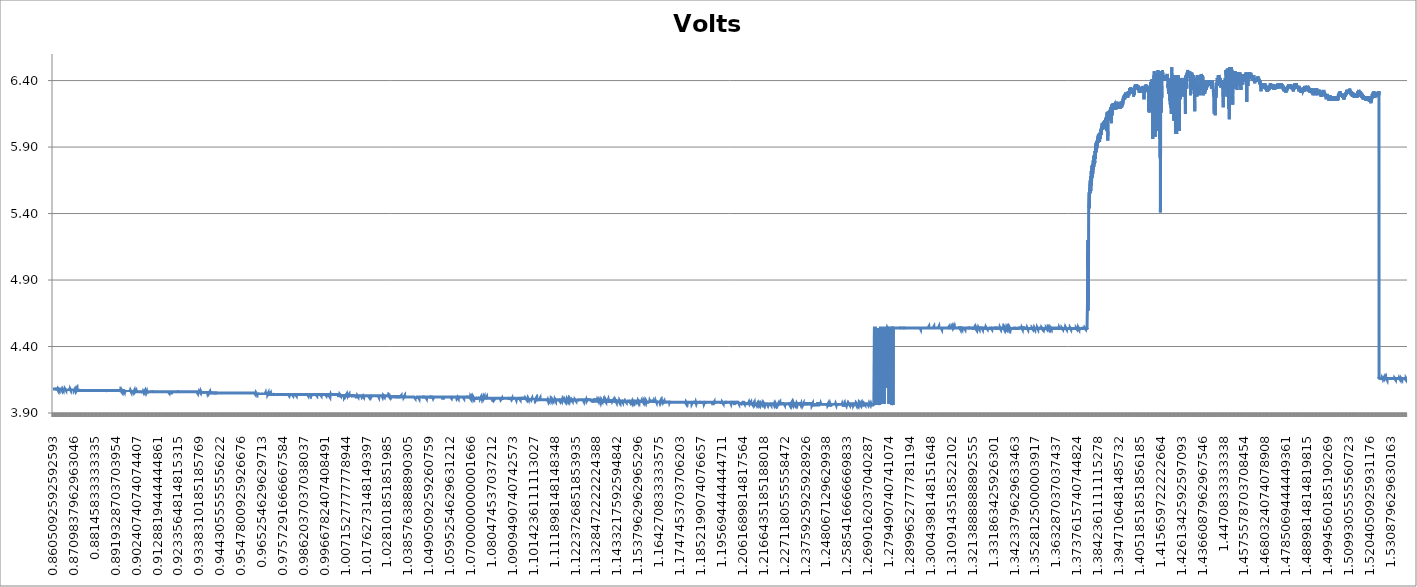
| Category | Volts |
|---|---|
| 0.8605092592592593 | 4.08 |
| 0.8605671296296297 | 4.08 |
| 0.8606250000000001 | 4.08 |
| 0.8606828703703705 | 4.08 |
| 0.8607407407407409 | 4.08 |
| 0.8607986111111113 | 4.08 |
| 0.8608564814814818 | 4.08 |
| 0.8609143518518522 | 4.08 |
| 0.8609722222222226 | 4.08 |
| 0.861030092592593 | 4.08 |
| 0.8610879629629634 | 4.08 |
| 0.8611458333333338 | 4.08 |
| 0.8612037037037042 | 4.08 |
| 0.8612615740740747 | 4.08 |
| 0.8613194444444451 | 4.08 |
| 0.8613773148148155 | 4.08 |
| 0.8614351851851859 | 4.08 |
| 0.8614930555555563 | 4.08 |
| 0.8615509259259267 | 4.08 |
| 0.8616087962962972 | 4.08 |
| 0.8616666666666676 | 4.08 |
| 0.861724537037038 | 4.08 |
| 0.8617824074074084 | 4.08 |
| 0.8618402777777788 | 4.08 |
| 0.8618981481481492 | 4.08 |
| 0.8619560185185197 | 4.08 |
| 0.8620138888888901 | 4.08 |
| 0.8620717592592605 | 4.08 |
| 0.8621296296296309 | 4.08 |
| 0.8621875000000013 | 4.07 |
| 0.8622453703703717 | 4.08 |
| 0.8623032407407422 | 4.08 |
| 0.8623611111111126 | 4.08 |
| 0.862418981481483 | 4.08 |
| 0.8624768518518534 | 4.08 |
| 0.8625347222222238 | 4.08 |
| 0.8625925925925942 | 4.08 |
| 0.8626504629629647 | 4.08 |
| 0.8627083333333351 | 4.08 |
| 0.8627662037037055 | 4.08 |
| 0.8628240740740759 | 4.08 |
| 0.8628819444444463 | 4.08 |
| 0.8629398148148167 | 4.08 |
| 0.8629976851851872 | 4.08 |
| 0.8630555555555576 | 4.08 |
| 0.863113425925928 | 4.07 |
| 0.8631712962962984 | 4.08 |
| 0.8632291666666688 | 4.08 |
| 0.8632870370370392 | 4.08 |
| 0.8633449074074097 | 4.08 |
| 0.8634027777777801 | 4.08 |
| 0.8634606481481505 | 4.08 |
| 0.8635185185185209 | 4.08 |
| 0.8635763888888913 | 4.08 |
| 0.8636342592592617 | 4.08 |
| 0.8636921296296322 | 4.07 |
| 0.8637500000000026 | 4.08 |
| 0.863807870370373 | 4.08 |
| 0.8638657407407434 | 4.08 |
| 0.8639236111111138 | 4.08 |
| 0.8639814814814842 | 4.08 |
| 0.8640393518518547 | 4.08 |
| 0.8640972222222251 | 4.08 |
| 0.8641550925925955 | 4.08 |
| 0.8642129629629659 | 4.08 |
| 0.8642708333333363 | 4.08 |
| 0.8643287037037067 | 4.08 |
| 0.8643865740740772 | 4.08 |
| 0.8644444444444476 | 4.08 |
| 0.864502314814818 | 4.08 |
| 0.8645601851851884 | 4.08 |
| 0.8646180555555588 | 4.08 |
| 0.8646759259259292 | 4.08 |
| 0.8647337962962997 | 4.08 |
| 0.8647916666666701 | 4.08 |
| 0.8648495370370405 | 4.08 |
| 0.8649074074074109 | 4.08 |
| 0.8649652777777813 | 4.08 |
| 0.8650231481481517 | 4.08 |
| 0.8650810185185221 | 4.07 |
| 0.8651388888888926 | 4.07 |
| 0.865196759259263 | 4.07 |
| 0.8652546296296334 | 4.08 |
| 0.8653125000000038 | 4.08 |
| 0.8653703703703742 | 4.08 |
| 0.8654282407407446 | 4.08 |
| 0.8654861111111151 | 4.08 |
| 0.8655439814814855 | 4.08 |
| 0.8656018518518559 | 4.08 |
| 0.8656597222222263 | 4.07 |
| 0.8657175925925967 | 4.08 |
| 0.8657754629629671 | 4.07 |
| 0.8658333333333376 | 4.08 |
| 0.865891203703708 | 4.07 |
| 0.8659490740740784 | 4.08 |
| 0.8660069444444488 | 4.08 |
| 0.8660648148148192 | 4.07 |
| 0.8661226851851896 | 4.08 |
| 0.8661805555555601 | 4.07 |
| 0.8662384259259305 | 4.08 |
| 0.8662962962963009 | 4.08 |
| 0.8663541666666713 | 4.08 |
| 0.8664120370370417 | 4.08 |
| 0.8664699074074121 | 4.07 |
| 0.8665277777777826 | 4.08 |
| 0.866585648148153 | 4.08 |
| 0.8666435185185234 | 4.08 |
| 0.8667013888888938 | 4.08 |
| 0.8667592592592642 | 4.08 |
| 0.8668171296296346 | 4.08 |
| 0.8668750000000051 | 4.08 |
| 0.8669328703703755 | 4.08 |
| 0.8669907407407459 | 4.07 |
| 0.8670486111111163 | 4.08 |
| 0.8671064814814867 | 4.08 |
| 0.8671643518518571 | 4.07 |
| 0.8672222222222276 | 4.07 |
| 0.867280092592598 | 4.08 |
| 0.8673379629629684 | 4.07 |
| 0.8673958333333388 | 4.08 |
| 0.8674537037037092 | 4.07 |
| 0.8675115740740796 | 4.08 |
| 0.86756944444445 | 4.08 |
| 0.8676273148148205 | 4.08 |
| 0.8676851851851909 | 4.08 |
| 0.8677430555555613 | 4.07 |
| 0.8678009259259317 | 4.07 |
| 0.8678587962963021 | 4.08 |
| 0.8679166666666726 | 4.08 |
| 0.867974537037043 | 4.08 |
| 0.8680324074074134 | 4.07 |
| 0.8680902777777838 | 4.08 |
| 0.8681481481481542 | 4.07 |
| 0.8682060185185246 | 4.08 |
| 0.868263888888895 | 4.07 |
| 0.8683217592592655 | 4.08 |
| 0.8683796296296359 | 4.08 |
| 0.8684375000000063 | 4.08 |
| 0.8684953703703767 | 4.07 |
| 0.8685532407407471 | 4.08 |
| 0.8686111111111176 | 4.07 |
| 0.868668981481488 | 4.07 |
| 0.8687268518518584 | 4.07 |
| 0.8687847222222288 | 4.07 |
| 0.8688425925925992 | 4.07 |
| 0.8689004629629696 | 4.08 |
| 0.86895833333334 | 4.07 |
| 0.8690162037037105 | 4.07 |
| 0.8690740740740809 | 4.08 |
| 0.8691319444444513 | 4.08 |
| 0.8691898148148217 | 4.08 |
| 0.8692476851851921 | 4.08 |
| 0.8693055555555625 | 4.08 |
| 0.869363425925933 | 4.08 |
| 0.8694212962963034 | 4.07 |
| 0.8694791666666738 | 4.07 |
| 0.8695370370370442 | 4.08 |
| 0.8695949074074146 | 4.07 |
| 0.869652777777785 | 4.08 |
| 0.8697106481481555 | 4.07 |
| 0.8697685185185259 | 4.08 |
| 0.8698263888888963 | 4.08 |
| 0.8698842592592667 | 4.07 |
| 0.8699421296296371 | 4.08 |
| 0.8700000000000075 | 4.07 |
| 0.870057870370378 | 4.07 |
| 0.8701157407407484 | 4.07 |
| 0.8701736111111188 | 4.08 |
| 0.8702314814814892 | 4.08 |
| 0.8702893518518596 | 4.07 |
| 0.87034722222223 | 4.08 |
| 0.8704050925926005 | 4.07 |
| 0.8704629629629709 | 4.08 |
| 0.8705208333333413 | 4.07 |
| 0.8705787037037117 | 4.07 |
| 0.8706365740740821 | 4.08 |
| 0.8706944444444525 | 4.07 |
| 0.870752314814823 | 4.07 |
| 0.8708101851851934 | 4.07 |
| 0.8708680555555638 | 4.08 |
| 0.8709259259259342 | 4.07 |
| 0.8709837962963046 | 4.08 |
| 0.871041666666675 | 4.07 |
| 0.8710995370370455 | 4.07 |
| 0.8711574074074159 | 4.07 |
| 0.8712152777777863 | 4.07 |
| 0.8712731481481567 | 4.07 |
| 0.8713310185185271 | 4.07 |
| 0.8713888888888975 | 4.07 |
| 0.871446759259268 | 4.08 |
| 0.8715046296296384 | 4.08 |
| 0.8715625000000088 | 4.08 |
| 0.8716203703703792 | 4.07 |
| 0.8716782407407496 | 4.08 |
| 0.87173611111112 | 4.08 |
| 0.8717939814814905 | 4.08 |
| 0.8718518518518609 | 4.07 |
| 0.8719097222222313 | 4.07 |
| 0.8719675925926017 | 4.07 |
| 0.8720254629629721 | 4.07 |
| 0.8720833333333425 | 4.07 |
| 0.872141203703713 | 4.07 |
| 0.8721990740740834 | 4.08 |
| 0.8722569444444538 | 4.07 |
| 0.8723148148148242 | 4.07 |
| 0.8723726851851946 | 4.07 |
| 0.872430555555565 | 4.07 |
| 0.8724884259259355 | 4.07 |
| 0.8725462962963059 | 4.07 |
| 0.8726041666666763 | 4.08 |
| 0.8726620370370467 | 4.07 |
| 0.8727199074074171 | 4.07 |
| 0.8727777777777875 | 4.08 |
| 0.872835648148158 | 4.07 |
| 0.8728935185185284 | 4.07 |
| 0.8729513888888988 | 4.07 |
| 0.8730092592592692 | 4.07 |
| 0.8730671296296396 | 4.07 |
| 0.87312500000001 | 4.07 |
| 0.8731828703703804 | 4.07 |
| 0.8732407407407509 | 4.07 |
| 0.8732986111111213 | 4.07 |
| 0.8733564814814917 | 4.07 |
| 0.8734143518518621 | 4.07 |
| 0.8734722222222325 | 4.07 |
| 0.873530092592603 | 4.07 |
| 0.8735879629629734 | 4.07 |
| 0.8736458333333438 | 4.07 |
| 0.8737037037037142 | 4.07 |
| 0.8737615740740846 | 4.07 |
| 0.873819444444455 | 4.07 |
| 0.8738773148148254 | 4.07 |
| 0.8739351851851959 | 4.07 |
| 0.8739930555555663 | 4.07 |
| 0.8740509259259367 | 4.07 |
| 0.8741087962963071 | 4.07 |
| 0.8741666666666775 | 4.08 |
| 0.8742245370370479 | 4.07 |
| 0.8742824074074184 | 4.08 |
| 0.8743402777777888 | 4.08 |
| 0.8743981481481592 | 4.07 |
| 0.8744560185185296 | 4.07 |
| 0.8745138888889 | 4.07 |
| 0.8745717592592704 | 4.07 |
| 0.8746296296296409 | 4.07 |
| 0.8746875000000113 | 4.07 |
| 0.8747453703703817 | 4.07 |
| 0.8748032407407521 | 4.07 |
| 0.8748611111111225 | 4.07 |
| 0.8749189814814929 | 4.07 |
| 0.8749768518518634 | 4.07 |
| 0.8750347222222338 | 4.07 |
| 0.8750925925926042 | 4.07 |
| 0.8751504629629746 | 4.07 |
| 0.875208333333345 | 4.07 |
| 0.8752662037037154 | 4.07 |
| 0.8753240740740859 | 4.07 |
| 0.8753819444444563 | 4.07 |
| 0.8754398148148267 | 4.07 |
| 0.8754976851851971 | 4.07 |
| 0.8755555555555675 | 4.07 |
| 0.8756134259259379 | 4.07 |
| 0.8756712962963084 | 4.07 |
| 0.8757291666666788 | 4.07 |
| 0.8757870370370492 | 4.07 |
| 0.8758449074074196 | 4.07 |
| 0.87590277777779 | 4.07 |
| 0.8759606481481604 | 4.07 |
| 0.8760185185185309 | 4.07 |
| 0.8760763888889013 | 4.07 |
| 0.8761342592592717 | 4.06 |
| 0.8761921296296421 | 4.07 |
| 0.8762500000000125 | 4.07 |
| 0.8763078703703829 | 4.07 |
| 0.8763657407407534 | 4.07 |
| 0.8764236111111238 | 4.07 |
| 0.8764814814814942 | 4.07 |
| 0.8765393518518646 | 4.07 |
| 0.876597222222235 | 4.07 |
| 0.8766550925926054 | 4.07 |
| 0.8767129629629759 | 4.07 |
| 0.8767708333333463 | 4.07 |
| 0.8768287037037167 | 4.07 |
| 0.8768865740740871 | 4.07 |
| 0.8769444444444575 | 4.07 |
| 0.8770023148148279 | 4.07 |
| 0.8770601851851983 | 4.07 |
| 0.8771180555555688 | 4.07 |
| 0.8771759259259392 | 4.07 |
| 0.8772337962963096 | 4.07 |
| 0.87729166666668 | 4.07 |
| 0.8773495370370504 | 4.07 |
| 0.8774074074074208 | 4.07 |
| 0.8774652777777913 | 4.07 |
| 0.8775231481481617 | 4.07 |
| 0.8775810185185321 | 4.07 |
| 0.8776388888889025 | 4.07 |
| 0.8776967592592729 | 4.07 |
| 0.8777546296296433 | 4.07 |
| 0.8778125000000138 | 4.07 |
| 0.8778703703703842 | 4.07 |
| 0.8779282407407546 | 4.07 |
| 0.877986111111125 | 4.07 |
| 0.8780439814814954 | 4.07 |
| 0.8781018518518658 | 4.07 |
| 0.8781597222222363 | 4.07 |
| 0.8782175925926067 | 4.07 |
| 0.8782754629629771 | 4.07 |
| 0.8783333333333475 | 4.07 |
| 0.8783912037037179 | 4.07 |
| 0.8784490740740883 | 4.07 |
| 0.8785069444444588 | 4.07 |
| 0.8785648148148292 | 4.07 |
| 0.8786226851851996 | 4.07 |
| 0.87868055555557 | 4.07 |
| 0.8787384259259404 | 4.07 |
| 0.8787962962963108 | 4.07 |
| 0.8788541666666813 | 4.07 |
| 0.8789120370370517 | 4.07 |
| 0.8789699074074221 | 4.07 |
| 0.8790277777777925 | 4.07 |
| 0.8790856481481629 | 4.07 |
| 0.8791435185185333 | 4.07 |
| 0.8792013888889038 | 4.07 |
| 0.8792592592592742 | 4.07 |
| 0.8793171296296446 | 4.07 |
| 0.879375000000015 | 4.07 |
| 0.8794328703703854 | 4.07 |
| 0.8794907407407558 | 4.07 |
| 0.8795486111111263 | 4.07 |
| 0.8796064814814967 | 4.07 |
| 0.8796643518518671 | 4.07 |
| 0.8797222222222375 | 4.07 |
| 0.8797800925926079 | 4.07 |
| 0.8798379629629783 | 4.07 |
| 0.8798958333333488 | 4.07 |
| 0.8799537037037192 | 4.07 |
| 0.8800115740740896 | 4.07 |
| 0.88006944444446 | 4.07 |
| 0.8801273148148304 | 4.07 |
| 0.8801851851852008 | 4.07 |
| 0.8802430555555713 | 4.07 |
| 0.8803009259259417 | 4.07 |
| 0.8803587962963121 | 4.07 |
| 0.8804166666666825 | 4.06 |
| 0.8804745370370529 | 4.06 |
| 0.8805324074074233 | 4.06 |
| 0.8805902777777938 | 4.07 |
| 0.8806481481481642 | 4.07 |
| 0.8807060185185346 | 4.07 |
| 0.880763888888905 | 4.07 |
| 0.8808217592592754 | 4.07 |
| 0.8808796296296458 | 4.07 |
| 0.8809375000000162 | 4.07 |
| 0.8809953703703867 | 4.07 |
| 0.8810532407407571 | 4.07 |
| 0.8811111111111275 | 4.07 |
| 0.8811689814814979 | 4.07 |
| 0.8812268518518683 | 4.07 |
| 0.8812847222222387 | 4.07 |
| 0.8813425925926092 | 4.07 |
| 0.8814004629629796 | 4.07 |
| 0.88145833333335 | 4.07 |
| 0.8815162037037204 | 4.07 |
| 0.8815740740740908 | 4.07 |
| 0.8816319444444612 | 4.07 |
| 0.8816898148148317 | 4.07 |
| 0.8817476851852021 | 4.07 |
| 0.8818055555555725 | 4.07 |
| 0.8818634259259429 | 4.07 |
| 0.8819212962963133 | 4.07 |
| 0.8819791666666837 | 4.07 |
| 0.8820370370370542 | 4.07 |
| 0.8820949074074246 | 4.07 |
| 0.882152777777795 | 4.07 |
| 0.8822106481481654 | 4.07 |
| 0.8822685185185358 | 4.07 |
| 0.8823263888889062 | 4.07 |
| 0.8823842592592767 | 4.07 |
| 0.8824421296296471 | 4.07 |
| 0.8825000000000175 | 4.07 |
| 0.8825578703703879 | 4.07 |
| 0.8826157407407583 | 4.07 |
| 0.8826736111111287 | 4.07 |
| 0.8827314814814992 | 4.07 |
| 0.8827893518518696 | 4.07 |
| 0.88284722222224 | 4.07 |
| 0.8829050925926104 | 4.07 |
| 0.8829629629629808 | 4.07 |
| 0.8830208333333512 | 4.07 |
| 0.8830787037037217 | 4.07 |
| 0.8831365740740921 | 4.07 |
| 0.8831944444444625 | 4.07 |
| 0.8832523148148329 | 4.07 |
| 0.8833101851852033 | 4.07 |
| 0.8833680555555737 | 4.07 |
| 0.8834259259259442 | 4.07 |
| 0.8834837962963146 | 4.07 |
| 0.883541666666685 | 4.07 |
| 0.8835995370370554 | 4.07 |
| 0.8836574074074258 | 4.07 |
| 0.8837152777777962 | 4.07 |
| 0.8837731481481667 | 4.07 |
| 0.8838310185185371 | 4.07 |
| 0.8838888888889075 | 4.07 |
| 0.8839467592592779 | 4.07 |
| 0.8840046296296483 | 4.07 |
| 0.8840625000000187 | 4.07 |
| 0.8841203703703892 | 4.07 |
| 0.8841782407407596 | 4.07 |
| 0.88423611111113 | 4.07 |
| 0.8842939814815004 | 4.07 |
| 0.8843518518518708 | 4.07 |
| 0.8844097222222412 | 4.07 |
| 0.8844675925926117 | 4.07 |
| 0.8845254629629821 | 4.07 |
| 0.8845833333333525 | 4.07 |
| 0.8846412037037229 | 4.07 |
| 0.8846990740740933 | 4.07 |
| 0.8847569444444637 | 4.07 |
| 0.8848148148148341 | 4.07 |
| 0.8848726851852046 | 4.07 |
| 0.884930555555575 | 4.07 |
| 0.8849884259259454 | 4.07 |
| 0.8850462962963158 | 4.07 |
| 0.8851041666666862 | 4.07 |
| 0.8851620370370566 | 4.07 |
| 0.8852199074074271 | 4.07 |
| 0.8852777777777975 | 4.07 |
| 0.8853356481481679 | 4.07 |
| 0.8853935185185383 | 4.07 |
| 0.8854513888889087 | 4.07 |
| 0.8855092592592791 | 4.07 |
| 0.8855671296296496 | 4.07 |
| 0.88562500000002 | 4.07 |
| 0.8856828703703904 | 4.07 |
| 0.8857407407407608 | 4.07 |
| 0.8857986111111312 | 4.07 |
| 0.8858564814815016 | 4.07 |
| 0.8859143518518721 | 4.07 |
| 0.8859722222222425 | 4.07 |
| 0.8860300925926129 | 4.07 |
| 0.8860879629629833 | 4.07 |
| 0.8861458333333537 | 4.07 |
| 0.8862037037037241 | 4.07 |
| 0.8862615740740946 | 4.07 |
| 0.886319444444465 | 4.07 |
| 0.8863773148148354 | 4.07 |
| 0.8864351851852058 | 4.07 |
| 0.8864930555555762 | 4.06 |
| 0.8865509259259466 | 4.07 |
| 0.8866087962963171 | 4.06 |
| 0.8866666666666875 | 4.06 |
| 0.8867245370370579 | 4.06 |
| 0.8867824074074283 | 4.06 |
| 0.8868402777777987 | 4.06 |
| 0.8868981481481691 | 4.07 |
| 0.8869560185185396 | 4.06 |
| 0.88701388888891 | 4.07 |
| 0.8870717592592804 | 4.06 |
| 0.8871296296296508 | 4.06 |
| 0.8871875000000212 | 4.07 |
| 0.8872453703703916 | 4.07 |
| 0.8873032407407621 | 4.07 |
| 0.8873611111111325 | 4.07 |
| 0.8874189814815029 | 4.07 |
| 0.8874768518518733 | 4.07 |
| 0.8875347222222437 | 4.07 |
| 0.8875925925926141 | 4.07 |
| 0.8876504629629846 | 4.07 |
| 0.887708333333355 | 4.07 |
| 0.8877662037037254 | 4.07 |
| 0.8878240740740958 | 4.07 |
| 0.8878819444444662 | 4.07 |
| 0.8879398148148366 | 4.07 |
| 0.887997685185207 | 4.07 |
| 0.8880555555555775 | 4.07 |
| 0.8881134259259479 | 4.07 |
| 0.8881712962963183 | 4.07 |
| 0.8882291666666887 | 4.07 |
| 0.8882870370370591 | 4.07 |
| 0.8883449074074296 | 4.07 |
| 0.8884027777778 | 4.07 |
| 0.8884606481481704 | 4.07 |
| 0.8885185185185408 | 4.07 |
| 0.8885763888889112 | 4.07 |
| 0.8886342592592816 | 4.07 |
| 0.888692129629652 | 4.07 |
| 0.8887500000000225 | 4.07 |
| 0.8888078703703929 | 4.07 |
| 0.8888657407407633 | 4.07 |
| 0.8889236111111337 | 4.07 |
| 0.8889814814815041 | 4.07 |
| 0.8890393518518745 | 4.07 |
| 0.889097222222245 | 4.07 |
| 0.8891550925926154 | 4.07 |
| 0.8892129629629858 | 4.07 |
| 0.8892708333333562 | 4.07 |
| 0.8893287037037266 | 4.07 |
| 0.889386574074097 | 4.07 |
| 0.8894444444444675 | 4.07 |
| 0.8895023148148379 | 4.07 |
| 0.8895601851852083 | 4.07 |
| 0.8896180555555787 | 4.07 |
| 0.8896759259259491 | 4.07 |
| 0.8897337962963195 | 4.07 |
| 0.88979166666669 | 4.07 |
| 0.8898495370370604 | 4.07 |
| 0.8899074074074308 | 4.07 |
| 0.8899652777778012 | 4.07 |
| 0.8900231481481716 | 4.07 |
| 0.890081018518542 | 4.07 |
| 0.8901388888889125 | 4.07 |
| 0.8901967592592829 | 4.07 |
| 0.8902546296296533 | 4.07 |
| 0.8903125000000237 | 4.07 |
| 0.8903703703703941 | 4.07 |
| 0.8904282407407645 | 4.07 |
| 0.890486111111135 | 4.07 |
| 0.8905439814815054 | 4.07 |
| 0.8906018518518758 | 4.07 |
| 0.8906597222222462 | 4.07 |
| 0.8907175925926166 | 4.07 |
| 0.890775462962987 | 4.07 |
| 0.8908333333333575 | 4.07 |
| 0.8908912037037279 | 4.07 |
| 0.8909490740740983 | 4.07 |
| 0.8910069444444687 | 4.07 |
| 0.8910648148148391 | 4.07 |
| 0.8911226851852095 | 4.07 |
| 0.89118055555558 | 4.07 |
| 0.8912384259259504 | 4.07 |
| 0.8912962962963208 | 4.07 |
| 0.8913541666666912 | 4.07 |
| 0.8914120370370616 | 4.06 |
| 0.891469907407432 | 4.07 |
| 0.8915277777778025 | 4.07 |
| 0.8915856481481729 | 4.07 |
| 0.8916435185185433 | 4.07 |
| 0.8917013888889137 | 4.07 |
| 0.8917592592592841 | 4.07 |
| 0.8918171296296545 | 4.07 |
| 0.891875000000025 | 4.07 |
| 0.8919328703703954 | 4.07 |
| 0.8919907407407658 | 4.07 |
| 0.8920486111111362 | 4.07 |
| 0.8921064814815066 | 4.07 |
| 0.892164351851877 | 4.07 |
| 0.8922222222222475 | 4.07 |
| 0.8922800925926179 | 4.07 |
| 0.8923379629629883 | 4.07 |
| 0.8923958333333587 | 4.07 |
| 0.8924537037037291 | 4.07 |
| 0.8925115740740995 | 4.07 |
| 0.89256944444447 | 4.07 |
| 0.8926273148148404 | 4.07 |
| 0.8926851851852108 | 4.07 |
| 0.8927430555555812 | 4.07 |
| 0.8928009259259516 | 4.07 |
| 0.892858796296322 | 4.07 |
| 0.8929166666666924 | 4.07 |
| 0.8929745370370629 | 4.07 |
| 0.8930324074074333 | 4.07 |
| 0.8930902777778037 | 4.07 |
| 0.8931481481481741 | 4.07 |
| 0.8932060185185445 | 4.07 |
| 0.893263888888915 | 4.07 |
| 0.8933217592592854 | 4.07 |
| 0.8933796296296558 | 4.07 |
| 0.8934375000000262 | 4.07 |
| 0.8934953703703966 | 4.07 |
| 0.893553240740767 | 4.07 |
| 0.8936111111111374 | 4.07 |
| 0.8936689814815079 | 4.07 |
| 0.8937268518518783 | 4.07 |
| 0.8937847222222487 | 4.07 |
| 0.8938425925926191 | 4.07 |
| 0.8939004629629895 | 4.07 |
| 0.89395833333336 | 4.07 |
| 0.8940162037037304 | 4.07 |
| 0.8940740740741008 | 4.07 |
| 0.8941319444444712 | 4.07 |
| 0.8941898148148416 | 4.07 |
| 0.894247685185212 | 4.07 |
| 0.8943055555555824 | 4.07 |
| 0.8943634259259529 | 4.06 |
| 0.8944212962963233 | 4.07 |
| 0.8944791666666937 | 4.07 |
| 0.8945370370370641 | 4.07 |
| 0.8945949074074345 | 4.07 |
| 0.8946527777778049 | 4.07 |
| 0.8947106481481754 | 4.07 |
| 0.8947685185185458 | 4.07 |
| 0.8948263888889162 | 4.07 |
| 0.8948842592592866 | 4.06 |
| 0.894942129629657 | 4.07 |
| 0.8950000000000274 | 4.07 |
| 0.8950578703703979 | 4.07 |
| 0.8951157407407683 | 4.07 |
| 0.8951736111111387 | 4.07 |
| 0.8952314814815091 | 4.07 |
| 0.8952893518518795 | 4.07 |
| 0.8953472222222499 | 4.06 |
| 0.8954050925926204 | 4.07 |
| 0.8954629629629908 | 4.06 |
| 0.8955208333333612 | 4.06 |
| 0.8955787037037316 | 4.07 |
| 0.895636574074102 | 4.07 |
| 0.8956944444444724 | 4.07 |
| 0.8957523148148429 | 4.07 |
| 0.8958101851852133 | 4.07 |
| 0.8958680555555837 | 4.07 |
| 0.8959259259259541 | 4.07 |
| 0.8959837962963245 | 4.07 |
| 0.8960416666666949 | 4.07 |
| 0.8960995370370654 | 4.07 |
| 0.8961574074074358 | 4.07 |
| 0.8962152777778062 | 4.07 |
| 0.8962731481481766 | 4.07 |
| 0.896331018518547 | 4.07 |
| 0.8963888888889174 | 4.06 |
| 0.8964467592592879 | 4.06 |
| 0.8965046296296583 | 4.07 |
| 0.8965625000000287 | 4.06 |
| 0.8966203703703991 | 4.07 |
| 0.8966782407407695 | 4.07 |
| 0.8967361111111399 | 4.07 |
| 0.8967939814815103 | 4.07 |
| 0.8968518518518808 | 4.06 |
| 0.8969097222222512 | 4.07 |
| 0.8969675925926216 | 4.07 |
| 0.897025462962992 | 4.06 |
| 0.8970833333333624 | 4.06 |
| 0.8971412037037328 | 4.07 |
| 0.8971990740741033 | 4.07 |
| 0.8972569444444737 | 4.07 |
| 0.8973148148148441 | 4.07 |
| 0.8973726851852145 | 4.06 |
| 0.8974305555555849 | 4.07 |
| 0.8974884259259553 | 4.07 |
| 0.8975462962963258 | 4.07 |
| 0.8976041666666962 | 4.07 |
| 0.8976620370370666 | 4.07 |
| 0.897719907407437 | 4.06 |
| 0.8977777777778074 | 4.07 |
| 0.8978356481481778 | 4.07 |
| 0.8978935185185483 | 4.07 |
| 0.8979513888889187 | 4.06 |
| 0.8980092592592891 | 4.07 |
| 0.8980671296296595 | 4.06 |
| 0.8981250000000299 | 4.07 |
| 0.8981828703704003 | 4.06 |
| 0.8982407407407708 | 4.06 |
| 0.8982986111111412 | 4.07 |
| 0.8983564814815116 | 4.06 |
| 0.898414351851882 | 4.06 |
| 0.8984722222222524 | 4.07 |
| 0.8985300925926228 | 4.06 |
| 0.8985879629629933 | 4.06 |
| 0.8986458333333637 | 4.06 |
| 0.8987037037037341 | 4.07 |
| 0.8987615740741045 | 4.07 |
| 0.8988194444444749 | 4.07 |
| 0.8988773148148453 | 4.06 |
| 0.8989351851852158 | 4.06 |
| 0.8989930555555862 | 4.06 |
| 0.8990509259259566 | 4.07 |
| 0.899108796296327 | 4.06 |
| 0.8991666666666974 | 4.06 |
| 0.8992245370370678 | 4.06 |
| 0.8992824074074383 | 4.07 |
| 0.8993402777778087 | 4.07 |
| 0.8993981481481791 | 4.07 |
| 0.8994560185185495 | 4.07 |
| 0.8995138888889199 | 4.07 |
| 0.8995717592592903 | 4.07 |
| 0.8996296296296608 | 4.06 |
| 0.8996875000000312 | 4.07 |
| 0.8997453703704016 | 4.06 |
| 0.899803240740772 | 4.06 |
| 0.8998611111111424 | 4.07 |
| 0.8999189814815128 | 4.06 |
| 0.8999768518518833 | 4.06 |
| 0.9000347222222537 | 4.06 |
| 0.9000925925926241 | 4.06 |
| 0.9001504629629945 | 4.06 |
| 0.9002083333333649 | 4.06 |
| 0.9002662037037353 | 4.06 |
| 0.9003240740741058 | 4.06 |
| 0.9003819444444762 | 4.06 |
| 0.9004398148148466 | 4.06 |
| 0.900497685185217 | 4.06 |
| 0.9005555555555874 | 4.07 |
| 0.9006134259259578 | 4.07 |
| 0.9006712962963282 | 4.06 |
| 0.9007291666666987 | 4.07 |
| 0.9007870370370691 | 4.06 |
| 0.9008449074074395 | 4.07 |
| 0.9009027777778099 | 4.07 |
| 0.9009606481481803 | 4.06 |
| 0.9010185185185507 | 4.06 |
| 0.9010763888889212 | 4.06 |
| 0.9011342592592916 | 4.06 |
| 0.901192129629662 | 4.06 |
| 0.9012500000000324 | 4.06 |
| 0.9013078703704028 | 4.07 |
| 0.9013657407407732 | 4.07 |
| 0.9014236111111437 | 4.06 |
| 0.9014814814815141 | 4.06 |
| 0.9015393518518845 | 4.07 |
| 0.9015972222222549 | 4.06 |
| 0.9016550925926253 | 4.06 |
| 0.9017129629629957 | 4.06 |
| 0.9017708333333662 | 4.06 |
| 0.9018287037037366 | 4.06 |
| 0.901886574074107 | 4.06 |
| 0.9019444444444774 | 4.06 |
| 0.9020023148148478 | 4.06 |
| 0.9020601851852182 | 4.06 |
| 0.9021180555555887 | 4.07 |
| 0.9021759259259591 | 4.07 |
| 0.9022337962963295 | 4.06 |
| 0.9022916666666999 | 4.07 |
| 0.9023495370370703 | 4.06 |
| 0.9024074074074407 | 4.07 |
| 0.9024652777778112 | 4.06 |
| 0.9025231481481816 | 4.06 |
| 0.902581018518552 | 4.06 |
| 0.9026388888889224 | 4.06 |
| 0.9026967592592928 | 4.06 |
| 0.9027546296296632 | 4.06 |
| 0.9028125000000337 | 4.06 |
| 0.9028703703704041 | 4.06 |
| 0.9029282407407745 | 4.06 |
| 0.9029861111111449 | 4.06 |
| 0.9030439814815153 | 4.06 |
| 0.9031018518518857 | 4.06 |
| 0.9031597222222562 | 4.06 |
| 0.9032175925926266 | 4.06 |
| 0.903275462962997 | 4.06 |
| 0.9033333333333674 | 4.06 |
| 0.9033912037037378 | 4.06 |
| 0.9034490740741082 | 4.06 |
| 0.9035069444444787 | 4.06 |
| 0.9035648148148491 | 4.06 |
| 0.9036226851852195 | 4.06 |
| 0.9036805555555899 | 4.06 |
| 0.9037384259259603 | 4.06 |
| 0.9037962962963307 | 4.06 |
| 0.9038541666667012 | 4.06 |
| 0.9039120370370716 | 4.06 |
| 0.903969907407442 | 4.06 |
| 0.9040277777778124 | 4.06 |
| 0.9040856481481828 | 4.06 |
| 0.9041435185185532 | 4.06 |
| 0.9042013888889237 | 4.06 |
| 0.9042592592592941 | 4.06 |
| 0.9043171296296645 | 4.06 |
| 0.9043750000000349 | 4.06 |
| 0.9044328703704053 | 4.06 |
| 0.9044907407407757 | 4.06 |
| 0.9045486111111462 | 4.06 |
| 0.9046064814815166 | 4.06 |
| 0.904664351851887 | 4.06 |
| 0.9047222222222574 | 4.06 |
| 0.9047800925926278 | 4.06 |
| 0.9048379629629982 | 4.06 |
| 0.9048958333333686 | 4.06 |
| 0.9049537037037391 | 4.06 |
| 0.9050115740741095 | 4.06 |
| 0.9050694444444799 | 4.06 |
| 0.9051273148148503 | 4.06 |
| 0.9051851851852207 | 4.06 |
| 0.9052430555555911 | 4.06 |
| 0.9053009259259616 | 4.05 |
| 0.905358796296332 | 4.06 |
| 0.9054166666667024 | 4.05 |
| 0.9054745370370728 | 4.06 |
| 0.9055324074074432 | 4.05 |
| 0.9055902777778136 | 4.05 |
| 0.9056481481481841 | 4.05 |
| 0.9057060185185545 | 4.06 |
| 0.9057638888889249 | 4.06 |
| 0.9058217592592953 | 4.06 |
| 0.9058796296296657 | 4.06 |
| 0.9059375000000361 | 4.06 |
| 0.9059953703704066 | 4.06 |
| 0.906053240740777 | 4.05 |
| 0.9061111111111474 | 4.05 |
| 0.9061689814815178 | 4.05 |
| 0.9062268518518882 | 4.05 |
| 0.9062847222222586 | 4.05 |
| 0.9063425925926291 | 4.05 |
| 0.9064004629629995 | 4.06 |
| 0.9064583333333699 | 4.05 |
| 0.9065162037037403 | 4.05 |
| 0.9065740740741107 | 4.06 |
| 0.9066319444444811 | 4.05 |
| 0.9066898148148516 | 4.06 |
| 0.906747685185222 | 4.05 |
| 0.9068055555555924 | 4.05 |
| 0.9068634259259628 | 4.05 |
| 0.9069212962963332 | 4.06 |
| 0.9069791666667036 | 4.06 |
| 0.9070370370370741 | 4.06 |
| 0.9070949074074445 | 4.06 |
| 0.9071527777778149 | 4.05 |
| 0.9072106481481853 | 4.05 |
| 0.9072685185185557 | 4.05 |
| 0.9073263888889261 | 4.05 |
| 0.9073842592592966 | 4.05 |
| 0.907442129629667 | 4.06 |
| 0.9075000000000374 | 4.06 |
| 0.9075578703704078 | 4.05 |
| 0.9076157407407782 | 4.05 |
| 0.9076736111111486 | 4.05 |
| 0.907731481481519 | 4.06 |
| 0.9077893518518895 | 4.05 |
| 0.9078472222222599 | 4.05 |
| 0.9079050925926303 | 4.05 |
| 0.9079629629630007 | 4.05 |
| 0.9080208333333711 | 4.05 |
| 0.9080787037037416 | 4.06 |
| 0.908136574074112 | 4.06 |
| 0.9081944444444824 | 4.06 |
| 0.9082523148148528 | 4.06 |
| 0.9083101851852232 | 4.06 |
| 0.9083680555555936 | 4.06 |
| 0.908425925925964 | 4.06 |
| 0.9084837962963345 | 4.06 |
| 0.9085416666667049 | 4.06 |
| 0.9085995370370753 | 4.06 |
| 0.9086574074074457 | 4.06 |
| 0.9087152777778161 | 4.06 |
| 0.9087731481481865 | 4.06 |
| 0.908831018518557 | 4.06 |
| 0.9088888888889274 | 4.06 |
| 0.9089467592592978 | 4.06 |
| 0.9090046296296682 | 4.06 |
| 0.9090625000000386 | 4.06 |
| 0.909120370370409 | 4.06 |
| 0.9091782407407795 | 4.06 |
| 0.9092361111111499 | 4.06 |
| 0.9092939814815203 | 4.06 |
| 0.9093518518518907 | 4.06 |
| 0.9094097222222611 | 4.06 |
| 0.9094675925926315 | 4.06 |
| 0.909525462963002 | 4.06 |
| 0.9095833333333724 | 4.06 |
| 0.9096412037037428 | 4.06 |
| 0.9096990740741132 | 4.06 |
| 0.9097569444444836 | 4.06 |
| 0.909814814814854 | 4.06 |
| 0.9098726851852245 | 4.06 |
| 0.9099305555555949 | 4.06 |
| 0.9099884259259653 | 4.06 |
| 0.9100462962963357 | 4.06 |
| 0.9101041666667061 | 4.06 |
| 0.9101620370370765 | 4.06 |
| 0.910219907407447 | 4.06 |
| 0.9102777777778174 | 4.05 |
| 0.9103356481481878 | 4.05 |
| 0.9103935185185582 | 4.06 |
| 0.9104513888889286 | 4.06 |
| 0.910509259259299 | 4.06 |
| 0.9105671296296695 | 4.06 |
| 0.9106250000000399 | 4.06 |
| 0.9106828703704103 | 4.06 |
| 0.9107407407407807 | 4.06 |
| 0.9107986111111511 | 4.06 |
| 0.9108564814815215 | 4.06 |
| 0.910914351851892 | 4.06 |
| 0.9109722222222624 | 4.06 |
| 0.9110300925926328 | 4.06 |
| 0.9110879629630032 | 4.06 |
| 0.9111458333333736 | 4.06 |
| 0.911203703703744 | 4.06 |
| 0.9112615740741145 | 4.06 |
| 0.9113194444444849 | 4.06 |
| 0.9113773148148553 | 4.06 |
| 0.9114351851852257 | 4.06 |
| 0.9114930555555961 | 4.06 |
| 0.9115509259259665 | 4.06 |
| 0.911608796296337 | 4.06 |
| 0.9116666666667074 | 4.06 |
| 0.9117245370370778 | 4.06 |
| 0.9117824074074482 | 4.06 |
| 0.9118402777778186 | 4.06 |
| 0.911898148148189 | 4.06 |
| 0.9119560185185595 | 4.06 |
| 0.9120138888889299 | 4.06 |
| 0.9120717592593003 | 4.06 |
| 0.9121296296296707 | 4.06 |
| 0.9121875000000411 | 4.06 |
| 0.9122453703704115 | 4.06 |
| 0.912303240740782 | 4.06 |
| 0.9123611111111524 | 4.06 |
| 0.9124189814815228 | 4.06 |
| 0.9124768518518932 | 4.06 |
| 0.9125347222222636 | 4.06 |
| 0.912592592592634 | 4.06 |
| 0.9126504629630044 | 4.06 |
| 0.9127083333333749 | 4.06 |
| 0.9127662037037453 | 4.06 |
| 0.9128240740741157 | 4.06 |
| 0.9128819444444861 | 4.06 |
| 0.9129398148148565 | 4.06 |
| 0.912997685185227 | 4.06 |
| 0.9130555555555974 | 4.06 |
| 0.9131134259259678 | 4.06 |
| 0.9131712962963382 | 4.06 |
| 0.9132291666667086 | 4.06 |
| 0.913287037037079 | 4.06 |
| 0.9133449074074494 | 4.06 |
| 0.9134027777778199 | 4.06 |
| 0.9134606481481903 | 4.06 |
| 0.9135185185185607 | 4.06 |
| 0.9135763888889311 | 4.06 |
| 0.9136342592593015 | 4.06 |
| 0.913692129629672 | 4.06 |
| 0.9137500000000424 | 4.06 |
| 0.9138078703704128 | 4.06 |
| 0.9138657407407832 | 4.06 |
| 0.9139236111111536 | 4.06 |
| 0.913981481481524 | 4.06 |
| 0.9140393518518944 | 4.06 |
| 0.9140972222222649 | 4.06 |
| 0.9141550925926353 | 4.06 |
| 0.9142129629630057 | 4.06 |
| 0.9142708333333761 | 4.06 |
| 0.9143287037037465 | 4.06 |
| 0.9143865740741169 | 4.06 |
| 0.9144444444444874 | 4.06 |
| 0.9145023148148578 | 4.06 |
| 0.9145601851852282 | 4.06 |
| 0.9146180555555986 | 4.06 |
| 0.914675925925969 | 4.06 |
| 0.9147337962963394 | 4.06 |
| 0.9147916666667099 | 4.06 |
| 0.9148495370370803 | 4.06 |
| 0.9149074074074507 | 4.06 |
| 0.9149652777778211 | 4.06 |
| 0.9150231481481915 | 4.06 |
| 0.9150810185185619 | 4.06 |
| 0.9151388888889324 | 4.06 |
| 0.9151967592593028 | 4.06 |
| 0.9152546296296732 | 4.06 |
| 0.9153125000000436 | 4.06 |
| 0.915370370370414 | 4.06 |
| 0.9154282407407844 | 4.06 |
| 0.9154861111111549 | 4.06 |
| 0.9155439814815253 | 4.06 |
| 0.9156018518518957 | 4.06 |
| 0.9156597222222661 | 4.06 |
| 0.9157175925926365 | 4.06 |
| 0.9157754629630069 | 4.06 |
| 0.9158333333333774 | 4.06 |
| 0.9158912037037478 | 4.06 |
| 0.9159490740741182 | 4.06 |
| 0.9160069444444886 | 4.06 |
| 0.916064814814859 | 4.06 |
| 0.9161226851852294 | 4.06 |
| 0.9161805555555999 | 4.06 |
| 0.9162384259259703 | 4.06 |
| 0.9162962962963407 | 4.06 |
| 0.9163541666667111 | 4.06 |
| 0.9164120370370815 | 4.06 |
| 0.9164699074074519 | 4.06 |
| 0.9165277777778224 | 4.06 |
| 0.9165856481481928 | 4.06 |
| 0.9166435185185632 | 4.06 |
| 0.9167013888889336 | 4.06 |
| 0.916759259259304 | 4.06 |
| 0.9168171296296744 | 4.06 |
| 0.9168750000000448 | 4.06 |
| 0.9169328703704153 | 4.06 |
| 0.9169907407407857 | 4.06 |
| 0.9170486111111561 | 4.06 |
| 0.9171064814815265 | 4.06 |
| 0.9171643518518969 | 4.06 |
| 0.9172222222222673 | 4.06 |
| 0.9172800925926378 | 4.06 |
| 0.9173379629630082 | 4.06 |
| 0.9173958333333786 | 4.06 |
| 0.917453703703749 | 4.06 |
| 0.9175115740741194 | 4.06 |
| 0.9175694444444898 | 4.06 |
| 0.9176273148148603 | 4.06 |
| 0.9176851851852307 | 4.06 |
| 0.9177430555556011 | 4.06 |
| 0.9178009259259715 | 4.06 |
| 0.9178587962963419 | 4.06 |
| 0.9179166666667123 | 4.06 |
| 0.9179745370370828 | 4.06 |
| 0.9180324074074532 | 4.06 |
| 0.9180902777778236 | 4.06 |
| 0.918148148148194 | 4.06 |
| 0.9182060185185644 | 4.06 |
| 0.9182638888889348 | 4.06 |
| 0.9183217592593053 | 4.06 |
| 0.9183796296296757 | 4.06 |
| 0.9184375000000461 | 4.06 |
| 0.9184953703704165 | 4.06 |
| 0.9185532407407869 | 4.06 |
| 0.9186111111111573 | 4.06 |
| 0.9186689814815278 | 4.06 |
| 0.9187268518518982 | 4.05 |
| 0.9187847222222686 | 4.05 |
| 0.918842592592639 | 4.06 |
| 0.9189004629630094 | 4.06 |
| 0.9189583333333798 | 4.06 |
| 0.9190162037037503 | 4.06 |
| 0.9190740740741207 | 4.06 |
| 0.9191319444444911 | 4.06 |
| 0.9191898148148615 | 4.06 |
| 0.9192476851852319 | 4.06 |
| 0.9193055555556023 | 4.06 |
| 0.9193634259259728 | 4.06 |
| 0.9194212962963432 | 4.06 |
| 0.9194791666667136 | 4.05 |
| 0.919537037037084 | 4.05 |
| 0.9195949074074544 | 4.05 |
| 0.9196527777778248 | 4.05 |
| 0.9197106481481953 | 4.05 |
| 0.9197685185185657 | 4.05 |
| 0.9198263888889361 | 4.05 |
| 0.9198842592593065 | 4.05 |
| 0.9199421296296769 | 4.05 |
| 0.9200000000000473 | 4.05 |
| 0.9200578703704178 | 4.05 |
| 0.9201157407407882 | 4.05 |
| 0.9201736111111586 | 4.05 |
| 0.920231481481529 | 4.05 |
| 0.9202893518518994 | 4.06 |
| 0.9203472222222698 | 4.06 |
| 0.9204050925926403 | 4.06 |
| 0.9204629629630107 | 4.06 |
| 0.9205208333333811 | 4.06 |
| 0.9205787037037515 | 4.06 |
| 0.9206365740741219 | 4.06 |
| 0.9206944444444923 | 4.06 |
| 0.9207523148148627 | 4.06 |
| 0.9208101851852332 | 4.06 |
| 0.9208680555556036 | 4.06 |
| 0.920925925925974 | 4.06 |
| 0.9209837962963444 | 4.06 |
| 0.9210416666667148 | 4.06 |
| 0.9210995370370852 | 4.06 |
| 0.9211574074074557 | 4.06 |
| 0.9212152777778261 | 4.06 |
| 0.9212731481481965 | 4.06 |
| 0.9213310185185669 | 4.06 |
| 0.9213888888889373 | 4.06 |
| 0.9214467592593077 | 4.06 |
| 0.9215046296296782 | 4.06 |
| 0.9215625000000486 | 4.06 |
| 0.921620370370419 | 4.06 |
| 0.9216782407407894 | 4.06 |
| 0.9217361111111598 | 4.06 |
| 0.9217939814815302 | 4.06 |
| 0.9218518518519007 | 4.06 |
| 0.9219097222222711 | 4.06 |
| 0.9219675925926415 | 4.06 |
| 0.9220254629630119 | 4.06 |
| 0.9220833333333823 | 4.06 |
| 0.9221412037037527 | 4.06 |
| 0.9221990740741232 | 4.06 |
| 0.9222569444444936 | 4.06 |
| 0.922314814814864 | 4.06 |
| 0.9223726851852344 | 4.06 |
| 0.9224305555556048 | 4.06 |
| 0.9224884259259752 | 4.06 |
| 0.9225462962963457 | 4.06 |
| 0.9226041666667161 | 4.06 |
| 0.9226620370370865 | 4.06 |
| 0.9227199074074569 | 4.06 |
| 0.9227777777778273 | 4.06 |
| 0.9228356481481977 | 4.06 |
| 0.9228935185185682 | 4.06 |
| 0.9229513888889386 | 4.06 |
| 0.923009259259309 | 4.06 |
| 0.9230671296296794 | 4.06 |
| 0.9231250000000498 | 4.05 |
| 0.9231828703704202 | 4.06 |
| 0.9232407407407907 | 4.06 |
| 0.9232986111111611 | 4.06 |
| 0.9233564814815315 | 4.06 |
| 0.9234143518519019 | 4.06 |
| 0.9234722222222723 | 4.06 |
| 0.9235300925926427 | 4.06 |
| 0.9235879629630132 | 4.06 |
| 0.9236458333333836 | 4.06 |
| 0.923703703703754 | 4.06 |
| 0.9237615740741244 | 4.06 |
| 0.9238194444444948 | 4.06 |
| 0.9238773148148652 | 4.06 |
| 0.9239351851852357 | 4.06 |
| 0.9239930555556061 | 4.06 |
| 0.9240509259259765 | 4.06 |
| 0.9241087962963469 | 4.06 |
| 0.9241666666667173 | 4.06 |
| 0.9242245370370877 | 4.06 |
| 0.9242824074074582 | 4.06 |
| 0.9243402777778286 | 4.06 |
| 0.924398148148199 | 4.06 |
| 0.9244560185185694 | 4.06 |
| 0.9245138888889398 | 4.06 |
| 0.9245717592593102 | 4.06 |
| 0.9246296296296806 | 4.06 |
| 0.9246875000000511 | 4.06 |
| 0.9247453703704215 | 4.06 |
| 0.9248032407407919 | 4.06 |
| 0.9248611111111623 | 4.06 |
| 0.9249189814815327 | 4.06 |
| 0.9249768518519031 | 4.06 |
| 0.9250347222222736 | 4.06 |
| 0.925092592592644 | 4.06 |
| 0.9251504629630144 | 4.06 |
| 0.9252083333333848 | 4.06 |
| 0.9252662037037552 | 4.06 |
| 0.9253240740741256 | 4.06 |
| 0.9253819444444961 | 4.06 |
| 0.9254398148148665 | 4.06 |
| 0.9254976851852369 | 4.06 |
| 0.9255555555556073 | 4.06 |
| 0.9256134259259777 | 4.06 |
| 0.9256712962963481 | 4.06 |
| 0.9257291666667186 | 4.06 |
| 0.925787037037089 | 4.06 |
| 0.9258449074074594 | 4.06 |
| 0.9259027777778298 | 4.06 |
| 0.9259606481482002 | 4.06 |
| 0.9260185185185706 | 4.06 |
| 0.9260763888889411 | 4.06 |
| 0.9261342592593115 | 4.06 |
| 0.9261921296296819 | 4.06 |
| 0.9262500000000523 | 4.06 |
| 0.9263078703704227 | 4.06 |
| 0.9263657407407931 | 4.06 |
| 0.9264236111111636 | 4.06 |
| 0.926481481481534 | 4.06 |
| 0.9265393518519044 | 4.06 |
| 0.9265972222222748 | 4.06 |
| 0.9266550925926452 | 4.06 |
| 0.9267129629630156 | 4.06 |
| 0.9267708333333861 | 4.06 |
| 0.9268287037037565 | 4.06 |
| 0.9268865740741269 | 4.06 |
| 0.9269444444444973 | 4.06 |
| 0.9270023148148677 | 4.06 |
| 0.9270601851852381 | 4.06 |
| 0.9271180555556086 | 4.06 |
| 0.927175925925979 | 4.06 |
| 0.9272337962963494 | 4.06 |
| 0.9272916666667198 | 4.06 |
| 0.9273495370370902 | 4.06 |
| 0.9274074074074606 | 4.06 |
| 0.927465277777831 | 4.06 |
| 0.9275231481482015 | 4.06 |
| 0.9275810185185719 | 4.06 |
| 0.9276388888889423 | 4.06 |
| 0.9276967592593127 | 4.06 |
| 0.9277546296296831 | 4.06 |
| 0.9278125000000536 | 4.06 |
| 0.927870370370424 | 4.06 |
| 0.9279282407407944 | 4.06 |
| 0.9279861111111648 | 4.06 |
| 0.9280439814815352 | 4.06 |
| 0.9281018518519056 | 4.06 |
| 0.928159722222276 | 4.06 |
| 0.9282175925926465 | 4.06 |
| 0.9282754629630169 | 4.06 |
| 0.9283333333333873 | 4.06 |
| 0.9283912037037577 | 4.06 |
| 0.9284490740741281 | 4.06 |
| 0.9285069444444985 | 4.06 |
| 0.928564814814869 | 4.06 |
| 0.9286226851852394 | 4.06 |
| 0.9286805555556098 | 4.06 |
| 0.9287384259259802 | 4.06 |
| 0.9287962962963506 | 4.06 |
| 0.928854166666721 | 4.06 |
| 0.9289120370370915 | 4.06 |
| 0.9289699074074619 | 4.06 |
| 0.9290277777778323 | 4.06 |
| 0.9290856481482027 | 4.06 |
| 0.9291435185185731 | 4.06 |
| 0.9292013888889435 | 4.06 |
| 0.929259259259314 | 4.06 |
| 0.9293171296296844 | 4.06 |
| 0.9293750000000548 | 4.06 |
| 0.9294328703704252 | 4.06 |
| 0.9294907407407956 | 4.06 |
| 0.929548611111166 | 4.06 |
| 0.9296064814815365 | 4.06 |
| 0.9296643518519069 | 4.06 |
| 0.9297222222222773 | 4.06 |
| 0.9297800925926477 | 4.06 |
| 0.9298379629630181 | 4.06 |
| 0.9298958333333885 | 4.06 |
| 0.929953703703759 | 4.06 |
| 0.9300115740741294 | 4.06 |
| 0.9300694444444998 | 4.06 |
| 0.9301273148148702 | 4.06 |
| 0.9301851851852406 | 4.06 |
| 0.930243055555611 | 4.06 |
| 0.9303009259259815 | 4.06 |
| 0.9303587962963519 | 4.06 |
| 0.9304166666667223 | 4.06 |
| 0.9304745370370927 | 4.06 |
| 0.9305324074074631 | 4.06 |
| 0.9305902777778335 | 4.06 |
| 0.930648148148204 | 4.06 |
| 0.9307060185185744 | 4.06 |
| 0.9307638888889448 | 4.06 |
| 0.9308217592593152 | 4.06 |
| 0.9308796296296856 | 4.06 |
| 0.930937500000056 | 4.06 |
| 0.9309953703704265 | 4.06 |
| 0.9310532407407969 | 4.06 |
| 0.9311111111111673 | 4.06 |
| 0.9311689814815377 | 4.06 |
| 0.9312268518519081 | 4.06 |
| 0.9312847222222785 | 4.06 |
| 0.931342592592649 | 4.06 |
| 0.9314004629630194 | 4.06 |
| 0.9314583333333898 | 4.06 |
| 0.9315162037037602 | 4.06 |
| 0.9315740740741306 | 4.06 |
| 0.931631944444501 | 4.06 |
| 0.9316898148148715 | 4.06 |
| 0.9317476851852419 | 4.06 |
| 0.9318055555556123 | 4.06 |
| 0.9318634259259827 | 4.06 |
| 0.9319212962963531 | 4.06 |
| 0.9319791666667235 | 4.06 |
| 0.932037037037094 | 4.06 |
| 0.9320949074074644 | 4.06 |
| 0.9321527777778348 | 4.06 |
| 0.9322106481482052 | 4.06 |
| 0.9322685185185756 | 4.06 |
| 0.932326388888946 | 4.06 |
| 0.9323842592593165 | 4.06 |
| 0.9324421296296869 | 4.06 |
| 0.9325000000000573 | 4.06 |
| 0.9325578703704277 | 4.06 |
| 0.9326157407407981 | 4.06 |
| 0.9326736111111685 | 4.06 |
| 0.932731481481539 | 4.06 |
| 0.9327893518519094 | 4.06 |
| 0.9328472222222798 | 4.06 |
| 0.9329050925926502 | 4.06 |
| 0.9329629629630206 | 4.05 |
| 0.933020833333391 | 4.06 |
| 0.9330787037037614 | 4.06 |
| 0.9331365740741319 | 4.06 |
| 0.9331944444445023 | 4.06 |
| 0.9332523148148727 | 4.06 |
| 0.9333101851852431 | 4.06 |
| 0.9333680555556135 | 4.06 |
| 0.933425925925984 | 4.06 |
| 0.9334837962963544 | 4.06 |
| 0.9335416666667248 | 4.06 |
| 0.9335995370370952 | 4.06 |
| 0.9336574074074656 | 4.05 |
| 0.933715277777836 | 4.06 |
| 0.9337731481482064 | 4.06 |
| 0.9338310185185769 | 4.06 |
| 0.9338888888889473 | 4.05 |
| 0.9339467592593177 | 4.06 |
| 0.9340046296296881 | 4.06 |
| 0.9340625000000585 | 4.06 |
| 0.9341203703704289 | 4.06 |
| 0.9341782407407994 | 4.06 |
| 0.9342361111111698 | 4.06 |
| 0.9342939814815402 | 4.06 |
| 0.9343518518519106 | 4.06 |
| 0.934409722222281 | 4.06 |
| 0.9344675925926514 | 4.05 |
| 0.9345254629630219 | 4.05 |
| 0.9345833333333923 | 4.06 |
| 0.9346412037037627 | 4.06 |
| 0.9346990740741331 | 4.06 |
| 0.9347569444445035 | 4.06 |
| 0.9348148148148739 | 4.06 |
| 0.9348726851852444 | 4.05 |
| 0.9349305555556148 | 4.06 |
| 0.9349884259259852 | 4.05 |
| 0.9350462962963556 | 4.05 |
| 0.935104166666726 | 4.06 |
| 0.9351620370370964 | 4.06 |
| 0.9352199074074669 | 4.06 |
| 0.9352777777778373 | 4.05 |
| 0.9353356481482077 | 4.06 |
| 0.9353935185185781 | 4.06 |
| 0.9354513888889485 | 4.06 |
| 0.9355092592593189 | 4.05 |
| 0.9355671296296894 | 4.06 |
| 0.9356250000000598 | 4.06 |
| 0.9356828703704302 | 4.06 |
| 0.9357407407408006 | 4.05 |
| 0.935798611111171 | 4.05 |
| 0.9358564814815414 | 4.06 |
| 0.9359143518519119 | 4.05 |
| 0.9359722222222823 | 4.05 |
| 0.9360300925926527 | 4.06 |
| 0.9360879629630231 | 4.06 |
| 0.9361458333333935 | 4.06 |
| 0.9362037037037639 | 4.05 |
| 0.9362615740741344 | 4.06 |
| 0.9363194444445048 | 4.06 |
| 0.9363773148148752 | 4.06 |
| 0.9364351851852456 | 4.06 |
| 0.936493055555616 | 4.05 |
| 0.9365509259259864 | 4.06 |
| 0.9366087962963568 | 4.06 |
| 0.9366666666667273 | 4.06 |
| 0.9367245370370977 | 4.06 |
| 0.9367824074074681 | 4.05 |
| 0.9368402777778385 | 4.06 |
| 0.9368981481482089 | 4.05 |
| 0.9369560185185793 | 4.06 |
| 0.9370138888889498 | 4.06 |
| 0.9370717592593202 | 4.06 |
| 0.9371296296296906 | 4.05 |
| 0.937187500000061 | 4.06 |
| 0.9372453703704314 | 4.05 |
| 0.9373032407408018 | 4.06 |
| 0.9373611111111723 | 4.05 |
| 0.9374189814815427 | 4.06 |
| 0.9374768518519131 | 4.06 |
| 0.9375347222222835 | 4.05 |
| 0.9375925925926539 | 4.05 |
| 0.9376504629630243 | 4.05 |
| 0.9377083333333948 | 4.06 |
| 0.9377662037037652 | 4.05 |
| 0.9378240740741356 | 4.05 |
| 0.937881944444506 | 4.06 |
| 0.9379398148148764 | 4.06 |
| 0.9379976851852468 | 4.05 |
| 0.9380555555556173 | 4.05 |
| 0.9381134259259877 | 4.05 |
| 0.9381712962963581 | 4.05 |
| 0.9382291666667285 | 4.05 |
| 0.9382870370370989 | 4.06 |
| 0.9383449074074693 | 4.05 |
| 0.9384027777778398 | 4.06 |
| 0.9384606481482102 | 4.05 |
| 0.9385185185185806 | 4.05 |
| 0.938576388888951 | 4.06 |
| 0.9386342592593214 | 4.06 |
| 0.9386921296296918 | 4.05 |
| 0.9387500000000623 | 4.05 |
| 0.9388078703704327 | 4.05 |
| 0.9388657407408031 | 4.05 |
| 0.9389236111111735 | 4.05 |
| 0.9389814814815439 | 4.05 |
| 0.9390393518519143 | 4.05 |
| 0.9390972222222848 | 4.06 |
| 0.9391550925926552 | 4.06 |
| 0.9392129629630256 | 4.05 |
| 0.939270833333396 | 4.05 |
| 0.9393287037037664 | 4.05 |
| 0.9393865740741368 | 4.05 |
| 0.9394444444445073 | 4.05 |
| 0.9395023148148777 | 4.05 |
| 0.9395601851852481 | 4.05 |
| 0.9396180555556185 | 4.05 |
| 0.9396759259259889 | 4.05 |
| 0.9397337962963593 | 4.05 |
| 0.9397916666667298 | 4.05 |
| 0.9398495370371002 | 4.05 |
| 0.9399074074074706 | 4.05 |
| 0.939965277777841 | 4.06 |
| 0.9400231481482114 | 4.05 |
| 0.9400810185185818 | 4.05 |
| 0.9401388888889523 | 4.05 |
| 0.9401967592593227 | 4.06 |
| 0.9402546296296931 | 4.05 |
| 0.9403125000000635 | 4.05 |
| 0.9403703703704339 | 4.05 |
| 0.9404282407408043 | 4.05 |
| 0.9404861111111747 | 4.05 |
| 0.9405439814815452 | 4.05 |
| 0.9406018518519156 | 4.05 |
| 0.940659722222286 | 4.05 |
| 0.9407175925926564 | 4.05 |
| 0.9407754629630268 | 4.05 |
| 0.9408333333333972 | 4.05 |
| 0.9408912037037677 | 4.05 |
| 0.9409490740741381 | 4.05 |
| 0.9410069444445085 | 4.05 |
| 0.9410648148148789 | 4.05 |
| 0.9411226851852493 | 4.05 |
| 0.9411805555556197 | 4.05 |
| 0.9412384259259902 | 4.05 |
| 0.9412962962963606 | 4.05 |
| 0.941354166666731 | 4.05 |
| 0.9414120370371014 | 4.05 |
| 0.9414699074074718 | 4.05 |
| 0.9415277777778422 | 4.06 |
| 0.9415856481482127 | 4.05 |
| 0.9416435185185831 | 4.05 |
| 0.9417013888889535 | 4.05 |
| 0.9417592592593239 | 4.05 |
| 0.9418171296296943 | 4.05 |
| 0.9418750000000647 | 4.05 |
| 0.9419328703704352 | 4.05 |
| 0.9419907407408056 | 4.05 |
| 0.942048611111176 | 4.05 |
| 0.9421064814815464 | 4.05 |
| 0.9421643518519168 | 4.06 |
| 0.9422222222222872 | 4.05 |
| 0.9422800925926577 | 4.05 |
| 0.9423379629630281 | 4.05 |
| 0.9423958333333985 | 4.05 |
| 0.9424537037037689 | 4.05 |
| 0.9425115740741393 | 4.05 |
| 0.9425694444445097 | 4.05 |
| 0.9426273148148802 | 4.05 |
| 0.9426851851852506 | 4.05 |
| 0.942743055555621 | 4.05 |
| 0.9428009259259914 | 4.05 |
| 0.9428587962963618 | 4.05 |
| 0.9429166666667322 | 4.05 |
| 0.9429745370371027 | 4.05 |
| 0.9430324074074731 | 4.05 |
| 0.9430902777778435 | 4.05 |
| 0.9431481481482139 | 4.05 |
| 0.9432060185185843 | 4.05 |
| 0.9432638888889547 | 4.05 |
| 0.9433217592593252 | 4.05 |
| 0.9433796296296956 | 4.05 |
| 0.943437500000066 | 4.05 |
| 0.9434953703704364 | 4.05 |
| 0.9435532407408068 | 4.05 |
| 0.9436111111111772 | 4.05 |
| 0.9436689814815477 | 4.05 |
| 0.9437268518519181 | 4.05 |
| 0.9437847222222885 | 4.05 |
| 0.9438425925926589 | 4.05 |
| 0.9439004629630293 | 4.05 |
| 0.9439583333333997 | 4.05 |
| 0.9440162037037702 | 4.05 |
| 0.9440740740741406 | 4.05 |
| 0.944131944444511 | 4.05 |
| 0.9441898148148814 | 4.05 |
| 0.9442476851852518 | 4.05 |
| 0.9443055555556222 | 4.05 |
| 0.9443634259259927 | 4.05 |
| 0.9444212962963631 | 4.05 |
| 0.9444791666667335 | 4.05 |
| 0.9445370370371039 | 4.05 |
| 0.9445949074074743 | 4.05 |
| 0.9446527777778447 | 4.05 |
| 0.9447106481482151 | 4.05 |
| 0.9447685185185856 | 4.05 |
| 0.944826388888956 | 4.05 |
| 0.9448842592593264 | 4.05 |
| 0.9449421296296968 | 4.05 |
| 0.9450000000000672 | 4.05 |
| 0.9450578703704376 | 4.05 |
| 0.9451157407408081 | 4.05 |
| 0.9451736111111785 | 4.05 |
| 0.9452314814815489 | 4.05 |
| 0.9452893518519193 | 4.05 |
| 0.9453472222222897 | 4.05 |
| 0.9454050925926601 | 4.05 |
| 0.9454629629630306 | 4.05 |
| 0.945520833333401 | 4.05 |
| 0.9455787037037714 | 4.05 |
| 0.9456365740741418 | 4.05 |
| 0.9456944444445122 | 4.05 |
| 0.9457523148148826 | 4.05 |
| 0.9458101851852531 | 4.05 |
| 0.9458680555556235 | 4.05 |
| 0.9459259259259939 | 4.05 |
| 0.9459837962963643 | 4.05 |
| 0.9460416666667347 | 4.05 |
| 0.9460995370371051 | 4.05 |
| 0.9461574074074756 | 4.05 |
| 0.946215277777846 | 4.05 |
| 0.9462731481482164 | 4.05 |
| 0.9463310185185868 | 4.05 |
| 0.9463888888889572 | 4.05 |
| 0.9464467592593276 | 4.05 |
| 0.9465046296296981 | 4.05 |
| 0.9465625000000685 | 4.05 |
| 0.9466203703704389 | 4.05 |
| 0.9466782407408093 | 4.05 |
| 0.9467361111111797 | 4.05 |
| 0.9467939814815501 | 4.05 |
| 0.9468518518519206 | 4.05 |
| 0.946909722222291 | 4.05 |
| 0.9469675925926614 | 4.05 |
| 0.9470254629630318 | 4.05 |
| 0.9470833333334022 | 4.05 |
| 0.9471412037037726 | 4.05 |
| 0.947199074074143 | 4.05 |
| 0.9472569444445135 | 4.05 |
| 0.9473148148148839 | 4.05 |
| 0.9473726851852543 | 4.05 |
| 0.9474305555556247 | 4.05 |
| 0.9474884259259951 | 4.05 |
| 0.9475462962963656 | 4.05 |
| 0.947604166666736 | 4.05 |
| 0.9476620370371064 | 4.05 |
| 0.9477199074074768 | 4.05 |
| 0.9477777777778472 | 4.05 |
| 0.9478356481482176 | 4.05 |
| 0.947893518518588 | 4.05 |
| 0.9479513888889585 | 4.05 |
| 0.9480092592593289 | 4.05 |
| 0.9480671296296993 | 4.05 |
| 0.9481250000000697 | 4.05 |
| 0.9481828703704401 | 4.05 |
| 0.9482407407408106 | 4.05 |
| 0.948298611111181 | 4.05 |
| 0.9483564814815514 | 4.05 |
| 0.9484143518519218 | 4.05 |
| 0.9484722222222922 | 4.05 |
| 0.9485300925926626 | 4.05 |
| 0.948587962963033 | 4.05 |
| 0.9486458333334035 | 4.05 |
| 0.9487037037037739 | 4.05 |
| 0.9487615740741443 | 4.05 |
| 0.9488194444445147 | 4.05 |
| 0.9488773148148851 | 4.05 |
| 0.9489351851852555 | 4.05 |
| 0.948993055555626 | 4.05 |
| 0.9490509259259964 | 4.05 |
| 0.9491087962963668 | 4.05 |
| 0.9491666666667372 | 4.05 |
| 0.9492245370371076 | 4.05 |
| 0.949282407407478 | 4.05 |
| 0.9493402777778485 | 4.05 |
| 0.9493981481482189 | 4.05 |
| 0.9494560185185893 | 4.05 |
| 0.9495138888889597 | 4.05 |
| 0.9495717592593301 | 4.05 |
| 0.9496296296297005 | 4.05 |
| 0.949687500000071 | 4.05 |
| 0.9497453703704414 | 4.05 |
| 0.9498032407408118 | 4.05 |
| 0.9498611111111822 | 4.05 |
| 0.9499189814815526 | 4.05 |
| 0.949976851851923 | 4.05 |
| 0.9500347222222935 | 4.05 |
| 0.9500925925926639 | 4.05 |
| 0.9501504629630343 | 4.05 |
| 0.9502083333334047 | 4.05 |
| 0.9502662037037751 | 4.05 |
| 0.9503240740741455 | 4.05 |
| 0.950381944444516 | 4.05 |
| 0.9504398148148864 | 4.05 |
| 0.9504976851852568 | 4.05 |
| 0.9505555555556272 | 4.05 |
| 0.9506134259259976 | 4.05 |
| 0.950671296296368 | 4.05 |
| 0.9507291666667385 | 4.05 |
| 0.9507870370371089 | 4.05 |
| 0.9508449074074793 | 4.05 |
| 0.9509027777778497 | 4.05 |
| 0.9509606481482201 | 4.05 |
| 0.9510185185185905 | 4.05 |
| 0.951076388888961 | 4.05 |
| 0.9511342592593314 | 4.05 |
| 0.9511921296297018 | 4.05 |
| 0.9512500000000722 | 4.05 |
| 0.9513078703704426 | 4.05 |
| 0.951365740740813 | 4.05 |
| 0.9514236111111835 | 4.05 |
| 0.9514814814815539 | 4.05 |
| 0.9515393518519243 | 4.05 |
| 0.9515972222222947 | 4.05 |
| 0.9516550925926651 | 4.05 |
| 0.9517129629630355 | 4.05 |
| 0.951770833333406 | 4.05 |
| 0.9518287037037764 | 4.05 |
| 0.9518865740741468 | 4.05 |
| 0.9519444444445172 | 4.05 |
| 0.9520023148148876 | 4.05 |
| 0.952060185185258 | 4.05 |
| 0.9521180555556285 | 4.05 |
| 0.9521759259259989 | 4.05 |
| 0.9522337962963693 | 4.05 |
| 0.9522916666667397 | 4.05 |
| 0.9523495370371101 | 4.05 |
| 0.9524074074074805 | 4.05 |
| 0.952465277777851 | 4.05 |
| 0.9525231481482214 | 4.05 |
| 0.9525810185185918 | 4.05 |
| 0.9526388888889622 | 4.05 |
| 0.9526967592593326 | 4.05 |
| 0.952754629629703 | 4.05 |
| 0.9528125000000734 | 4.05 |
| 0.9528703703704439 | 4.05 |
| 0.9529282407408143 | 4.05 |
| 0.9529861111111847 | 4.05 |
| 0.9530439814815551 | 4.05 |
| 0.9531018518519255 | 4.05 |
| 0.953159722222296 | 4.05 |
| 0.9532175925926664 | 4.05 |
| 0.9532754629630368 | 4.05 |
| 0.9533333333334072 | 4.05 |
| 0.9533912037037776 | 4.05 |
| 0.953449074074148 | 4.05 |
| 0.9535069444445184 | 4.05 |
| 0.9535648148148889 | 4.05 |
| 0.9536226851852593 | 4.05 |
| 0.9536805555556297 | 4.05 |
| 0.9537384259260001 | 4.05 |
| 0.9537962962963705 | 4.05 |
| 0.9538541666667409 | 4.05 |
| 0.9539120370371114 | 4.05 |
| 0.9539699074074818 | 4.05 |
| 0.9540277777778522 | 4.05 |
| 0.9540856481482226 | 4.05 |
| 0.954143518518593 | 4.05 |
| 0.9542013888889634 | 4.05 |
| 0.9542592592593339 | 4.05 |
| 0.9543171296297043 | 4.05 |
| 0.9543750000000747 | 4.05 |
| 0.9544328703704451 | 4.05 |
| 0.9544907407408155 | 4.05 |
| 0.9545486111111859 | 4.05 |
| 0.9546064814815564 | 4.05 |
| 0.9546643518519268 | 4.05 |
| 0.9547222222222972 | 4.05 |
| 0.9547800925926676 | 4.05 |
| 0.954837962963038 | 4.05 |
| 0.9548958333334084 | 4.05 |
| 0.9549537037037789 | 4.05 |
| 0.9550115740741493 | 4.05 |
| 0.9550694444445197 | 4.05 |
| 0.9551273148148901 | 4.05 |
| 0.9551851851852605 | 4.05 |
| 0.9552430555556309 | 4.05 |
| 0.9553009259260014 | 4.05 |
| 0.9553587962963718 | 4.05 |
| 0.9554166666667422 | 4.05 |
| 0.9554745370371126 | 4.05 |
| 0.955532407407483 | 4.05 |
| 0.9555902777778534 | 4.05 |
| 0.9556481481482239 | 4.05 |
| 0.9557060185185943 | 4.05 |
| 0.9557638888889647 | 4.05 |
| 0.9558217592593351 | 4.05 |
| 0.9558796296297055 | 4.05 |
| 0.9559375000000759 | 4.05 |
| 0.9559953703704464 | 4.05 |
| 0.9560532407408168 | 4.05 |
| 0.9561111111111872 | 4.05 |
| 0.9561689814815576 | 4.05 |
| 0.956226851851928 | 4.05 |
| 0.9562847222222984 | 4.05 |
| 0.9563425925926688 | 4.05 |
| 0.9564004629630393 | 4.05 |
| 0.9564583333334097 | 4.05 |
| 0.9565162037037801 | 4.05 |
| 0.9565740740741505 | 4.05 |
| 0.9566319444445209 | 4.05 |
| 0.9566898148148913 | 4.05 |
| 0.9567476851852618 | 4.05 |
| 0.9568055555556322 | 4.05 |
| 0.9568634259260026 | 4.05 |
| 0.956921296296373 | 4.05 |
| 0.9569791666667434 | 4.05 |
| 0.9570370370371138 | 4.05 |
| 0.9570949074074843 | 4.05 |
| 0.9571527777778547 | 4.05 |
| 0.9572106481482251 | 4.05 |
| 0.9572685185185955 | 4.05 |
| 0.9573263888889659 | 4.05 |
| 0.9573842592593363 | 4.05 |
| 0.9574421296297068 | 4.05 |
| 0.9575000000000772 | 4.05 |
| 0.9575578703704476 | 4.05 |
| 0.957615740740818 | 4.05 |
| 0.9576736111111884 | 4.05 |
| 0.9577314814815588 | 4.05 |
| 0.9577893518519293 | 4.05 |
| 0.9578472222222997 | 4.05 |
| 0.9579050925926701 | 4.05 |
| 0.9579629629630405 | 4.05 |
| 0.9580208333334109 | 4.05 |
| 0.9580787037037813 | 4.05 |
| 0.9581365740741518 | 4.05 |
| 0.9581944444445222 | 4.05 |
| 0.9582523148148926 | 4.05 |
| 0.958310185185263 | 4.05 |
| 0.9583680555556334 | 4.05 |
| 0.9584259259260038 | 4.05 |
| 0.9584837962963743 | 4.05 |
| 0.9585416666667447 | 4.05 |
| 0.9585995370371151 | 4.05 |
| 0.9586574074074855 | 4.05 |
| 0.9587152777778559 | 4.05 |
| 0.9587731481482263 | 4.05 |
| 0.9588310185185968 | 4.05 |
| 0.9588888888889672 | 4.05 |
| 0.9589467592593376 | 4.05 |
| 0.959004629629708 | 4.05 |
| 0.9590625000000784 | 4.05 |
| 0.9591203703704488 | 4.05 |
| 0.9591782407408193 | 4.05 |
| 0.9592361111111897 | 4.05 |
| 0.9592939814815601 | 4.05 |
| 0.9593518518519305 | 4.05 |
| 0.9594097222223009 | 4.05 |
| 0.9594675925926713 | 4.05 |
| 0.9595254629630418 | 4.05 |
| 0.9595833333334122 | 4.05 |
| 0.9596412037037826 | 4.05 |
| 0.959699074074153 | 4.05 |
| 0.9597569444445234 | 4.05 |
| 0.9598148148148938 | 4.05 |
| 0.9598726851852643 | 4.05 |
| 0.9599305555556347 | 4.05 |
| 0.9599884259260051 | 4.05 |
| 0.9600462962963755 | 4.05 |
| 0.9601041666667459 | 4.05 |
| 0.9601620370371163 | 4.05 |
| 0.9602199074074868 | 4.05 |
| 0.9602777777778572 | 4.05 |
| 0.9603356481482276 | 4.05 |
| 0.960393518518598 | 4.05 |
| 0.9604513888889684 | 4.05 |
| 0.9605092592593388 | 4.05 |
| 0.9605671296297092 | 4.05 |
| 0.9606250000000797 | 4.05 |
| 0.9606828703704501 | 4.05 |
| 0.9607407407408205 | 4.05 |
| 0.9607986111111909 | 4.05 |
| 0.9608564814815613 | 4.05 |
| 0.9609143518519317 | 4.05 |
| 0.9609722222223022 | 4.05 |
| 0.9610300925926726 | 4.05 |
| 0.961087962963043 | 4.05 |
| 0.9611458333334134 | 4.05 |
| 0.9612037037037838 | 4.05 |
| 0.9612615740741542 | 4.05 |
| 0.9613194444445247 | 4.05 |
| 0.9613773148148951 | 4.05 |
| 0.9614351851852655 | 4.05 |
| 0.9614930555556359 | 4.05 |
| 0.9615509259260063 | 4.05 |
| 0.9616087962963767 | 4.05 |
| 0.9616666666667472 | 4.05 |
| 0.9617245370371176 | 4.05 |
| 0.961782407407488 | 4.05 |
| 0.9618402777778584 | 4.05 |
| 0.9618981481482288 | 4.05 |
| 0.9619560185185992 | 4.04 |
| 0.9620138888889697 | 4.04 |
| 0.9620717592593401 | 4.05 |
| 0.9621296296297105 | 4.05 |
| 0.9621875000000809 | 4.05 |
| 0.9622453703704513 | 4.04 |
| 0.9623032407408217 | 4.05 |
| 0.9623611111111922 | 4.05 |
| 0.9624189814815626 | 4.05 |
| 0.962476851851933 | 4.05 |
| 0.9625347222223034 | 4.05 |
| 0.9625925925926738 | 4.05 |
| 0.9626504629630442 | 4.05 |
| 0.9627083333334147 | 4.05 |
| 0.9627662037037851 | 4.04 |
| 0.9628240740741555 | 4.05 |
| 0.9628819444445259 | 4.05 |
| 0.9629398148148963 | 4.05 |
| 0.9629976851852667 | 4.05 |
| 0.9630555555556372 | 4.04 |
| 0.9631134259260076 | 4.05 |
| 0.963171296296378 | 4.05 |
| 0.9632291666667484 | 4.05 |
| 0.9632870370371188 | 4.04 |
| 0.9633449074074892 | 4.05 |
| 0.9634027777778597 | 4.05 |
| 0.9634606481482301 | 4.05 |
| 0.9635185185186005 | 4.05 |
| 0.9635763888889709 | 4.04 |
| 0.9636342592593413 | 4.05 |
| 0.9636921296297117 | 4.04 |
| 0.9637500000000822 | 4.05 |
| 0.9638078703704526 | 4.05 |
| 0.963865740740823 | 4.04 |
| 0.9639236111111934 | 4.05 |
| 0.9639814814815638 | 4.04 |
| 0.9640393518519342 | 4.05 |
| 0.9640972222223047 | 4.05 |
| 0.9641550925926751 | 4.04 |
| 0.9642129629630455 | 4.04 |
| 0.9642708333334159 | 4.04 |
| 0.9643287037037863 | 4.05 |
| 0.9643865740741567 | 4.05 |
| 0.9644444444445271 | 4.04 |
| 0.9645023148148976 | 4.05 |
| 0.964560185185268 | 4.04 |
| 0.9646180555556384 | 4.05 |
| 0.9646759259260088 | 4.04 |
| 0.9647337962963792 | 4.05 |
| 0.9647916666667496 | 4.04 |
| 0.9648495370371201 | 4.05 |
| 0.9649074074074905 | 4.04 |
| 0.9649652777778609 | 4.05 |
| 0.9650231481482313 | 4.04 |
| 0.9650810185186017 | 4.05 |
| 0.9651388888889721 | 4.05 |
| 0.9651967592593426 | 4.04 |
| 0.965254629629713 | 4.05 |
| 0.9653125000000834 | 4.04 |
| 0.9653703703704538 | 4.05 |
| 0.9654282407408242 | 4.04 |
| 0.9654861111111946 | 4.04 |
| 0.9655439814815651 | 4.05 |
| 0.9656018518519355 | 4.04 |
| 0.9656597222223059 | 4.04 |
| 0.9657175925926763 | 4.05 |
| 0.9657754629630467 | 4.05 |
| 0.9658333333334171 | 4.04 |
| 0.9658912037037876 | 4.04 |
| 0.965949074074158 | 4.04 |
| 0.9660069444445284 | 4.04 |
| 0.9660648148148988 | 4.05 |
| 0.9661226851852692 | 4.04 |
| 0.9661805555556396 | 4.04 |
| 0.9662384259260101 | 4.05 |
| 0.9662962962963805 | 4.05 |
| 0.9663541666667509 | 4.05 |
| 0.9664120370371213 | 4.04 |
| 0.9664699074074917 | 4.05 |
| 0.9665277777778621 | 4.04 |
| 0.9665856481482326 | 4.04 |
| 0.966643518518603 | 4.05 |
| 0.9667013888889734 | 4.04 |
| 0.9667592592593438 | 4.04 |
| 0.9668171296297142 | 4.04 |
| 0.9668750000000846 | 4.04 |
| 0.966932870370455 | 4.04 |
| 0.9669907407408255 | 4.05 |
| 0.9670486111111959 | 4.05 |
| 0.9671064814815663 | 4.04 |
| 0.9671643518519367 | 4.04 |
| 0.9672222222223071 | 4.04 |
| 0.9672800925926776 | 4.05 |
| 0.967337962963048 | 4.04 |
| 0.9673958333334184 | 4.04 |
| 0.9674537037037888 | 4.04 |
| 0.9675115740741592 | 4.04 |
| 0.9675694444445296 | 4.04 |
| 0.9676273148149 | 4.05 |
| 0.9676851851852705 | 4.04 |
| 0.9677430555556409 | 4.04 |
| 0.9678009259260113 | 4.04 |
| 0.9678587962963817 | 4.04 |
| 0.9679166666667521 | 4.04 |
| 0.9679745370371226 | 4.05 |
| 0.968032407407493 | 4.04 |
| 0.9680902777778634 | 4.04 |
| 0.9681481481482338 | 4.04 |
| 0.9682060185186042 | 4.04 |
| 0.9682638888889746 | 4.04 |
| 0.968321759259345 | 4.04 |
| 0.9683796296297155 | 4.05 |
| 0.9684375000000859 | 4.04 |
| 0.9684953703704563 | 4.04 |
| 0.9685532407408267 | 4.04 |
| 0.9686111111111971 | 4.04 |
| 0.9686689814815675 | 4.04 |
| 0.968726851851938 | 4.04 |
| 0.9687847222223084 | 4.04 |
| 0.9688425925926788 | 4.04 |
| 0.9689004629630492 | 4.04 |
| 0.9689583333334196 | 4.04 |
| 0.96901620370379 | 4.04 |
| 0.9690740740741605 | 4.04 |
| 0.9691319444445309 | 4.04 |
| 0.9691898148149013 | 4.04 |
| 0.9692476851852717 | 4.04 |
| 0.9693055555556421 | 4.04 |
| 0.9693634259260125 | 4.04 |
| 0.969421296296383 | 4.04 |
| 0.9694791666667534 | 4.05 |
| 0.9695370370371238 | 4.04 |
| 0.9695949074074942 | 4.04 |
| 0.9696527777778646 | 4.05 |
| 0.969710648148235 | 4.04 |
| 0.9697685185186055 | 4.04 |
| 0.9698263888889759 | 4.04 |
| 0.9698842592593463 | 4.04 |
| 0.9699421296297167 | 4.04 |
| 0.9700000000000871 | 4.04 |
| 0.9700578703704575 | 4.04 |
| 0.970115740740828 | 4.04 |
| 0.9701736111111984 | 4.04 |
| 0.9702314814815688 | 4.04 |
| 0.9702893518519392 | 4.04 |
| 0.9703472222223096 | 4.04 |
| 0.97040509259268 | 4.04 |
| 0.9704629629630505 | 4.04 |
| 0.9705208333334209 | 4.04 |
| 0.9705787037037913 | 4.04 |
| 0.9706365740741617 | 4.04 |
| 0.9706944444445321 | 4.04 |
| 0.9707523148149025 | 4.04 |
| 0.970810185185273 | 4.04 |
| 0.9708680555556434 | 4.04 |
| 0.9709259259260138 | 4.04 |
| 0.9709837962963842 | 4.04 |
| 0.9710416666667546 | 4.04 |
| 0.971099537037125 | 4.04 |
| 0.9711574074074955 | 4.04 |
| 0.9712152777778659 | 4.04 |
| 0.9712731481482363 | 4.04 |
| 0.9713310185186067 | 4.04 |
| 0.9713888888889771 | 4.04 |
| 0.9714467592593475 | 4.04 |
| 0.971504629629718 | 4.05 |
| 0.9715625000000884 | 4.04 |
| 0.9716203703704588 | 4.04 |
| 0.9716782407408292 | 4.04 |
| 0.9717361111111996 | 4.04 |
| 0.97179398148157 | 4.04 |
| 0.9718518518519405 | 4.04 |
| 0.9719097222223109 | 4.04 |
| 0.9719675925926813 | 4.04 |
| 0.9720254629630517 | 4.04 |
| 0.9720833333334221 | 4.04 |
| 0.9721412037037925 | 4.04 |
| 0.972199074074163 | 4.04 |
| 0.9722569444445334 | 4.04 |
| 0.9723148148149038 | 4.04 |
| 0.9723726851852742 | 4.04 |
| 0.9724305555556446 | 4.04 |
| 0.972488425926015 | 4.04 |
| 0.9725462962963854 | 4.04 |
| 0.9726041666667559 | 4.04 |
| 0.9726620370371263 | 4.04 |
| 0.9727199074074967 | 4.04 |
| 0.9727777777778671 | 4.04 |
| 0.9728356481482375 | 4.04 |
| 0.972893518518608 | 4.04 |
| 0.9729513888889784 | 4.04 |
| 0.9730092592593488 | 4.04 |
| 0.9730671296297192 | 4.04 |
| 0.9731250000000896 | 4.04 |
| 0.97318287037046 | 4.04 |
| 0.9732407407408304 | 4.04 |
| 0.9732986111112009 | 4.04 |
| 0.9733564814815713 | 4.04 |
| 0.9734143518519417 | 4.04 |
| 0.9734722222223121 | 4.04 |
| 0.9735300925926825 | 4.04 |
| 0.9735879629630529 | 4.04 |
| 0.9736458333334234 | 4.04 |
| 0.9737037037037938 | 4.04 |
| 0.9737615740741642 | 4.04 |
| 0.9738194444445346 | 4.04 |
| 0.973877314814905 | 4.04 |
| 0.9739351851852754 | 4.04 |
| 0.9739930555556459 | 4.04 |
| 0.9740509259260163 | 4.04 |
| 0.9741087962963867 | 4.04 |
| 0.9741666666667571 | 4.04 |
| 0.9742245370371275 | 4.04 |
| 0.9742824074074979 | 4.04 |
| 0.9743402777778684 | 4.04 |
| 0.9743981481482388 | 4.04 |
| 0.9744560185186092 | 4.04 |
| 0.9745138888889796 | 4.04 |
| 0.97457175925935 | 4.04 |
| 0.9746296296297204 | 4.04 |
| 0.9746875000000909 | 4.04 |
| 0.9747453703704613 | 4.04 |
| 0.9748032407408317 | 4.04 |
| 0.9748611111112021 | 4.04 |
| 0.9749189814815725 | 4.04 |
| 0.9749768518519429 | 4.04 |
| 0.9750347222223134 | 4.04 |
| 0.9750925925926838 | 4.04 |
| 0.9751504629630542 | 4.04 |
| 0.9752083333334246 | 4.04 |
| 0.975266203703795 | 4.04 |
| 0.9753240740741654 | 4.04 |
| 0.9753819444445359 | 4.04 |
| 0.9754398148149063 | 4.04 |
| 0.9754976851852767 | 4.04 |
| 0.9755555555556471 | 4.04 |
| 0.9756134259260175 | 4.04 |
| 0.9756712962963879 | 4.04 |
| 0.9757291666667584 | 4.04 |
| 0.9757870370371288 | 4.04 |
| 0.9758449074074992 | 4.04 |
| 0.9759027777778696 | 4.04 |
| 0.97596064814824 | 4.04 |
| 0.9760185185186104 | 4.04 |
| 0.9760763888889809 | 4.04 |
| 0.9761342592593513 | 4.04 |
| 0.9761921296297217 | 4.04 |
| 0.9762500000000921 | 4.04 |
| 0.9763078703704625 | 4.04 |
| 0.9763657407408329 | 4.04 |
| 0.9764236111112033 | 4.04 |
| 0.9764814814815738 | 4.04 |
| 0.9765393518519442 | 4.04 |
| 0.9765972222223146 | 4.04 |
| 0.976655092592685 | 4.04 |
| 0.9767129629630554 | 4.04 |
| 0.9767708333334258 | 4.04 |
| 0.9768287037037963 | 4.04 |
| 0.9768865740741667 | 4.04 |
| 0.9769444444445371 | 4.04 |
| 0.9770023148149075 | 4.04 |
| 0.9770601851852779 | 4.04 |
| 0.9771180555556483 | 4.04 |
| 0.9771759259260188 | 4.04 |
| 0.9772337962963892 | 4.04 |
| 0.9772916666667596 | 4.04 |
| 0.97734953703713 | 4.04 |
| 0.9774074074075004 | 4.04 |
| 0.9774652777778708 | 4.04 |
| 0.9775231481482413 | 4.04 |
| 0.9775810185186117 | 4.03 |
| 0.9776388888889821 | 4.04 |
| 0.9776967592593525 | 4.04 |
| 0.9777546296297229 | 4.04 |
| 0.9778125000000933 | 4.03 |
| 0.9778703703704638 | 4.04 |
| 0.9779282407408342 | 4.04 |
| 0.9779861111112046 | 4.04 |
| 0.978043981481575 | 4.04 |
| 0.9781018518519454 | 4.04 |
| 0.9781597222223158 | 4.04 |
| 0.9782175925926863 | 4.04 |
| 0.9782754629630567 | 4.04 |
| 0.9783333333334271 | 4.04 |
| 0.9783912037037975 | 4.04 |
| 0.9784490740741679 | 4.04 |
| 0.9785069444445383 | 4.04 |
| 0.9785648148149088 | 4.04 |
| 0.9786226851852792 | 4.04 |
| 0.9786805555556496 | 4.04 |
| 0.97873842592602 | 4.04 |
| 0.9787962962963904 | 4.04 |
| 0.9788541666667608 | 4.03 |
| 0.9789120370371313 | 4.03 |
| 0.9789699074075017 | 4.03 |
| 0.9790277777778721 | 4.04 |
| 0.9790856481482425 | 4.04 |
| 0.9791435185186129 | 4.03 |
| 0.9792013888889833 | 4.04 |
| 0.9792592592593538 | 4.04 |
| 0.9793171296297242 | 4.04 |
| 0.9793750000000946 | 4.04 |
| 0.979432870370465 | 4.04 |
| 0.9794907407408354 | 4.04 |
| 0.9795486111112058 | 4.04 |
| 0.9796064814815763 | 4.04 |
| 0.9796643518519467 | 4.04 |
| 0.9797222222223171 | 4.04 |
| 0.9797800925926875 | 4.04 |
| 0.9798379629630579 | 4.04 |
| 0.9798958333334283 | 4.04 |
| 0.9799537037037988 | 4.04 |
| 0.9800115740741692 | 4.04 |
| 0.9800694444445396 | 4.04 |
| 0.98012731481491 | 4.04 |
| 0.9801851851852804 | 4.04 |
| 0.9802430555556508 | 4.04 |
| 0.9803009259260212 | 4.04 |
| 0.9803587962963917 | 4.04 |
| 0.9804166666667621 | 4.04 |
| 0.9804745370371325 | 4.04 |
| 0.9805324074075029 | 4.04 |
| 0.9805902777778733 | 4.04 |
| 0.9806481481482437 | 4.04 |
| 0.9807060185186142 | 4.04 |
| 0.9807638888889846 | 4.03 |
| 0.980821759259355 | 4.03 |
| 0.9808796296297254 | 4.04 |
| 0.9809375000000958 | 4.04 |
| 0.9809953703704662 | 4.04 |
| 0.9810532407408367 | 4.03 |
| 0.9811111111112071 | 4.04 |
| 0.9811689814815775 | 4.03 |
| 0.9812268518519479 | 4.03 |
| 0.9812847222223183 | 4.04 |
| 0.9813425925926887 | 4.03 |
| 0.9814004629630592 | 4.04 |
| 0.9814583333334296 | 4.04 |
| 0.9815162037038 | 4.04 |
| 0.9815740740741704 | 4.04 |
| 0.9816319444445408 | 4.04 |
| 0.9816898148149112 | 4.04 |
| 0.9817476851852817 | 4.04 |
| 0.9818055555556521 | 4.04 |
| 0.9818634259260225 | 4.04 |
| 0.9819212962963929 | 4.04 |
| 0.9819791666667633 | 4.04 |
| 0.9820370370371337 | 4.04 |
| 0.9820949074075042 | 4.04 |
| 0.9821527777778746 | 4.04 |
| 0.982210648148245 | 4.04 |
| 0.9822685185186154 | 4.04 |
| 0.9823263888889858 | 4.04 |
| 0.9823842592593562 | 4.04 |
| 0.9824421296297267 | 4.03 |
| 0.9825000000000971 | 4.04 |
| 0.9825578703704675 | 4.04 |
| 0.9826157407408379 | 4.04 |
| 0.9826736111112083 | 4.04 |
| 0.9827314814815787 | 4.04 |
| 0.9827893518519492 | 4.04 |
| 0.9828472222223196 | 4.04 |
| 0.98290509259269 | 4.04 |
| 0.9829629629630604 | 4.04 |
| 0.9830208333334308 | 4.04 |
| 0.9830787037038012 | 4.04 |
| 0.9831365740741717 | 4.04 |
| 0.9831944444445421 | 4.04 |
| 0.9832523148149125 | 4.04 |
| 0.9833101851852829 | 4.04 |
| 0.9833680555556533 | 4.04 |
| 0.9834259259260237 | 4.04 |
| 0.9834837962963942 | 4.04 |
| 0.9835416666667646 | 4.04 |
| 0.983599537037135 | 4.04 |
| 0.9836574074075054 | 4.04 |
| 0.9837152777778758 | 4.04 |
| 0.9837731481482462 | 4.04 |
| 0.9838310185186167 | 4.04 |
| 0.9838888888889871 | 4.04 |
| 0.9839467592593575 | 4.04 |
| 0.9840046296297279 | 4.04 |
| 0.9840625000000983 | 4.04 |
| 0.9841203703704687 | 4.04 |
| 0.9841782407408391 | 4.04 |
| 0.9842361111112096 | 4.04 |
| 0.98429398148158 | 4.04 |
| 0.9843518518519504 | 4.04 |
| 0.9844097222223208 | 4.04 |
| 0.9844675925926912 | 4.04 |
| 0.9845254629630616 | 4.04 |
| 0.9845833333334321 | 4.04 |
| 0.9846412037038025 | 4.04 |
| 0.9846990740741729 | 4.04 |
| 0.9847569444445433 | 4.04 |
| 0.9848148148149137 | 4.04 |
| 0.9848726851852841 | 4.04 |
| 0.9849305555556546 | 4.04 |
| 0.984988425926025 | 4.04 |
| 0.9850462962963954 | 4.04 |
| 0.9851041666667658 | 4.04 |
| 0.9851620370371362 | 4.04 |
| 0.9852199074075066 | 4.04 |
| 0.9852777777778771 | 4.04 |
| 0.9853356481482475 | 4.04 |
| 0.9853935185186179 | 4.04 |
| 0.9854513888889883 | 4.04 |
| 0.9855092592593587 | 4.04 |
| 0.9855671296297291 | 4.04 |
| 0.9856250000000996 | 4.04 |
| 0.98568287037047 | 4.04 |
| 0.9857407407408404 | 4.04 |
| 0.9857986111112108 | 4.04 |
| 0.9858564814815812 | 4.04 |
| 0.9859143518519516 | 4.04 |
| 0.9859722222223221 | 4.04 |
| 0.9860300925926925 | 4.04 |
| 0.9860879629630629 | 4.04 |
| 0.9861458333334333 | 4.04 |
| 0.9862037037038037 | 4.04 |
| 0.9862615740741741 | 4.04 |
| 0.9863194444445446 | 4.04 |
| 0.986377314814915 | 4.03 |
| 0.9864351851852854 | 4.04 |
| 0.9864930555556558 | 4.04 |
| 0.9865509259260262 | 4.04 |
| 0.9866087962963966 | 4.04 |
| 0.9866666666667671 | 4.04 |
| 0.9867245370371375 | 4.04 |
| 0.9867824074075079 | 4.04 |
| 0.9868402777778783 | 4.04 |
| 0.9868981481482487 | 4.04 |
| 0.9869560185186191 | 4.04 |
| 0.9870138888889896 | 4.04 |
| 0.98707175925936 | 4.04 |
| 0.9871296296297304 | 4.04 |
| 0.9871875000001008 | 4.04 |
| 0.9872453703704712 | 4.04 |
| 0.9873032407408416 | 4.04 |
| 0.987361111111212 | 4.04 |
| 0.9874189814815825 | 4.04 |
| 0.9874768518519529 | 4.04 |
| 0.9875347222223233 | 4.04 |
| 0.9875925925926937 | 4.04 |
| 0.9876504629630641 | 4.04 |
| 0.9877083333334346 | 4.04 |
| 0.987766203703805 | 4.04 |
| 0.9878240740741754 | 4.04 |
| 0.9878819444445458 | 4.04 |
| 0.9879398148149162 | 4.04 |
| 0.9879976851852866 | 4.04 |
| 0.988055555555657 | 4.04 |
| 0.9881134259260275 | 4.04 |
| 0.9881712962963979 | 4.04 |
| 0.9882291666667683 | 4.04 |
| 0.9882870370371387 | 4.04 |
| 0.9883449074075091 | 4.04 |
| 0.9884027777778795 | 4.03 |
| 0.98846064814825 | 4.03 |
| 0.9885185185186204 | 4.04 |
| 0.9885763888889908 | 4.03 |
| 0.9886342592593612 | 4.04 |
| 0.9886921296297316 | 4.04 |
| 0.988750000000102 | 4.04 |
| 0.9888078703704725 | 4.04 |
| 0.9888657407408429 | 4.04 |
| 0.9889236111112133 | 4.04 |
| 0.9889814814815837 | 4.04 |
| 0.9890393518519541 | 4.04 |
| 0.9890972222223245 | 4.04 |
| 0.989155092592695 | 4.04 |
| 0.9892129629630654 | 4.04 |
| 0.9892708333334358 | 4.04 |
| 0.9893287037038062 | 4.04 |
| 0.9893865740741766 | 4.04 |
| 0.989444444444547 | 4.04 |
| 0.9895023148149175 | 4.04 |
| 0.9895601851852879 | 4.04 |
| 0.9896180555556583 | 4.03 |
| 0.9896759259260287 | 4.03 |
| 0.9897337962963991 | 4.04 |
| 0.9897916666667695 | 4.04 |
| 0.98984953703714 | 4.03 |
| 0.9899074074075104 | 4.03 |
| 0.9899652777778808 | 4.03 |
| 0.9900231481482512 | 4.03 |
| 0.9900810185186216 | 4.03 |
| 0.990138888888992 | 4.03 |
| 0.9901967592593625 | 4.03 |
| 0.9902546296297329 | 4.03 |
| 0.9903125000001033 | 4.04 |
| 0.9903703703704737 | 4.04 |
| 0.9904282407408441 | 4.04 |
| 0.9904861111112145 | 4.04 |
| 0.990543981481585 | 4.04 |
| 0.9906018518519554 | 4.04 |
| 0.9906597222223258 | 4.04 |
| 0.9907175925926962 | 4.04 |
| 0.9907754629630666 | 4.04 |
| 0.990833333333437 | 4.04 |
| 0.9908912037038075 | 4.04 |
| 0.9909490740741779 | 4.04 |
| 0.9910069444445483 | 4.04 |
| 0.9910648148149187 | 4.04 |
| 0.9911226851852891 | 4.04 |
| 0.9911805555556595 | 4.04 |
| 0.99123842592603 | 4.04 |
| 0.9912962962964004 | 4.04 |
| 0.9913541666667708 | 4.04 |
| 0.9914120370371412 | 4.04 |
| 0.9914699074075116 | 4.04 |
| 0.991527777777882 | 4.04 |
| 0.9915856481482525 | 4.04 |
| 0.9916435185186229 | 4.03 |
| 0.9917013888889933 | 4.04 |
| 0.9917592592593637 | 4.04 |
| 0.9918171296297341 | 4.04 |
| 0.9918750000001045 | 4.04 |
| 0.991932870370475 | 4.04 |
| 0.9919907407408454 | 4.04 |
| 0.9920486111112158 | 4.04 |
| 0.9921064814815862 | 4.04 |
| 0.9921643518519566 | 4.04 |
| 0.992222222222327 | 4.04 |
| 0.9922800925926974 | 4.04 |
| 0.9923379629630679 | 4.04 |
| 0.9923958333334383 | 4.04 |
| 0.9924537037038087 | 4.04 |
| 0.9925115740741791 | 4.04 |
| 0.9925694444445495 | 4.04 |
| 0.99262731481492 | 4.04 |
| 0.9926851851852904 | 4.04 |
| 0.9927430555556608 | 4.03 |
| 0.9928009259260312 | 4.04 |
| 0.9928587962964016 | 4.04 |
| 0.992916666666772 | 4.04 |
| 0.9929745370371424 | 4.04 |
| 0.9930324074075129 | 4.04 |
| 0.9930902777778833 | 4.04 |
| 0.9931481481482537 | 4.04 |
| 0.9932060185186241 | 4.04 |
| 0.9932638888889945 | 4.04 |
| 0.993321759259365 | 4.04 |
| 0.9933796296297354 | 4.04 |
| 0.9934375000001058 | 4.04 |
| 0.9934953703704762 | 4.04 |
| 0.9935532407408466 | 4.04 |
| 0.993611111111217 | 4.04 |
| 0.9936689814815874 | 4.04 |
| 0.9937268518519579 | 4.04 |
| 0.9937847222223283 | 4.04 |
| 0.9938425925926987 | 4.04 |
| 0.9939004629630691 | 4.04 |
| 0.9939583333334395 | 4.04 |
| 0.9940162037038099 | 4.04 |
| 0.9940740740741804 | 4.04 |
| 0.9941319444445508 | 4.04 |
| 0.9941898148149212 | 4.04 |
| 0.9942476851852916 | 4.04 |
| 0.994305555555662 | 4.04 |
| 0.9943634259260324 | 4.04 |
| 0.9944212962964029 | 4.04 |
| 0.9944791666667733 | 4.04 |
| 0.9945370370371437 | 4.04 |
| 0.9945949074075141 | 4.04 |
| 0.9946527777778845 | 4.04 |
| 0.9947106481482549 | 4.04 |
| 0.9947685185186254 | 4.04 |
| 0.9948263888889958 | 4.04 |
| 0.9948842592593662 | 4.03 |
| 0.9949421296297366 | 4.04 |
| 0.995000000000107 | 4.04 |
| 0.9950578703704774 | 4.04 |
| 0.9951157407408479 | 4.04 |
| 0.9951736111112183 | 4.04 |
| 0.9952314814815887 | 4.04 |
| 0.9952893518519591 | 4.04 |
| 0.9953472222223295 | 4.04 |
| 0.9954050925926999 | 4.04 |
| 0.9954629629630704 | 4.04 |
| 0.9955208333334408 | 4.04 |
| 0.9955787037038112 | 4.04 |
| 0.9956365740741816 | 4.04 |
| 0.995694444444552 | 4.04 |
| 0.9957523148149224 | 4.04 |
| 0.9958101851852929 | 4.04 |
| 0.9958680555556633 | 4.04 |
| 0.9959259259260337 | 4.04 |
| 0.9959837962964041 | 4.04 |
| 0.9960416666667745 | 4.04 |
| 0.9960995370371449 | 4.04 |
| 0.9961574074075153 | 4.04 |
| 0.9962152777778858 | 4.04 |
| 0.9962731481482562 | 4.04 |
| 0.9963310185186266 | 4.04 |
| 0.996388888888997 | 4.04 |
| 0.9964467592593674 | 4.04 |
| 0.9965046296297378 | 4.04 |
| 0.9965625000001083 | 4.04 |
| 0.9966203703704787 | 4.04 |
| 0.9966782407408491 | 4.04 |
| 0.9967361111112195 | 4.04 |
| 0.9967939814815899 | 4.04 |
| 0.9968518518519603 | 4.04 |
| 0.9969097222223308 | 4.04 |
| 0.9969675925927012 | 4.04 |
| 0.9970254629630716 | 4.04 |
| 0.997083333333442 | 4.04 |
| 0.9971412037038124 | 4.04 |
| 0.9971990740741828 | 4.04 |
| 0.9972569444445533 | 4.04 |
| 0.9973148148149237 | 4.04 |
| 0.9973726851852941 | 4.04 |
| 0.9974305555556645 | 4.04 |
| 0.9974884259260349 | 4.03 |
| 0.9975462962964053 | 4.03 |
| 0.9976041666667758 | 4.03 |
| 0.9976620370371462 | 4.04 |
| 0.9977199074075166 | 4.04 |
| 0.997777777777887 | 4.04 |
| 0.9978356481482574 | 4.04 |
| 0.9978935185186278 | 4.04 |
| 0.9979513888889983 | 4.04 |
| 0.9980092592593687 | 4.04 |
| 0.9980671296297391 | 4.04 |
| 0.9981250000001095 | 4.04 |
| 0.9981828703704799 | 4.04 |
| 0.9982407407408503 | 4.04 |
| 0.9982986111112208 | 4.04 |
| 0.9983564814815912 | 4.04 |
| 0.9984143518519616 | 4.04 |
| 0.998472222222332 | 4.04 |
| 0.9985300925927024 | 4.04 |
| 0.9985879629630728 | 4.04 |
| 0.9986458333334433 | 4.04 |
| 0.9987037037038137 | 4.04 |
| 0.9987615740741841 | 4.04 |
| 0.9988194444445545 | 4.04 |
| 0.9988773148149249 | 4.03 |
| 0.9989351851852953 | 4.03 |
| 0.9989930555556658 | 4.03 |
| 0.9990509259260362 | 4.03 |
| 0.9991087962964066 | 4.03 |
| 0.999166666666777 | 4.03 |
| 0.9992245370371474 | 4.03 |
| 0.9992824074075178 | 4.02 |
| 0.9993402777778883 | 4.03 |
| 0.9993981481482587 | 4.03 |
| 0.9994560185186291 | 4.03 |
| 0.9995138888889995 | 4.03 |
| 0.9995717592593699 | 4.04 |
| 0.9996296296297403 | 4.04 |
| 0.9996875000001108 | 4.04 |
| 0.9997453703704812 | 4.04 |
| 0.9998032407408516 | 4.03 |
| 0.999861111111222 | 4.04 |
| 0.9999189814815924 | 4.04 |
| 0.9999768518519628 | 4.04 |
| 1900-01-01 00:00:03 | 4.04 |
| 1900-01-01 00:00:08 | 4.04 |
| 1900-01-01 00:00:13 | 4.04 |
| 1900-01-01 00:00:18 | 4.04 |
| 1900-01-01 00:00:23 | 4.04 |
| 1900-01-01 00:00:28 | 4.04 |
| 1900-01-01 00:00:33 | 4.04 |
| 1900-01-01 00:00:38 | 4.04 |
| 1900-01-01 00:00:43 | 4.04 |
| 1900-01-01 00:00:48 | 4.04 |
| 1900-01-01 00:00:53 | 4.04 |
| 1900-01-01 00:00:58 | 4.04 |
| 1900-01-01 00:01:03 | 4.04 |
| 1900-01-01 00:01:08 | 4.04 |
| 1900-01-01 00:01:13 | 4.04 |
| 1900-01-01 00:01:18 | 4.04 |
| 1900-01-01 00:01:23 | 4.04 |
| 1900-01-01 00:01:28 | 4.04 |
| 1900-01-01 00:01:33 | 4.04 |
| 1900-01-01 00:01:38 | 4.04 |
| 1900-01-01 00:01:43 | 4.04 |
| 1900-01-01 00:01:48 | 4.04 |
| 1900-01-01 00:01:53 | 4.04 |
| 1900-01-01 00:01:58 | 4.04 |
| 1900-01-01 00:02:03 | 4.04 |
| 1900-01-01 00:02:08 | 4.04 |
| 1900-01-01 00:02:13 | 4.04 |
| 1900-01-01 00:02:18 | 4.04 |
| 1900-01-01 00:02:23 | 4.04 |
| 1900-01-01 00:02:28 | 4.04 |
| 1900-01-01 00:02:33 | 4.04 |
| 1900-01-01 00:02:38 | 4.04 |
| 1900-01-01 00:02:43 | 4.04 |
| 1900-01-01 00:02:48 | 4.04 |
| 1900-01-01 00:02:53 | 4.04 |
| 1900-01-01 00:02:58 | 4.04 |
| 1900-01-01 00:03:03 | 4.04 |
| 1900-01-01 00:03:08 | 4.04 |
| 1900-01-01 00:03:13 | 4.04 |
| 1900-01-01 00:03:18 | 4.04 |
| 1900-01-01 00:03:23 | 4.04 |
| 1900-01-01 00:03:28 | 4.04 |
| 1900-01-01 00:03:33 | 4.04 |
| 1900-01-01 00:03:38 | 4.04 |
| 1900-01-01 00:03:43 | 4.04 |
| 1900-01-01 00:03:48 | 4.04 |
| 1900-01-01 00:03:53 | 4.04 |
| 1900-01-01 00:03:58 | 4.04 |
| 1900-01-01 00:04:03 | 4.04 |
| 1900-01-01 00:04:08 | 4.04 |
| 1900-01-01 00:04:13 | 4.04 |
| 1900-01-01 00:04:18 | 4.04 |
| 1900-01-01 00:04:23 | 4.04 |
| 1900-01-01 00:04:28 | 4.04 |
| 1900-01-01 00:04:33 | 4.04 |
| 1900-01-01 00:04:38 | 4.04 |
| 1900-01-01 00:04:43 | 4.04 |
| 1900-01-01 00:04:48 | 4.04 |
| 1900-01-01 00:04:53 | 4.04 |
| 1900-01-01 00:04:58 | 4.04 |
| 1900-01-01 00:05:03 | 4.04 |
| 1900-01-01 00:05:08 | 4.04 |
| 1900-01-01 00:05:13 | 4.04 |
| 1900-01-01 00:05:18 | 4.02 |
| 1900-01-01 00:05:23 | 4.02 |
| 1900-01-01 00:05:28 | 4.02 |
| 1900-01-01 00:05:33 | 4.03 |
| 1900-01-01 00:05:38 | 4.02 |
| 1900-01-01 00:05:43 | 4.04 |
| 1900-01-01 00:05:48 | 4.03 |
| 1900-01-01 00:05:53 | 4.03 |
| 1900-01-01 00:05:58 | 4.04 |
| 1900-01-01 00:06:03 | 4.04 |
| 1900-01-01 00:06:08 | 4.04 |
| 1900-01-01 00:06:13 | 4.04 |
| 1900-01-01 00:06:18 | 4.04 |
| 1900-01-01 00:06:23 | 4.04 |
| 1900-01-01 00:06:28 | 4.04 |
| 1900-01-01 00:06:33 | 4.04 |
| 1900-01-01 00:06:38 | 4.04 |
| 1900-01-01 00:06:43 | 4.03 |
| 1900-01-01 00:06:48 | 4.04 |
| 1900-01-01 00:06:53 | 4.04 |
| 1900-01-01 00:06:58 | 4.03 |
| 1900-01-01 00:07:03 | 4.04 |
| 1900-01-01 00:07:08 | 4.04 |
| 1900-01-01 00:07:13 | 4.04 |
| 1900-01-01 00:07:18 | 4.04 |
| 1900-01-01 00:07:23 | 4.02 |
| 1900-01-01 00:07:28 | 4.03 |
| 1900-01-01 00:07:33 | 4.04 |
| 1900-01-01 00:07:38 | 4.04 |
| 1900-01-01 00:07:43 | 4.03 |
| 1900-01-01 00:07:48 | 4.04 |
| 1900-01-01 00:07:53 | 4.04 |
| 1900-01-01 00:07:58 | 4.02 |
| 1900-01-01 00:08:03 | 4.02 |
| 1900-01-01 00:08:08 | 4.04 |
| 1900-01-01 00:08:13 | 4.03 |
| 1900-01-01 00:08:18 | 4.03 |
| 1900-01-01 00:08:23 | 4.04 |
| 1900-01-01 00:08:28 | 4.04 |
| 1900-01-01 00:08:33 | 4.04 |
| 1900-01-01 00:08:38 | 4.03 |
| 1900-01-01 00:08:43 | 4.04 |
| 1900-01-01 00:08:48 | 4.02 |
| 1900-01-01 00:08:53 | 4.02 |
| 1900-01-01 00:08:58 | 4.02 |
| 1900-01-01 00:09:03 | 4.02 |
| 1900-01-01 00:09:08 | 4.02 |
| 1900-01-01 00:09:13 | 4.03 |
| 1900-01-01 00:09:18 | 4.02 |
| 1900-01-01 00:09:23 | 4.02 |
| 1900-01-01 00:09:28 | 4.02 |
| 1900-01-01 00:09:33 | 4.02 |
| 1900-01-01 00:09:38 | 4.02 |
| 1900-01-01 00:09:43 | 4.02 |
| 1900-01-01 00:09:48 | 4.03 |
| 1900-01-01 00:09:53 | 4.04 |
| 1900-01-01 00:09:58 | 4.04 |
| 1900-01-01 00:10:03 | 4.03 |
| 1900-01-01 00:10:08 | 4.03 |
| 1900-01-01 00:10:13 | 4.03 |
| 1900-01-01 00:10:18 | 4.04 |
| 1900-01-01 00:10:23 | 4.03 |
| 1900-01-01 00:10:28 | 4.03 |
| 1900-01-01 00:10:33 | 4.03 |
| 1900-01-01 00:10:38 | 4.03 |
| 1900-01-01 00:10:43 | 4.03 |
| 1900-01-01 00:10:48 | 4.03 |
| 1900-01-01 00:10:53 | 4.03 |
| 1900-01-01 00:10:58 | 4.04 |
| 1900-01-01 00:11:03 | 4.03 |
| 1900-01-01 00:11:08 | 4.03 |
| 1900-01-01 00:11:13 | 4.03 |
| 1900-01-01 00:11:18 | 4.03 |
| 1900-01-01 00:11:23 | 4.03 |
| 1900-01-01 00:11:28 | 4.03 |
| 1900-01-01 00:11:33 | 4.03 |
| 1900-01-01 00:11:38 | 4.03 |
| 1900-01-01 00:11:43 | 4.03 |
| 1900-01-01 00:11:48 | 4.03 |
| 1900-01-01 00:11:53 | 4.03 |
| 1900-01-01 00:11:58 | 4.03 |
| 1900-01-01 00:12:03 | 4.04 |
| 1900-01-01 00:12:08 | 4.03 |
| 1900-01-01 00:12:13 | 4.03 |
| 1900-01-01 00:12:18 | 4.03 |
| 1900-01-01 00:12:23 | 4.03 |
| 1900-01-01 00:12:28 | 4.03 |
| 1900-01-01 00:12:33 | 4.03 |
| 1900-01-01 00:12:38 | 4.03 |
| 1900-01-01 00:12:43 | 4.03 |
| 1900-01-01 00:12:48 | 4.04 |
| 1900-01-01 00:12:53 | 4.03 |
| 1900-01-01 00:12:58 | 4.03 |
| 1900-01-01 00:13:03 | 4.03 |
| 1900-01-01 00:13:08 | 4.03 |
| 1900-01-01 00:13:13 | 4.03 |
| 1900-01-01 00:13:18 | 4.03 |
| 1900-01-01 00:13:23 | 4.03 |
| 1900-01-01 00:13:28 | 4.03 |
| 1900-01-01 00:13:33 | 4.03 |
| 1900-01-01 00:13:38 | 4.03 |
| 1900-01-01 00:13:43 | 4.03 |
| 1900-01-01 00:13:48 | 4.02 |
| 1900-01-01 00:13:53 | 4.02 |
| 1900-01-01 00:13:58 | 4.03 |
| 1900-01-01 00:14:03 | 4.02 |
| 1900-01-01 00:14:08 | 4.03 |
| 1900-01-01 00:14:13 | 4.03 |
| 1900-01-01 00:14:18 | 4.03 |
| 1900-01-01 00:14:23 | 4.03 |
| 1900-01-01 00:14:28 | 4.03 |
| 1900-01-01 00:14:33 | 4.03 |
| 1900-01-01 00:14:38 | 4.03 |
| 1900-01-01 00:14:43 | 4.03 |
| 1900-01-01 00:14:48 | 4.03 |
| 1900-01-01 00:14:53 | 4.03 |
| 1900-01-01 00:14:58 | 4.03 |
| 1900-01-01 00:15:03 | 4.03 |
| 1900-01-01 00:15:08 | 4.04 |
| 1900-01-01 00:15:13 | 4.03 |
| 1900-01-01 00:15:18 | 4.03 |
| 1900-01-01 00:15:23 | 4.02 |
| 1900-01-01 00:15:28 | 4.02 |
| 1900-01-01 00:15:33 | 4.03 |
| 1900-01-01 00:15:38 | 4.03 |
| 1900-01-01 00:15:43 | 4.03 |
| 1900-01-01 00:15:48 | 4.03 |
| 1900-01-01 00:15:53 | 4.03 |
| 1900-01-01 00:15:58 | 4.04 |
| 1900-01-01 00:16:03 | 4.03 |
| 1900-01-01 00:16:08 | 4.03 |
| 1900-01-01 00:16:13 | 4.03 |
| 1900-01-01 00:16:18 | 4.03 |
| 1900-01-01 00:16:23 | 4.03 |
| 1900-01-01 00:16:28 | 4.03 |
| 1900-01-01 00:16:33 | 4.03 |
| 1900-01-01 00:16:38 | 4.03 |
| 1900-01-01 00:16:43 | 4.03 |
| 1900-01-01 00:16:48 | 4.03 |
| 1900-01-01 00:16:53 | 4.03 |
| 1900-01-01 00:16:58 | 4.03 |
| 1900-01-01 00:17:03 | 4.03 |
| 1900-01-01 00:17:08 | 4.03 |
| 1900-01-01 00:17:13 | 4.03 |
| 1900-01-01 00:17:18 | 4.03 |
| 1900-01-01 00:17:23 | 4.03 |
| 1900-01-01 00:17:28 | 4.03 |
| 1900-01-01 00:17:33 | 4.03 |
| 1900-01-01 00:17:38 | 4.03 |
| 1900-01-01 00:17:43 | 4.03 |
| 1900-01-01 00:17:48 | 4.02 |
| 1900-01-01 00:17:53 | 4.02 |
| 1900-01-01 00:17:58 | 4.02 |
| 1900-01-01 00:18:03 | 4.02 |
| 1900-01-01 00:18:08 | 4.02 |
| 1900-01-01 00:18:13 | 4.02 |
| 1900-01-01 00:18:18 | 4.02 |
| 1900-01-01 00:18:23 | 4.02 |
| 1900-01-01 00:18:28 | 4.02 |
| 1900-01-01 00:18:33 | 4.02 |
| 1900-01-01 00:18:38 | 4.02 |
| 1900-01-01 00:18:43 | 4.03 |
| 1900-01-01 00:18:48 | 4.03 |
| 1900-01-01 00:18:53 | 4.03 |
| 1900-01-01 00:18:58 | 4.03 |
| 1900-01-01 00:19:03 | 4.03 |
| 1900-01-01 00:19:08 | 4.03 |
| 1900-01-01 00:19:13 | 4.03 |
| 1900-01-01 00:19:18 | 4.03 |
| 1900-01-01 00:19:23 | 4.02 |
| 1900-01-01 00:19:28 | 4.02 |
| 1900-01-01 00:19:33 | 4.03 |
| 1900-01-01 00:19:38 | 4.03 |
| 1900-01-01 00:19:43 | 4.03 |
| 1900-01-01 00:19:48 | 4.03 |
| 1900-01-01 00:19:53 | 4.03 |
| 1900-01-01 00:19:58 | 4.03 |
| 1900-01-01 00:20:03 | 4.03 |
| 1900-01-01 00:20:08 | 4.03 |
| 1900-01-01 00:20:13 | 4.03 |
| 1900-01-01 00:20:18 | 4.03 |
| 1900-01-01 00:20:23 | 4.03 |
| 1900-01-01 00:20:28 | 4.03 |
| 1900-01-01 00:20:33 | 4.03 |
| 1900-01-01 00:20:38 | 4.03 |
| 1900-01-01 00:20:43 | 4.03 |
| 1900-01-01 00:20:48 | 4.03 |
| 1900-01-01 00:20:53 | 4.03 |
| 1900-01-01 00:20:58 | 4.03 |
| 1900-01-01 00:21:03 | 4.03 |
| 1900-01-01 00:21:08 | 4.03 |
| 1900-01-01 00:21:13 | 4.03 |
| 1900-01-01 00:21:18 | 4.03 |
| 1900-01-01 00:21:23 | 4.03 |
| 1900-01-01 00:21:28 | 4.03 |
| 1900-01-01 00:21:33 | 4.03 |
| 1900-01-01 00:21:38 | 4.03 |
| 1900-01-01 00:21:43 | 4.03 |
| 1900-01-01 00:21:48 | 4.03 |
| 1900-01-01 00:21:53 | 4.03 |
| 1900-01-01 00:21:58 | 4.03 |
| 1900-01-01 00:22:03 | 4.02 |
| 1900-01-01 00:22:08 | 4.02 |
| 1900-01-01 00:22:13 | 4.02 |
| 1900-01-01 00:22:18 | 4.02 |
| 1900-01-01 00:22:23 | 4.02 |
| 1900-01-01 00:22:28 | 4.02 |
| 1900-01-01 00:22:33 | 4.02 |
| 1900-01-01 00:22:38 | 4.02 |
| 1900-01-01 00:22:43 | 4.02 |
| 1900-01-01 00:22:48 | 4.03 |
| 1900-01-01 00:22:53 | 4.03 |
| 1900-01-01 00:22:58 | 4.03 |
| 1900-01-01 00:23:03 | 4.03 |
| 1900-01-01 00:23:08 | 4.03 |
| 1900-01-01 00:23:13 | 4.03 |
| 1900-01-01 00:23:18 | 4.03 |
| 1900-01-01 00:23:23 | 4.02 |
| 1900-01-01 00:23:28 | 4.02 |
| 1900-01-01 00:23:33 | 4.03 |
| 1900-01-01 00:23:38 | 4.03 |
| 1900-01-01 00:23:43 | 4.03 |
| 1900-01-01 00:23:48 | 4.03 |
| 1900-01-01 00:23:53 | 4.03 |
| 1900-01-01 00:23:58 | 4.03 |
| 1900-01-01 00:24:03 | 4.03 |
| 1900-01-01 00:24:08 | 4.03 |
| 1900-01-01 00:24:13 | 4.03 |
| 1900-01-01 00:24:18 | 4.03 |
| 1900-01-01 00:24:23 | 4.03 |
| 1900-01-01 00:24:28 | 4.03 |
| 1900-01-01 00:24:33 | 4.03 |
| 1900-01-01 00:24:38 | 4.03 |
| 1900-01-01 00:24:43 | 4.03 |
| 1900-01-01 00:24:48 | 4.03 |
| 1900-01-01 00:24:53 | 4.03 |
| 1900-01-01 00:24:58 | 4.03 |
| 1900-01-01 00:25:03 | 4.03 |
| 1900-01-01 00:25:08 | 4.03 |
| 1900-01-01 00:25:13 | 4.03 |
| 1900-01-01 00:25:18 | 4.03 |
| 1900-01-01 00:25:23 | 4.03 |
| 1900-01-01 00:25:28 | 4.03 |
| 1900-01-01 00:25:33 | 4.03 |
| 1900-01-01 00:25:38 | 4.03 |
| 1900-01-01 00:25:43 | 4.03 |
| 1900-01-01 00:25:48 | 4.03 |
| 1900-01-01 00:25:53 | 4.03 |
| 1900-01-01 00:25:58 | 4.03 |
| 1900-01-01 00:26:03 | 4.03 |
| 1900-01-01 00:26:08 | 4.03 |
| 1900-01-01 00:26:13 | 4.03 |
| 1900-01-01 00:26:18 | 4.03 |
| 1900-01-01 00:26:23 | 4.03 |
| 1900-01-01 00:26:28 | 4.03 |
| 1900-01-01 00:26:33 | 4.03 |
| 1900-01-01 00:26:38 | 4.03 |
| 1900-01-01 00:26:43 | 4.03 |
| 1900-01-01 00:26:48 | 4.03 |
| 1900-01-01 00:26:53 | 4.03 |
| 1900-01-01 00:26:58 | 4.03 |
| 1900-01-01 00:27:03 | 4.03 |
| 1900-01-01 00:27:08 | 4.03 |
| 1900-01-01 00:27:13 | 4.02 |
| 1900-01-01 00:27:18 | 4.03 |
| 1900-01-01 00:27:23 | 4.03 |
| 1900-01-01 00:27:28 | 4.03 |
| 1900-01-01 00:27:33 | 4.03 |
| 1900-01-01 00:27:38 | 4.03 |
| 1900-01-01 00:27:43 | 4.03 |
| 1900-01-01 00:27:48 | 4.03 |
| 1900-01-01 00:27:53 | 4.03 |
| 1900-01-01 00:27:58 | 4.03 |
| 1900-01-01 00:28:03 | 4.03 |
| 1900-01-01 00:28:08 | 4.03 |
| 1900-01-01 00:28:13 | 4.03 |
| 1900-01-01 00:28:18 | 4.03 |
| 1900-01-01 00:28:23 | 4.03 |
| 1900-01-01 00:28:28 | 4.02 |
| 1900-01-01 00:28:33 | 4.02 |
| 1900-01-01 00:28:38 | 4.02 |
| 1900-01-01 00:28:43 | 4.02 |
| 1900-01-01 00:28:48 | 4.02 |
| 1900-01-01 00:28:53 | 4.03 |
| 1900-01-01 00:28:58 | 4.02 |
| 1900-01-01 00:29:03 | 4.02 |
| 1900-01-01 00:29:08 | 4.02 |
| 1900-01-01 00:29:13 | 4.03 |
| 1900-01-01 00:29:18 | 4.03 |
| 1900-01-01 00:29:23 | 4.03 |
| 1900-01-01 00:29:28 | 4.03 |
| 1900-01-01 00:29:33 | 4.03 |
| 1900-01-01 00:29:38 | 4.03 |
| 1900-01-01 00:29:43 | 4.03 |
| 1900-01-01 00:29:48 | 4.03 |
| 1900-01-01 00:29:53 | 4.03 |
| 1900-01-01 00:29:58 | 4.03 |
| 1900-01-01 00:30:03 | 4.03 |
| 1900-01-01 00:30:08 | 4.03 |
| 1900-01-01 00:30:13 | 4.03 |
| 1900-01-01 00:30:18 | 4.03 |
| 1900-01-01 00:30:23 | 4.03 |
| 1900-01-01 00:30:28 | 4.03 |
| 1900-01-01 00:30:33 | 4.03 |
| 1900-01-01 00:30:38 | 4.03 |
| 1900-01-01 00:30:43 | 4.03 |
| 1900-01-01 00:30:48 | 4.03 |
| 1900-01-01 00:30:53 | 4.03 |
| 1900-01-01 00:30:58 | 4.03 |
| 1900-01-01 00:31:03 | 4.03 |
| 1900-01-01 00:31:08 | 4.03 |
| 1900-01-01 00:31:13 | 4.03 |
| 1900-01-01 00:31:18 | 4.03 |
| 1900-01-01 00:31:23 | 4.03 |
| 1900-01-01 00:31:28 | 4.03 |
| 1900-01-01 00:31:33 | 4.03 |
| 1900-01-01 00:31:38 | 4.03 |
| 1900-01-01 00:31:43 | 4.03 |
| 1900-01-01 00:31:48 | 4.03 |
| 1900-01-01 00:31:53 | 4.03 |
| 1900-01-01 00:31:58 | 4.03 |
| 1900-01-01 00:32:03 | 4.03 |
| 1900-01-01 00:32:08 | 4.03 |
| 1900-01-01 00:32:13 | 4.03 |
| 1900-01-01 00:32:18 | 4.03 |
| 1900-01-01 00:32:23 | 4.03 |
| 1900-01-01 00:32:28 | 4.03 |
| 1900-01-01 00:32:33 | 4.03 |
| 1900-01-01 00:32:38 | 4.03 |
| 1900-01-01 00:32:43 | 4.03 |
| 1900-01-01 00:32:48 | 4.03 |
| 1900-01-01 00:32:53 | 4.03 |
| 1900-01-01 00:32:58 | 4.03 |
| 1900-01-01 00:33:03 | 4.03 |
| 1900-01-01 00:33:08 | 4.03 |
| 1900-01-01 00:33:13 | 4.03 |
| 1900-01-01 00:33:18 | 4.03 |
| 1900-01-01 00:33:23 | 4.03 |
| 1900-01-01 00:33:28 | 4.03 |
| 1900-01-01 00:33:33 | 4.03 |
| 1900-01-01 00:33:38 | 4.03 |
| 1900-01-01 00:33:43 | 4.03 |
| 1900-01-01 00:33:48 | 4.03 |
| 1900-01-01 00:33:53 | 4.03 |
| 1900-01-01 00:33:58 | 4.03 |
| 1900-01-01 00:34:03 | 4.03 |
| 1900-01-01 00:34:08 | 4.03 |
| 1900-01-01 00:34:13 | 4.02 |
| 1900-01-01 00:34:18 | 4.03 |
| 1900-01-01 00:34:23 | 4.03 |
| 1900-01-01 00:34:28 | 4.03 |
| 1900-01-01 00:34:33 | 4.03 |
| 1900-01-01 00:34:38 | 4.03 |
| 1900-01-01 00:34:43 | 4.03 |
| 1900-01-01 00:34:48 | 4.03 |
| 1900-01-01 00:34:53 | 4.03 |
| 1900-01-01 00:34:58 | 4.03 |
| 1900-01-01 00:35:03 | 4.03 |
| 1900-01-01 00:35:08 | 4.03 |
| 1900-01-01 00:35:13 | 4.03 |
| 1900-01-01 00:35:18 | 4.03 |
| 1900-01-01 00:35:23 | 4.03 |
| 1900-01-01 00:35:28 | 4.03 |
| 1900-01-01 00:35:33 | 4.03 |
| 1900-01-01 00:35:38 | 4.03 |
| 1900-01-01 00:35:43 | 4.03 |
| 1900-01-01 00:35:48 | 4.03 |
| 1900-01-01 00:35:53 | 4.03 |
| 1900-01-01 00:35:58 | 4.03 |
| 1900-01-01 00:36:03 | 4.03 |
| 1900-01-01 00:36:08 | 4.03 |
| 1900-01-01 00:36:13 | 4.03 |
| 1900-01-01 00:36:18 | 4.03 |
| 1900-01-01 00:36:23 | 4.03 |
| 1900-01-01 00:36:28 | 4.03 |
| 1900-01-01 00:36:33 | 4.03 |
| 1900-01-01 00:36:38 | 4.03 |
| 1900-01-01 00:36:43 | 4.03 |
| 1900-01-01 00:36:48 | 4.03 |
| 1900-01-01 00:36:53 | 4.03 |
| 1900-01-01 00:36:58 | 4.02 |
| 1900-01-01 00:37:03 | 4.02 |
| 1900-01-01 00:37:08 | 4.02 |
| 1900-01-01 00:37:13 | 4.03 |
| 1900-01-01 00:37:18 | 4.03 |
| 1900-01-01 00:37:23 | 4.03 |
| 1900-01-01 00:37:28 | 4.02 |
| 1900-01-01 00:37:33 | 4.03 |
| 1900-01-01 00:37:38 | 4.03 |
| 1900-01-01 00:37:43 | 4.03 |
| 1900-01-01 00:37:48 | 4.03 |
| 1900-01-01 00:37:53 | 4.03 |
| 1900-01-01 00:37:58 | 4.03 |
| 1900-01-01 00:38:03 | 4.03 |
| 1900-01-01 00:38:08 | 4.03 |
| 1900-01-01 00:38:13 | 4.03 |
| 1900-01-01 00:38:18 | 4.02 |
| 1900-01-01 00:38:23 | 4.02 |
| 1900-01-01 00:38:28 | 4.03 |
| 1900-01-01 00:38:33 | 4.03 |
| 1900-01-01 00:38:38 | 4.02 |
| 1900-01-01 00:38:43 | 4.03 |
| 1900-01-01 00:38:48 | 4.03 |
| 1900-01-01 00:38:53 | 4.03 |
| 1900-01-01 00:38:58 | 4.03 |
| 1900-01-01 00:39:03 | 4.03 |
| 1900-01-01 00:39:08 | 4.03 |
| 1900-01-01 00:39:13 | 4.03 |
| 1900-01-01 00:39:18 | 4.03 |
| 1900-01-01 00:39:23 | 4.03 |
| 1900-01-01 00:39:28 | 4.03 |
| 1900-01-01 00:39:33 | 4.03 |
| 1900-01-01 00:39:38 | 4.03 |
| 1900-01-01 00:39:43 | 4.03 |
| 1900-01-01 00:39:48 | 4.03 |
| 1900-01-01 00:39:53 | 4.03 |
| 1900-01-01 00:39:58 | 4.03 |
| 1900-01-01 00:40:03 | 4.03 |
| 1900-01-01 00:40:08 | 4.03 |
| 1900-01-01 00:40:13 | 4.03 |
| 1900-01-01 00:40:18 | 4.03 |
| 1900-01-01 00:40:23 | 4.03 |
| 1900-01-01 00:40:28 | 4.03 |
| 1900-01-01 00:40:33 | 4.03 |
| 1900-01-01 00:40:38 | 4.03 |
| 1900-01-01 00:40:43 | 4.03 |
| 1900-01-01 00:40:48 | 4.03 |
| 1900-01-01 00:40:53 | 4.03 |
| 1900-01-01 00:40:58 | 4.03 |
| 1900-01-01 00:41:03 | 4.02 |
| 1900-01-01 00:41:08 | 4.03 |
| 1900-01-01 00:41:13 | 4.02 |
| 1900-01-01 00:41:18 | 4.03 |
| 1900-01-01 00:41:23 | 4.03 |
| 1900-01-01 00:41:28 | 4.03 |
| 1900-01-01 00:41:33 | 4.03 |
| 1900-01-01 00:41:38 | 4.03 |
| 1900-01-01 00:41:43 | 4.03 |
| 1900-01-01 00:41:48 | 4.03 |
| 1900-01-01 00:41:53 | 4.03 |
| 1900-01-01 00:41:58 | 4.02 |
| 1900-01-01 00:42:03 | 4.03 |
| 1900-01-01 00:42:08 | 4.03 |
| 1900-01-01 00:42:13 | 4.03 |
| 1900-01-01 00:42:18 | 4.03 |
| 1900-01-01 00:42:23 | 4.03 |
| 1900-01-01 00:42:28 | 4.03 |
| 1900-01-01 00:42:33 | 4.03 |
| 1900-01-01 00:42:38 | 4.03 |
| 1900-01-01 00:42:43 | 4.03 |
| 1900-01-01 00:42:48 | 4.02 |
| 1900-01-01 00:42:53 | 4.02 |
| 1900-01-01 00:42:58 | 4.02 |
| 1900-01-01 00:43:03 | 4.03 |
| 1900-01-01 00:43:08 | 4.02 |
| 1900-01-01 00:43:13 | 4.02 |
| 1900-01-01 00:43:18 | 4.02 |
| 1900-01-01 00:43:23 | 4.02 |
| 1900-01-01 00:43:28 | 4.02 |
| 1900-01-01 00:43:33 | 4.02 |
| 1900-01-01 00:43:38 | 4.02 |
| 1900-01-01 00:43:43 | 4.02 |
| 1900-01-01 00:43:48 | 4.02 |
| 1900-01-01 00:43:53 | 4.02 |
| 1900-01-01 00:43:58 | 4.02 |
| 1900-01-01 00:44:03 | 4.03 |
| 1900-01-01 00:44:08 | 4.03 |
| 1900-01-01 00:44:13 | 4.02 |
| 1900-01-01 00:44:18 | 4.03 |
| 1900-01-01 00:44:23 | 4.03 |
| 1900-01-01 00:44:28 | 4.03 |
| 1900-01-01 00:44:33 | 4.03 |
| 1900-01-01 00:44:38 | 4.02 |
| 1900-01-01 00:44:43 | 4.03 |
| 1900-01-01 00:44:48 | 4.03 |
| 1900-01-01 00:44:53 | 4.02 |
| 1900-01-01 00:44:58 | 4.03 |
| 1900-01-01 00:45:03 | 4.02 |
| 1900-01-01 00:45:08 | 4.03 |
| 1900-01-01 00:45:13 | 4.03 |
| 1900-01-01 00:45:18 | 4.03 |
| 1900-01-01 00:45:23 | 4.02 |
| 1900-01-01 00:45:28 | 4.02 |
| 1900-01-01 00:45:33 | 4.03 |
| 1900-01-01 00:45:38 | 4.03 |
| 1900-01-01 00:45:43 | 4.03 |
| 1900-01-01 00:45:48 | 4.02 |
| 1900-01-01 00:45:53 | 4.02 |
| 1900-01-01 00:45:58 | 4.02 |
| 1900-01-01 00:46:03 | 4.02 |
| 1900-01-01 00:46:08 | 4.02 |
| 1900-01-01 00:46:13 | 4.02 |
| 1900-01-01 00:46:18 | 4.02 |
| 1900-01-01 00:46:23 | 4.02 |
| 1900-01-01 00:46:28 | 4.02 |
| 1900-01-01 00:46:33 | 4.02 |
| 1900-01-01 00:46:38 | 4.02 |
| 1900-01-01 00:46:43 | 4.02 |
| 1900-01-01 00:46:48 | 4.02 |
| 1900-01-01 00:46:53 | 4.02 |
| 1900-01-01 00:46:58 | 4.03 |
| 1900-01-01 00:47:03 | 4.02 |
| 1900-01-01 00:47:08 | 4.02 |
| 1900-01-01 00:47:13 | 4.02 |
| 1900-01-01 00:47:18 | 4.03 |
| 1900-01-01 00:47:23 | 4.02 |
| 1900-01-01 00:47:28 | 4.02 |
| 1900-01-01 00:47:33 | 4.02 |
| 1900-01-01 00:47:38 | 4.02 |
| 1900-01-01 00:47:43 | 4.02 |
| 1900-01-01 00:47:48 | 4.02 |
| 1900-01-01 00:47:53 | 4.02 |
| 1900-01-01 00:47:58 | 4.02 |
| 1900-01-01 00:48:03 | 4.02 |
| 1900-01-01 00:48:08 | 4.02 |
| 1900-01-01 00:48:13 | 4.03 |
| 1900-01-01 00:48:18 | 4.02 |
| 1900-01-01 00:48:23 | 4.02 |
| 1900-01-01 00:48:28 | 4.02 |
| 1900-01-01 00:48:33 | 4.02 |
| 1900-01-01 00:48:38 | 4.03 |
| 1900-01-01 00:48:43 | 4.02 |
| 1900-01-01 00:48:48 | 4.03 |
| 1900-01-01 00:48:53 | 4.02 |
| 1900-01-01 00:48:58 | 4.02 |
| 1900-01-01 00:49:03 | 4.02 |
| 1900-01-01 00:49:08 | 4.02 |
| 1900-01-01 00:49:13 | 4.02 |
| 1900-01-01 00:49:18 | 4.02 |
| 1900-01-01 00:49:23 | 4.02 |
| 1900-01-01 00:49:28 | 4.02 |
| 1900-01-01 00:49:33 | 4.02 |
| 1900-01-01 00:49:38 | 4.02 |
| 1900-01-01 00:49:43 | 4.02 |
| 1900-01-01 00:49:48 | 4.02 |
| 1900-01-01 00:49:53 | 4.02 |
| 1900-01-01 00:49:58 | 4.02 |
| 1900-01-01 00:50:03 | 4.02 |
| 1900-01-01 00:50:08 | 4.02 |
| 1900-01-01 00:50:13 | 4.02 |
| 1900-01-01 00:50:18 | 4.02 |
| 1900-01-01 00:50:23 | 4.03 |
| 1900-01-01 00:50:28 | 4.02 |
| 1900-01-01 00:50:33 | 4.02 |
| 1900-01-01 00:50:38 | 4.02 |
| 1900-01-01 00:50:43 | 4.02 |
| 1900-01-01 00:50:48 | 4.02 |
| 1900-01-01 00:50:53 | 4.02 |
| 1900-01-01 00:50:58 | 4.02 |
| 1900-01-01 00:51:03 | 4.02 |
| 1900-01-01 00:51:08 | 4.02 |
| 1900-01-01 00:51:13 | 4.02 |
| 1900-01-01 00:51:18 | 4.02 |
| 1900-01-01 00:51:23 | 4.02 |
| 1900-01-01 00:51:28 | 4.02 |
| 1900-01-01 00:51:33 | 4.02 |
| 1900-01-01 00:51:38 | 4.02 |
| 1900-01-01 00:51:43 | 4.02 |
| 1900-01-01 00:51:48 | 4.02 |
| 1900-01-01 00:51:53 | 4.02 |
| 1900-01-01 00:51:58 | 4.02 |
| 1900-01-01 00:52:03 | 4.02 |
| 1900-01-01 00:52:08 | 4.02 |
| 1900-01-01 00:52:13 | 4.03 |
| 1900-01-01 00:52:18 | 4.02 |
| 1900-01-01 00:52:23 | 4.02 |
| 1900-01-01 00:52:28 | 4.02 |
| 1900-01-01 00:52:33 | 4.02 |
| 1900-01-01 00:52:38 | 4.02 |
| 1900-01-01 00:52:43 | 4.02 |
| 1900-01-01 00:52:48 | 4.02 |
| 1900-01-01 00:52:53 | 4.03 |
| 1900-01-01 00:52:58 | 4.02 |
| 1900-01-01 00:53:03 | 4.02 |
| 1900-01-01 00:53:08 | 4.02 |
| 1900-01-01 00:53:13 | 4.02 |
| 1900-01-01 00:53:18 | 4.02 |
| 1900-01-01 00:53:23 | 4.02 |
| 1900-01-01 00:53:28 | 4.02 |
| 1900-01-01 00:53:33 | 4.02 |
| 1900-01-01 00:53:38 | 4.02 |
| 1900-01-01 00:53:43 | 4.02 |
| 1900-01-01 00:53:48 | 4.02 |
| 1900-01-01 00:53:53 | 4.02 |
| 1900-01-01 00:53:58 | 4.02 |
| 1900-01-01 00:54:03 | 4.02 |
| 1900-01-01 00:54:08 | 4.02 |
| 1900-01-01 00:54:13 | 4.02 |
| 1900-01-01 00:54:18 | 4.02 |
| 1900-01-01 00:54:23 | 4.02 |
| 1900-01-01 00:54:28 | 4.02 |
| 1900-01-01 00:54:33 | 4.02 |
| 1900-01-01 00:54:38 | 4.02 |
| 1900-01-01 00:54:43 | 4.02 |
| 1900-01-01 00:54:48 | 4.02 |
| 1900-01-01 00:54:53 | 4.02 |
| 1900-01-01 00:54:58 | 4.02 |
| 1900-01-01 00:55:03 | 4.02 |
| 1900-01-01 00:55:08 | 4.02 |
| 1900-01-01 00:55:13 | 4.02 |
| 1900-01-01 00:55:18 | 4.02 |
| 1900-01-01 00:55:23 | 4.02 |
| 1900-01-01 00:55:28 | 4.02 |
| 1900-01-01 00:55:33 | 4.02 |
| 1900-01-01 00:55:38 | 4.02 |
| 1900-01-01 00:55:43 | 4.02 |
| 1900-01-01 00:55:48 | 4.02 |
| 1900-01-01 00:55:53 | 4.02 |
| 1900-01-01 00:55:58 | 4.02 |
| 1900-01-01 00:56:03 | 4.02 |
| 1900-01-01 00:56:08 | 4.02 |
| 1900-01-01 00:56:13 | 4.02 |
| 1900-01-01 00:56:18 | 4.02 |
| 1900-01-01 00:56:23 | 4.02 |
| 1900-01-01 00:56:28 | 4.02 |
| 1900-01-01 00:56:33 | 4.02 |
| 1900-01-01 00:56:38 | 4.02 |
| 1900-01-01 00:56:43 | 4.02 |
| 1900-01-01 00:56:48 | 4.02 |
| 1900-01-01 00:56:53 | 4.02 |
| 1900-01-01 00:56:58 | 4.02 |
| 1900-01-01 00:57:03 | 4.02 |
| 1900-01-01 00:57:08 | 4.02 |
| 1900-01-01 00:57:13 | 4.02 |
| 1900-01-01 00:57:18 | 4.02 |
| 1900-01-01 00:57:23 | 4.02 |
| 1900-01-01 00:57:28 | 4.02 |
| 1900-01-01 00:57:33 | 4.02 |
| 1900-01-01 00:57:38 | 4.02 |
| 1900-01-01 00:57:43 | 4.02 |
| 1900-01-01 00:57:48 | 4.02 |
| 1900-01-01 00:57:53 | 4.02 |
| 1900-01-01 00:57:58 | 4.02 |
| 1900-01-01 00:58:03 | 4.02 |
| 1900-01-01 00:58:08 | 4.02 |
| 1900-01-01 00:58:13 | 4.02 |
| 1900-01-01 00:58:18 | 4.02 |
| 1900-01-01 00:58:23 | 4.02 |
| 1900-01-01 00:58:28 | 4.02 |
| 1900-01-01 00:58:33 | 4.02 |
| 1900-01-01 00:58:38 | 4.02 |
| 1900-01-01 00:58:43 | 4.02 |
| 1900-01-01 00:58:48 | 4.02 |
| 1900-01-01 00:58:53 | 4.02 |
| 1900-01-01 00:58:58 | 4.02 |
| 1900-01-01 00:59:03 | 4.02 |
| 1900-01-01 00:59:08 | 4.02 |
| 1900-01-01 00:59:13 | 4.02 |
| 1900-01-01 00:59:18 | 4.02 |
| 1900-01-01 00:59:23 | 4.02 |
| 1900-01-01 00:59:28 | 4.02 |
| 1900-01-01 00:59:33 | 4.02 |
| 1900-01-01 00:59:38 | 4.02 |
| 1900-01-01 00:59:43 | 4.02 |
| 1900-01-01 00:59:48 | 4.02 |
| 1900-01-01 00:59:53 | 4.02 |
| 1900-01-01 00:59:58 | 4.02 |
| 1900-01-01 01:00:03 | 4.02 |
| 1900-01-01 01:00:08 | 4.02 |
| 1900-01-01 01:00:13 | 4.02 |
| 1900-01-01 01:00:18 | 4.02 |
| 1900-01-01 01:00:23 | 4.02 |
| 1900-01-01 01:00:28 | 4.01 |
| 1900-01-01 01:00:33 | 4.02 |
| 1900-01-01 01:00:38 | 4.02 |
| 1900-01-01 01:00:43 | 4.02 |
| 1900-01-01 01:00:48 | 4.02 |
| 1900-01-01 01:00:53 | 4.01 |
| 1900-01-01 01:00:58 | 4.02 |
| 1900-01-01 01:01:03 | 4.01 |
| 1900-01-01 01:01:08 | 4.01 |
| 1900-01-01 01:01:13 | 4.01 |
| 1900-01-01 01:01:18 | 4.02 |
| 1900-01-01 01:01:23 | 4.02 |
| 1900-01-01 01:01:28 | 4.01 |
| 1900-01-01 01:01:33 | 4.01 |
| 1900-01-01 01:01:38 | 4.02 |
| 1900-01-01 01:01:43 | 4.01 |
| 1900-01-01 01:01:48 | 4.02 |
| 1900-01-01 01:01:53 | 4.02 |
| 1900-01-01 01:01:58 | 4.01 |
| 1900-01-01 01:02:03 | 4.02 |
| 1900-01-01 01:02:08 | 4.02 |
| 1900-01-01 01:02:13 | 4.02 |
| 1900-01-01 01:02:18 | 4.02 |
| 1900-01-01 01:02:23 | 4.02 |
| 1900-01-01 01:02:28 | 4.02 |
| 1900-01-01 01:02:33 | 4.02 |
| 1900-01-01 01:02:38 | 4.02 |
| 1900-01-01 01:02:43 | 4.02 |
| 1900-01-01 01:02:48 | 4.02 |
| 1900-01-01 01:02:53 | 4.02 |
| 1900-01-01 01:02:58 | 4.02 |
| 1900-01-01 01:03:03 | 4.02 |
| 1900-01-01 01:03:08 | 4.02 |
| 1900-01-01 01:03:13 | 4.02 |
| 1900-01-01 01:03:18 | 4.01 |
| 1900-01-01 01:03:23 | 4.02 |
| 1900-01-01 01:03:28 | 4.02 |
| 1900-01-01 01:03:33 | 4.02 |
| 1900-01-01 01:03:38 | 4.02 |
| 1900-01-01 01:03:43 | 4.02 |
| 1900-01-01 01:03:48 | 4.02 |
| 1900-01-01 01:03:53 | 4.02 |
| 1900-01-01 01:03:58 | 4.02 |
| 1900-01-01 01:04:03 | 4.02 |
| 1900-01-01 01:04:08 | 4.02 |
| 1900-01-01 01:04:13 | 4.02 |
| 1900-01-01 01:04:18 | 4.02 |
| 1900-01-01 01:04:23 | 4.02 |
| 1900-01-01 01:04:28 | 4.02 |
| 1900-01-01 01:04:33 | 4.02 |
| 1900-01-01 01:04:38 | 4.02 |
| 1900-01-01 01:04:43 | 4.02 |
| 1900-01-01 01:04:48 | 4.02 |
| 1900-01-01 01:04:53 | 4.02 |
| 1900-01-01 01:04:58 | 4.02 |
| 1900-01-01 01:05:03 | 4.02 |
| 1900-01-01 01:05:08 | 4.02 |
| 1900-01-01 01:05:13 | 4.02 |
| 1900-01-01 01:05:18 | 4.02 |
| 1900-01-01 01:05:23 | 4.02 |
| 1900-01-01 01:05:28 | 4.02 |
| 1900-01-01 01:05:33 | 4.02 |
| 1900-01-01 01:05:38 | 4.02 |
| 1900-01-01 01:05:43 | 4.02 |
| 1900-01-01 01:05:48 | 4.02 |
| 1900-01-01 01:05:53 | 4.02 |
| 1900-01-01 01:05:58 | 4.02 |
| 1900-01-01 01:06:03 | 4.02 |
| 1900-01-01 01:06:08 | 4.02 |
| 1900-01-01 01:06:13 | 4.02 |
| 1900-01-01 01:06:18 | 4.02 |
| 1900-01-01 01:06:23 | 4.02 |
| 1900-01-01 01:06:28 | 4.01 |
| 1900-01-01 01:06:33 | 4.02 |
| 1900-01-01 01:06:38 | 4.02 |
| 1900-01-01 01:06:43 | 4.02 |
| 1900-01-01 01:06:48 | 4.02 |
| 1900-01-01 01:06:53 | 4.02 |
| 1900-01-01 01:06:58 | 4.02 |
| 1900-01-01 01:07:03 | 4.02 |
| 1900-01-01 01:07:08 | 4.02 |
| 1900-01-01 01:07:13 | 4.02 |
| 1900-01-01 01:07:18 | 4.02 |
| 1900-01-01 01:07:23 | 4.02 |
| 1900-01-01 01:07:28 | 4.02 |
| 1900-01-01 01:07:33 | 4.02 |
| 1900-01-01 01:07:38 | 4.02 |
| 1900-01-01 01:07:43 | 4.02 |
| 1900-01-01 01:07:48 | 4.02 |
| 1900-01-01 01:07:53 | 4.02 |
| 1900-01-01 01:07:58 | 4.02 |
| 1900-01-01 01:08:03 | 4.02 |
| 1900-01-01 01:08:08 | 4.02 |
| 1900-01-01 01:08:13 | 4.02 |
| 1900-01-01 01:08:18 | 4.02 |
| 1900-01-01 01:08:23 | 4.02 |
| 1900-01-01 01:08:28 | 4.02 |
| 1900-01-01 01:08:33 | 4.02 |
| 1900-01-01 01:08:38 | 4.01 |
| 1900-01-01 01:08:43 | 4.02 |
| 1900-01-01 01:08:48 | 4.02 |
| 1900-01-01 01:08:53 | 4.02 |
| 1900-01-01 01:08:58 | 4.02 |
| 1900-01-01 01:09:03 | 4.02 |
| 1900-01-01 01:09:08 | 4.02 |
| 1900-01-01 01:09:13 | 4.02 |
| 1900-01-01 01:09:18 | 4.02 |
| 1900-01-01 01:09:23 | 4.02 |
| 1900-01-01 01:09:28 | 4.02 |
| 1900-01-01 01:09:33 | 4.02 |
| 1900-01-01 01:09:38 | 4.02 |
| 1900-01-01 01:09:43 | 4.02 |
| 1900-01-01 01:09:48 | 4.02 |
| 1900-01-01 01:09:53 | 4.02 |
| 1900-01-01 01:09:58 | 4.02 |
| 1900-01-01 01:10:03 | 4.02 |
| 1900-01-01 01:10:08 | 4.02 |
| 1900-01-01 01:10:13 | 4.02 |
| 1900-01-01 01:10:18 | 4.02 |
| 1900-01-01 01:10:23 | 4.02 |
| 1900-01-01 01:10:28 | 4.02 |
| 1900-01-01 01:10:33 | 4.02 |
| 1900-01-01 01:10:38 | 4.02 |
| 1900-01-01 01:10:43 | 4.02 |
| 1900-01-01 01:10:48 | 4.02 |
| 1900-01-01 01:10:53 | 4.02 |
| 1900-01-01 01:10:58 | 4.02 |
| 1900-01-01 01:11:03 | 4.02 |
| 1900-01-01 01:11:08 | 4.02 |
| 1900-01-01 01:11:13 | 4.01 |
| 1900-01-01 01:11:18 | 4.01 |
| 1900-01-01 01:11:23 | 4.01 |
| 1900-01-01 01:11:28 | 4.02 |
| 1900-01-01 01:11:33 | 4.02 |
| 1900-01-01 01:11:38 | 4.02 |
| 1900-01-01 01:11:43 | 4.02 |
| 1900-01-01 01:11:48 | 4.02 |
| 1900-01-01 01:11:53 | 4.02 |
| 1900-01-01 01:11:58 | 4.02 |
| 1900-01-01 01:12:03 | 4.02 |
| 1900-01-01 01:12:08 | 4.02 |
| 1900-01-01 01:12:13 | 4.02 |
| 1900-01-01 01:12:18 | 4.01 |
| 1900-01-01 01:12:23 | 4.02 |
| 1900-01-01 01:12:28 | 4.02 |
| 1900-01-01 01:12:33 | 4.02 |
| 1900-01-01 01:12:38 | 4.02 |
| 1900-01-01 01:12:43 | 4.02 |
| 1900-01-01 01:12:48 | 4.02 |
| 1900-01-01 01:12:53 | 4.02 |
| 1900-01-01 01:12:58 | 4.02 |
| 1900-01-01 01:13:03 | 4.02 |
| 1900-01-01 01:13:08 | 4.02 |
| 1900-01-01 01:13:13 | 4.02 |
| 1900-01-01 01:13:18 | 4.02 |
| 1900-01-01 01:13:23 | 4.02 |
| 1900-01-01 01:13:28 | 4.01 |
| 1900-01-01 01:13:33 | 4.01 |
| 1900-01-01 01:13:38 | 4.01 |
| 1900-01-01 01:13:43 | 4.01 |
| 1900-01-01 01:13:48 | 4.01 |
| 1900-01-01 01:13:53 | 4.01 |
| 1900-01-01 01:13:58 | 4.02 |
| 1900-01-01 01:14:03 | 4.02 |
| 1900-01-01 01:14:08 | 4.02 |
| 1900-01-01 01:14:13 | 4.02 |
| 1900-01-01 01:14:18 | 4.02 |
| 1900-01-01 01:14:23 | 4.02 |
| 1900-01-01 01:14:28 | 4.02 |
| 1900-01-01 01:14:33 | 4.02 |
| 1900-01-01 01:14:38 | 4.02 |
| 1900-01-01 01:14:43 | 4.02 |
| 1900-01-01 01:14:48 | 4.02 |
| 1900-01-01 01:14:53 | 4.02 |
| 1900-01-01 01:14:58 | 4.02 |
| 1900-01-01 01:15:03 | 4.02 |
| 1900-01-01 01:15:08 | 4.02 |
| 1900-01-01 01:15:13 | 4.02 |
| 1900-01-01 01:15:18 | 4.02 |
| 1900-01-01 01:15:23 | 4.02 |
| 1900-01-01 01:15:28 | 4.02 |
| 1900-01-01 01:15:33 | 4.02 |
| 1900-01-01 01:15:38 | 4.02 |
| 1900-01-01 01:15:43 | 4.02 |
| 1900-01-01 01:15:48 | 4.02 |
| 1900-01-01 01:15:53 | 4.02 |
| 1900-01-01 01:15:58 | 4.02 |
| 1900-01-01 01:16:03 | 4.02 |
| 1900-01-01 01:16:08 | 4.02 |
| 1900-01-01 01:16:13 | 4.02 |
| 1900-01-01 01:16:18 | 4.02 |
| 1900-01-01 01:16:23 | 4.02 |
| 1900-01-01 01:16:28 | 4.02 |
| 1900-01-01 01:16:33 | 4.02 |
| 1900-01-01 01:16:38 | 4.02 |
| 1900-01-01 01:16:43 | 4.02 |
| 1900-01-01 01:16:48 | 4.02 |
| 1900-01-01 01:16:53 | 4.02 |
| 1900-01-01 01:16:58 | 4.02 |
| 1900-01-01 01:17:03 | 4.02 |
| 1900-01-01 01:17:08 | 4.02 |
| 1900-01-01 01:17:13 | 4.02 |
| 1900-01-01 01:17:18 | 4.02 |
| 1900-01-01 01:17:23 | 4.02 |
| 1900-01-01 01:17:28 | 4.02 |
| 1900-01-01 01:17:33 | 4.02 |
| 1900-01-01 01:17:38 | 4.02 |
| 1900-01-01 01:17:43 | 4.02 |
| 1900-01-01 01:17:48 | 4.02 |
| 1900-01-01 01:17:53 | 4.02 |
| 1900-01-01 01:17:58 | 4.02 |
| 1900-01-01 01:18:03 | 4.02 |
| 1900-01-01 01:18:08 | 4.02 |
| 1900-01-01 01:18:13 | 4.02 |
| 1900-01-01 01:18:18 | 4.02 |
| 1900-01-01 01:18:23 | 4.02 |
| 1900-01-01 01:18:28 | 4.02 |
| 1900-01-01 01:18:33 | 4.02 |
| 1900-01-01 01:18:38 | 4.02 |
| 1900-01-01 01:18:43 | 4.02 |
| 1900-01-01 01:18:48 | 4.02 |
| 1900-01-01 01:18:53 | 4.02 |
| 1900-01-01 01:18:58 | 4.02 |
| 1900-01-01 01:19:03 | 4.02 |
| 1900-01-01 01:19:08 | 4.02 |
| 1900-01-01 01:19:13 | 4.02 |
| 1900-01-01 01:19:18 | 4.02 |
| 1900-01-01 01:19:23 | 4.02 |
| 1900-01-01 01:19:28 | 4.02 |
| 1900-01-01 01:19:33 | 4.02 |
| 1900-01-01 01:19:38 | 4.02 |
| 1900-01-01 01:19:43 | 4.02 |
| 1900-01-01 01:19:48 | 4.02 |
| 1900-01-01 01:19:53 | 4.02 |
| 1900-01-01 01:19:58 | 4.02 |
| 1900-01-01 01:20:03 | 4.02 |
| 1900-01-01 01:20:08 | 4.02 |
| 1900-01-01 01:20:13 | 4.01 |
| 1900-01-01 01:20:18 | 4.01 |
| 1900-01-01 01:20:23 | 4.01 |
| 1900-01-01 01:20:28 | 4.01 |
| 1900-01-01 01:20:33 | 4.01 |
| 1900-01-01 01:20:38 | 4.01 |
| 1900-01-01 01:20:43 | 4.01 |
| 1900-01-01 01:20:48 | 4.01 |
| 1900-01-01 01:20:53 | 4.01 |
| 1900-01-01 01:20:58 | 4.01 |
| 1900-01-01 01:21:03 | 4.01 |
| 1900-01-01 01:21:08 | 4.01 |
| 1900-01-01 01:21:13 | 4.01 |
| 1900-01-01 01:21:18 | 4.01 |
| 1900-01-01 01:21:23 | 4.01 |
| 1900-01-01 01:21:28 | 4.02 |
| 1900-01-01 01:21:33 | 4.02 |
| 1900-01-01 01:21:38 | 4.02 |
| 1900-01-01 01:21:43 | 4.02 |
| 1900-01-01 01:21:48 | 4.02 |
| 1900-01-01 01:21:53 | 4.02 |
| 1900-01-01 01:21:58 | 4.02 |
| 1900-01-01 01:22:03 | 4.02 |
| 1900-01-01 01:22:08 | 4.02 |
| 1900-01-01 01:22:13 | 4.02 |
| 1900-01-01 01:22:18 | 4.02 |
| 1900-01-01 01:22:23 | 4.02 |
| 1900-01-01 01:22:28 | 4.02 |
| 1900-01-01 01:22:33 | 4.02 |
| 1900-01-01 01:22:38 | 4.02 |
| 1900-01-01 01:22:43 | 4.02 |
| 1900-01-01 01:22:48 | 4.02 |
| 1900-01-01 01:22:53 | 4.02 |
| 1900-01-01 01:22:58 | 4.02 |
| 1900-01-01 01:23:03 | 4.02 |
| 1900-01-01 01:23:08 | 4.02 |
| 1900-01-01 01:23:13 | 4.02 |
| 1900-01-01 01:23:18 | 4.02 |
| 1900-01-01 01:23:23 | 4.02 |
| 1900-01-01 01:23:28 | 4.02 |
| 1900-01-01 01:23:33 | 4.02 |
| 1900-01-01 01:23:38 | 4.02 |
| 1900-01-01 01:23:43 | 4.02 |
| 1900-01-01 01:23:48 | 4.02 |
| 1900-01-01 01:23:53 | 4.02 |
| 1900-01-01 01:23:58 | 4.02 |
| 1900-01-01 01:24:03 | 4.02 |
| 1900-01-01 01:24:08 | 4.02 |
| 1900-01-01 01:24:13 | 4.02 |
| 1900-01-01 01:24:18 | 4.02 |
| 1900-01-01 01:24:23 | 4.02 |
| 1900-01-01 01:24:28 | 4.02 |
| 1900-01-01 01:24:33 | 4.02 |
| 1900-01-01 01:24:38 | 4.02 |
| 1900-01-01 01:24:43 | 4.02 |
| 1900-01-01 01:24:48 | 4.02 |
| 1900-01-01 01:24:53 | 4.02 |
| 1900-01-01 01:24:58 | 4.02 |
| 1900-01-01 01:25:03 | 4.02 |
| 1900-01-01 01:25:08 | 4.02 |
| 1900-01-01 01:25:13 | 4.02 |
| 1900-01-01 01:25:18 | 4.02 |
| 1900-01-01 01:25:23 | 4.02 |
| 1900-01-01 01:25:28 | 4.02 |
| 1900-01-01 01:25:33 | 4.02 |
| 1900-01-01 01:25:38 | 4.02 |
| 1900-01-01 01:25:43 | 4.02 |
| 1900-01-01 01:25:48 | 4.02 |
| 1900-01-01 01:25:53 | 4.02 |
| 1900-01-01 01:25:58 | 4.02 |
| 1900-01-01 01:26:03 | 4.02 |
| 1900-01-01 01:26:08 | 4.02 |
| 1900-01-01 01:26:13 | 4.02 |
| 1900-01-01 01:26:18 | 4.02 |
| 1900-01-01 01:26:23 | 4.02 |
| 1900-01-01 01:26:28 | 4.02 |
| 1900-01-01 01:26:33 | 4.02 |
| 1900-01-01 01:26:38 | 4.02 |
| 1900-01-01 01:26:43 | 4.01 |
| 1900-01-01 01:26:48 | 4.01 |
| 1900-01-01 01:26:53 | 4.01 |
| 1900-01-01 01:26:58 | 4.02 |
| 1900-01-01 01:27:03 | 4.02 |
| 1900-01-01 01:27:08 | 4.01 |
| 1900-01-01 01:27:13 | 4.02 |
| 1900-01-01 01:27:18 | 4.02 |
| 1900-01-01 01:27:23 | 4.02 |
| 1900-01-01 01:27:28 | 4.02 |
| 1900-01-01 01:27:33 | 4.02 |
| 1900-01-01 01:27:38 | 4.02 |
| 1900-01-01 01:27:43 | 4.02 |
| 1900-01-01 01:27:48 | 4.02 |
| 1900-01-01 01:27:53 | 4.02 |
| 1900-01-01 01:27:58 | 4.02 |
| 1900-01-01 01:28:03 | 4.02 |
| 1900-01-01 01:28:08 | 4.02 |
| 1900-01-01 01:28:13 | 4.02 |
| 1900-01-01 01:28:18 | 4.02 |
| 1900-01-01 01:28:23 | 4.02 |
| 1900-01-01 01:28:28 | 4.02 |
| 1900-01-01 01:28:33 | 4.02 |
| 1900-01-01 01:28:38 | 4.02 |
| 1900-01-01 01:28:43 | 4.02 |
| 1900-01-01 01:28:48 | 4.02 |
| 1900-01-01 01:28:53 | 4.02 |
| 1900-01-01 01:28:58 | 4.02 |
| 1900-01-01 01:29:03 | 4.02 |
| 1900-01-01 01:29:08 | 4.02 |
| 1900-01-01 01:29:13 | 4.02 |
| 1900-01-01 01:29:18 | 4.02 |
| 1900-01-01 01:29:23 | 4.02 |
| 1900-01-01 01:29:28 | 4.02 |
| 1900-01-01 01:29:33 | 4.02 |
| 1900-01-01 01:29:38 | 4.02 |
| 1900-01-01 01:29:43 | 4.02 |
| 1900-01-01 01:29:48 | 4.02 |
| 1900-01-01 01:29:53 | 4.02 |
| 1900-01-01 01:29:58 | 4.02 |
| 1900-01-01 01:30:03 | 4.02 |
| 1900-01-01 01:30:08 | 4.02 |
| 1900-01-01 01:30:13 | 4.02 |
| 1900-01-01 01:30:18 | 4.02 |
| 1900-01-01 01:30:23 | 4.02 |
| 1900-01-01 01:30:28 | 4.01 |
| 1900-01-01 01:30:33 | 4.01 |
| 1900-01-01 01:30:38 | 4.01 |
| 1900-01-01 01:30:43 | 4.01 |
| 1900-01-01 01:30:48 | 4.01 |
| 1900-01-01 01:30:53 | 4.01 |
| 1900-01-01 01:30:58 | 4.01 |
| 1900-01-01 01:31:03 | 4.02 |
| 1900-01-01 01:31:08 | 4.02 |
| 1900-01-01 01:31:13 | 4.02 |
| 1900-01-01 01:31:18 | 4.02 |
| 1900-01-01 01:31:23 | 4.02 |
| 1900-01-01 01:31:28 | 4.02 |
| 1900-01-01 01:31:33 | 4.02 |
| 1900-01-01 01:31:38 | 4.01 |
| 1900-01-01 01:31:43 | 4.02 |
| 1900-01-01 01:31:48 | 4.02 |
| 1900-01-01 01:31:53 | 4.01 |
| 1900-01-01 01:31:58 | 4.02 |
| 1900-01-01 01:32:03 | 4.02 |
| 1900-01-01 01:32:08 | 4.02 |
| 1900-01-01 01:32:13 | 4.02 |
| 1900-01-01 01:32:18 | 4.02 |
| 1900-01-01 01:32:23 | 4.02 |
| 1900-01-01 01:32:28 | 4.02 |
| 1900-01-01 01:32:33 | 4.02 |
| 1900-01-01 01:32:38 | 4.02 |
| 1900-01-01 01:32:43 | 4.02 |
| 1900-01-01 01:32:48 | 4.02 |
| 1900-01-01 01:32:53 | 4.02 |
| 1900-01-01 01:32:58 | 4.02 |
| 1900-01-01 01:33:03 | 4.02 |
| 1900-01-01 01:33:08 | 4.02 |
| 1900-01-01 01:33:13 | 4.02 |
| 1900-01-01 01:33:18 | 4.02 |
| 1900-01-01 01:33:23 | 4.02 |
| 1900-01-01 01:33:28 | 4.02 |
| 1900-01-01 01:33:33 | 4.02 |
| 1900-01-01 01:33:38 | 4.02 |
| 1900-01-01 01:33:43 | 4.02 |
| 1900-01-01 01:33:48 | 4.02 |
| 1900-01-01 01:33:53 | 4.02 |
| 1900-01-01 01:33:58 | 4.02 |
| 1900-01-01 01:34:03 | 4.02 |
| 1900-01-01 01:34:08 | 4.02 |
| 1900-01-01 01:34:13 | 4.02 |
| 1900-01-01 01:34:18 | 4.02 |
| 1900-01-01 01:34:23 | 4.02 |
| 1900-01-01 01:34:28 | 4.02 |
| 1900-01-01 01:34:33 | 4.02 |
| 1900-01-01 01:34:38 | 4.02 |
| 1900-01-01 01:34:43 | 4.02 |
| 1900-01-01 01:34:48 | 4.02 |
| 1900-01-01 01:34:53 | 4.02 |
| 1900-01-01 01:34:58 | 4.02 |
| 1900-01-01 01:35:03 | 4.02 |
| 1900-01-01 01:35:08 | 4.02 |
| 1900-01-01 01:35:13 | 4.02 |
| 1900-01-01 01:35:18 | 4.02 |
| 1900-01-01 01:35:23 | 4.02 |
| 1900-01-01 01:35:28 | 4.02 |
| 1900-01-01 01:35:33 | 4.02 |
| 1900-01-01 01:35:38 | 4.01 |
| 1900-01-01 01:35:43 | 4.02 |
| 1900-01-01 01:35:48 | 4.02 |
| 1900-01-01 01:35:53 | 4.02 |
| 1900-01-01 01:35:58 | 4.02 |
| 1900-01-01 01:36:03 | 4.02 |
| 1900-01-01 01:36:08 | 4.02 |
| 1900-01-01 01:36:13 | 4.02 |
| 1900-01-01 01:36:18 | 4.02 |
| 1900-01-01 01:36:23 | 4.02 |
| 1900-01-01 01:36:28 | 4.02 |
| 1900-01-01 01:36:33 | 4.02 |
| 1900-01-01 01:36:38 | 4.02 |
| 1900-01-01 01:36:43 | 4.02 |
| 1900-01-01 01:36:48 | 4.02 |
| 1900-01-01 01:36:53 | 4.02 |
| 1900-01-01 01:36:58 | 4.02 |
| 1900-01-01 01:37:03 | 4.02 |
| 1900-01-01 01:37:08 | 4.02 |
| 1900-01-01 01:37:13 | 4.02 |
| 1900-01-01 01:37:18 | 4.02 |
| 1900-01-01 01:37:23 | 4.02 |
| 1900-01-01 01:37:28 | 4.02 |
| 1900-01-01 01:37:33 | 4.02 |
| 1900-01-01 01:37:38 | 4.02 |
| 1900-01-01 01:37:43 | 4.02 |
| 1900-01-01 01:37:48 | 4.02 |
| 1900-01-01 01:37:53 | 4.02 |
| 1900-01-01 01:37:58 | 4.02 |
| 1900-01-01 01:38:03 | 4.02 |
| 1900-01-01 01:38:08 | 4.01 |
| 1900-01-01 01:38:13 | 4.02 |
| 1900-01-01 01:38:18 | 4.02 |
| 1900-01-01 01:38:23 | 4.02 |
| 1900-01-01 01:38:28 | 4.02 |
| 1900-01-01 01:38:33 | 4.02 |
| 1900-01-01 01:38:38 | 4.02 |
| 1900-01-01 01:38:43 | 4.02 |
| 1900-01-01 01:38:48 | 4.02 |
| 1900-01-01 01:38:53 | 4.02 |
| 1900-01-01 01:38:58 | 4.02 |
| 1900-01-01 01:39:03 | 4.02 |
| 1900-01-01 01:39:08 | 4.02 |
| 1900-01-01 01:39:13 | 4.02 |
| 1900-01-01 01:39:18 | 4.02 |
| 1900-01-01 01:39:23 | 4.02 |
| 1900-01-01 01:39:28 | 4.02 |
| 1900-01-01 01:39:33 | 4.02 |
| 1900-01-01 01:39:38 | 4.02 |
| 1900-01-01 01:39:43 | 4.02 |
| 1900-01-01 01:39:48 | 4.02 |
| 1900-01-01 01:39:53 | 4.02 |
| 1900-01-01 01:39:58 | 4.02 |
| 1900-01-01 01:40:03 | 4.02 |
| 1900-01-01 01:40:08 | 4.02 |
| 1900-01-01 01:40:13 | 4.02 |
| 1900-01-01 01:40:18 | 4.02 |
| 1900-01-01 01:40:23 | 4.01 |
| 1900-01-01 01:40:28 | 4.02 |
| 1900-01-01 01:40:33 | 4.02 |
| 1900-01-01 01:40:38 | 4.02 |
| 1900-01-01 01:40:43 | 4.02 |
| 1900-01-01 01:40:48 | 4.02 |
| 1900-01-01 01:40:53 | 4.02 |
| 1900-01-01 01:40:58 | 4.01 |
| 1900-01-01 01:41:03 | 4.02 |
| 1900-01-01 01:41:08 | 4.02 |
| 1900-01-01 01:41:13 | 4.02 |
| 1900-01-01 01:41:18 | 4.01 |
| 1900-01-01 01:41:23 | 4.01 |
| 1900-01-01 01:41:28 | 4.02 |
| 1900-01-01 01:41:33 | 4.02 |
| 1900-01-01 01:41:38 | 4.02 |
| 1900-01-01 01:41:43 | 4.02 |
| 1900-01-01 01:41:48 | 4.02 |
| 1900-01-01 01:41:53 | 4.02 |
| 1900-01-01 01:41:58 | 4.02 |
| 1900-01-01 01:42:03 | 4.01 |
| 1900-01-01 01:42:08 | 4.02 |
| 1900-01-01 01:42:13 | 4.01 |
| 1900-01-01 01:42:18 | 4.02 |
| 1900-01-01 01:42:23 | 4.02 |
| 1900-01-01 01:42:28 | 4.02 |
| 1900-01-01 01:42:33 | 4.02 |
| 1900-01-01 01:42:38 | 4.02 |
| 1900-01-01 01:42:43 | 4.02 |
| 1900-01-01 01:42:48 | 4.02 |
| 1900-01-01 01:42:53 | 4.01 |
| 1900-01-01 01:42:58 | 4.02 |
| 1900-01-01 01:43:03 | 4.01 |
| 1900-01-01 01:43:08 | 4.02 |
| 1900-01-01 01:43:13 | 4.02 |
| 1900-01-01 01:43:18 | 4.01 |
| 1900-01-01 01:43:23 | 4.02 |
| 1900-01-01 01:43:28 | 4.01 |
| 1900-01-01 01:43:33 | 4.02 |
| 1900-01-01 01:43:38 | 4.01 |
| 1900-01-01 01:43:43 | 4.02 |
| 1900-01-01 01:43:48 | 4.02 |
| 1900-01-01 01:43:53 | 4.01 |
| 1900-01-01 01:43:58 | 4 |
| 1900-01-01 01:44:03 | 4.02 |
| 1900-01-01 01:44:08 | 4.02 |
| 1900-01-01 01:44:13 | 4 |
| 1900-01-01 01:44:18 | 4 |
| 1900-01-01 01:44:23 | 4.01 |
| 1900-01-01 01:44:28 | 4 |
| 1900-01-01 01:44:33 | 4 |
| 1900-01-01 01:44:38 | 4 |
| 1900-01-01 01:44:43 | 4 |
| 1900-01-01 01:44:48 | 4.02 |
| 1900-01-01 01:44:53 | 4.01 |
| 1900-01-01 01:44:58 | 4.02 |
| 1900-01-01 01:45:03 | 4.02 |
| 1900-01-01 01:45:08 | 4.02 |
| 1900-01-01 01:45:13 | 4.01 |
| 1900-01-01 01:45:18 | 4.01 |
| 1900-01-01 01:45:23 | 4.01 |
| 1900-01-01 01:45:28 | 4.02 |
| 1900-01-01 01:45:33 | 4.01 |
| 1900-01-01 01:45:38 | 4.01 |
| 1900-01-01 01:45:43 | 4.01 |
| 1900-01-01 01:45:48 | 4.01 |
| 1900-01-01 01:45:53 | 4.01 |
| 1900-01-01 01:45:58 | 4.01 |
| 1900-01-01 01:46:03 | 4.01 |
| 1900-01-01 01:46:08 | 4.01 |
| 1900-01-01 01:46:13 | 4.01 |
| 1900-01-01 01:46:18 | 4.01 |
| 1900-01-01 01:46:23 | 4.01 |
| 1900-01-01 01:46:28 | 4.02 |
| 1900-01-01 01:46:33 | 4.01 |
| 1900-01-01 01:46:38 | 4.01 |
| 1900-01-01 01:46:43 | 4.01 |
| 1900-01-01 01:46:48 | 4.01 |
| 1900-01-01 01:46:53 | 4.02 |
| 1900-01-01 01:46:58 | 4.01 |
| 1900-01-01 01:47:03 | 4.02 |
| 1900-01-01 01:47:08 | 4.01 |
| 1900-01-01 01:47:13 | 4.01 |
| 1900-01-01 01:47:18 | 4.02 |
| 1900-01-01 01:47:23 | 4.01 |
| 1900-01-01 01:47:28 | 4.01 |
| 1900-01-01 01:47:33 | 4.01 |
| 1900-01-01 01:47:38 | 4.01 |
| 1900-01-01 01:47:43 | 4.01 |
| 1900-01-01 01:47:48 | 4.01 |
| 1900-01-01 01:47:53 | 4.01 |
| 1900-01-01 01:47:58 | 4.02 |
| 1900-01-01 01:48:03 | 4.01 |
| 1900-01-01 01:48:08 | 4.02 |
| 1900-01-01 01:48:13 | 4.02 |
| 1900-01-01 01:48:18 | 4.01 |
| 1900-01-01 01:48:23 | 4.01 |
| 1900-01-01 01:48:28 | 4.02 |
| 1900-01-01 01:48:33 | 4.01 |
| 1900-01-01 01:48:38 | 4.02 |
| 1900-01-01 01:48:43 | 4.01 |
| 1900-01-01 01:48:48 | 4.01 |
| 1900-01-01 01:48:53 | 4.02 |
| 1900-01-01 01:48:58 | 4.01 |
| 1900-01-01 01:49:03 | 4.01 |
| 1900-01-01 01:49:08 | 4.01 |
| 1900-01-01 01:49:13 | 4.01 |
| 1900-01-01 01:49:18 | 4.01 |
| 1900-01-01 01:49:23 | 4.01 |
| 1900-01-01 01:49:28 | 4.02 |
| 1900-01-01 01:49:33 | 4.02 |
| 1900-01-01 01:49:38 | 4.01 |
| 1900-01-01 01:49:43 | 4.01 |
| 1900-01-01 01:49:48 | 4.02 |
| 1900-01-01 01:49:53 | 4.01 |
| 1900-01-01 01:49:58 | 4.01 |
| 1900-01-01 01:50:03 | 4.01 |
| 1900-01-01 01:50:08 | 4.01 |
| 1900-01-01 01:50:13 | 4.01 |
| 1900-01-01 01:50:18 | 4.01 |
| 1900-01-01 01:50:23 | 4.02 |
| 1900-01-01 01:50:28 | 4.01 |
| 1900-01-01 01:50:33 | 4.01 |
| 1900-01-01 01:50:38 | 4.02 |
| 1900-01-01 01:50:43 | 4.01 |
| 1900-01-01 01:50:48 | 4.01 |
| 1900-01-01 01:50:53 | 4.01 |
| 1900-01-01 01:50:58 | 4.01 |
| 1900-01-01 01:51:03 | 4.01 |
| 1900-01-01 01:51:08 | 4.01 |
| 1900-01-01 01:51:13 | 4.01 |
| 1900-01-01 01:51:18 | 4.01 |
| 1900-01-01 01:51:23 | 4.01 |
| 1900-01-01 01:51:28 | 4.01 |
| 1900-01-01 01:51:33 | 4.01 |
| 1900-01-01 01:51:38 | 4.01 |
| 1900-01-01 01:51:43 | 4.01 |
| 1900-01-01 01:51:48 | 4.01 |
| 1900-01-01 01:51:53 | 4.01 |
| 1900-01-01 01:51:58 | 4.01 |
| 1900-01-01 01:52:03 | 4.02 |
| 1900-01-01 01:52:08 | 4.01 |
| 1900-01-01 01:52:13 | 4.01 |
| 1900-01-01 01:52:18 | 4.01 |
| 1900-01-01 01:52:23 | 4.02 |
| 1900-01-01 01:52:28 | 4.01 |
| 1900-01-01 01:52:33 | 4.01 |
| 1900-01-01 01:52:38 | 4.01 |
| 1900-01-01 01:52:43 | 4.01 |
| 1900-01-01 01:52:48 | 4.01 |
| 1900-01-01 01:52:53 | 4.01 |
| 1900-01-01 01:52:58 | 4.01 |
| 1900-01-01 01:53:03 | 4.01 |
| 1900-01-01 01:53:08 | 4.01 |
| 1900-01-01 01:53:13 | 4.01 |
| 1900-01-01 01:53:18 | 4.01 |
| 1900-01-01 01:53:23 | 4.01 |
| 1900-01-01 01:53:28 | 4.01 |
| 1900-01-01 01:53:33 | 4.01 |
| 1900-01-01 01:53:38 | 4.01 |
| 1900-01-01 01:53:43 | 4.01 |
| 1900-01-01 01:53:48 | 4.01 |
| 1900-01-01 01:53:53 | 4.01 |
| 1900-01-01 01:53:58 | 4.01 |
| 1900-01-01 01:54:03 | 4.01 |
| 1900-01-01 01:54:08 | 4.01 |
| 1900-01-01 01:54:13 | 4.01 |
| 1900-01-01 01:54:18 | 4.01 |
| 1900-01-01 01:54:23 | 4.01 |
| 1900-01-01 01:54:28 | 4.01 |
| 1900-01-01 01:54:33 | 4.01 |
| 1900-01-01 01:54:38 | 4.01 |
| 1900-01-01 01:54:43 | 4.01 |
| 1900-01-01 01:54:48 | 4.01 |
| 1900-01-01 01:54:53 | 4.01 |
| 1900-01-01 01:54:58 | 4.01 |
| 1900-01-01 01:55:03 | 4.01 |
| 1900-01-01 01:55:08 | 4.01 |
| 1900-01-01 01:55:13 | 4.01 |
| 1900-01-01 01:55:18 | 4.01 |
| 1900-01-01 01:55:23 | 4.01 |
| 1900-01-01 01:55:28 | 4.01 |
| 1900-01-01 01:55:33 | 4.01 |
| 1900-01-01 01:55:38 | 4.01 |
| 1900-01-01 01:55:43 | 4.01 |
| 1900-01-01 01:55:48 | 4.01 |
| 1900-01-01 01:55:53 | 4.01 |
| 1900-01-01 01:55:58 | 4.01 |
| 1900-01-01 01:56:03 | 4 |
| 1900-01-01 01:56:08 | 4 |
| 1900-01-01 01:56:13 | 4 |
| 1900-01-01 01:56:18 | 4 |
| 1900-01-01 01:56:23 | 4 |
| 1900-01-01 01:56:28 | 4 |
| 1900-01-01 01:56:33 | 4 |
| 1900-01-01 01:56:38 | 4.01 |
| 1900-01-01 01:56:43 | 4.01 |
| 1900-01-01 01:56:48 | 4.01 |
| 1900-01-01 01:56:53 | 4.01 |
| 1900-01-01 01:56:58 | 4.01 |
| 1900-01-01 01:57:03 | 4.01 |
| 1900-01-01 01:57:08 | 4.01 |
| 1900-01-01 01:57:13 | 4.01 |
| 1900-01-01 01:57:18 | 4.01 |
| 1900-01-01 01:57:23 | 4.01 |
| 1900-01-01 01:57:28 | 4 |
| 1900-01-01 01:57:33 | 4 |
| 1900-01-01 01:57:38 | 4 |
| 1900-01-01 01:57:43 | 4 |
| 1900-01-01 01:57:48 | 4 |
| 1900-01-01 01:57:53 | 4 |
| 1900-01-01 01:57:58 | 4 |
| 1900-01-01 01:58:03 | 4 |
| 1900-01-01 01:58:08 | 4 |
| 1900-01-01 01:58:13 | 4.01 |
| 1900-01-01 01:58:18 | 4.01 |
| 1900-01-01 01:58:23 | 4.01 |
| 1900-01-01 01:58:28 | 4.01 |
| 1900-01-01 01:58:33 | 4.01 |
| 1900-01-01 01:58:38 | 4.01 |
| 1900-01-01 01:58:43 | 4.01 |
| 1900-01-01 01:58:48 | 4.01 |
| 1900-01-01 01:58:53 | 4.01 |
| 1900-01-01 01:58:58 | 4.01 |
| 1900-01-01 01:59:03 | 4.01 |
| 1900-01-01 01:59:08 | 4.01 |
| 1900-01-01 01:59:13 | 4.01 |
| 1900-01-01 01:59:18 | 4.01 |
| 1900-01-01 01:59:23 | 4.01 |
| 1900-01-01 01:59:28 | 4.01 |
| 1900-01-01 01:59:33 | 4.01 |
| 1900-01-01 01:59:38 | 4.01 |
| 1900-01-01 01:59:43 | 4.01 |
| 1900-01-01 01:59:48 | 4.01 |
| 1900-01-01 01:59:53 | 4.01 |
| 1900-01-01 01:59:58 | 4.01 |
| 1900-01-01 02:00:03 | 4.01 |
| 1900-01-01 02:00:08 | 4.01 |
| 1900-01-01 02:00:13 | 4.01 |
| 1900-01-01 02:00:18 | 4.01 |
| 1900-01-01 02:00:23 | 4.01 |
| 1900-01-01 02:00:28 | 4.01 |
| 1900-01-01 02:00:33 | 4.01 |
| 1900-01-01 02:00:38 | 4.01 |
| 1900-01-01 02:00:43 | 4.01 |
| 1900-01-01 02:00:48 | 4.01 |
| 1900-01-01 02:00:53 | 4.01 |
| 1900-01-01 02:00:58 | 4.01 |
| 1900-01-01 02:01:03 | 4.01 |
| 1900-01-01 02:01:08 | 4.01 |
| 1900-01-01 02:01:13 | 4.01 |
| 1900-01-01 02:01:18 | 4.01 |
| 1900-01-01 02:01:23 | 4.01 |
| 1900-01-01 02:01:28 | 4.01 |
| 1900-01-01 02:01:33 | 4.01 |
| 1900-01-01 02:01:38 | 4.01 |
| 1900-01-01 02:01:43 | 4.01 |
| 1900-01-01 02:01:48 | 4.01 |
| 1900-01-01 02:01:53 | 4.01 |
| 1900-01-01 02:01:58 | 4.01 |
| 1900-01-01 02:02:03 | 4.01 |
| 1900-01-01 02:02:08 | 4.01 |
| 1900-01-01 02:02:13 | 4 |
| 1900-01-01 02:02:18 | 4 |
| 1900-01-01 02:02:23 | 4 |
| 1900-01-01 02:02:28 | 4 |
| 1900-01-01 02:02:33 | 4 |
| 1900-01-01 02:02:38 | 4 |
| 1900-01-01 02:02:43 | 4 |
| 1900-01-01 02:02:48 | 4 |
| 1900-01-01 02:02:53 | 4 |
| 1900-01-01 02:02:58 | 4.01 |
| 1900-01-01 02:03:03 | 4 |
| 1900-01-01 02:03:08 | 4.01 |
| 1900-01-01 02:03:13 | 4.01 |
| 1900-01-01 02:03:18 | 4 |
| 1900-01-01 02:03:23 | 4.01 |
| 1900-01-01 02:03:28 | 4.01 |
| 1900-01-01 02:03:33 | 4.01 |
| 1900-01-01 02:03:38 | 4.01 |
| 1900-01-01 02:03:43 | 4.01 |
| 1900-01-01 02:03:48 | 4.01 |
| 1900-01-01 02:03:53 | 4.01 |
| 1900-01-01 02:03:58 | 4.01 |
| 1900-01-01 02:04:03 | 4.01 |
| 1900-01-01 02:04:08 | 4.01 |
| 1900-01-01 02:04:13 | 4.01 |
| 1900-01-01 02:04:18 | 4.01 |
| 1900-01-01 02:04:23 | 4.01 |
| 1900-01-01 02:04:28 | 4.01 |
| 1900-01-01 02:04:33 | 4.01 |
| 1900-01-01 02:04:38 | 4.01 |
| 1900-01-01 02:04:43 | 4.01 |
| 1900-01-01 02:04:48 | 4.01 |
| 1900-01-01 02:04:53 | 4.01 |
| 1900-01-01 02:04:58 | 4.01 |
| 1900-01-01 02:05:03 | 4.01 |
| 1900-01-01 02:05:08 | 4.01 |
| 1900-01-01 02:05:13 | 4.01 |
| 1900-01-01 02:05:18 | 4.01 |
| 1900-01-01 02:05:23 | 4.01 |
| 1900-01-01 02:05:28 | 4.01 |
| 1900-01-01 02:05:33 | 4.01 |
| 1900-01-01 02:05:38 | 4.01 |
| 1900-01-01 02:05:43 | 4.01 |
| 1900-01-01 02:05:48 | 4.01 |
| 1900-01-01 02:05:53 | 4.01 |
| 1900-01-01 02:05:58 | 4.01 |
| 1900-01-01 02:06:03 | 4.01 |
| 1900-01-01 02:06:08 | 4.01 |
| 1900-01-01 02:06:13 | 4.01 |
| 1900-01-01 02:06:18 | 4.01 |
| 1900-01-01 02:06:23 | 4.01 |
| 1900-01-01 02:06:28 | 4.01 |
| 1900-01-01 02:06:33 | 4.01 |
| 1900-01-01 02:06:38 | 4.01 |
| 1900-01-01 02:06:43 | 4.01 |
| 1900-01-01 02:06:48 | 4.01 |
| 1900-01-01 02:06:53 | 4.01 |
| 1900-01-01 02:06:58 | 4.01 |
| 1900-01-01 02:07:03 | 4.01 |
| 1900-01-01 02:07:08 | 4.01 |
| 1900-01-01 02:07:13 | 4.01 |
| 1900-01-01 02:07:18 | 4.01 |
| 1900-01-01 02:07:23 | 4.01 |
| 1900-01-01 02:07:28 | 4.01 |
| 1900-01-01 02:07:33 | 4.01 |
| 1900-01-01 02:07:38 | 4.01 |
| 1900-01-01 02:07:43 | 4.01 |
| 1900-01-01 02:07:48 | 4.01 |
| 1900-01-01 02:07:53 | 4.01 |
| 1900-01-01 02:07:58 | 4.01 |
| 1900-01-01 02:08:03 | 4.01 |
| 1900-01-01 02:08:08 | 4.01 |
| 1900-01-01 02:08:13 | 4.01 |
| 1900-01-01 02:08:18 | 4 |
| 1900-01-01 02:08:23 | 4.01 |
| 1900-01-01 02:08:28 | 4 |
| 1900-01-01 02:08:33 | 4 |
| 1900-01-01 02:08:38 | 4.01 |
| 1900-01-01 02:08:43 | 4.01 |
| 1900-01-01 02:08:48 | 4.01 |
| 1900-01-01 02:08:53 | 4.01 |
| 1900-01-01 02:08:58 | 4.01 |
| 1900-01-01 02:09:03 | 4.01 |
| 1900-01-01 02:09:08 | 4.01 |
| 1900-01-01 02:09:13 | 4.01 |
| 1900-01-01 02:09:18 | 4.01 |
| 1900-01-01 02:09:23 | 4.01 |
| 1900-01-01 02:09:28 | 4.01 |
| 1900-01-01 02:09:33 | 4.01 |
| 1900-01-01 02:09:38 | 4.01 |
| 1900-01-01 02:09:43 | 4.01 |
| 1900-01-01 02:09:48 | 4.01 |
| 1900-01-01 02:09:53 | 4.01 |
| 1900-01-01 02:09:58 | 4 |
| 1900-01-01 02:10:03 | 4 |
| 1900-01-01 02:10:08 | 4 |
| 1900-01-01 02:10:13 | 4 |
| 1900-01-01 02:10:18 | 4 |
| 1900-01-01 02:10:23 | 4 |
| 1900-01-01 02:10:28 | 4.01 |
| 1900-01-01 02:10:33 | 4.01 |
| 1900-01-01 02:10:38 | 4 |
| 1900-01-01 02:10:43 | 4.01 |
| 1900-01-01 02:10:48 | 4.01 |
| 1900-01-01 02:10:53 | 4.01 |
| 1900-01-01 02:10:58 | 4.01 |
| 1900-01-01 02:11:03 | 4.01 |
| 1900-01-01 02:11:08 | 4.01 |
| 1900-01-01 02:11:13 | 4.01 |
| 1900-01-01 02:11:18 | 4.01 |
| 1900-01-01 02:11:23 | 4.01 |
| 1900-01-01 02:11:28 | 4.01 |
| 1900-01-01 02:11:33 | 4.01 |
| 1900-01-01 02:11:38 | 4.01 |
| 1900-01-01 02:11:43 | 4.01 |
| 1900-01-01 02:11:48 | 4.01 |
| 1900-01-01 02:11:53 | 4.01 |
| 1900-01-01 02:11:58 | 4.01 |
| 1900-01-01 02:12:03 | 4.01 |
| 1900-01-01 02:12:08 | 4.01 |
| 1900-01-01 02:12:13 | 4.01 |
| 1900-01-01 02:12:18 | 4.01 |
| 1900-01-01 02:12:23 | 4.01 |
| 1900-01-01 02:12:28 | 4.01 |
| 1900-01-01 02:12:33 | 4.01 |
| 1900-01-01 02:12:38 | 4.01 |
| 1900-01-01 02:12:43 | 4.01 |
| 1900-01-01 02:12:48 | 4.01 |
| 1900-01-01 02:12:53 | 4.01 |
| 1900-01-01 02:12:58 | 4.01 |
| 1900-01-01 02:13:03 | 4.01 |
| 1900-01-01 02:13:08 | 4.01 |
| 1900-01-01 02:13:13 | 4.01 |
| 1900-01-01 02:13:18 | 4.01 |
| 1900-01-01 02:13:23 | 4 |
| 1900-01-01 02:13:28 | 4 |
| 1900-01-01 02:13:33 | 4.01 |
| 1900-01-01 02:13:38 | 4.01 |
| 1900-01-01 02:13:43 | 4 |
| 1900-01-01 02:13:48 | 4 |
| 1900-01-01 02:13:53 | 4.01 |
| 1900-01-01 02:13:58 | 4.01 |
| 1900-01-01 02:14:03 | 4.01 |
| 1900-01-01 02:14:08 | 4.01 |
| 1900-01-01 02:14:13 | 4 |
| 1900-01-01 02:14:18 | 4.01 |
| 1900-01-01 02:14:23 | 4.01 |
| 1900-01-01 02:14:28 | 4 |
| 1900-01-01 02:14:33 | 4.01 |
| 1900-01-01 02:14:38 | 4.01 |
| 1900-01-01 02:14:43 | 4 |
| 1900-01-01 02:14:48 | 4 |
| 1900-01-01 02:14:53 | 4.01 |
| 1900-01-01 02:14:58 | 4.01 |
| 1900-01-01 02:15:03 | 4.01 |
| 1900-01-01 02:15:08 | 4.01 |
| 1900-01-01 02:15:13 | 4.01 |
| 1900-01-01 02:15:18 | 4.01 |
| 1900-01-01 02:15:23 | 4.01 |
| 1900-01-01 02:15:28 | 4.01 |
| 1900-01-01 02:15:33 | 4.01 |
| 1900-01-01 02:15:38 | 4.01 |
| 1900-01-01 02:15:43 | 4.01 |
| 1900-01-01 02:15:48 | 4.01 |
| 1900-01-01 02:15:53 | 4.01 |
| 1900-01-01 02:15:58 | 4.01 |
| 1900-01-01 02:16:03 | 4.01 |
| 1900-01-01 02:16:08 | 4.01 |
| 1900-01-01 02:16:13 | 4.01 |
| 1900-01-01 02:16:18 | 4 |
| 1900-01-01 02:16:23 | 4.01 |
| 1900-01-01 02:16:28 | 4.01 |
| 1900-01-01 02:16:33 | 4.01 |
| 1900-01-01 02:16:38 | 4.01 |
| 1900-01-01 02:16:43 | 4.01 |
| 1900-01-01 02:16:48 | 4.01 |
| 1900-01-01 02:16:53 | 4.01 |
| 1900-01-01 02:16:58 | 4.01 |
| 1900-01-01 02:17:03 | 4.01 |
| 1900-01-01 02:17:08 | 4.01 |
| 1900-01-01 02:17:13 | 4.01 |
| 1900-01-01 02:17:18 | 4 |
| 1900-01-01 02:17:23 | 4.01 |
| 1900-01-01 02:17:28 | 4.01 |
| 1900-01-01 02:17:33 | 4.01 |
| 1900-01-01 02:17:38 | 4.01 |
| 1900-01-01 02:17:43 | 4.01 |
| 1900-01-01 02:17:48 | 4.01 |
| 1900-01-01 02:17:53 | 4.01 |
| 1900-01-01 02:17:58 | 4.01 |
| 1900-01-01 02:18:03 | 4.01 |
| 1900-01-01 02:18:08 | 4.01 |
| 1900-01-01 02:18:13 | 4.01 |
| 1900-01-01 02:18:18 | 4 |
| 1900-01-01 02:18:23 | 4.01 |
| 1900-01-01 02:18:28 | 4.01 |
| 1900-01-01 02:18:33 | 4 |
| 1900-01-01 02:18:38 | 4.01 |
| 1900-01-01 02:18:43 | 4.01 |
| 1900-01-01 02:18:48 | 4.01 |
| 1900-01-01 02:18:53 | 4.01 |
| 1900-01-01 02:18:58 | 4.01 |
| 1900-01-01 02:19:03 | 4.01 |
| 1900-01-01 02:19:08 | 4.01 |
| 1900-01-01 02:19:13 | 4.01 |
| 1900-01-01 02:19:18 | 4.01 |
| 1900-01-01 02:19:23 | 4.01 |
| 1900-01-01 02:19:28 | 4.01 |
| 1900-01-01 02:19:33 | 4.01 |
| 1900-01-01 02:19:38 | 4.01 |
| 1900-01-01 02:19:43 | 4 |
| 1900-01-01 02:19:48 | 4.01 |
| 1900-01-01 02:19:53 | 4 |
| 1900-01-01 02:19:58 | 4.01 |
| 1900-01-01 02:20:03 | 4 |
| 1900-01-01 02:20:08 | 4.01 |
| 1900-01-01 02:20:13 | 4.01 |
| 1900-01-01 02:20:18 | 4.01 |
| 1900-01-01 02:20:23 | 4.01 |
| 1900-01-01 02:20:28 | 4.01 |
| 1900-01-01 02:20:33 | 4.01 |
| 1900-01-01 02:20:38 | 4.01 |
| 1900-01-01 02:20:43 | 4.01 |
| 1900-01-01 02:20:48 | 4.01 |
| 1900-01-01 02:20:53 | 4 |
| 1900-01-01 02:20:58 | 4.01 |
| 1900-01-01 02:21:03 | 4.01 |
| 1900-01-01 02:21:08 | 4 |
| 1900-01-01 02:21:13 | 4.01 |
| 1900-01-01 02:21:18 | 4.01 |
| 1900-01-01 02:21:23 | 4 |
| 1900-01-01 02:21:28 | 4.01 |
| 1900-01-01 02:21:33 | 4.01 |
| 1900-01-01 02:21:38 | 4.01 |
| 1900-01-01 02:21:43 | 4 |
| 1900-01-01 02:21:48 | 4 |
| 1900-01-01 02:21:53 | 4.01 |
| 1900-01-01 02:21:58 | 4.01 |
| 1900-01-01 02:22:03 | 4.01 |
| 1900-01-01 02:22:08 | 4.01 |
| 1900-01-01 02:22:13 | 4.01 |
| 1900-01-01 02:22:18 | 4.01 |
| 1900-01-01 02:22:23 | 4 |
| 1900-01-01 02:22:28 | 4 |
| 1900-01-01 02:22:33 | 4.01 |
| 1900-01-01 02:22:38 | 4 |
| 1900-01-01 02:22:43 | 4 |
| 1900-01-01 02:22:48 | 4.01 |
| 1900-01-01 02:22:53 | 4 |
| 1900-01-01 02:22:58 | 4.01 |
| 1900-01-01 02:23:03 | 4.01 |
| 1900-01-01 02:23:08 | 4 |
| 1900-01-01 02:23:13 | 4 |
| 1900-01-01 02:23:18 | 4.01 |
| 1900-01-01 02:23:23 | 4.01 |
| 1900-01-01 02:23:28 | 4 |
| 1900-01-01 02:23:33 | 4.01 |
| 1900-01-01 02:23:38 | 4.01 |
| 1900-01-01 02:23:43 | 4.01 |
| 1900-01-01 02:23:48 | 4 |
| 1900-01-01 02:23:53 | 4.01 |
| 1900-01-01 02:23:58 | 4.01 |
| 1900-01-01 02:24:03 | 4.01 |
| 1900-01-01 02:24:08 | 4.01 |
| 1900-01-01 02:24:13 | 4.01 |
| 1900-01-01 02:24:18 | 4 |
| 1900-01-01 02:24:23 | 4 |
| 1900-01-01 02:24:28 | 4 |
| 1900-01-01 02:24:33 | 4 |
| 1900-01-01 02:24:38 | 4 |
| 1900-01-01 02:24:43 | 4 |
| 1900-01-01 02:24:48 | 4.01 |
| 1900-01-01 02:24:53 | 4.01 |
| 1900-01-01 02:24:58 | 4 |
| 1900-01-01 02:25:03 | 4.01 |
| 1900-01-01 02:25:08 | 4 |
| 1900-01-01 02:25:13 | 4 |
| 1900-01-01 02:25:18 | 4 |
| 1900-01-01 02:25:23 | 4 |
| 1900-01-01 02:25:28 | 4.01 |
| 1900-01-01 02:25:33 | 4 |
| 1900-01-01 02:25:38 | 4.01 |
| 1900-01-01 02:25:43 | 4 |
| 1900-01-01 02:25:48 | 4 |
| 1900-01-01 02:25:53 | 4 |
| 1900-01-01 02:25:58 | 4 |
| 1900-01-01 02:26:03 | 4.01 |
| 1900-01-01 02:26:08 | 4 |
| 1900-01-01 02:26:13 | 4 |
| 1900-01-01 02:26:18 | 4 |
| 1900-01-01 02:26:23 | 4 |
| 1900-01-01 02:26:28 | 4.01 |
| 1900-01-01 02:26:33 | 4 |
| 1900-01-01 02:26:38 | 4 |
| 1900-01-01 02:26:43 | 4 |
| 1900-01-01 02:26:48 | 4 |
| 1900-01-01 02:26:53 | 4 |
| 1900-01-01 02:26:58 | 4.01 |
| 1900-01-01 02:27:03 | 4 |
| 1900-01-01 02:27:08 | 4 |
| 1900-01-01 02:27:13 | 4 |
| 1900-01-01 02:27:18 | 4 |
| 1900-01-01 02:27:23 | 4 |
| 1900-01-01 02:27:28 | 4 |
| 1900-01-01 02:27:33 | 4 |
| 1900-01-01 02:27:38 | 4.01 |
| 1900-01-01 02:27:43 | 4 |
| 1900-01-01 02:27:48 | 4 |
| 1900-01-01 02:27:53 | 4 |
| 1900-01-01 02:27:58 | 4 |
| 1900-01-01 02:28:03 | 4 |
| 1900-01-01 02:28:08 | 4 |
| 1900-01-01 02:28:13 | 4 |
| 1900-01-01 02:28:18 | 4.01 |
| 1900-01-01 02:28:23 | 4 |
| 1900-01-01 02:28:28 | 4 |
| 1900-01-01 02:28:33 | 4 |
| 1900-01-01 02:28:38 | 4 |
| 1900-01-01 02:28:43 | 4 |
| 1900-01-01 02:28:48 | 4 |
| 1900-01-01 02:28:53 | 4 |
| 1900-01-01 02:28:58 | 4 |
| 1900-01-01 02:29:03 | 4 |
| 1900-01-01 02:29:08 | 4 |
| 1900-01-01 02:29:13 | 4 |
| 1900-01-01 02:29:18 | 4.01 |
| 1900-01-01 02:29:23 | 4 |
| 1900-01-01 02:29:28 | 4 |
| 1900-01-01 02:29:33 | 4 |
| 1900-01-01 02:29:38 | 4 |
| 1900-01-01 02:29:43 | 4 |
| 1900-01-01 02:29:48 | 4 |
| 1900-01-01 02:29:53 | 4 |
| 1900-01-01 02:29:58 | 4 |
| 1900-01-01 02:30:03 | 4 |
| 1900-01-01 02:30:08 | 4 |
| 1900-01-01 02:30:13 | 4 |
| 1900-01-01 02:30:18 | 4 |
| 1900-01-01 02:30:23 | 4 |
| 1900-01-01 02:30:28 | 4 |
| 1900-01-01 02:30:33 | 4 |
| 1900-01-01 02:30:38 | 4.01 |
| 1900-01-01 02:30:43 | 4 |
| 1900-01-01 02:30:48 | 4 |
| 1900-01-01 02:30:53 | 4 |
| 1900-01-01 02:30:58 | 4 |
| 1900-01-01 02:31:03 | 4 |
| 1900-01-01 02:31:08 | 4 |
| 1900-01-01 02:31:13 | 4 |
| 1900-01-01 02:31:18 | 4 |
| 1900-01-01 02:31:23 | 4 |
| 1900-01-01 02:31:28 | 4 |
| 1900-01-01 02:31:33 | 4 |
| 1900-01-01 02:31:38 | 4 |
| 1900-01-01 02:31:43 | 4 |
| 1900-01-01 02:31:48 | 4 |
| 1900-01-01 02:31:53 | 4 |
| 1900-01-01 02:31:58 | 4 |
| 1900-01-01 02:32:03 | 4 |
| 1900-01-01 02:32:08 | 4 |
| 1900-01-01 02:32:13 | 4 |
| 1900-01-01 02:32:18 | 4 |
| 1900-01-01 02:32:23 | 4 |
| 1900-01-01 02:32:28 | 4 |
| 1900-01-01 02:32:33 | 4 |
| 1900-01-01 02:32:38 | 4 |
| 1900-01-01 02:32:43 | 4 |
| 1900-01-01 02:32:48 | 4 |
| 1900-01-01 02:32:53 | 4 |
| 1900-01-01 02:32:58 | 4 |
| 1900-01-01 02:33:03 | 4 |
| 1900-01-01 02:33:08 | 4 |
| 1900-01-01 02:33:13 | 4 |
| 1900-01-01 02:33:18 | 4 |
| 1900-01-01 02:33:23 | 4 |
| 1900-01-01 02:33:28 | 4 |
| 1900-01-01 02:33:33 | 4 |
| 1900-01-01 02:33:38 | 4 |
| 1900-01-01 02:33:43 | 4 |
| 1900-01-01 02:33:48 | 4 |
| 1900-01-01 02:33:53 | 4 |
| 1900-01-01 02:33:58 | 4 |
| 1900-01-01 02:34:03 | 4 |
| 1900-01-01 02:34:08 | 4 |
| 1900-01-01 02:34:13 | 4 |
| 1900-01-01 02:34:18 | 4 |
| 1900-01-01 02:34:23 | 4 |
| 1900-01-01 02:34:28 | 4 |
| 1900-01-01 02:34:33 | 4 |
| 1900-01-01 02:34:38 | 4 |
| 1900-01-01 02:34:43 | 4 |
| 1900-01-01 02:34:48 | 4 |
| 1900-01-01 02:34:53 | 4 |
| 1900-01-01 02:34:58 | 4 |
| 1900-01-01 02:35:03 | 4 |
| 1900-01-01 02:35:08 | 4 |
| 1900-01-01 02:35:13 | 4 |
| 1900-01-01 02:35:18 | 4 |
| 1900-01-01 02:35:23 | 4 |
| 1900-01-01 02:35:28 | 4 |
| 1900-01-01 02:35:33 | 4 |
| 1900-01-01 02:35:38 | 4 |
| 1900-01-01 02:35:43 | 4 |
| 1900-01-01 02:35:48 | 4 |
| 1900-01-01 02:35:53 | 4 |
| 1900-01-01 02:35:58 | 4 |
| 1900-01-01 02:36:03 | 4 |
| 1900-01-01 02:36:08 | 4 |
| 1900-01-01 02:36:13 | 4 |
| 1900-01-01 02:36:18 | 4 |
| 1900-01-01 02:36:23 | 3.99 |
| 1900-01-01 02:36:28 | 3.99 |
| 1900-01-01 02:36:33 | 4 |
| 1900-01-01 02:36:38 | 4 |
| 1900-01-01 02:36:43 | 4 |
| 1900-01-01 02:36:48 | 4 |
| 1900-01-01 02:36:53 | 4 |
| 1900-01-01 02:36:58 | 4 |
| 1900-01-01 02:37:03 | 4 |
| 1900-01-01 02:37:08 | 4 |
| 1900-01-01 02:37:13 | 3.99 |
| 1900-01-01 02:37:18 | 4 |
| 1900-01-01 02:37:23 | 4 |
| 1900-01-01 02:37:28 | 4 |
| 1900-01-01 02:37:33 | 4 |
| 1900-01-01 02:37:38 | 3.99 |
| 1900-01-01 02:37:43 | 4 |
| 1900-01-01 02:37:48 | 4 |
| 1900-01-01 02:37:53 | 3.99 |
| 1900-01-01 02:37:58 | 4 |
| 1900-01-01 02:38:03 | 4 |
| 1900-01-01 02:38:08 | 4 |
| 1900-01-01 02:38:13 | 4 |
| 1900-01-01 02:38:18 | 4 |
| 1900-01-01 02:38:23 | 3.99 |
| 1900-01-01 02:38:28 | 4 |
| 1900-01-01 02:38:33 | 4 |
| 1900-01-01 02:38:38 | 4 |
| 1900-01-01 02:38:43 | 4 |
| 1900-01-01 02:38:48 | 4 |
| 1900-01-01 02:38:53 | 4 |
| 1900-01-01 02:38:58 | 3.99 |
| 1900-01-01 02:39:03 | 3.99 |
| 1900-01-01 02:39:08 | 4 |
| 1900-01-01 02:39:13 | 4 |
| 1900-01-01 02:39:18 | 4 |
| 1900-01-01 02:39:23 | 3.99 |
| 1900-01-01 02:39:28 | 4 |
| 1900-01-01 02:39:33 | 4 |
| 1900-01-01 02:39:38 | 4 |
| 1900-01-01 02:39:43 | 4 |
| 1900-01-01 02:39:48 | 4 |
| 1900-01-01 02:39:53 | 4 |
| 1900-01-01 02:39:58 | 4 |
| 1900-01-01 02:40:03 | 4 |
| 1900-01-01 02:40:08 | 3.99 |
| 1900-01-01 02:40:13 | 3.99 |
| 1900-01-01 02:40:18 | 4 |
| 1900-01-01 02:40:23 | 4 |
| 1900-01-01 02:40:28 | 4 |
| 1900-01-01 02:40:33 | 4 |
| 1900-01-01 02:40:38 | 4 |
| 1900-01-01 02:40:43 | 4 |
| 1900-01-01 02:40:48 | 4 |
| 1900-01-01 02:40:53 | 4 |
| 1900-01-01 02:40:58 | 4 |
| 1900-01-01 02:41:03 | 4 |
| 1900-01-01 02:41:08 | 4 |
| 1900-01-01 02:41:13 | 4 |
| 1900-01-01 02:41:18 | 3.99 |
| 1900-01-01 02:41:23 | 4 |
| 1900-01-01 02:41:28 | 4 |
| 1900-01-01 02:41:33 | 4 |
| 1900-01-01 02:41:38 | 4 |
| 1900-01-01 02:41:43 | 4 |
| 1900-01-01 02:41:48 | 4 |
| 1900-01-01 02:41:53 | 3.99 |
| 1900-01-01 02:41:58 | 4 |
| 1900-01-01 02:42:03 | 4 |
| 1900-01-01 02:42:08 | 4 |
| 1900-01-01 02:42:13 | 4 |
| 1900-01-01 02:42:18 | 4 |
| 1900-01-01 02:42:23 | 3.99 |
| 1900-01-01 02:42:28 | 4 |
| 1900-01-01 02:42:33 | 4 |
| 1900-01-01 02:42:38 | 3.99 |
| 1900-01-01 02:42:43 | 4 |
| 1900-01-01 02:42:48 | 4 |
| 1900-01-01 02:42:53 | 4 |
| 1900-01-01 02:42:58 | 4 |
| 1900-01-01 02:43:03 | 4 |
| 1900-01-01 02:43:08 | 4 |
| 1900-01-01 02:43:13 | 4 |
| 1900-01-01 02:43:18 | 4 |
| 1900-01-01 02:43:23 | 4 |
| 1900-01-01 02:43:28 | 4 |
| 1900-01-01 02:43:33 | 4 |
| 1900-01-01 02:43:38 | 4 |
| 1900-01-01 02:43:43 | 4 |
| 1900-01-01 02:43:48 | 4 |
| 1900-01-01 02:43:53 | 4 |
| 1900-01-01 02:43:58 | 4 |
| 1900-01-01 02:44:03 | 4 |
| 1900-01-01 02:44:08 | 4 |
| 1900-01-01 02:44:13 | 4 |
| 1900-01-01 02:44:18 | 4 |
| 1900-01-01 02:44:23 | 4 |
| 1900-01-01 02:44:28 | 4 |
| 1900-01-01 02:44:33 | 4 |
| 1900-01-01 02:44:38 | 4 |
| 1900-01-01 02:44:43 | 4 |
| 1900-01-01 02:44:48 | 4 |
| 1900-01-01 02:44:53 | 3.99 |
| 1900-01-01 02:44:58 | 4 |
| 1900-01-01 02:45:03 | 3.99 |
| 1900-01-01 02:45:08 | 3.99 |
| 1900-01-01 02:45:13 | 3.99 |
| 1900-01-01 02:45:18 | 4 |
| 1900-01-01 02:45:23 | 4 |
| 1900-01-01 02:45:28 | 4 |
| 1900-01-01 02:45:33 | 4 |
| 1900-01-01 02:45:38 | 4 |
| 1900-01-01 02:45:43 | 4 |
| 1900-01-01 02:45:48 | 4 |
| 1900-01-01 02:45:53 | 4 |
| 1900-01-01 02:45:58 | 4 |
| 1900-01-01 02:46:03 | 4 |
| 1900-01-01 02:46:08 | 4 |
| 1900-01-01 02:46:13 | 4 |
| 1900-01-01 02:46:18 | 4 |
| 1900-01-01 02:46:23 | 4 |
| 1900-01-01 02:46:28 | 3.99 |
| 1900-01-01 02:46:33 | 3.99 |
| 1900-01-01 02:46:38 | 3.99 |
| 1900-01-01 02:46:43 | 4 |
| 1900-01-01 02:46:48 | 4 |
| 1900-01-01 02:46:53 | 4 |
| 1900-01-01 02:46:58 | 4 |
| 1900-01-01 02:47:03 | 3.99 |
| 1900-01-01 02:47:08 | 4 |
| 1900-01-01 02:47:13 | 3.99 |
| 1900-01-01 02:47:18 | 3.99 |
| 1900-01-01 02:47:23 | 3.99 |
| 1900-01-01 02:47:28 | 3.99 |
| 1900-01-01 02:47:33 | 3.99 |
| 1900-01-01 02:47:38 | 4 |
| 1900-01-01 02:47:43 | 4 |
| 1900-01-01 02:47:48 | 4 |
| 1900-01-01 02:47:53 | 4 |
| 1900-01-01 02:47:58 | 4 |
| 1900-01-01 02:48:03 | 4 |
| 1900-01-01 02:48:08 | 4 |
| 1900-01-01 02:48:13 | 4 |
| 1900-01-01 02:48:18 | 4 |
| 1900-01-01 02:48:23 | 3.99 |
| 1900-01-01 02:48:28 | 4 |
| 1900-01-01 02:48:33 | 4 |
| 1900-01-01 02:48:38 | 4 |
| 1900-01-01 02:48:43 | 4 |
| 1900-01-01 02:48:48 | 4 |
| 1900-01-01 02:48:53 | 4 |
| 1900-01-01 02:48:58 | 4 |
| 1900-01-01 02:49:03 | 3.99 |
| 1900-01-01 02:49:08 | 4 |
| 1900-01-01 02:49:13 | 4 |
| 1900-01-01 02:49:18 | 4 |
| 1900-01-01 02:49:23 | 4 |
| 1900-01-01 02:49:28 | 4 |
| 1900-01-01 02:49:33 | 3.99 |
| 1900-01-01 02:49:38 | 3.99 |
| 1900-01-01 02:49:43 | 4 |
| 1900-01-01 02:49:48 | 4 |
| 1900-01-01 02:49:53 | 4 |
| 1900-01-01 02:49:58 | 4 |
| 1900-01-01 02:50:03 | 3.99 |
| 1900-01-01 02:50:08 | 4 |
| 1900-01-01 02:50:13 | 4 |
| 1900-01-01 02:50:18 | 4 |
| 1900-01-01 02:50:23 | 4 |
| 1900-01-01 02:50:28 | 4 |
| 1900-01-01 02:50:33 | 4 |
| 1900-01-01 02:50:38 | 3.99 |
| 1900-01-01 02:50:43 | 3.99 |
| 1900-01-01 02:50:48 | 4 |
| 1900-01-01 02:50:53 | 4 |
| 1900-01-01 02:50:58 | 4 |
| 1900-01-01 02:51:03 | 4 |
| 1900-01-01 02:51:08 | 3.99 |
| 1900-01-01 02:51:13 | 3.99 |
| 1900-01-01 02:51:18 | 4 |
| 1900-01-01 02:51:23 | 4 |
| 1900-01-01 02:51:28 | 4 |
| 1900-01-01 02:51:33 | 4 |
| 1900-01-01 02:51:38 | 4 |
| 1900-01-01 02:51:43 | 3.99 |
| 1900-01-01 02:51:48 | 3.99 |
| 1900-01-01 02:51:53 | 4 |
| 1900-01-01 02:51:58 | 4 |
| 1900-01-01 02:52:03 | 4 |
| 1900-01-01 02:52:08 | 4 |
| 1900-01-01 02:52:13 | 4 |
| 1900-01-01 02:52:18 | 3.99 |
| 1900-01-01 02:52:23 | 3.99 |
| 1900-01-01 02:52:28 | 3.99 |
| 1900-01-01 02:52:33 | 3.99 |
| 1900-01-01 02:52:38 | 3.99 |
| 1900-01-01 02:52:43 | 3.99 |
| 1900-01-01 02:52:48 | 3.99 |
| 1900-01-01 02:52:53 | 3.99 |
| 1900-01-01 02:52:58 | 3.99 |
| 1900-01-01 02:53:03 | 3.99 |
| 1900-01-01 02:53:08 | 3.99 |
| 1900-01-01 02:53:13 | 3.99 |
| 1900-01-01 02:53:18 | 4 |
| 1900-01-01 02:53:23 | 4 |
| 1900-01-01 02:53:28 | 4 |
| 1900-01-01 02:53:33 | 4 |
| 1900-01-01 02:53:38 | 4 |
| 1900-01-01 02:53:43 | 4 |
| 1900-01-01 02:53:48 | 4 |
| 1900-01-01 02:53:53 | 4 |
| 1900-01-01 02:53:58 | 3.99 |
| 1900-01-01 02:54:03 | 4 |
| 1900-01-01 02:54:08 | 3.99 |
| 1900-01-01 02:54:13 | 4 |
| 1900-01-01 02:54:18 | 3.99 |
| 1900-01-01 02:54:23 | 3.99 |
| 1900-01-01 02:54:28 | 4 |
| 1900-01-01 02:54:33 | 4 |
| 1900-01-01 02:54:38 | 4 |
| 1900-01-01 02:54:43 | 4 |
| 1900-01-01 02:54:48 | 4 |
| 1900-01-01 02:54:53 | 4 |
| 1900-01-01 02:54:58 | 4 |
| 1900-01-01 02:55:03 | 4 |
| 1900-01-01 02:55:08 | 4 |
| 1900-01-01 02:55:13 | 4 |
| 1900-01-01 02:55:18 | 4 |
| 1900-01-01 02:55:23 | 4 |
| 1900-01-01 02:55:28 | 4 |
| 1900-01-01 02:55:33 | 3.99 |
| 1900-01-01 02:55:38 | 4 |
| 1900-01-01 02:55:43 | 3.99 |
| 1900-01-01 02:55:48 | 4 |
| 1900-01-01 02:55:53 | 4 |
| 1900-01-01 02:55:58 | 4 |
| 1900-01-01 02:56:03 | 4 |
| 1900-01-01 02:56:08 | 4 |
| 1900-01-01 02:56:13 | 4 |
| 1900-01-01 02:56:18 | 4 |
| 1900-01-01 02:56:23 | 4 |
| 1900-01-01 02:56:28 | 4 |
| 1900-01-01 02:56:33 | 3.99 |
| 1900-01-01 02:56:38 | 4 |
| 1900-01-01 02:56:43 | 3.99 |
| 1900-01-01 02:56:48 | 4 |
| 1900-01-01 02:56:53 | 4 |
| 1900-01-01 02:56:58 | 3.99 |
| 1900-01-01 02:57:03 | 4 |
| 1900-01-01 02:57:08 | 4 |
| 1900-01-01 02:57:13 | 3.99 |
| 1900-01-01 02:57:18 | 4 |
| 1900-01-01 02:57:23 | 3.99 |
| 1900-01-01 02:57:28 | 3.99 |
| 1900-01-01 02:57:33 | 3.99 |
| 1900-01-01 02:57:38 | 3.99 |
| 1900-01-01 02:57:43 | 3.99 |
| 1900-01-01 02:57:48 | 4 |
| 1900-01-01 02:57:53 | 4 |
| 1900-01-01 02:57:58 | 4 |
| 1900-01-01 02:58:03 | 4 |
| 1900-01-01 02:58:08 | 4 |
| 1900-01-01 02:58:13 | 4 |
| 1900-01-01 02:58:18 | 4 |
| 1900-01-01 02:58:23 | 4 |
| 1900-01-01 02:58:28 | 4 |
| 1900-01-01 02:58:33 | 4 |
| 1900-01-01 02:58:38 | 4 |
| 1900-01-01 02:58:43 | 4 |
| 1900-01-01 02:58:48 | 4 |
| 1900-01-01 02:58:53 | 4 |
| 1900-01-01 02:58:58 | 4 |
| 1900-01-01 02:59:03 | 4 |
| 1900-01-01 02:59:08 | 4 |
| 1900-01-01 02:59:13 | 4 |
| 1900-01-01 02:59:18 | 4 |
| 1900-01-01 02:59:23 | 4 |
| 1900-01-01 02:59:28 | 4 |
| 1900-01-01 02:59:33 | 4 |
| 1900-01-01 02:59:38 | 4 |
| 1900-01-01 02:59:43 | 4 |
| 1900-01-01 02:59:48 | 4 |
| 1900-01-01 02:59:53 | 4 |
| 1900-01-01 02:59:58 | 4 |
| 1900-01-01 03:00:03 | 4 |
| 1900-01-01 03:00:08 | 4 |
| 1900-01-01 03:00:13 | 4 |
| 1900-01-01 03:00:18 | 4 |
| 1900-01-01 03:00:23 | 4 |
| 1900-01-01 03:00:28 | 4 |
| 1900-01-01 03:00:33 | 4 |
| 1900-01-01 03:00:38 | 4 |
| 1900-01-01 03:00:43 | 4 |
| 1900-01-01 03:00:48 | 4 |
| 1900-01-01 03:00:53 | 4 |
| 1900-01-01 03:00:58 | 4 |
| 1900-01-01 03:01:03 | 4 |
| 1900-01-01 03:01:08 | 4 |
| 1900-01-01 03:01:13 | 4 |
| 1900-01-01 03:01:18 | 4 |
| 1900-01-01 03:01:23 | 4 |
| 1900-01-01 03:01:28 | 4 |
| 1900-01-01 03:01:33 | 4 |
| 1900-01-01 03:01:38 | 4 |
| 1900-01-01 03:01:43 | 4 |
| 1900-01-01 03:01:48 | 4 |
| 1900-01-01 03:01:53 | 4 |
| 1900-01-01 03:01:58 | 4 |
| 1900-01-01 03:02:03 | 3.99 |
| 1900-01-01 03:02:08 | 4 |
| 1900-01-01 03:02:13 | 4 |
| 1900-01-01 03:02:18 | 4 |
| 1900-01-01 03:02:23 | 4 |
| 1900-01-01 03:02:28 | 4 |
| 1900-01-01 03:02:33 | 4 |
| 1900-01-01 03:02:38 | 4 |
| 1900-01-01 03:02:43 | 4 |
| 1900-01-01 03:02:48 | 4 |
| 1900-01-01 03:02:53 | 4 |
| 1900-01-01 03:02:58 | 4 |
| 1900-01-01 03:03:03 | 4 |
| 1900-01-01 03:03:08 | 4 |
| 1900-01-01 03:03:13 | 4 |
| 1900-01-01 03:03:18 | 3.99 |
| 1900-01-01 03:03:23 | 4 |
| 1900-01-01 03:03:28 | 3.99 |
| 1900-01-01 03:03:33 | 3.99 |
| 1900-01-01 03:03:38 | 3.99 |
| 1900-01-01 03:03:43 | 3.99 |
| 1900-01-01 03:03:48 | 3.99 |
| 1900-01-01 03:03:53 | 4 |
| 1900-01-01 03:03:58 | 4 |
| 1900-01-01 03:04:03 | 4 |
| 1900-01-01 03:04:08 | 3.99 |
| 1900-01-01 03:04:13 | 3.99 |
| 1900-01-01 03:04:18 | 3.99 |
| 1900-01-01 03:04:23 | 3.99 |
| 1900-01-01 03:04:28 | 3.99 |
| 1900-01-01 03:04:33 | 3.99 |
| 1900-01-01 03:04:38 | 4 |
| 1900-01-01 03:04:43 | 4 |
| 1900-01-01 03:04:48 | 4 |
| 1900-01-01 03:04:53 | 4 |
| 1900-01-01 03:04:58 | 4 |
| 1900-01-01 03:05:03 | 4 |
| 1900-01-01 03:05:08 | 4 |
| 1900-01-01 03:05:13 | 4 |
| 1900-01-01 03:05:18 | 4 |
| 1900-01-01 03:05:23 | 4 |
| 1900-01-01 03:05:28 | 3.99 |
| 1900-01-01 03:05:33 | 4 |
| 1900-01-01 03:05:38 | 4 |
| 1900-01-01 03:05:43 | 4 |
| 1900-01-01 03:05:48 | 4 |
| 1900-01-01 03:05:53 | 4 |
| 1900-01-01 03:05:58 | 4 |
| 1900-01-01 03:06:03 | 4 |
| 1900-01-01 03:06:08 | 4 |
| 1900-01-01 03:06:13 | 4 |
| 1900-01-01 03:06:18 | 4 |
| 1900-01-01 03:06:23 | 4 |
| 1900-01-01 03:06:28 | 4 |
| 1900-01-01 03:06:33 | 4 |
| 1900-01-01 03:06:38 | 4 |
| 1900-01-01 03:06:43 | 4 |
| 1900-01-01 03:06:48 | 4 |
| 1900-01-01 03:06:53 | 4 |
| 1900-01-01 03:06:58 | 4 |
| 1900-01-01 03:07:03 | 4 |
| 1900-01-01 03:07:08 | 4 |
| 1900-01-01 03:07:13 | 4 |
| 1900-01-01 03:07:18 | 4 |
| 1900-01-01 03:07:23 | 4 |
| 1900-01-01 03:07:28 | 4 |
| 1900-01-01 03:07:33 | 4 |
| 1900-01-01 03:07:38 | 4 |
| 1900-01-01 03:07:43 | 4 |
| 1900-01-01 03:07:48 | 3.99 |
| 1900-01-01 03:07:53 | 3.99 |
| 1900-01-01 03:07:58 | 3.99 |
| 1900-01-01 03:08:03 | 3.99 |
| 1900-01-01 03:08:08 | 3.99 |
| 1900-01-01 03:08:13 | 3.99 |
| 1900-01-01 03:08:18 | 3.99 |
| 1900-01-01 03:08:23 | 3.99 |
| 1900-01-01 03:08:28 | 3.99 |
| 1900-01-01 03:08:33 | 3.99 |
| 1900-01-01 03:08:38 | 4 |
| 1900-01-01 03:08:43 | 3.99 |
| 1900-01-01 03:08:48 | 3.99 |
| 1900-01-01 03:08:53 | 4 |
| 1900-01-01 03:08:58 | 3.98 |
| 1900-01-01 03:09:03 | 3.99 |
| 1900-01-01 03:09:08 | 4 |
| 1900-01-01 03:09:13 | 3.99 |
| 1900-01-01 03:09:18 | 3.99 |
| 1900-01-01 03:09:23 | 4 |
| 1900-01-01 03:09:28 | 4 |
| 1900-01-01 03:09:33 | 4 |
| 1900-01-01 03:09:38 | 4 |
| 1900-01-01 03:09:43 | 4 |
| 1900-01-01 03:09:48 | 4 |
| 1900-01-01 03:09:53 | 4 |
| 1900-01-01 03:09:58 | 4 |
| 1900-01-01 03:10:03 | 4 |
| 1900-01-01 03:10:08 | 4 |
| 1900-01-01 03:10:13 | 4 |
| 1900-01-01 03:10:18 | 3.99 |
| 1900-01-01 03:10:23 | 4 |
| 1900-01-01 03:10:28 | 4 |
| 1900-01-01 03:10:33 | 4 |
| 1900-01-01 03:10:38 | 4 |
| 1900-01-01 03:10:43 | 4 |
| 1900-01-01 03:10:48 | 4 |
| 1900-01-01 03:10:53 | 4 |
| 1900-01-01 03:10:58 | 4 |
| 1900-01-01 03:11:03 | 4 |
| 1900-01-01 03:11:08 | 4 |
| 1900-01-01 03:11:13 | 3.99 |
| 1900-01-01 03:11:18 | 3.98 |
| 1900-01-01 03:11:23 | 3.99 |
| 1900-01-01 03:11:28 | 4 |
| 1900-01-01 03:11:33 | 4 |
| 1900-01-01 03:11:38 | 3.99 |
| 1900-01-01 03:11:43 | 3.99 |
| 1900-01-01 03:11:48 | 4 |
| 1900-01-01 03:11:53 | 3.99 |
| 1900-01-01 03:11:58 | 3.99 |
| 1900-01-01 03:12:03 | 4 |
| 1900-01-01 03:12:08 | 4 |
| 1900-01-01 03:12:13 | 4 |
| 1900-01-01 03:12:18 | 4 |
| 1900-01-01 03:12:23 | 4 |
| 1900-01-01 03:12:28 | 4 |
| 1900-01-01 03:12:33 | 4 |
| 1900-01-01 03:12:38 | 3.99 |
| 1900-01-01 03:12:43 | 4 |
| 1900-01-01 03:12:48 | 3.99 |
| 1900-01-01 03:12:53 | 3.99 |
| 1900-01-01 03:12:58 | 3.99 |
| 1900-01-01 03:13:03 | 3.99 |
| 1900-01-01 03:13:08 | 4 |
| 1900-01-01 03:13:13 | 4 |
| 1900-01-01 03:13:18 | 4 |
| 1900-01-01 03:13:23 | 4 |
| 1900-01-01 03:13:28 | 4 |
| 1900-01-01 03:13:33 | 3.99 |
| 1900-01-01 03:13:38 | 4 |
| 1900-01-01 03:13:43 | 3.99 |
| 1900-01-01 03:13:48 | 4 |
| 1900-01-01 03:13:53 | 4 |
| 1900-01-01 03:13:58 | 4 |
| 1900-01-01 03:14:03 | 4 |
| 1900-01-01 03:14:08 | 4 |
| 1900-01-01 03:14:13 | 4 |
| 1900-01-01 03:14:18 | 4 |
| 1900-01-01 03:14:23 | 3.98 |
| 1900-01-01 03:14:28 | 3.98 |
| 1900-01-01 03:14:33 | 3.98 |
| 1900-01-01 03:14:38 | 3.99 |
| 1900-01-01 03:14:43 | 3.99 |
| 1900-01-01 03:14:48 | 4 |
| 1900-01-01 03:14:53 | 4 |
| 1900-01-01 03:14:58 | 4 |
| 1900-01-01 03:15:03 | 4 |
| 1900-01-01 03:15:08 | 4 |
| 1900-01-01 03:15:13 | 4 |
| 1900-01-01 03:15:18 | 4 |
| 1900-01-01 03:15:23 | 3.99 |
| 1900-01-01 03:15:28 | 4 |
| 1900-01-01 03:15:33 | 3.99 |
| 1900-01-01 03:15:38 | 3.98 |
| 1900-01-01 03:15:43 | 4 |
| 1900-01-01 03:15:48 | 4 |
| 1900-01-01 03:15:53 | 3.99 |
| 1900-01-01 03:15:58 | 3.99 |
| 1900-01-01 03:16:03 | 3.98 |
| 1900-01-01 03:16:08 | 3.98 |
| 1900-01-01 03:16:13 | 4 |
| 1900-01-01 03:16:18 | 4 |
| 1900-01-01 03:16:23 | 4 |
| 1900-01-01 03:16:28 | 3.98 |
| 1900-01-01 03:16:33 | 4 |
| 1900-01-01 03:16:38 | 3.99 |
| 1900-01-01 03:16:43 | 4 |
| 1900-01-01 03:16:48 | 3.98 |
| 1900-01-01 03:16:53 | 3.99 |
| 1900-01-01 03:16:58 | 4 |
| 1900-01-01 03:17:03 | 4 |
| 1900-01-01 03:17:08 | 4 |
| 1900-01-01 03:17:13 | 4 |
| 1900-01-01 03:17:18 | 4 |
| 1900-01-01 03:17:23 | 4 |
| 1900-01-01 03:17:28 | 4 |
| 1900-01-01 03:17:33 | 4 |
| 1900-01-01 03:17:38 | 3.99 |
| 1900-01-01 03:17:43 | 4 |
| 1900-01-01 03:17:48 | 4 |
| 1900-01-01 03:17:53 | 4 |
| 1900-01-01 03:17:58 | 4 |
| 1900-01-01 03:18:03 | 4 |
| 1900-01-01 03:18:08 | 4 |
| 1900-01-01 03:18:13 | 3.99 |
| 1900-01-01 03:18:18 | 4 |
| 1900-01-01 03:18:23 | 3.99 |
| 1900-01-01 03:18:28 | 4 |
| 1900-01-01 03:18:33 | 4 |
| 1900-01-01 03:18:38 | 3.99 |
| 1900-01-01 03:18:43 | 3.99 |
| 1900-01-01 03:18:48 | 4 |
| 1900-01-01 03:18:53 | 4 |
| 1900-01-01 03:18:58 | 4 |
| 1900-01-01 03:19:03 | 3.98 |
| 1900-01-01 03:19:08 | 3.98 |
| 1900-01-01 03:19:13 | 3.98 |
| 1900-01-01 03:19:18 | 3.98 |
| 1900-01-01 03:19:23 | 3.98 |
| 1900-01-01 03:19:28 | 3.98 |
| 1900-01-01 03:19:33 | 3.98 |
| 1900-01-01 03:19:38 | 3.98 |
| 1900-01-01 03:19:43 | 3.98 |
| 1900-01-01 03:19:48 | 4 |
| 1900-01-01 03:19:53 | 4 |
| 1900-01-01 03:19:58 | 4 |
| 1900-01-01 03:20:03 | 4 |
| 1900-01-01 03:20:08 | 3.98 |
| 1900-01-01 03:20:13 | 3.99 |
| 1900-01-01 03:20:18 | 4 |
| 1900-01-01 03:20:23 | 3.98 |
| 1900-01-01 03:20:28 | 4 |
| 1900-01-01 03:20:33 | 3.99 |
| 1900-01-01 03:20:38 | 3.98 |
| 1900-01-01 03:20:43 | 3.98 |
| 1900-01-01 03:20:48 | 3.98 |
| 1900-01-01 03:20:53 | 4 |
| 1900-01-01 03:20:58 | 3.99 |
| 1900-01-01 03:21:03 | 3.99 |
| 1900-01-01 03:21:08 | 3.99 |
| 1900-01-01 03:21:13 | 3.99 |
| 1900-01-01 03:21:18 | 4 |
| 1900-01-01 03:21:23 | 4 |
| 1900-01-01 03:21:28 | 4 |
| 1900-01-01 03:21:33 | 3.98 |
| 1900-01-01 03:21:38 | 3.98 |
| 1900-01-01 03:21:43 | 3.99 |
| 1900-01-01 03:21:48 | 3.98 |
| 1900-01-01 03:21:53 | 3.99 |
| 1900-01-01 03:21:58 | 3.98 |
| 1900-01-01 03:22:03 | 3.98 |
| 1900-01-01 03:22:08 | 3.98 |
| 1900-01-01 03:22:13 | 3.99 |
| 1900-01-01 03:22:18 | 3.99 |
| 1900-01-01 03:22:23 | 3.98 |
| 1900-01-01 03:22:28 | 3.99 |
| 1900-01-01 03:22:33 | 3.99 |
| 1900-01-01 03:22:38 | 4 |
| 1900-01-01 03:22:43 | 3.99 |
| 1900-01-01 03:22:48 | 3.99 |
| 1900-01-01 03:22:53 | 4 |
| 1900-01-01 03:22:58 | 3.99 |
| 1900-01-01 03:23:03 | 3.99 |
| 1900-01-01 03:23:08 | 3.99 |
| 1900-01-01 03:23:13 | 3.99 |
| 1900-01-01 03:23:18 | 3.99 |
| 1900-01-01 03:23:23 | 3.99 |
| 1900-01-01 03:23:28 | 3.99 |
| 1900-01-01 03:23:33 | 3.99 |
| 1900-01-01 03:23:38 | 4 |
| 1900-01-01 03:23:43 | 3.99 |
| 1900-01-01 03:23:48 | 3.99 |
| 1900-01-01 03:23:53 | 3.98 |
| 1900-01-01 03:23:58 | 3.99 |
| 1900-01-01 03:24:03 | 3.99 |
| 1900-01-01 03:24:08 | 4 |
| 1900-01-01 03:24:13 | 3.99 |
| 1900-01-01 03:24:18 | 3.99 |
| 1900-01-01 03:24:23 | 4 |
| 1900-01-01 03:24:28 | 3.99 |
| 1900-01-01 03:24:33 | 3.99 |
| 1900-01-01 03:24:38 | 3.99 |
| 1900-01-01 03:24:43 | 3.99 |
| 1900-01-01 03:24:48 | 4 |
| 1900-01-01 03:24:53 | 4 |
| 1900-01-01 03:24:58 | 3.99 |
| 1900-01-01 03:25:03 | 4 |
| 1900-01-01 03:25:08 | 3.98 |
| 1900-01-01 03:25:13 | 3.99 |
| 1900-01-01 03:25:18 | 3.99 |
| 1900-01-01 03:25:23 | 3.99 |
| 1900-01-01 03:25:28 | 3.99 |
| 1900-01-01 03:25:33 | 3.99 |
| 1900-01-01 03:25:38 | 3.99 |
| 1900-01-01 03:25:43 | 3.98 |
| 1900-01-01 03:25:48 | 3.99 |
| 1900-01-01 03:25:53 | 3.99 |
| 1900-01-01 03:25:58 | 3.99 |
| 1900-01-01 03:26:03 | 3.99 |
| 1900-01-01 03:26:08 | 3.98 |
| 1900-01-01 03:26:13 | 3.98 |
| 1900-01-01 03:26:18 | 3.99 |
| 1900-01-01 03:26:23 | 3.99 |
| 1900-01-01 03:26:28 | 3.99 |
| 1900-01-01 03:26:33 | 3.99 |
| 1900-01-01 03:26:38 | 3.99 |
| 1900-01-01 03:26:43 | 3.99 |
| 1900-01-01 03:26:48 | 3.99 |
| 1900-01-01 03:26:53 | 3.99 |
| 1900-01-01 03:26:58 | 3.99 |
| 1900-01-01 03:27:03 | 3.99 |
| 1900-01-01 03:27:08 | 3.99 |
| 1900-01-01 03:27:13 | 4 |
| 1900-01-01 03:27:18 | 3.99 |
| 1900-01-01 03:27:23 | 3.99 |
| 1900-01-01 03:27:28 | 3.99 |
| 1900-01-01 03:27:33 | 3.99 |
| 1900-01-01 03:27:38 | 3.99 |
| 1900-01-01 03:27:43 | 3.99 |
| 1900-01-01 03:27:48 | 3.99 |
| 1900-01-01 03:27:53 | 3.98 |
| 1900-01-01 03:27:58 | 3.99 |
| 1900-01-01 03:28:03 | 3.99 |
| 1900-01-01 03:28:08 | 3.99 |
| 1900-01-01 03:28:13 | 3.99 |
| 1900-01-01 03:28:18 | 3.99 |
| 1900-01-01 03:28:23 | 3.99 |
| 1900-01-01 03:28:28 | 3.98 |
| 1900-01-01 03:28:33 | 3.99 |
| 1900-01-01 03:28:38 | 3.98 |
| 1900-01-01 03:28:43 | 3.99 |
| 1900-01-01 03:28:48 | 3.98 |
| 1900-01-01 03:28:53 | 3.98 |
| 1900-01-01 03:28:58 | 3.99 |
| 1900-01-01 03:29:03 | 3.99 |
| 1900-01-01 03:29:08 | 3.99 |
| 1900-01-01 03:29:13 | 3.99 |
| 1900-01-01 03:29:18 | 3.99 |
| 1900-01-01 03:29:23 | 3.99 |
| 1900-01-01 03:29:28 | 3.99 |
| 1900-01-01 03:29:33 | 3.99 |
| 1900-01-01 03:29:38 | 3.99 |
| 1900-01-01 03:29:43 | 3.99 |
| 1900-01-01 03:29:48 | 3.99 |
| 1900-01-01 03:29:53 | 3.99 |
| 1900-01-01 03:29:58 | 3.99 |
| 1900-01-01 03:30:03 | 3.99 |
| 1900-01-01 03:30:08 | 3.99 |
| 1900-01-01 03:30:13 | 3.99 |
| 1900-01-01 03:30:18 | 3.98 |
| 1900-01-01 03:30:23 | 3.99 |
| 1900-01-01 03:30:28 | 3.99 |
| 1900-01-01 03:30:33 | 3.99 |
| 1900-01-01 03:30:38 | 3.99 |
| 1900-01-01 03:30:43 | 3.98 |
| 1900-01-01 03:30:48 | 3.99 |
| 1900-01-01 03:30:53 | 3.99 |
| 1900-01-01 03:30:58 | 3.99 |
| 1900-01-01 03:31:03 | 3.99 |
| 1900-01-01 03:31:08 | 3.99 |
| 1900-01-01 03:31:13 | 3.99 |
| 1900-01-01 03:31:18 | 3.99 |
| 1900-01-01 03:31:23 | 3.99 |
| 1900-01-01 03:31:28 | 3.99 |
| 1900-01-01 03:31:33 | 3.99 |
| 1900-01-01 03:31:38 | 3.98 |
| 1900-01-01 03:31:43 | 3.99 |
| 1900-01-01 03:31:48 | 3.99 |
| 1900-01-01 03:31:53 | 3.99 |
| 1900-01-01 03:31:58 | 3.98 |
| 1900-01-01 03:32:03 | 3.98 |
| 1900-01-01 03:32:08 | 3.99 |
| 1900-01-01 03:32:13 | 3.99 |
| 1900-01-01 03:32:18 | 3.99 |
| 1900-01-01 03:32:23 | 3.99 |
| 1900-01-01 03:32:28 | 3.99 |
| 1900-01-01 03:32:33 | 3.99 |
| 1900-01-01 03:32:38 | 3.99 |
| 1900-01-01 03:32:43 | 3.99 |
| 1900-01-01 03:32:48 | 3.99 |
| 1900-01-01 03:32:53 | 3.98 |
| 1900-01-01 03:32:58 | 3.99 |
| 1900-01-01 03:33:03 | 3.98 |
| 1900-01-01 03:33:08 | 3.98 |
| 1900-01-01 03:33:13 | 3.98 |
| 1900-01-01 03:33:18 | 3.99 |
| 1900-01-01 03:33:23 | 3.98 |
| 1900-01-01 03:33:28 | 3.98 |
| 1900-01-01 03:33:33 | 3.99 |
| 1900-01-01 03:33:38 | 3.99 |
| 1900-01-01 03:33:43 | 3.99 |
| 1900-01-01 03:33:48 | 3.98 |
| 1900-01-01 03:33:53 | 3.99 |
| 1900-01-01 03:33:58 | 3.99 |
| 1900-01-01 03:34:03 | 3.98 |
| 1900-01-01 03:34:08 | 3.99 |
| 1900-01-01 03:34:13 | 3.99 |
| 1900-01-01 03:34:18 | 3.99 |
| 1900-01-01 03:34:23 | 3.99 |
| 1900-01-01 03:34:28 | 3.99 |
| 1900-01-01 03:34:33 | 3.99 |
| 1900-01-01 03:34:38 | 3.99 |
| 1900-01-01 03:34:43 | 3.99 |
| 1900-01-01 03:34:48 | 3.99 |
| 1900-01-01 03:34:53 | 3.99 |
| 1900-01-01 03:34:58 | 3.99 |
| 1900-01-01 03:35:03 | 3.99 |
| 1900-01-01 03:35:08 | 3.99 |
| 1900-01-01 03:35:13 | 3.99 |
| 1900-01-01 03:35:18 | 3.99 |
| 1900-01-01 03:35:23 | 3.99 |
| 1900-01-01 03:35:28 | 3.99 |
| 1900-01-01 03:35:33 | 3.98 |
| 1900-01-01 03:35:38 | 3.99 |
| 1900-01-01 03:35:43 | 3.99 |
| 1900-01-01 03:35:48 | 3.99 |
| 1900-01-01 03:35:53 | 3.99 |
| 1900-01-01 03:35:58 | 3.99 |
| 1900-01-01 03:36:03 | 3.99 |
| 1900-01-01 03:36:08 | 3.99 |
| 1900-01-01 03:36:13 | 3.99 |
| 1900-01-01 03:36:18 | 3.99 |
| 1900-01-01 03:36:23 | 3.99 |
| 1900-01-01 03:36:28 | 3.99 |
| 1900-01-01 03:36:33 | 3.99 |
| 1900-01-01 03:36:38 | 3.99 |
| 1900-01-01 03:36:43 | 3.99 |
| 1900-01-01 03:36:48 | 3.99 |
| 1900-01-01 03:36:53 | 3.98 |
| 1900-01-01 03:36:58 | 3.99 |
| 1900-01-01 03:37:03 | 3.99 |
| 1900-01-01 03:37:08 | 3.99 |
| 1900-01-01 03:37:13 | 3.99 |
| 1900-01-01 03:37:18 | 3.99 |
| 1900-01-01 03:37:23 | 3.98 |
| 1900-01-01 03:37:28 | 3.98 |
| 1900-01-01 03:37:33 | 3.99 |
| 1900-01-01 03:37:38 | 3.99 |
| 1900-01-01 03:37:43 | 3.99 |
| 1900-01-01 03:37:48 | 3.99 |
| 1900-01-01 03:37:53 | 3.99 |
| 1900-01-01 03:37:58 | 3.99 |
| 1900-01-01 03:38:03 | 3.99 |
| 1900-01-01 03:38:08 | 3.98 |
| 1900-01-01 03:38:13 | 3.99 |
| 1900-01-01 03:38:18 | 3.99 |
| 1900-01-01 03:38:23 | 3.98 |
| 1900-01-01 03:38:28 | 3.99 |
| 1900-01-01 03:38:33 | 3.99 |
| 1900-01-01 03:38:38 | 3.99 |
| 1900-01-01 03:38:43 | 3.99 |
| 1900-01-01 03:38:48 | 3.99 |
| 1900-01-01 03:38:53 | 3.99 |
| 1900-01-01 03:38:58 | 3.99 |
| 1900-01-01 03:39:03 | 3.99 |
| 1900-01-01 03:39:08 | 3.99 |
| 1900-01-01 03:39:13 | 3.99 |
| 1900-01-01 03:39:18 | 3.99 |
| 1900-01-01 03:39:23 | 3.99 |
| 1900-01-01 03:39:28 | 3.99 |
| 1900-01-01 03:39:33 | 3.99 |
| 1900-01-01 03:39:38 | 3.99 |
| 1900-01-01 03:39:43 | 3.99 |
| 1900-01-01 03:39:48 | 3.99 |
| 1900-01-01 03:39:53 | 3.99 |
| 1900-01-01 03:39:58 | 3.99 |
| 1900-01-01 03:40:03 | 3.99 |
| 1900-01-01 03:40:08 | 3.98 |
| 1900-01-01 03:40:13 | 3.98 |
| 1900-01-01 03:40:18 | 3.98 |
| 1900-01-01 03:40:23 | 3.98 |
| 1900-01-01 03:40:28 | 3.98 |
| 1900-01-01 03:40:33 | 3.98 |
| 1900-01-01 03:40:38 | 3.98 |
| 1900-01-01 03:40:43 | 3.98 |
| 1900-01-01 03:40:48 | 3.98 |
| 1900-01-01 03:40:53 | 3.99 |
| 1900-01-01 03:40:58 | 3.99 |
| 1900-01-01 03:41:03 | 3.99 |
| 1900-01-01 03:41:08 | 3.99 |
| 1900-01-01 03:41:13 | 3.99 |
| 1900-01-01 03:41:18 | 3.99 |
| 1900-01-01 03:41:23 | 3.98 |
| 1900-01-01 03:41:28 | 3.99 |
| 1900-01-01 03:41:33 | 3.99 |
| 1900-01-01 03:41:38 | 3.99 |
| 1900-01-01 03:41:43 | 3.99 |
| 1900-01-01 03:41:48 | 3.99 |
| 1900-01-01 03:41:53 | 3.99 |
| 1900-01-01 03:41:58 | 3.99 |
| 1900-01-01 03:42:03 | 3.98 |
| 1900-01-01 03:42:08 | 3.99 |
| 1900-01-01 03:42:13 | 3.98 |
| 1900-01-01 03:42:18 | 3.98 |
| 1900-01-01 03:42:23 | 3.99 |
| 1900-01-01 03:42:28 | 3.99 |
| 1900-01-01 03:42:33 | 3.99 |
| 1900-01-01 03:42:38 | 3.99 |
| 1900-01-01 03:42:43 | 3.98 |
| 1900-01-01 03:42:48 | 3.99 |
| 1900-01-01 03:42:53 | 3.99 |
| 1900-01-01 03:42:58 | 3.99 |
| 1900-01-01 03:43:03 | 3.99 |
| 1900-01-01 03:43:08 | 3.99 |
| 1900-01-01 03:43:13 | 3.99 |
| 1900-01-01 03:43:18 | 3.99 |
| 1900-01-01 03:43:23 | 3.99 |
| 1900-01-01 03:43:28 | 3.99 |
| 1900-01-01 03:43:33 | 3.99 |
| 1900-01-01 03:43:38 | 3.98 |
| 1900-01-01 03:43:43 | 3.99 |
| 1900-01-01 03:43:48 | 3.99 |
| 1900-01-01 03:43:53 | 3.99 |
| 1900-01-01 03:43:58 | 3.98 |
| 1900-01-01 03:44:03 | 3.99 |
| 1900-01-01 03:44:08 | 3.98 |
| 1900-01-01 03:44:13 | 3.99 |
| 1900-01-01 03:44:18 | 3.98 |
| 1900-01-01 03:44:23 | 3.99 |
| 1900-01-01 03:44:28 | 3.99 |
| 1900-01-01 03:44:33 | 3.99 |
| 1900-01-01 03:44:38 | 3.99 |
| 1900-01-01 03:44:43 | 3.99 |
| 1900-01-01 03:44:48 | 3.99 |
| 1900-01-01 03:44:53 | 3.99 |
| 1900-01-01 03:44:58 | 3.99 |
| 1900-01-01 03:45:03 | 3.98 |
| 1900-01-01 03:45:08 | 3.99 |
| 1900-01-01 03:45:13 | 3.99 |
| 1900-01-01 03:45:18 | 3.98 |
| 1900-01-01 03:45:23 | 3.99 |
| 1900-01-01 03:45:28 | 3.99 |
| 1900-01-01 03:45:33 | 3.99 |
| 1900-01-01 03:45:38 | 3.99 |
| 1900-01-01 03:45:43 | 3.99 |
| 1900-01-01 03:45:48 | 3.99 |
| 1900-01-01 03:45:53 | 3.98 |
| 1900-01-01 03:45:58 | 3.98 |
| 1900-01-01 03:46:03 | 3.99 |
| 1900-01-01 03:46:08 | 3.98 |
| 1900-01-01 03:46:13 | 3.99 |
| 1900-01-01 03:46:18 | 3.99 |
| 1900-01-01 03:46:23 | 3.98 |
| 1900-01-01 03:46:28 | 3.98 |
| 1900-01-01 03:46:33 | 3.99 |
| 1900-01-01 03:46:38 | 3.99 |
| 1900-01-01 03:46:43 | 3.99 |
| 1900-01-01 03:46:48 | 3.99 |
| 1900-01-01 03:46:53 | 3.99 |
| 1900-01-01 03:46:58 | 3.98 |
| 1900-01-01 03:47:03 | 3.98 |
| 1900-01-01 03:47:08 | 3.99 |
| 1900-01-01 03:47:13 | 3.99 |
| 1900-01-01 03:47:18 | 3.99 |
| 1900-01-01 03:47:23 | 3.99 |
| 1900-01-01 03:47:28 | 3.99 |
| 1900-01-01 03:47:33 | 3.99 |
| 1900-01-01 03:47:38 | 3.99 |
| 1900-01-01 03:47:43 | 3.98 |
| 1900-01-01 03:47:48 | 3.98 |
| 1900-01-01 03:47:53 | 3.98 |
| 1900-01-01 03:47:58 | 3.98 |
| 1900-01-01 03:48:03 | 3.98 |
| 1900-01-01 03:48:08 | 3.98 |
| 1900-01-01 03:48:13 | 3.98 |
| 1900-01-01 03:48:18 | 3.98 |
| 1900-01-01 03:48:23 | 3.98 |
| 1900-01-01 03:48:28 | 3.98 |
| 1900-01-01 03:48:33 | 3.98 |
| 1900-01-01 03:48:38 | 3.99 |
| 1900-01-01 03:48:43 | 3.98 |
| 1900-01-01 03:48:48 | 3.99 |
| 1900-01-01 03:48:53 | 3.99 |
| 1900-01-01 03:48:58 | 3.98 |
| 1900-01-01 03:49:03 | 3.99 |
| 1900-01-01 03:49:08 | 3.99 |
| 1900-01-01 03:49:13 | 3.99 |
| 1900-01-01 03:49:18 | 3.99 |
| 1900-01-01 03:49:23 | 3.98 |
| 1900-01-01 03:49:28 | 3.99 |
| 1900-01-01 03:49:33 | 3.98 |
| 1900-01-01 03:49:38 | 3.98 |
| 1900-01-01 03:49:43 | 3.99 |
| 1900-01-01 03:49:48 | 3.99 |
| 1900-01-01 03:49:53 | 3.99 |
| 1900-01-01 03:49:58 | 3.99 |
| 1900-01-01 03:50:03 | 3.99 |
| 1900-01-01 03:50:08 | 3.98 |
| 1900-01-01 03:50:13 | 3.99 |
| 1900-01-01 03:50:18 | 3.99 |
| 1900-01-01 03:50:23 | 3.99 |
| 1900-01-01 03:50:28 | 3.99 |
| 1900-01-01 03:50:33 | 3.99 |
| 1900-01-01 03:50:38 | 3.99 |
| 1900-01-01 03:50:43 | 3.99 |
| 1900-01-01 03:50:48 | 3.99 |
| 1900-01-01 03:50:53 | 3.99 |
| 1900-01-01 03:50:58 | 3.99 |
| 1900-01-01 03:51:03 | 3.99 |
| 1900-01-01 03:51:08 | 3.99 |
| 1900-01-01 03:51:13 | 3.99 |
| 1900-01-01 03:51:18 | 3.99 |
| 1900-01-01 03:51:23 | 3.99 |
| 1900-01-01 03:51:28 | 3.99 |
| 1900-01-01 03:51:33 | 3.99 |
| 1900-01-01 03:51:38 | 3.99 |
| 1900-01-01 03:51:43 | 3.99 |
| 1900-01-01 03:51:48 | 3.98 |
| 1900-01-01 03:51:53 | 3.98 |
| 1900-01-01 03:51:58 | 3.99 |
| 1900-01-01 03:52:03 | 3.98 |
| 1900-01-01 03:52:08 | 3.98 |
| 1900-01-01 03:52:13 | 3.98 |
| 1900-01-01 03:52:18 | 3.98 |
| 1900-01-01 03:52:23 | 3.98 |
| 1900-01-01 03:52:28 | 3.99 |
| 1900-01-01 03:52:33 | 3.99 |
| 1900-01-01 03:52:38 | 3.99 |
| 1900-01-01 03:52:43 | 3.98 |
| 1900-01-01 03:52:48 | 3.98 |
| 1900-01-01 03:52:53 | 3.99 |
| 1900-01-01 03:52:58 | 3.98 |
| 1900-01-01 03:53:03 | 3.98 |
| 1900-01-01 03:53:08 | 3.98 |
| 1900-01-01 03:53:13 | 3.99 |
| 1900-01-01 03:53:18 | 3.99 |
| 1900-01-01 03:53:23 | 3.99 |
| 1900-01-01 03:53:28 | 3.98 |
| 1900-01-01 03:53:33 | 3.99 |
| 1900-01-01 03:53:38 | 3.98 |
| 1900-01-01 03:53:43 | 3.98 |
| 1900-01-01 03:53:48 | 3.98 |
| 1900-01-01 03:53:53 | 3.99 |
| 1900-01-01 03:53:58 | 3.99 |
| 1900-01-01 03:54:03 | 3.99 |
| 1900-01-01 03:54:08 | 3.99 |
| 1900-01-01 03:54:13 | 3.98 |
| 1900-01-01 03:54:18 | 3.99 |
| 1900-01-01 03:54:23 | 3.99 |
| 1900-01-01 03:54:28 | 3.99 |
| 1900-01-01 03:54:33 | 3.99 |
| 1900-01-01 03:54:38 | 3.99 |
| 1900-01-01 03:54:43 | 3.98 |
| 1900-01-01 03:54:48 | 3.98 |
| 1900-01-01 03:54:53 | 3.99 |
| 1900-01-01 03:54:58 | 3.98 |
| 1900-01-01 03:55:03 | 3.98 |
| 1900-01-01 03:55:08 | 3.99 |
| 1900-01-01 03:55:13 | 3.98 |
| 1900-01-01 03:55:18 | 3.98 |
| 1900-01-01 03:55:23 | 3.98 |
| 1900-01-01 03:55:28 | 3.99 |
| 1900-01-01 03:55:33 | 3.99 |
| 1900-01-01 03:55:38 | 3.98 |
| 1900-01-01 03:55:43 | 3.99 |
| 1900-01-01 03:55:48 | 3.98 |
| 1900-01-01 03:55:53 | 3.98 |
| 1900-01-01 03:55:58 | 3.99 |
| 1900-01-01 03:56:03 | 3.98 |
| 1900-01-01 03:56:08 | 3.99 |
| 1900-01-01 03:56:13 | 3.99 |
| 1900-01-01 03:56:18 | 3.98 |
| 1900-01-01 03:56:23 | 3.98 |
| 1900-01-01 03:56:28 | 3.99 |
| 1900-01-01 03:56:33 | 3.98 |
| 1900-01-01 03:56:38 | 3.99 |
| 1900-01-01 03:56:43 | 3.99 |
| 1900-01-01 03:56:48 | 3.99 |
| 1900-01-01 03:56:53 | 3.99 |
| 1900-01-01 03:56:58 | 3.98 |
| 1900-01-01 03:57:03 | 3.98 |
| 1900-01-01 03:57:08 | 3.98 |
| 1900-01-01 03:57:13 | 3.98 |
| 1900-01-01 03:57:18 | 3.98 |
| 1900-01-01 03:57:23 | 3.98 |
| 1900-01-01 03:57:28 | 3.99 |
| 1900-01-01 03:57:33 | 3.98 |
| 1900-01-01 03:57:38 | 3.99 |
| 1900-01-01 03:57:43 | 3.98 |
| 1900-01-01 03:57:48 | 3.98 |
| 1900-01-01 03:57:53 | 3.98 |
| 1900-01-01 03:57:58 | 3.98 |
| 1900-01-01 03:58:03 | 3.98 |
| 1900-01-01 03:58:08 | 3.98 |
| 1900-01-01 03:58:13 | 3.99 |
| 1900-01-01 03:58:18 | 3.98 |
| 1900-01-01 03:58:23 | 3.98 |
| 1900-01-01 03:58:28 | 3.98 |
| 1900-01-01 03:58:33 | 3.98 |
| 1900-01-01 03:58:38 | 3.98 |
| 1900-01-01 03:58:43 | 3.99 |
| 1900-01-01 03:58:48 | 3.98 |
| 1900-01-01 03:58:53 | 3.98 |
| 1900-01-01 03:58:58 | 3.99 |
| 1900-01-01 03:59:03 | 3.99 |
| 1900-01-01 03:59:08 | 3.98 |
| 1900-01-01 03:59:13 | 3.98 |
| 1900-01-01 03:59:18 | 3.99 |
| 1900-01-01 03:59:23 | 3.99 |
| 1900-01-01 03:59:28 | 3.98 |
| 1900-01-01 03:59:33 | 3.98 |
| 1900-01-01 03:59:38 | 3.98 |
| 1900-01-01 03:59:43 | 3.98 |
| 1900-01-01 03:59:48 | 3.98 |
| 1900-01-01 03:59:53 | 3.98 |
| 1900-01-01 03:59:58 | 3.98 |
| 1900-01-01 04:00:03 | 3.98 |
| 1900-01-01 04:00:08 | 3.99 |
| 1900-01-01 04:00:13 | 3.99 |
| 1900-01-01 04:00:18 | 3.98 |
| 1900-01-01 04:00:23 | 3.99 |
| 1900-01-01 04:00:28 | 3.98 |
| 1900-01-01 04:00:33 | 3.98 |
| 1900-01-01 04:00:38 | 3.99 |
| 1900-01-01 04:00:43 | 3.98 |
| 1900-01-01 04:00:48 | 3.98 |
| 1900-01-01 04:00:53 | 3.99 |
| 1900-01-01 04:00:58 | 3.98 |
| 1900-01-01 04:01:03 | 3.98 |
| 1900-01-01 04:01:08 | 3.98 |
| 1900-01-01 04:01:13 | 3.98 |
| 1900-01-01 04:01:18 | 3.98 |
| 1900-01-01 04:01:23 | 3.98 |
| 1900-01-01 04:01:28 | 3.98 |
| 1900-01-01 04:01:33 | 3.98 |
| 1900-01-01 04:01:38 | 3.98 |
| 1900-01-01 04:01:43 | 3.98 |
| 1900-01-01 04:01:48 | 3.99 |
| 1900-01-01 04:01:53 | 3.98 |
| 1900-01-01 04:01:58 | 3.98 |
| 1900-01-01 04:02:03 | 3.98 |
| 1900-01-01 04:02:08 | 3.98 |
| 1900-01-01 04:02:13 | 3.98 |
| 1900-01-01 04:02:18 | 3.99 |
| 1900-01-01 04:02:23 | 3.98 |
| 1900-01-01 04:02:28 | 3.99 |
| 1900-01-01 04:02:33 | 3.98 |
| 1900-01-01 04:02:38 | 3.98 |
| 1900-01-01 04:02:43 | 3.99 |
| 1900-01-01 04:02:48 | 3.98 |
| 1900-01-01 04:02:53 | 3.99 |
| 1900-01-01 04:02:58 | 3.98 |
| 1900-01-01 04:03:03 | 3.98 |
| 1900-01-01 04:03:08 | 3.98 |
| 1900-01-01 04:03:13 | 3.99 |
| 1900-01-01 04:03:18 | 3.98 |
| 1900-01-01 04:03:23 | 3.99 |
| 1900-01-01 04:03:28 | 3.98 |
| 1900-01-01 04:03:33 | 3.98 |
| 1900-01-01 04:03:38 | 3.98 |
| 1900-01-01 04:03:43 | 3.98 |
| 1900-01-01 04:03:48 | 3.99 |
| 1900-01-01 04:03:53 | 3.99 |
| 1900-01-01 04:03:58 | 3.98 |
| 1900-01-01 04:04:03 | 3.98 |
| 1900-01-01 04:04:08 | 3.98 |
| 1900-01-01 04:04:13 | 3.98 |
| 1900-01-01 04:04:18 | 3.98 |
| 1900-01-01 04:04:23 | 3.99 |
| 1900-01-01 04:04:28 | 3.98 |
| 1900-01-01 04:04:33 | 3.98 |
| 1900-01-01 04:04:38 | 3.98 |
| 1900-01-01 04:04:43 | 3.98 |
| 1900-01-01 04:04:48 | 3.98 |
| 1900-01-01 04:04:53 | 3.99 |
| 1900-01-01 04:04:58 | 3.98 |
| 1900-01-01 04:05:03 | 3.98 |
| 1900-01-01 04:05:08 | 3.98 |
| 1900-01-01 04:05:13 | 3.98 |
| 1900-01-01 04:05:18 | 3.98 |
| 1900-01-01 04:05:23 | 3.98 |
| 1900-01-01 04:05:28 | 3.98 |
| 1900-01-01 04:05:33 | 3.98 |
| 1900-01-01 04:05:38 | 3.98 |
| 1900-01-01 04:05:43 | 3.98 |
| 1900-01-01 04:05:48 | 3.98 |
| 1900-01-01 04:05:53 | 3.98 |
| 1900-01-01 04:05:58 | 3.98 |
| 1900-01-01 04:06:03 | 3.98 |
| 1900-01-01 04:06:08 | 3.98 |
| 1900-01-01 04:06:13 | 3.98 |
| 1900-01-01 04:06:18 | 3.98 |
| 1900-01-01 04:06:23 | 3.98 |
| 1900-01-01 04:06:28 | 3.98 |
| 1900-01-01 04:06:33 | 3.98 |
| 1900-01-01 04:06:38 | 3.98 |
| 1900-01-01 04:06:43 | 3.98 |
| 1900-01-01 04:06:48 | 3.98 |
| 1900-01-01 04:06:53 | 3.98 |
| 1900-01-01 04:06:58 | 3.98 |
| 1900-01-01 04:07:03 | 3.98 |
| 1900-01-01 04:07:08 | 3.98 |
| 1900-01-01 04:07:13 | 3.98 |
| 1900-01-01 04:07:18 | 3.98 |
| 1900-01-01 04:07:23 | 3.98 |
| 1900-01-01 04:07:28 | 3.98 |
| 1900-01-01 04:07:33 | 3.98 |
| 1900-01-01 04:07:38 | 3.98 |
| 1900-01-01 04:07:43 | 3.98 |
| 1900-01-01 04:07:48 | 3.98 |
| 1900-01-01 04:07:53 | 3.98 |
| 1900-01-01 04:07:58 | 3.98 |
| 1900-01-01 04:08:03 | 3.98 |
| 1900-01-01 04:08:08 | 3.98 |
| 1900-01-01 04:08:13 | 3.98 |
| 1900-01-01 04:08:18 | 3.98 |
| 1900-01-01 04:08:23 | 3.98 |
| 1900-01-01 04:08:28 | 3.98 |
| 1900-01-01 04:08:33 | 3.98 |
| 1900-01-01 04:08:38 | 3.98 |
| 1900-01-01 04:08:43 | 3.98 |
| 1900-01-01 04:08:48 | 3.98 |
| 1900-01-01 04:08:53 | 3.98 |
| 1900-01-01 04:08:58 | 3.98 |
| 1900-01-01 04:09:03 | 3.98 |
| 1900-01-01 04:09:08 | 3.98 |
| 1900-01-01 04:09:13 | 3.98 |
| 1900-01-01 04:09:18 | 3.98 |
| 1900-01-01 04:09:23 | 3.98 |
| 1900-01-01 04:09:28 | 3.98 |
| 1900-01-01 04:09:33 | 3.98 |
| 1900-01-01 04:09:38 | 3.98 |
| 1900-01-01 04:09:43 | 3.98 |
| 1900-01-01 04:09:48 | 3.98 |
| 1900-01-01 04:09:53 | 3.98 |
| 1900-01-01 04:09:58 | 3.98 |
| 1900-01-01 04:10:03 | 3.98 |
| 1900-01-01 04:10:08 | 3.98 |
| 1900-01-01 04:10:13 | 3.98 |
| 1900-01-01 04:10:18 | 3.98 |
| 1900-01-01 04:10:23 | 3.98 |
| 1900-01-01 04:10:28 | 3.98 |
| 1900-01-01 04:10:33 | 3.98 |
| 1900-01-01 04:10:38 | 3.98 |
| 1900-01-01 04:10:43 | 3.98 |
| 1900-01-01 04:10:48 | 3.98 |
| 1900-01-01 04:10:53 | 3.98 |
| 1900-01-01 04:10:58 | 3.98 |
| 1900-01-01 04:11:03 | 3.98 |
| 1900-01-01 04:11:08 | 3.98 |
| 1900-01-01 04:11:13 | 3.98 |
| 1900-01-01 04:11:18 | 3.98 |
| 1900-01-01 04:11:23 | 3.98 |
| 1900-01-01 04:11:28 | 3.98 |
| 1900-01-01 04:11:33 | 3.98 |
| 1900-01-01 04:11:38 | 3.98 |
| 1900-01-01 04:11:43 | 3.98 |
| 1900-01-01 04:11:48 | 3.98 |
| 1900-01-01 04:11:53 | 3.98 |
| 1900-01-01 04:11:58 | 3.98 |
| 1900-01-01 04:12:03 | 3.98 |
| 1900-01-01 04:12:08 | 3.98 |
| 1900-01-01 04:12:13 | 3.98 |
| 1900-01-01 04:12:18 | 3.98 |
| 1900-01-01 04:12:23 | 3.98 |
| 1900-01-01 04:12:28 | 3.98 |
| 1900-01-01 04:12:33 | 3.98 |
| 1900-01-01 04:12:38 | 3.98 |
| 1900-01-01 04:12:43 | 3.98 |
| 1900-01-01 04:12:48 | 3.98 |
| 1900-01-01 04:12:53 | 3.98 |
| 1900-01-01 04:12:58 | 3.98 |
| 1900-01-01 04:13:03 | 3.98 |
| 1900-01-01 04:13:08 | 3.98 |
| 1900-01-01 04:13:13 | 3.98 |
| 1900-01-01 04:13:18 | 3.98 |
| 1900-01-01 04:13:23 | 3.98 |
| 1900-01-01 04:13:28 | 3.98 |
| 1900-01-01 04:13:33 | 3.98 |
| 1900-01-01 04:13:38 | 3.98 |
| 1900-01-01 04:13:43 | 3.98 |
| 1900-01-01 04:13:48 | 3.98 |
| 1900-01-01 04:13:53 | 3.98 |
| 1900-01-01 04:13:58 | 3.98 |
| 1900-01-01 04:14:03 | 3.98 |
| 1900-01-01 04:14:08 | 3.98 |
| 1900-01-01 04:14:13 | 3.98 |
| 1900-01-01 04:14:18 | 3.98 |
| 1900-01-01 04:14:23 | 3.98 |
| 1900-01-01 04:14:28 | 3.98 |
| 1900-01-01 04:14:33 | 3.98 |
| 1900-01-01 04:14:38 | 3.98 |
| 1900-01-01 04:14:43 | 3.98 |
| 1900-01-01 04:14:48 | 3.98 |
| 1900-01-01 04:14:53 | 3.98 |
| 1900-01-01 04:14:58 | 3.98 |
| 1900-01-01 04:15:03 | 3.98 |
| 1900-01-01 04:15:08 | 3.98 |
| 1900-01-01 04:15:13 | 3.98 |
| 1900-01-01 04:15:18 | 3.98 |
| 1900-01-01 04:15:23 | 3.98 |
| 1900-01-01 04:15:28 | 3.98 |
| 1900-01-01 04:15:33 | 3.98 |
| 1900-01-01 04:15:38 | 3.98 |
| 1900-01-01 04:15:43 | 3.98 |
| 1900-01-01 04:15:48 | 3.98 |
| 1900-01-01 04:15:53 | 3.98 |
| 1900-01-01 04:15:58 | 3.98 |
| 1900-01-01 04:16:03 | 3.97 |
| 1900-01-01 04:16:08 | 3.98 |
| 1900-01-01 04:16:13 | 3.98 |
| 1900-01-01 04:16:18 | 3.98 |
| 1900-01-01 04:16:23 | 3.98 |
| 1900-01-01 04:16:28 | 3.98 |
| 1900-01-01 04:16:33 | 3.98 |
| 1900-01-01 04:16:38 | 3.98 |
| 1900-01-01 04:16:43 | 3.98 |
| 1900-01-01 04:16:48 | 3.97 |
| 1900-01-01 04:16:53 | 3.97 |
| 1900-01-01 04:16:58 | 3.98 |
| 1900-01-01 04:17:03 | 3.97 |
| 1900-01-01 04:17:08 | 3.97 |
| 1900-01-01 04:17:13 | 3.98 |
| 1900-01-01 04:17:18 | 3.98 |
| 1900-01-01 04:17:23 | 3.98 |
| 1900-01-01 04:17:28 | 3.98 |
| 1900-01-01 04:17:33 | 3.98 |
| 1900-01-01 04:17:38 | 3.98 |
| 1900-01-01 04:17:43 | 3.98 |
| 1900-01-01 04:17:48 | 3.98 |
| 1900-01-01 04:17:53 | 3.98 |
| 1900-01-01 04:17:58 | 3.98 |
| 1900-01-01 04:18:03 | 3.98 |
| 1900-01-01 04:18:08 | 3.98 |
| 1900-01-01 04:18:13 | 3.98 |
| 1900-01-01 04:18:18 | 3.98 |
| 1900-01-01 04:18:23 | 3.98 |
| 1900-01-01 04:18:28 | 3.98 |
| 1900-01-01 04:18:33 | 3.98 |
| 1900-01-01 04:18:38 | 3.98 |
| 1900-01-01 04:18:43 | 3.98 |
| 1900-01-01 04:18:48 | 3.98 |
| 1900-01-01 04:18:53 | 3.98 |
| 1900-01-01 04:18:58 | 3.98 |
| 1900-01-01 04:19:03 | 3.98 |
| 1900-01-01 04:19:08 | 3.98 |
| 1900-01-01 04:19:13 | 3.98 |
| 1900-01-01 04:19:18 | 3.98 |
| 1900-01-01 04:19:23 | 3.98 |
| 1900-01-01 04:19:28 | 3.98 |
| 1900-01-01 04:19:33 | 3.98 |
| 1900-01-01 04:19:38 | 3.97 |
| 1900-01-01 04:19:43 | 3.97 |
| 1900-01-01 04:19:48 | 3.97 |
| 1900-01-01 04:19:53 | 3.98 |
| 1900-01-01 04:19:58 | 3.97 |
| 1900-01-01 04:20:03 | 3.98 |
| 1900-01-01 04:20:08 | 3.97 |
| 1900-01-01 04:20:13 | 3.97 |
| 1900-01-01 04:20:18 | 3.97 |
| 1900-01-01 04:20:23 | 3.97 |
| 1900-01-01 04:20:28 | 3.97 |
| 1900-01-01 04:20:33 | 3.97 |
| 1900-01-01 04:20:38 | 3.98 |
| 1900-01-01 04:20:43 | 3.98 |
| 1900-01-01 04:20:48 | 3.98 |
| 1900-01-01 04:20:53 | 3.98 |
| 1900-01-01 04:20:58 | 3.98 |
| 1900-01-01 04:21:03 | 3.98 |
| 1900-01-01 04:21:08 | 3.98 |
| 1900-01-01 04:21:13 | 3.98 |
| 1900-01-01 04:21:18 | 3.98 |
| 1900-01-01 04:21:23 | 3.98 |
| 1900-01-01 04:21:28 | 3.98 |
| 1900-01-01 04:21:33 | 3.98 |
| 1900-01-01 04:21:38 | 3.98 |
| 1900-01-01 04:21:43 | 3.97 |
| 1900-01-01 04:21:48 | 3.98 |
| 1900-01-01 04:21:53 | 3.98 |
| 1900-01-01 04:21:58 | 3.98 |
| 1900-01-01 04:22:03 | 3.98 |
| 1900-01-01 04:22:08 | 3.98 |
| 1900-01-01 04:22:13 | 3.98 |
| 1900-01-01 04:22:18 | 3.98 |
| 1900-01-01 04:22:23 | 3.98 |
| 1900-01-01 04:22:28 | 3.98 |
| 1900-01-01 04:22:33 | 3.98 |
| 1900-01-01 04:22:38 | 3.98 |
| 1900-01-01 04:22:43 | 3.97 |
| 1900-01-01 04:22:48 | 3.97 |
| 1900-01-01 04:22:53 | 3.97 |
| 1900-01-01 04:22:58 | 3.98 |
| 1900-01-01 04:23:03 | 3.98 |
| 1900-01-01 04:23:08 | 3.98 |
| 1900-01-01 04:23:13 | 3.98 |
| 1900-01-01 04:23:18 | 3.97 |
| 1900-01-01 04:23:23 | 3.97 |
| 1900-01-01 04:23:28 | 3.97 |
| 1900-01-01 04:23:33 | 3.97 |
| 1900-01-01 04:23:38 | 3.98 |
| 1900-01-01 04:23:43 | 3.98 |
| 1900-01-01 04:23:48 | 3.98 |
| 1900-01-01 04:23:53 | 3.98 |
| 1900-01-01 04:23:58 | 3.98 |
| 1900-01-01 04:24:03 | 3.98 |
| 1900-01-01 04:24:08 | 3.98 |
| 1900-01-01 04:24:13 | 3.98 |
| 1900-01-01 04:24:18 | 3.98 |
| 1900-01-01 04:24:23 | 3.98 |
| 1900-01-01 04:24:28 | 3.98 |
| 1900-01-01 04:24:33 | 3.98 |
| 1900-01-01 04:24:38 | 3.98 |
| 1900-01-01 04:24:43 | 3.98 |
| 1900-01-01 04:24:48 | 3.98 |
| 1900-01-01 04:24:53 | 3.98 |
| 1900-01-01 04:24:58 | 3.98 |
| 1900-01-01 04:25:03 | 3.98 |
| 1900-01-01 04:25:08 | 3.98 |
| 1900-01-01 04:25:13 | 3.98 |
| 1900-01-01 04:25:18 | 3.98 |
| 1900-01-01 04:25:23 | 3.98 |
| 1900-01-01 04:25:28 | 3.98 |
| 1900-01-01 04:25:33 | 3.98 |
| 1900-01-01 04:25:38 | 3.98 |
| 1900-01-01 04:25:43 | 3.98 |
| 1900-01-01 04:25:48 | 3.98 |
| 1900-01-01 04:25:53 | 3.98 |
| 1900-01-01 04:25:58 | 3.98 |
| 1900-01-01 04:26:03 | 3.98 |
| 1900-01-01 04:26:08 | 3.97 |
| 1900-01-01 04:26:13 | 3.98 |
| 1900-01-01 04:26:18 | 3.98 |
| 1900-01-01 04:26:23 | 3.97 |
| 1900-01-01 04:26:28 | 3.98 |
| 1900-01-01 04:26:33 | 3.98 |
| 1900-01-01 04:26:38 | 3.98 |
| 1900-01-01 04:26:43 | 3.98 |
| 1900-01-01 04:26:48 | 3.98 |
| 1900-01-01 04:26:53 | 3.98 |
| 1900-01-01 04:26:58 | 3.98 |
| 1900-01-01 04:27:03 | 3.98 |
| 1900-01-01 04:27:08 | 3.98 |
| 1900-01-01 04:27:13 | 3.98 |
| 1900-01-01 04:27:18 | 3.98 |
| 1900-01-01 04:27:23 | 3.98 |
| 1900-01-01 04:27:28 | 3.98 |
| 1900-01-01 04:27:33 | 3.98 |
| 1900-01-01 04:27:38 | 3.98 |
| 1900-01-01 04:27:43 | 3.98 |
| 1900-01-01 04:27:48 | 3.98 |
| 1900-01-01 04:27:53 | 3.98 |
| 1900-01-01 04:27:58 | 3.98 |
| 1900-01-01 04:28:03 | 3.98 |
| 1900-01-01 04:28:08 | 3.98 |
| 1900-01-01 04:28:13 | 3.98 |
| 1900-01-01 04:28:18 | 3.98 |
| 1900-01-01 04:28:23 | 3.98 |
| 1900-01-01 04:28:28 | 3.98 |
| 1900-01-01 04:28:33 | 3.98 |
| 1900-01-01 04:28:38 | 3.98 |
| 1900-01-01 04:28:43 | 3.98 |
| 1900-01-01 04:28:48 | 3.98 |
| 1900-01-01 04:28:53 | 3.97 |
| 1900-01-01 04:28:58 | 3.97 |
| 1900-01-01 04:29:03 | 3.97 |
| 1900-01-01 04:29:08 | 3.97 |
| 1900-01-01 04:29:13 | 3.97 |
| 1900-01-01 04:29:18 | 3.98 |
| 1900-01-01 04:29:23 | 3.97 |
| 1900-01-01 04:29:28 | 3.97 |
| 1900-01-01 04:29:33 | 3.98 |
| 1900-01-01 04:29:38 | 3.98 |
| 1900-01-01 04:29:43 | 3.98 |
| 1900-01-01 04:29:48 | 3.98 |
| 1900-01-01 04:29:53 | 3.98 |
| 1900-01-01 04:29:58 | 3.98 |
| 1900-01-01 04:30:03 | 3.98 |
| 1900-01-01 04:30:08 | 3.98 |
| 1900-01-01 04:30:13 | 3.98 |
| 1900-01-01 04:30:18 | 3.98 |
| 1900-01-01 04:30:23 | 3.98 |
| 1900-01-01 04:30:28 | 3.98 |
| 1900-01-01 04:30:33 | 3.98 |
| 1900-01-01 04:30:38 | 3.98 |
| 1900-01-01 04:30:43 | 3.98 |
| 1900-01-01 04:30:48 | 3.98 |
| 1900-01-01 04:30:53 | 3.98 |
| 1900-01-01 04:30:58 | 3.98 |
| 1900-01-01 04:31:03 | 3.98 |
| 1900-01-01 04:31:08 | 3.98 |
| 1900-01-01 04:31:13 | 3.98 |
| 1900-01-01 04:31:18 | 3.98 |
| 1900-01-01 04:31:23 | 3.98 |
| 1900-01-01 04:31:28 | 3.98 |
| 1900-01-01 04:31:33 | 3.98 |
| 1900-01-01 04:31:38 | 3.98 |
| 1900-01-01 04:31:43 | 3.98 |
| 1900-01-01 04:31:48 | 3.98 |
| 1900-01-01 04:31:53 | 3.98 |
| 1900-01-01 04:31:58 | 3.98 |
| 1900-01-01 04:32:03 | 3.98 |
| 1900-01-01 04:32:08 | 3.98 |
| 1900-01-01 04:32:13 | 3.98 |
| 1900-01-01 04:32:18 | 3.98 |
| 1900-01-01 04:32:23 | 3.98 |
| 1900-01-01 04:32:28 | 3.98 |
| 1900-01-01 04:32:33 | 3.98 |
| 1900-01-01 04:32:38 | 3.98 |
| 1900-01-01 04:32:43 | 3.98 |
| 1900-01-01 04:32:48 | 3.98 |
| 1900-01-01 04:32:53 | 3.98 |
| 1900-01-01 04:32:58 | 3.98 |
| 1900-01-01 04:33:03 | 3.98 |
| 1900-01-01 04:33:08 | 3.98 |
| 1900-01-01 04:33:13 | 3.98 |
| 1900-01-01 04:33:18 | 3.98 |
| 1900-01-01 04:33:23 | 3.98 |
| 1900-01-01 04:33:28 | 3.98 |
| 1900-01-01 04:33:33 | 3.98 |
| 1900-01-01 04:33:38 | 3.98 |
| 1900-01-01 04:33:43 | 3.98 |
| 1900-01-01 04:33:48 | 3.98 |
| 1900-01-01 04:33:53 | 3.98 |
| 1900-01-01 04:33:58 | 3.98 |
| 1900-01-01 04:34:03 | 3.98 |
| 1900-01-01 04:34:08 | 3.98 |
| 1900-01-01 04:34:13 | 3.98 |
| 1900-01-01 04:34:18 | 3.98 |
| 1900-01-01 04:34:23 | 3.98 |
| 1900-01-01 04:34:28 | 3.98 |
| 1900-01-01 04:34:33 | 3.98 |
| 1900-01-01 04:34:38 | 3.98 |
| 1900-01-01 04:34:43 | 3.98 |
| 1900-01-01 04:34:48 | 3.98 |
| 1900-01-01 04:34:53 | 3.98 |
| 1900-01-01 04:34:58 | 3.98 |
| 1900-01-01 04:35:03 | 3.97 |
| 1900-01-01 04:35:08 | 3.97 |
| 1900-01-01 04:35:13 | 3.97 |
| 1900-01-01 04:35:18 | 3.97 |
| 1900-01-01 04:35:23 | 3.97 |
| 1900-01-01 04:35:28 | 3.97 |
| 1900-01-01 04:35:33 | 3.97 |
| 1900-01-01 04:35:38 | 3.97 |
| 1900-01-01 04:35:43 | 3.97 |
| 1900-01-01 04:35:48 | 3.97 |
| 1900-01-01 04:35:53 | 3.97 |
| 1900-01-01 04:35:58 | 3.97 |
| 1900-01-01 04:36:03 | 3.97 |
| 1900-01-01 04:36:08 | 3.97 |
| 1900-01-01 04:36:13 | 3.97 |
| 1900-01-01 04:36:18 | 3.98 |
| 1900-01-01 04:36:23 | 3.97 |
| 1900-01-01 04:36:28 | 3.97 |
| 1900-01-01 04:36:33 | 3.98 |
| 1900-01-01 04:36:38 | 3.98 |
| 1900-01-01 04:36:43 | 3.98 |
| 1900-01-01 04:36:48 | 3.98 |
| 1900-01-01 04:36:53 | 3.98 |
| 1900-01-01 04:36:58 | 3.98 |
| 1900-01-01 04:37:03 | 3.98 |
| 1900-01-01 04:37:08 | 3.98 |
| 1900-01-01 04:37:13 | 3.98 |
| 1900-01-01 04:37:18 | 3.98 |
| 1900-01-01 04:37:23 | 3.98 |
| 1900-01-01 04:37:28 | 3.98 |
| 1900-01-01 04:37:33 | 3.98 |
| 1900-01-01 04:37:38 | 3.98 |
| 1900-01-01 04:37:43 | 3.98 |
| 1900-01-01 04:37:48 | 3.98 |
| 1900-01-01 04:37:53 | 3.98 |
| 1900-01-01 04:37:58 | 3.98 |
| 1900-01-01 04:38:03 | 3.98 |
| 1900-01-01 04:38:08 | 3.98 |
| 1900-01-01 04:38:13 | 3.98 |
| 1900-01-01 04:38:18 | 3.98 |
| 1900-01-01 04:38:23 | 3.98 |
| 1900-01-01 04:38:28 | 3.98 |
| 1900-01-01 04:38:33 | 3.98 |
| 1900-01-01 04:38:38 | 3.98 |
| 1900-01-01 04:38:43 | 3.98 |
| 1900-01-01 04:38:48 | 3.98 |
| 1900-01-01 04:38:53 | 3.98 |
| 1900-01-01 04:38:58 | 3.98 |
| 1900-01-01 04:39:03 | 3.98 |
| 1900-01-01 04:39:08 | 3.98 |
| 1900-01-01 04:39:13 | 3.98 |
| 1900-01-01 04:39:18 | 3.98 |
| 1900-01-01 04:39:23 | 3.98 |
| 1900-01-01 04:39:28 | 3.98 |
| 1900-01-01 04:39:33 | 3.98 |
| 1900-01-01 04:39:38 | 3.98 |
| 1900-01-01 04:39:43 | 3.98 |
| 1900-01-01 04:39:48 | 3.98 |
| 1900-01-01 04:39:53 | 3.98 |
| 1900-01-01 04:39:58 | 3.98 |
| 1900-01-01 04:40:03 | 3.98 |
| 1900-01-01 04:40:08 | 3.98 |
| 1900-01-01 04:40:13 | 3.98 |
| 1900-01-01 04:40:18 | 3.98 |
| 1900-01-01 04:40:23 | 3.98 |
| 1900-01-01 04:40:28 | 3.98 |
| 1900-01-01 04:40:33 | 3.98 |
| 1900-01-01 04:40:38 | 3.98 |
| 1900-01-01 04:40:43 | 3.98 |
| 1900-01-01 04:40:48 | 3.98 |
| 1900-01-01 04:40:53 | 3.98 |
| 1900-01-01 04:40:58 | 3.98 |
| 1900-01-01 04:41:03 | 3.98 |
| 1900-01-01 04:41:08 | 3.98 |
| 1900-01-01 04:41:13 | 3.98 |
| 1900-01-01 04:41:18 | 3.98 |
| 1900-01-01 04:41:23 | 3.97 |
| 1900-01-01 04:41:28 | 3.97 |
| 1900-01-01 04:41:33 | 3.98 |
| 1900-01-01 04:41:38 | 3.97 |
| 1900-01-01 04:41:43 | 3.97 |
| 1900-01-01 04:41:48 | 3.97 |
| 1900-01-01 04:41:53 | 3.98 |
| 1900-01-01 04:41:58 | 3.98 |
| 1900-01-01 04:42:03 | 3.97 |
| 1900-01-01 04:42:08 | 3.98 |
| 1900-01-01 04:42:13 | 3.98 |
| 1900-01-01 04:42:18 | 3.98 |
| 1900-01-01 04:42:23 | 3.98 |
| 1900-01-01 04:42:28 | 3.98 |
| 1900-01-01 04:42:33 | 3.98 |
| 1900-01-01 04:42:38 | 3.98 |
| 1900-01-01 04:42:43 | 3.98 |
| 1900-01-01 04:42:48 | 3.97 |
| 1900-01-01 04:42:53 | 3.98 |
| 1900-01-01 04:42:58 | 3.98 |
| 1900-01-01 04:43:03 | 3.97 |
| 1900-01-01 04:43:08 | 3.98 |
| 1900-01-01 04:43:13 | 3.97 |
| 1900-01-01 04:43:18 | 3.97 |
| 1900-01-01 04:43:23 | 3.97 |
| 1900-01-01 04:43:28 | 3.97 |
| 1900-01-01 04:43:33 | 3.98 |
| 1900-01-01 04:43:38 | 3.98 |
| 1900-01-01 04:43:43 | 3.97 |
| 1900-01-01 04:43:48 | 3.97 |
| 1900-01-01 04:43:53 | 3.98 |
| 1900-01-01 04:43:58 | 3.98 |
| 1900-01-01 04:44:03 | 3.98 |
| 1900-01-01 04:44:08 | 3.98 |
| 1900-01-01 04:44:13 | 3.98 |
| 1900-01-01 04:44:18 | 3.98 |
| 1900-01-01 04:44:23 | 3.98 |
| 1900-01-01 04:44:28 | 3.98 |
| 1900-01-01 04:44:33 | 3.98 |
| 1900-01-01 04:44:38 | 3.98 |
| 1900-01-01 04:44:43 | 3.97 |
| 1900-01-01 04:44:48 | 3.98 |
| 1900-01-01 04:44:53 | 3.98 |
| 1900-01-01 04:44:58 | 3.98 |
| 1900-01-01 04:45:03 | 3.98 |
| 1900-01-01 04:45:08 | 3.98 |
| 1900-01-01 04:45:13 | 3.98 |
| 1900-01-01 04:45:18 | 3.98 |
| 1900-01-01 04:45:23 | 3.98 |
| 1900-01-01 04:45:28 | 3.98 |
| 1900-01-01 04:45:33 | 3.98 |
| 1900-01-01 04:45:38 | 3.98 |
| 1900-01-01 04:45:43 | 3.98 |
| 1900-01-01 04:45:48 | 3.98 |
| 1900-01-01 04:45:53 | 3.98 |
| 1900-01-01 04:45:58 | 3.98 |
| 1900-01-01 04:46:03 | 3.98 |
| 1900-01-01 04:46:08 | 3.98 |
| 1900-01-01 04:46:13 | 3.98 |
| 1900-01-01 04:46:18 | 3.98 |
| 1900-01-01 04:46:23 | 3.98 |
| 1900-01-01 04:46:28 | 3.98 |
| 1900-01-01 04:46:33 | 3.98 |
| 1900-01-01 04:46:38 | 3.98 |
| 1900-01-01 04:46:43 | 3.98 |
| 1900-01-01 04:46:48 | 3.98 |
| 1900-01-01 04:46:53 | 3.98 |
| 1900-01-01 04:46:58 | 3.98 |
| 1900-01-01 04:47:03 | 3.98 |
| 1900-01-01 04:47:08 | 3.98 |
| 1900-01-01 04:47:13 | 3.98 |
| 1900-01-01 04:47:18 | 3.98 |
| 1900-01-01 04:47:23 | 3.98 |
| 1900-01-01 04:47:28 | 3.98 |
| 1900-01-01 04:47:33 | 3.98 |
| 1900-01-01 04:47:38 | 3.98 |
| 1900-01-01 04:47:43 | 3.98 |
| 1900-01-01 04:47:48 | 3.98 |
| 1900-01-01 04:47:53 | 3.98 |
| 1900-01-01 04:47:58 | 3.97 |
| 1900-01-01 04:48:03 | 3.97 |
| 1900-01-01 04:48:08 | 3.98 |
| 1900-01-01 04:48:13 | 3.98 |
| 1900-01-01 04:48:18 | 3.98 |
| 1900-01-01 04:48:23 | 3.98 |
| 1900-01-01 04:48:28 | 3.97 |
| 1900-01-01 04:48:33 | 3.97 |
| 1900-01-01 04:48:38 | 3.97 |
| 1900-01-01 04:48:43 | 3.98 |
| 1900-01-01 04:48:48 | 3.98 |
| 1900-01-01 04:48:53 | 3.98 |
| 1900-01-01 04:48:58 | 3.98 |
| 1900-01-01 04:49:03 | 3.98 |
| 1900-01-01 04:49:08 | 3.98 |
| 1900-01-01 04:49:13 | 3.98 |
| 1900-01-01 04:49:18 | 3.98 |
| 1900-01-01 04:49:23 | 3.98 |
| 1900-01-01 04:49:28 | 3.98 |
| 1900-01-01 04:49:33 | 3.98 |
| 1900-01-01 04:49:38 | 3.98 |
| 1900-01-01 04:49:43 | 3.98 |
| 1900-01-01 04:49:48 | 3.97 |
| 1900-01-01 04:49:53 | 3.98 |
| 1900-01-01 04:49:58 | 3.98 |
| 1900-01-01 04:50:03 | 3.98 |
| 1900-01-01 04:50:08 | 3.98 |
| 1900-01-01 04:50:13 | 3.98 |
| 1900-01-01 04:50:18 | 3.98 |
| 1900-01-01 04:50:23 | 3.98 |
| 1900-01-01 04:50:28 | 3.98 |
| 1900-01-01 04:50:33 | 3.98 |
| 1900-01-01 04:50:38 | 3.98 |
| 1900-01-01 04:50:43 | 3.98 |
| 1900-01-01 04:50:48 | 3.98 |
| 1900-01-01 04:50:53 | 3.98 |
| 1900-01-01 04:50:58 | 3.96 |
| 1900-01-01 04:51:03 | 3.97 |
| 1900-01-01 04:51:08 | 3.97 |
| 1900-01-01 04:51:13 | 3.98 |
| 1900-01-01 04:51:18 | 3.97 |
| 1900-01-01 04:51:23 | 3.98 |
| 1900-01-01 04:51:28 | 3.98 |
| 1900-01-01 04:51:33 | 3.98 |
| 1900-01-01 04:51:38 | 3.97 |
| 1900-01-01 04:51:43 | 3.98 |
| 1900-01-01 04:51:48 | 3.98 |
| 1900-01-01 04:51:53 | 3.98 |
| 1900-01-01 04:51:58 | 3.98 |
| 1900-01-01 04:52:03 | 3.98 |
| 1900-01-01 04:52:08 | 3.98 |
| 1900-01-01 04:52:13 | 3.98 |
| 1900-01-01 04:52:18 | 3.98 |
| 1900-01-01 04:52:23 | 3.98 |
| 1900-01-01 04:52:28 | 3.98 |
| 1900-01-01 04:52:33 | 3.98 |
| 1900-01-01 04:52:38 | 3.98 |
| 1900-01-01 04:52:43 | 3.97 |
| 1900-01-01 04:52:48 | 3.97 |
| 1900-01-01 04:52:53 | 3.98 |
| 1900-01-01 04:52:58 | 3.98 |
| 1900-01-01 04:53:03 | 3.98 |
| 1900-01-01 04:53:08 | 3.98 |
| 1900-01-01 04:53:13 | 3.98 |
| 1900-01-01 04:53:18 | 3.98 |
| 1900-01-01 04:53:23 | 3.98 |
| 1900-01-01 04:53:28 | 3.98 |
| 1900-01-01 04:53:33 | 3.98 |
| 1900-01-01 04:53:38 | 3.98 |
| 1900-01-01 04:53:43 | 3.98 |
| 1900-01-01 04:53:48 | 3.98 |
| 1900-01-01 04:53:53 | 3.98 |
| 1900-01-01 04:53:58 | 3.98 |
| 1900-01-01 04:54:03 | 3.98 |
| 1900-01-01 04:54:08 | 3.97 |
| 1900-01-01 04:54:13 | 3.98 |
| 1900-01-01 04:54:18 | 3.98 |
| 1900-01-01 04:54:23 | 3.98 |
| 1900-01-01 04:54:28 | 3.98 |
| 1900-01-01 04:54:33 | 3.98 |
| 1900-01-01 04:54:38 | 3.98 |
| 1900-01-01 04:54:43 | 3.96 |
| 1900-01-01 04:54:48 | 3.97 |
| 1900-01-01 04:54:53 | 3.96 |
| 1900-01-01 04:54:58 | 3.96 |
| 1900-01-01 04:55:03 | 3.98 |
| 1900-01-01 04:55:08 | 3.98 |
| 1900-01-01 04:55:13 | 3.98 |
| 1900-01-01 04:55:18 | 3.97 |
| 1900-01-01 04:55:23 | 3.96 |
| 1900-01-01 04:55:28 | 3.96 |
| 1900-01-01 04:55:33 | 3.96 |
| 1900-01-01 04:55:38 | 3.96 |
| 1900-01-01 04:55:43 | 3.96 |
| 1900-01-01 04:55:48 | 3.96 |
| 1900-01-01 04:55:53 | 3.98 |
| 1900-01-01 04:55:58 | 3.98 |
| 1900-01-01 04:56:03 | 3.98 |
| 1900-01-01 04:56:08 | 3.98 |
| 1900-01-01 04:56:13 | 3.98 |
| 1900-01-01 04:56:18 | 3.98 |
| 1900-01-01 04:56:23 | 3.96 |
| 1900-01-01 04:56:28 | 3.96 |
| 1900-01-01 04:56:33 | 3.98 |
| 1900-01-01 04:56:38 | 3.97 |
| 1900-01-01 04:56:43 | 3.98 |
| 1900-01-01 04:56:48 | 3.98 |
| 1900-01-01 04:56:53 | 3.97 |
| 1900-01-01 04:56:58 | 3.98 |
| 1900-01-01 04:57:03 | 3.98 |
| 1900-01-01 04:57:08 | 3.98 |
| 1900-01-01 04:57:13 | 3.98 |
| 1900-01-01 04:57:18 | 3.98 |
| 1900-01-01 04:57:23 | 3.98 |
| 1900-01-01 04:57:28 | 3.98 |
| 1900-01-01 04:57:33 | 3.98 |
| 1900-01-01 04:57:38 | 3.98 |
| 1900-01-01 04:57:43 | 3.98 |
| 1900-01-01 04:57:48 | 3.98 |
| 1900-01-01 04:57:53 | 3.98 |
| 1900-01-01 04:57:58 | 3.98 |
| 1900-01-01 04:58:03 | 3.98 |
| 1900-01-01 04:58:08 | 3.98 |
| 1900-01-01 04:58:13 | 3.97 |
| 1900-01-01 04:58:18 | 3.97 |
| 1900-01-01 04:58:23 | 3.98 |
| 1900-01-01 04:58:28 | 3.98 |
| 1900-01-01 04:58:33 | 3.97 |
| 1900-01-01 04:58:38 | 3.96 |
| 1900-01-01 04:58:43 | 3.98 |
| 1900-01-01 04:58:48 | 3.98 |
| 1900-01-01 04:58:53 | 3.96 |
| 1900-01-01 04:58:58 | 3.97 |
| 1900-01-01 04:59:03 | 3.98 |
| 1900-01-01 04:59:08 | 3.96 |
| 1900-01-01 04:59:13 | 3.97 |
| 1900-01-01 04:59:18 | 3.97 |
| 1900-01-01 04:59:23 | 3.97 |
| 1900-01-01 04:59:28 | 3.97 |
| 1900-01-01 04:59:33 | 3.98 |
| 1900-01-01 04:59:38 | 3.97 |
| 1900-01-01 04:59:43 | 3.97 |
| 1900-01-01 04:59:48 | 3.97 |
| 1900-01-01 04:59:53 | 3.96 |
| 1900-01-01 04:59:58 | 3.96 |
| 1900-01-01 05:00:03 | 3.96 |
| 1900-01-01 05:00:08 | 3.98 |
| 1900-01-01 05:00:13 | 3.97 |
| 1900-01-01 05:00:18 | 3.98 |
| 1900-01-01 05:00:23 | 3.96 |
| 1900-01-01 05:00:28 | 3.97 |
| 1900-01-01 05:00:33 | 3.97 |
| 1900-01-01 05:00:38 | 3.97 |
| 1900-01-01 05:00:43 | 3.97 |
| 1900-01-01 05:00:48 | 3.98 |
| 1900-01-01 05:00:53 | 3.97 |
| 1900-01-01 05:00:58 | 3.97 |
| 1900-01-01 05:01:03 | 3.97 |
| 1900-01-01 05:01:08 | 3.97 |
| 1900-01-01 05:01:13 | 3.97 |
| 1900-01-01 05:01:18 | 3.98 |
| 1900-01-01 05:01:23 | 3.98 |
| 1900-01-01 05:01:28 | 3.98 |
| 1900-01-01 05:01:33 | 3.97 |
| 1900-01-01 05:01:38 | 3.98 |
| 1900-01-01 05:01:43 | 3.97 |
| 1900-01-01 05:01:48 | 3.97 |
| 1900-01-01 05:01:53 | 3.98 |
| 1900-01-01 05:01:58 | 3.98 |
| 1900-01-01 05:02:03 | 3.97 |
| 1900-01-01 05:02:08 | 3.97 |
| 1900-01-01 05:02:13 | 3.97 |
| 1900-01-01 05:02:18 | 3.97 |
| 1900-01-01 05:02:23 | 3.97 |
| 1900-01-01 05:02:28 | 3.97 |
| 1900-01-01 05:02:33 | 3.97 |
| 1900-01-01 05:02:38 | 3.97 |
| 1900-01-01 05:02:43 | 3.98 |
| 1900-01-01 05:02:48 | 3.97 |
| 1900-01-01 05:02:53 | 3.98 |
| 1900-01-01 05:02:58 | 3.97 |
| 1900-01-01 05:03:03 | 3.98 |
| 1900-01-01 05:03:08 | 3.97 |
| 1900-01-01 05:03:13 | 3.97 |
| 1900-01-01 05:03:18 | 3.97 |
| 1900-01-01 05:03:23 | 3.98 |
| 1900-01-01 05:03:28 | 3.97 |
| 1900-01-01 05:03:33 | 3.97 |
| 1900-01-01 05:03:38 | 3.97 |
| 1900-01-01 05:03:43 | 3.97 |
| 1900-01-01 05:03:48 | 3.97 |
| 1900-01-01 05:03:53 | 3.97 |
| 1900-01-01 05:03:58 | 3.97 |
| 1900-01-01 05:04:03 | 3.97 |
| 1900-01-01 05:04:08 | 3.96 |
| 1900-01-01 05:04:13 | 3.96 |
| 1900-01-01 05:04:18 | 3.96 |
| 1900-01-01 05:04:23 | 3.96 |
| 1900-01-01 05:04:28 | 3.96 |
| 1900-01-01 05:04:33 | 3.97 |
| 1900-01-01 05:04:38 | 3.97 |
| 1900-01-01 05:04:43 | 3.97 |
| 1900-01-01 05:04:48 | 3.97 |
| 1900-01-01 05:04:53 | 3.97 |
| 1900-01-01 05:04:58 | 3.97 |
| 1900-01-01 05:05:03 | 3.97 |
| 1900-01-01 05:05:08 | 3.98 |
| 1900-01-01 05:05:13 | 3.96 |
| 1900-01-01 05:05:18 | 3.97 |
| 1900-01-01 05:05:23 | 3.96 |
| 1900-01-01 05:05:28 | 3.96 |
| 1900-01-01 05:05:33 | 3.96 |
| 1900-01-01 05:05:38 | 3.96 |
| 1900-01-01 05:05:43 | 3.96 |
| 1900-01-01 05:05:48 | 3.96 |
| 1900-01-01 05:05:53 | 3.96 |
| 1900-01-01 05:05:58 | 3.96 |
| 1900-01-01 05:06:03 | 3.97 |
| 1900-01-01 05:06:08 | 3.97 |
| 1900-01-01 05:06:13 | 3.97 |
| 1900-01-01 05:06:18 | 3.97 |
| 1900-01-01 05:06:23 | 3.97 |
| 1900-01-01 05:06:28 | 3.97 |
| 1900-01-01 05:06:33 | 3.97 |
| 1900-01-01 05:06:38 | 3.97 |
| 1900-01-01 05:06:43 | 3.97 |
| 1900-01-01 05:06:48 | 3.97 |
| 1900-01-01 05:06:53 | 3.97 |
| 1900-01-01 05:06:58 | 3.97 |
| 1900-01-01 05:07:03 | 3.97 |
| 1900-01-01 05:07:08 | 3.96 |
| 1900-01-01 05:07:13 | 3.96 |
| 1900-01-01 05:07:18 | 3.96 |
| 1900-01-01 05:07:23 | 3.96 |
| 1900-01-01 05:07:28 | 3.96 |
| 1900-01-01 05:07:33 | 3.97 |
| 1900-01-01 05:07:38 | 3.97 |
| 1900-01-01 05:07:43 | 3.97 |
| 1900-01-01 05:07:48 | 3.97 |
| 1900-01-01 05:07:53 | 3.97 |
| 1900-01-01 05:07:58 | 3.96 |
| 1900-01-01 05:08:03 | 3.96 |
| 1900-01-01 05:08:08 | 3.96 |
| 1900-01-01 05:08:13 | 3.96 |
| 1900-01-01 05:08:18 | 3.97 |
| 1900-01-01 05:08:23 | 3.97 |
| 1900-01-01 05:08:28 | 3.97 |
| 1900-01-01 05:08:33 | 3.97 |
| 1900-01-01 05:08:38 | 3.97 |
| 1900-01-01 05:08:43 | 3.97 |
| 1900-01-01 05:08:48 | 3.97 |
| 1900-01-01 05:08:53 | 3.96 |
| 1900-01-01 05:08:58 | 3.97 |
| 1900-01-01 05:09:03 | 3.97 |
| 1900-01-01 05:09:08 | 3.97 |
| 1900-01-01 05:09:13 | 3.97 |
| 1900-01-01 05:09:18 | 3.97 |
| 1900-01-01 05:09:23 | 3.97 |
| 1900-01-01 05:09:28 | 3.97 |
| 1900-01-01 05:09:33 | 3.96 |
| 1900-01-01 05:09:38 | 3.96 |
| 1900-01-01 05:09:43 | 3.96 |
| 1900-01-01 05:09:48 | 3.97 |
| 1900-01-01 05:09:53 | 3.97 |
| 1900-01-01 05:09:58 | 3.97 |
| 1900-01-01 05:10:03 | 3.96 |
| 1900-01-01 05:10:08 | 3.97 |
| 1900-01-01 05:10:13 | 3.96 |
| 1900-01-01 05:10:18 | 3.97 |
| 1900-01-01 05:10:23 | 3.97 |
| 1900-01-01 05:10:28 | 3.97 |
| 1900-01-01 05:10:33 | 3.97 |
| 1900-01-01 05:10:38 | 3.97 |
| 1900-01-01 05:10:43 | 3.97 |
| 1900-01-01 05:10:48 | 3.97 |
| 1900-01-01 05:10:53 | 3.97 |
| 1900-01-01 05:10:58 | 3.97 |
| 1900-01-01 05:11:03 | 3.96 |
| 1900-01-01 05:11:08 | 3.96 |
| 1900-01-01 05:11:13 | 3.96 |
| 1900-01-01 05:11:18 | 3.97 |
| 1900-01-01 05:11:23 | 3.96 |
| 1900-01-01 05:11:28 | 3.97 |
| 1900-01-01 05:11:33 | 3.97 |
| 1900-01-01 05:11:38 | 3.97 |
| 1900-01-01 05:11:43 | 3.97 |
| 1900-01-01 05:11:48 | 3.97 |
| 1900-01-01 05:11:53 | 3.97 |
| 1900-01-01 05:11:58 | 3.97 |
| 1900-01-01 05:12:03 | 3.96 |
| 1900-01-01 05:12:08 | 3.97 |
| 1900-01-01 05:12:13 | 3.97 |
| 1900-01-01 05:12:18 | 3.97 |
| 1900-01-01 05:12:23 | 3.97 |
| 1900-01-01 05:12:28 | 3.97 |
| 1900-01-01 05:12:33 | 3.97 |
| 1900-01-01 05:12:38 | 3.97 |
| 1900-01-01 05:12:43 | 3.96 |
| 1900-01-01 05:12:48 | 3.96 |
| 1900-01-01 05:12:53 | 3.97 |
| 1900-01-01 05:12:58 | 3.96 |
| 1900-01-01 05:13:03 | 3.97 |
| 1900-01-01 05:13:08 | 3.97 |
| 1900-01-01 05:13:13 | 3.97 |
| 1900-01-01 05:13:18 | 3.97 |
| 1900-01-01 05:13:23 | 3.96 |
| 1900-01-01 05:13:28 | 3.96 |
| 1900-01-01 05:13:33 | 3.97 |
| 1900-01-01 05:13:38 | 3.97 |
| 1900-01-01 05:13:43 | 3.97 |
| 1900-01-01 05:13:48 | 3.97 |
| 1900-01-01 05:13:53 | 3.97 |
| 1900-01-01 05:13:58 | 3.97 |
| 1900-01-01 05:14:03 | 3.97 |
| 1900-01-01 05:14:08 | 3.97 |
| 1900-01-01 05:14:13 | 3.97 |
| 1900-01-01 05:14:18 | 3.97 |
| 1900-01-01 05:14:23 | 3.97 |
| 1900-01-01 05:14:28 | 3.97 |
| 1900-01-01 05:14:33 | 3.97 |
| 1900-01-01 05:14:38 | 3.97 |
| 1900-01-01 05:14:43 | 3.97 |
| 1900-01-01 05:14:48 | 3.96 |
| 1900-01-01 05:14:53 | 3.96 |
| 1900-01-01 05:14:58 | 3.97 |
| 1900-01-01 05:15:03 | 3.96 |
| 1900-01-01 05:15:08 | 3.97 |
| 1900-01-01 05:15:13 | 3.97 |
| 1900-01-01 05:15:18 | 3.97 |
| 1900-01-01 05:15:23 | 3.97 |
| 1900-01-01 05:15:28 | 3.96 |
| 1900-01-01 05:15:33 | 3.96 |
| 1900-01-01 05:15:38 | 3.96 |
| 1900-01-01 05:15:43 | 3.96 |
| 1900-01-01 05:15:48 | 3.96 |
| 1900-01-01 05:15:53 | 3.96 |
| 1900-01-01 05:15:58 | 3.96 |
| 1900-01-01 05:16:03 | 3.97 |
| 1900-01-01 05:16:08 | 3.97 |
| 1900-01-01 05:16:13 | 3.97 |
| 1900-01-01 05:16:18 | 3.97 |
| 1900-01-01 05:16:23 | 3.97 |
| 1900-01-01 05:16:28 | 3.97 |
| 1900-01-01 05:16:33 | 3.97 |
| 1900-01-01 05:16:38 | 3.97 |
| 1900-01-01 05:16:43 | 3.97 |
| 1900-01-01 05:16:48 | 3.97 |
| 1900-01-01 05:16:53 | 3.97 |
| 1900-01-01 05:16:58 | 3.97 |
| 1900-01-01 05:17:03 | 3.97 |
| 1900-01-01 05:17:08 | 3.97 |
| 1900-01-01 05:17:13 | 3.97 |
| 1900-01-01 05:17:18 | 3.97 |
| 1900-01-01 05:17:23 | 3.96 |
| 1900-01-01 05:17:28 | 3.97 |
| 1900-01-01 05:17:33 | 3.97 |
| 1900-01-01 05:17:38 | 3.97 |
| 1900-01-01 05:17:43 | 3.97 |
| 1900-01-01 05:17:48 | 3.96 |
| 1900-01-01 05:17:53 | 3.97 |
| 1900-01-01 05:17:58 | 3.97 |
| 1900-01-01 05:18:03 | 3.97 |
| 1900-01-01 05:18:08 | 3.96 |
| 1900-01-01 05:18:13 | 3.97 |
| 1900-01-01 05:18:18 | 3.96 |
| 1900-01-01 05:18:23 | 3.97 |
| 1900-01-01 05:18:28 | 3.97 |
| 1900-01-01 05:18:33 | 3.97 |
| 1900-01-01 05:18:38 | 3.97 |
| 1900-01-01 05:18:43 | 3.97 |
| 1900-01-01 05:18:48 | 3.97 |
| 1900-01-01 05:18:53 | 3.97 |
| 1900-01-01 05:18:58 | 3.97 |
| 1900-01-01 05:19:03 | 3.97 |
| 1900-01-01 05:19:08 | 3.97 |
| 1900-01-01 05:19:13 | 3.97 |
| 1900-01-01 05:19:18 | 3.97 |
| 1900-01-01 05:19:23 | 3.97 |
| 1900-01-01 05:19:28 | 3.97 |
| 1900-01-01 05:19:33 | 3.96 |
| 1900-01-01 05:19:38 | 3.96 |
| 1900-01-01 05:19:43 | 3.96 |
| 1900-01-01 05:19:48 | 3.97 |
| 1900-01-01 05:19:53 | 3.97 |
| 1900-01-01 05:19:58 | 3.97 |
| 1900-01-01 05:20:03 | 3.97 |
| 1900-01-01 05:20:08 | 3.97 |
| 1900-01-01 05:20:13 | 3.97 |
| 1900-01-01 05:20:18 | 3.97 |
| 1900-01-01 05:20:23 | 3.96 |
| 1900-01-01 05:20:28 | 3.96 |
| 1900-01-01 05:20:33 | 3.97 |
| 1900-01-01 05:20:38 | 3.97 |
| 1900-01-01 05:20:43 | 3.97 |
| 1900-01-01 05:20:48 | 3.97 |
| 1900-01-01 05:20:53 | 3.97 |
| 1900-01-01 05:20:58 | 3.97 |
| 1900-01-01 05:21:03 | 3.96 |
| 1900-01-01 05:21:08 | 3.96 |
| 1900-01-01 05:21:13 | 3.97 |
| 1900-01-01 05:21:18 | 3.97 |
| 1900-01-01 05:21:23 | 3.96 |
| 1900-01-01 05:21:28 | 3.97 |
| 1900-01-01 05:21:33 | 3.96 |
| 1900-01-01 05:21:38 | 3.96 |
| 1900-01-01 05:21:43 | 3.96 |
| 1900-01-01 05:21:48 | 3.97 |
| 1900-01-01 05:21:53 | 3.97 |
| 1900-01-01 05:21:58 | 3.97 |
| 1900-01-01 05:22:03 | 3.96 |
| 1900-01-01 05:22:08 | 3.96 |
| 1900-01-01 05:22:13 | 3.96 |
| 1900-01-01 05:22:18 | 3.96 |
| 1900-01-01 05:22:23 | 3.96 |
| 1900-01-01 05:22:28 | 3.96 |
| 1900-01-01 05:22:33 | 3.97 |
| 1900-01-01 05:22:38 | 3.97 |
| 1900-01-01 05:22:43 | 3.96 |
| 1900-01-01 05:22:48 | 3.96 |
| 1900-01-01 05:22:53 | 3.97 |
| 1900-01-01 05:22:58 | 3.96 |
| 1900-01-01 05:23:03 | 3.97 |
| 1900-01-01 05:23:08 | 3.97 |
| 1900-01-01 05:23:13 | 3.97 |
| 1900-01-01 05:23:18 | 3.97 |
| 1900-01-01 05:23:23 | 3.97 |
| 1900-01-01 05:23:28 | 3.97 |
| 1900-01-01 05:23:33 | 3.97 |
| 1900-01-01 05:23:38 | 3.97 |
| 1900-01-01 05:23:43 | 3.98 |
| 1900-01-01 05:23:48 | 3.97 |
| 1900-01-01 05:23:53 | 3.97 |
| 1900-01-01 05:23:58 | 3.97 |
| 1900-01-01 05:24:03 | 3.97 |
| 1900-01-01 05:24:08 | 3.97 |
| 1900-01-01 05:24:13 | 3.96 |
| 1900-01-01 05:24:18 | 3.97 |
| 1900-01-01 05:24:23 | 3.97 |
| 1900-01-01 05:24:28 | 3.97 |
| 1900-01-01 05:24:33 | 3.97 |
| 1900-01-01 05:24:38 | 3.97 |
| 1900-01-01 05:24:43 | 3.96 |
| 1900-01-01 05:24:48 | 3.96 |
| 1900-01-01 05:24:53 | 3.98 |
| 1900-01-01 05:24:58 | 3.97 |
| 1900-01-01 05:25:03 | 3.97 |
| 1900-01-01 05:25:08 | 3.97 |
| 1900-01-01 05:25:13 | 3.97 |
| 1900-01-01 05:25:18 | 3.97 |
| 1900-01-01 05:25:23 | 3.96 |
| 1900-01-01 05:25:28 | 3.98 |
| 1900-01-01 05:25:33 | 3.97 |
| 1900-01-01 05:25:38 | 3.97 |
| 1900-01-01 05:25:43 | 3.96 |
| 1900-01-01 05:25:48 | 3.97 |
| 1900-01-01 05:25:53 | 3.97 |
| 1900-01-01 05:25:58 | 3.97 |
| 1900-01-01 05:26:03 | 3.97 |
| 1900-01-01 05:26:08 | 3.97 |
| 1900-01-01 05:26:13 | 3.97 |
| 1900-01-01 05:26:18 | 3.97 |
| 1900-01-01 05:26:23 | 3.97 |
| 1900-01-01 05:26:28 | 3.97 |
| 1900-01-01 05:26:33 | 3.97 |
| 1900-01-01 05:26:38 | 3.97 |
| 1900-01-01 05:26:43 | 3.97 |
| 1900-01-01 05:26:48 | 3.97 |
| 1900-01-01 05:26:53 | 3.97 |
| 1900-01-01 05:26:58 | 3.97 |
| 1900-01-01 05:27:03 | 3.97 |
| 1900-01-01 05:27:08 | 3.96 |
| 1900-01-01 05:27:13 | 3.97 |
| 1900-01-01 05:27:18 | 3.96 |
| 1900-01-01 05:27:23 | 3.96 |
| 1900-01-01 05:27:28 | 3.97 |
| 1900-01-01 05:27:33 | 3.96 |
| 1900-01-01 05:27:38 | 3.97 |
| 1900-01-01 05:27:43 | 3.97 |
| 1900-01-01 05:27:48 | 3.97 |
| 1900-01-01 05:27:53 | 3.96 |
| 1900-01-01 05:27:58 | 3.97 |
| 1900-01-01 05:28:03 | 3.97 |
| 1900-01-01 05:28:08 | 3.97 |
| 1900-01-01 05:28:13 | 3.97 |
| 1900-01-01 05:28:18 | 3.97 |
| 1900-01-01 05:28:23 | 3.97 |
| 1900-01-01 05:28:28 | 3.97 |
| 1900-01-01 05:28:33 | 3.97 |
| 1900-01-01 05:28:38 | 3.97 |
| 1900-01-01 05:28:43 | 3.97 |
| 1900-01-01 05:28:48 | 3.97 |
| 1900-01-01 05:28:53 | 3.97 |
| 1900-01-01 05:28:58 | 3.97 |
| 1900-01-01 05:29:03 | 3.97 |
| 1900-01-01 05:29:08 | 3.97 |
| 1900-01-01 05:29:13 | 3.97 |
| 1900-01-01 05:29:18 | 3.97 |
| 1900-01-01 05:29:23 | 3.97 |
| 1900-01-01 05:29:28 | 3.97 |
| 1900-01-01 05:29:33 | 3.97 |
| 1900-01-01 05:29:38 | 3.97 |
| 1900-01-01 05:29:43 | 3.97 |
| 1900-01-01 05:29:48 | 3.97 |
| 1900-01-01 05:29:53 | 3.97 |
| 1900-01-01 05:29:58 | 3.97 |
| 1900-01-01 05:30:03 | 3.97 |
| 1900-01-01 05:30:08 | 3.97 |
| 1900-01-01 05:30:13 | 3.97 |
| 1900-01-01 05:30:18 | 3.97 |
| 1900-01-01 05:30:23 | 3.97 |
| 1900-01-01 05:30:28 | 3.97 |
| 1900-01-01 05:30:33 | 3.97 |
| 1900-01-01 05:30:38 | 3.97 |
| 1900-01-01 05:30:43 | 3.97 |
| 1900-01-01 05:30:48 | 3.96 |
| 1900-01-01 05:30:53 | 3.98 |
| 1900-01-01 05:30:58 | 3.96 |
| 1900-01-01 05:31:03 | 3.97 |
| 1900-01-01 05:31:08 | 3.96 |
| 1900-01-01 05:31:13 | 3.98 |
| 1900-01-01 05:31:18 | 3.97 |
| 1900-01-01 05:31:23 | 3.96 |
| 1900-01-01 05:31:28 | 3.96 |
| 1900-01-01 05:31:33 | 3.96 |
| 1900-01-01 05:31:38 | 3.97 |
| 1900-01-01 05:31:43 | 3.97 |
| 1900-01-01 05:31:48 | 3.97 |
| 1900-01-01 05:31:53 | 3.97 |
| 1900-01-01 05:31:58 | 3.97 |
| 1900-01-01 05:32:03 | 3.97 |
| 1900-01-01 05:32:08 | 3.97 |
| 1900-01-01 05:32:13 | 3.98 |
| 1900-01-01 05:32:18 | 3.96 |
| 1900-01-01 05:32:23 | 3.97 |
| 1900-01-01 05:32:28 | 3.96 |
| 1900-01-01 05:32:33 | 3.96 |
| 1900-01-01 05:32:38 | 3.96 |
| 1900-01-01 05:32:43 | 3.96 |
| 1900-01-01 05:32:48 | 3.96 |
| 1900-01-01 05:32:53 | 3.96 |
| 1900-01-01 05:32:58 | 3.97 |
| 1900-01-01 05:33:03 | 3.96 |
| 1900-01-01 05:33:08 | 3.97 |
| 1900-01-01 05:33:13 | 3.97 |
| 1900-01-01 05:33:18 | 3.97 |
| 1900-01-01 05:33:23 | 3.97 |
| 1900-01-01 05:33:28 | 3.96 |
| 1900-01-01 05:33:33 | 3.96 |
| 1900-01-01 05:33:38 | 3.96 |
| 1900-01-01 05:33:43 | 3.96 |
| 1900-01-01 05:33:48 | 3.97 |
| 1900-01-01 05:33:53 | 3.97 |
| 1900-01-01 05:33:58 | 3.97 |
| 1900-01-01 05:34:03 | 3.97 |
| 1900-01-01 05:34:08 | 3.97 |
| 1900-01-01 05:34:13 | 3.97 |
| 1900-01-01 05:34:18 | 3.97 |
| 1900-01-01 05:34:23 | 3.97 |
| 1900-01-01 05:34:28 | 3.96 |
| 1900-01-01 05:34:33 | 3.98 |
| 1900-01-01 05:34:38 | 3.97 |
| 1900-01-01 05:34:43 | 3.96 |
| 1900-01-01 05:34:48 | 3.97 |
| 1900-01-01 05:34:53 | 3.98 |
| 1900-01-01 05:34:58 | 3.97 |
| 1900-01-01 05:35:03 | 3.97 |
| 1900-01-01 05:35:08 | 3.97 |
| 1900-01-01 05:35:13 | 3.97 |
| 1900-01-01 05:35:18 | 3.97 |
| 1900-01-01 05:35:23 | 3.97 |
| 1900-01-01 05:35:28 | 3.96 |
| 1900-01-01 05:35:33 | 3.96 |
| 1900-01-01 05:35:38 | 3.96 |
| 1900-01-01 05:35:43 | 3.97 |
| 1900-01-01 05:35:48 | 3.97 |
| 1900-01-01 05:35:53 | 3.97 |
| 1900-01-01 05:35:58 | 3.97 |
| 1900-01-01 05:36:03 | 3.97 |
| 1900-01-01 05:36:08 | 3.96 |
| 1900-01-01 05:36:13 | 3.96 |
| 1900-01-01 05:36:18 | 3.96 |
| 1900-01-01 05:36:23 | 3.97 |
| 1900-01-01 05:36:28 | 3.97 |
| 1900-01-01 05:36:33 | 3.98 |
| 1900-01-01 05:36:38 | 3.97 |
| 1900-01-01 05:36:43 | 3.96 |
| 1900-01-01 05:36:48 | 3.97 |
| 1900-01-01 05:36:53 | 3.96 |
| 1900-01-01 05:36:58 | 3.96 |
| 1900-01-01 05:37:03 | 3.96 |
| 1900-01-01 05:37:08 | 3.96 |
| 1900-01-01 05:37:13 | 3.96 |
| 1900-01-01 05:37:18 | 3.97 |
| 1900-01-01 05:37:23 | 3.97 |
| 1900-01-01 05:37:28 | 3.97 |
| 1900-01-01 05:37:33 | 3.97 |
| 1900-01-01 05:37:38 | 3.98 |
| 1900-01-01 05:37:43 | 3.96 |
| 1900-01-01 05:37:48 | 3.97 |
| 1900-01-01 05:37:53 | 3.96 |
| 1900-01-01 05:37:58 | 3.96 |
| 1900-01-01 05:38:03 | 3.97 |
| 1900-01-01 05:38:08 | 3.97 |
| 1900-01-01 05:38:13 | 3.96 |
| 1900-01-01 05:38:18 | 3.98 |
| 1900-01-01 05:38:23 | 3.97 |
| 1900-01-01 05:38:28 | 3.97 |
| 1900-01-01 05:38:33 | 3.97 |
| 1900-01-01 05:38:38 | 3.97 |
| 1900-01-01 05:38:43 | 3.97 |
| 1900-01-01 05:38:48 | 3.96 |
| 1900-01-01 05:38:53 | 3.96 |
| 1900-01-01 05:38:58 | 3.96 |
| 1900-01-01 05:39:03 | 3.96 |
| 1900-01-01 05:39:08 | 3.97 |
| 1900-01-01 05:39:13 | 3.97 |
| 1900-01-01 05:39:18 | 3.97 |
| 1900-01-01 05:39:23 | 3.96 |
| 1900-01-01 05:39:28 | 3.97 |
| 1900-01-01 05:39:33 | 3.96 |
| 1900-01-01 05:39:38 | 3.96 |
| 1900-01-01 05:39:43 | 3.96 |
| 1900-01-01 05:39:48 | 3.96 |
| 1900-01-01 05:39:53 | 3.97 |
| 1900-01-01 05:39:58 | 3.97 |
| 1900-01-01 05:40:03 | 3.96 |
| 1900-01-01 05:40:08 | 3.97 |
| 1900-01-01 05:40:13 | 3.96 |
| 1900-01-01 05:40:18 | 3.96 |
| 1900-01-01 05:40:23 | 3.96 |
| 1900-01-01 05:40:28 | 3.96 |
| 1900-01-01 05:40:33 | 3.96 |
| 1900-01-01 05:40:38 | 3.96 |
| 1900-01-01 05:40:43 | 3.97 |
| 1900-01-01 05:40:48 | 3.96 |
| 1900-01-01 05:40:53 | 3.96 |
| 1900-01-01 05:40:58 | 3.97 |
| 1900-01-01 05:41:03 | 3.97 |
| 1900-01-01 05:41:08 | 3.96 |
| 1900-01-01 05:41:13 | 3.97 |
| 1900-01-01 05:41:18 | 3.96 |
| 1900-01-01 05:41:23 | 3.96 |
| 1900-01-01 05:41:28 | 3.96 |
| 1900-01-01 05:41:33 | 3.97 |
| 1900-01-01 05:41:38 | 3.96 |
| 1900-01-01 05:41:43 | 3.96 |
| 1900-01-01 05:41:48 | 3.97 |
| 1900-01-01 05:41:53 | 3.97 |
| 1900-01-01 05:41:58 | 3.96 |
| 1900-01-01 05:42:03 | 3.96 |
| 1900-01-01 05:42:08 | 3.96 |
| 1900-01-01 05:42:13 | 3.97 |
| 1900-01-01 05:42:18 | 3.96 |
| 1900-01-01 05:42:23 | 3.96 |
| 1900-01-01 05:42:28 | 3.96 |
| 1900-01-01 05:42:33 | 3.97 |
| 1900-01-01 05:42:38 | 3.98 |
| 1900-01-01 05:42:43 | 3.97 |
| 1900-01-01 05:42:48 | 3.98 |
| 1900-01-01 05:42:53 | 3.96 |
| 1900-01-01 05:42:58 | 3.97 |
| 1900-01-01 05:43:03 | 3.96 |
| 1900-01-01 05:43:08 | 3.96 |
| 1900-01-01 05:43:13 | 3.96 |
| 1900-01-01 05:43:18 | 3.97 |
| 1900-01-01 05:43:23 | 3.97 |
| 1900-01-01 05:43:28 | 3.96 |
| 1900-01-01 05:43:33 | 3.97 |
| 1900-01-01 05:43:38 | 3.97 |
| 1900-01-01 05:43:43 | 3.97 |
| 1900-01-01 05:43:48 | 3.98 |
| 1900-01-01 05:43:53 | 3.98 |
| 1900-01-01 05:43:58 | 3.96 |
| 1900-01-01 05:44:03 | 3.98 |
| 1900-01-01 05:44:08 | 3.96 |
| 1900-01-01 05:44:13 | 3.96 |
| 1900-01-01 05:44:18 | 3.96 |
| 1900-01-01 05:44:23 | 3.97 |
| 1900-01-01 05:44:28 | 3.96 |
| 1900-01-01 05:44:33 | 3.97 |
| 1900-01-01 05:44:38 | 3.97 |
| 1900-01-01 05:44:43 | 3.96 |
| 1900-01-01 05:44:48 | 3.96 |
| 1900-01-01 05:44:53 | 3.96 |
| 1900-01-01 05:44:58 | 3.96 |
| 1900-01-01 05:45:03 | 3.97 |
| 1900-01-01 05:45:08 | 3.96 |
| 1900-01-01 05:45:13 | 3.96 |
| 1900-01-01 05:45:18 | 3.97 |
| 1900-01-01 05:45:23 | 3.96 |
| 1900-01-01 05:45:28 | 3.98 |
| 1900-01-01 05:45:33 | 3.96 |
| 1900-01-01 05:45:38 | 3.96 |
| 1900-01-01 05:45:43 | 3.97 |
| 1900-01-01 05:45:48 | 3.96 |
| 1900-01-01 05:45:53 | 3.98 |
| 1900-01-01 05:45:58 | 3.96 |
| 1900-01-01 05:46:03 | 3.96 |
| 1900-01-01 05:46:08 | 3.97 |
| 1900-01-01 05:46:13 | 3.96 |
| 1900-01-01 05:46:18 | 3.96 |
| 1900-01-01 05:46:23 | 3.97 |
| 1900-01-01 05:46:28 | 3.96 |
| 1900-01-01 05:46:33 | 3.97 |
| 1900-01-01 05:46:38 | 3.96 |
| 1900-01-01 05:46:43 | 3.98 |
| 1900-01-01 05:46:48 | 3.96 |
| 1900-01-01 05:46:53 | 3.96 |
| 1900-01-01 05:46:58 | 3.96 |
| 1900-01-01 05:47:03 | 3.96 |
| 1900-01-01 05:47:08 | 3.96 |
| 1900-01-01 05:47:13 | 3.96 |
| 1900-01-01 05:47:18 | 3.97 |
| 1900-01-01 05:47:23 | 3.96 |
| 1900-01-01 05:47:28 | 3.96 |
| 1900-01-01 05:47:33 | 3.96 |
| 1900-01-01 05:47:38 | 3.97 |
| 1900-01-01 05:47:43 | 3.96 |
| 1900-01-01 05:47:48 | 3.96 |
| 1900-01-01 05:47:53 | 3.96 |
| 1900-01-01 05:47:58 | 3.96 |
| 1900-01-01 05:48:03 | 3.96 |
| 1900-01-01 05:48:08 | 3.96 |
| 1900-01-01 05:48:13 | 3.96 |
| 1900-01-01 05:48:18 | 3.96 |
| 1900-01-01 05:48:23 | 3.96 |
| 1900-01-01 05:48:28 | 3.96 |
| 1900-01-01 05:48:33 | 3.96 |
| 1900-01-01 05:48:38 | 3.97 |
| 1900-01-01 05:48:43 | 3.96 |
| 1900-01-01 05:48:48 | 3.97 |
| 1900-01-01 05:48:53 | 3.96 |
| 1900-01-01 05:48:58 | 3.96 |
| 1900-01-01 05:49:03 | 3.96 |
| 1900-01-01 05:49:08 | 3.96 |
| 1900-01-01 05:49:13 | 3.96 |
| 1900-01-01 05:49:18 | 3.96 |
| 1900-01-01 05:49:23 | 3.96 |
| 1900-01-01 05:49:28 | 3.96 |
| 1900-01-01 05:49:33 | 3.96 |
| 1900-01-01 05:49:38 | 3.96 |
| 1900-01-01 05:49:43 | 3.96 |
| 1900-01-01 05:49:48 | 3.96 |
| 1900-01-01 05:49:53 | 3.97 |
| 1900-01-01 05:49:58 | 3.96 |
| 1900-01-01 05:50:03 | 3.97 |
| 1900-01-01 05:50:08 | 3.96 |
| 1900-01-01 05:50:13 | 3.96 |
| 1900-01-01 05:50:18 | 3.96 |
| 1900-01-01 05:50:23 | 3.97 |
| 1900-01-01 05:50:28 | 3.97 |
| 1900-01-01 05:50:33 | 3.96 |
| 1900-01-01 05:50:38 | 3.96 |
| 1900-01-01 05:50:43 | 3.96 |
| 1900-01-01 05:50:48 | 3.96 |
| 1900-01-01 05:50:53 | 3.96 |
| 1900-01-01 05:50:58 | 3.96 |
| 1900-01-01 05:51:03 | 3.96 |
| 1900-01-01 05:51:08 | 3.98 |
| 1900-01-01 05:51:13 | 3.96 |
| 1900-01-01 05:51:18 | 3.96 |
| 1900-01-01 05:51:23 | 3.96 |
| 1900-01-01 05:51:28 | 3.96 |
| 1900-01-01 05:51:33 | 3.96 |
| 1900-01-01 05:51:38 | 3.96 |
| 1900-01-01 05:51:43 | 3.96 |
| 1900-01-01 05:51:48 | 3.96 |
| 1900-01-01 05:51:53 | 3.96 |
| 1900-01-01 05:51:58 | 3.96 |
| 1900-01-01 05:52:03 | 3.96 |
| 1900-01-01 05:52:08 | 3.96 |
| 1900-01-01 05:52:13 | 3.96 |
| 1900-01-01 05:52:18 | 3.96 |
| 1900-01-01 05:52:23 | 3.96 |
| 1900-01-01 05:52:28 | 3.96 |
| 1900-01-01 05:52:33 | 3.96 |
| 1900-01-01 05:52:38 | 3.98 |
| 1900-01-01 05:52:43 | 3.97 |
| 1900-01-01 05:52:48 | 3.97 |
| 1900-01-01 05:52:53 | 3.96 |
| 1900-01-01 05:52:58 | 3.96 |
| 1900-01-01 05:53:03 | 3.96 |
| 1900-01-01 05:53:08 | 3.97 |
| 1900-01-01 05:53:13 | 3.97 |
| 1900-01-01 05:53:18 | 3.97 |
| 1900-01-01 05:53:23 | 3.97 |
| 1900-01-01 05:53:28 | 3.96 |
| 1900-01-01 05:53:33 | 3.97 |
| 1900-01-01 05:53:38 | 3.96 |
| 1900-01-01 05:53:43 | 3.96 |
| 1900-01-01 05:53:48 | 3.96 |
| 1900-01-01 05:53:53 | 3.97 |
| 1900-01-01 05:53:58 | 3.97 |
| 1900-01-01 05:54:03 | 3.96 |
| 1900-01-01 05:54:08 | 3.96 |
| 1900-01-01 05:54:13 | 3.97 |
| 1900-01-01 05:54:18 | 3.96 |
| 1900-01-01 05:54:23 | 3.96 |
| 1900-01-01 05:54:28 | 3.96 |
| 1900-01-01 05:54:33 | 3.96 |
| 1900-01-01 05:54:38 | 3.96 |
| 1900-01-01 05:54:43 | 3.97 |
| 1900-01-01 05:54:48 | 3.96 |
| 1900-01-01 05:54:53 | 3.97 |
| 1900-01-01 05:54:58 | 3.96 |
| 1900-01-01 05:55:03 | 3.97 |
| 1900-01-01 05:55:08 | 3.97 |
| 1900-01-01 05:55:13 | 3.96 |
| 1900-01-01 05:55:18 | 3.96 |
| 1900-01-01 05:55:23 | 3.96 |
| 1900-01-01 05:55:28 | 3.96 |
| 1900-01-01 05:55:33 | 3.97 |
| 1900-01-01 05:55:38 | 3.96 |
| 1900-01-01 05:55:43 | 3.96 |
| 1900-01-01 05:55:48 | 3.96 |
| 1900-01-01 05:55:53 | 3.97 |
| 1900-01-01 05:55:58 | 3.96 |
| 1900-01-01 05:56:03 | 3.96 |
| 1900-01-01 05:56:08 | 3.96 |
| 1900-01-01 05:56:13 | 3.96 |
| 1900-01-01 05:56:18 | 3.97 |
| 1900-01-01 05:56:23 | 3.96 |
| 1900-01-01 05:56:28 | 3.96 |
| 1900-01-01 05:56:33 | 3.97 |
| 1900-01-01 05:56:38 | 3.96 |
| 1900-01-01 05:56:43 | 3.96 |
| 1900-01-01 05:56:48 | 3.96 |
| 1900-01-01 05:56:53 | 3.97 |
| 1900-01-01 05:56:58 | 3.97 |
| 1900-01-01 05:57:03 | 3.96 |
| 1900-01-01 05:57:08 | 3.96 |
| 1900-01-01 05:57:13 | 3.96 |
| 1900-01-01 05:57:18 | 3.96 |
| 1900-01-01 05:57:23 | 3.97 |
| 1900-01-01 05:57:28 | 3.96 |
| 1900-01-01 05:57:33 | 3.96 |
| 1900-01-01 05:57:38 | 3.97 |
| 1900-01-01 05:57:43 | 3.96 |
| 1900-01-01 05:57:48 | 3.96 |
| 1900-01-01 05:57:53 | 3.97 |
| 1900-01-01 05:57:58 | 3.97 |
| 1900-01-01 05:58:03 | 3.96 |
| 1900-01-01 05:58:08 | 3.96 |
| 1900-01-01 05:58:13 | 3.96 |
| 1900-01-01 05:58:18 | 3.96 |
| 1900-01-01 05:58:23 | 3.96 |
| 1900-01-01 05:58:28 | 3.96 |
| 1900-01-01 05:58:33 | 3.97 |
| 1900-01-01 05:58:38 | 3.96 |
| 1900-01-01 05:58:43 | 3.96 |
| 1900-01-01 05:58:48 | 3.97 |
| 1900-01-01 05:58:53 | 3.96 |
| 1900-01-01 05:58:58 | 3.97 |
| 1900-01-01 05:59:03 | 3.96 |
| 1900-01-01 05:59:08 | 3.96 |
| 1900-01-01 05:59:13 | 3.96 |
| 1900-01-01 05:59:18 | 3.96 |
| 1900-01-01 05:59:23 | 3.95 |
| 1900-01-01 05:59:28 | 3.96 |
| 1900-01-01 05:59:33 | 3.96 |
| 1900-01-01 05:59:38 | 3.96 |
| 1900-01-01 05:59:43 | 3.96 |
| 1900-01-01 05:59:48 | 3.97 |
| 1900-01-01 05:59:53 | 3.97 |
| 1900-01-01 05:59:58 | 3.97 |
| 1900-01-01 06:00:03 | 3.97 |
| 1900-01-01 06:00:08 | 3.96 |
| 1900-01-01 06:00:13 | 3.96 |
| 1900-01-01 06:00:18 | 3.95 |
| 1900-01-01 06:00:23 | 3.95 |
| 1900-01-01 06:00:28 | 3.96 |
| 1900-01-01 06:00:33 | 3.96 |
| 1900-01-01 06:00:38 | 3.96 |
| 1900-01-01 06:00:43 | 3.97 |
| 1900-01-01 06:00:48 | 3.96 |
| 1900-01-01 06:00:53 | 3.96 |
| 1900-01-01 06:00:58 | 3.97 |
| 1900-01-01 06:01:03 | 3.96 |
| 1900-01-01 06:01:08 | 3.97 |
| 1900-01-01 06:01:13 | 3.96 |
| 1900-01-01 06:01:18 | 3.97 |
| 1900-01-01 06:01:23 | 3.96 |
| 1900-01-01 06:01:28 | 3.97 |
| 1900-01-01 06:01:33 | 3.97 |
| 1900-01-01 06:01:38 | 3.96 |
| 1900-01-01 06:01:43 | 3.97 |
| 1900-01-01 06:01:48 | 3.96 |
| 1900-01-01 06:01:53 | 3.97 |
| 1900-01-01 06:01:58 | 3.96 |
| 1900-01-01 06:02:03 | 3.97 |
| 1900-01-01 06:02:08 | 3.97 |
| 1900-01-01 06:02:13 | 3.96 |
| 1900-01-01 06:02:18 | 3.97 |
| 1900-01-01 06:02:23 | 3.96 |
| 1900-01-01 06:02:28 | 3.97 |
| 1900-01-01 06:02:33 | 3.96 |
| 1900-01-01 06:02:38 | 3.97 |
| 1900-01-01 06:02:43 | 3.96 |
| 1900-01-01 06:02:48 | 3.97 |
| 1900-01-01 06:02:53 | 3.96 |
| 1900-01-01 06:02:58 | 3.97 |
| 1900-01-01 06:03:03 | 3.96 |
| 1900-01-01 06:03:08 | 3.97 |
| 1900-01-01 06:03:13 | 3.96 |
| 1900-01-01 06:03:18 | 3.96 |
| 1900-01-01 06:03:23 | 3.97 |
| 1900-01-01 06:03:28 | 3.96 |
| 1900-01-01 06:03:33 | 3.97 |
| 1900-01-01 06:03:38 | 3.96 |
| 1900-01-01 06:03:43 | 3.96 |
| 1900-01-01 06:03:48 | 3.96 |
| 1900-01-01 06:03:53 | 3.97 |
| 1900-01-01 06:03:58 | 3.97 |
| 1900-01-01 06:04:03 | 3.97 |
| 1900-01-01 06:04:08 | 3.97 |
| 1900-01-01 06:04:13 | 3.97 |
| 1900-01-01 06:04:18 | 3.96 |
| 1900-01-01 06:04:23 | 3.96 |
| 1900-01-01 06:04:28 | 3.97 |
| 1900-01-01 06:04:33 | 3.97 |
| 1900-01-01 06:04:38 | 3.96 |
| 1900-01-01 06:04:43 | 3.97 |
| 1900-01-01 06:04:48 | 3.96 |
| 1900-01-01 06:04:53 | 3.96 |
| 1900-01-01 06:04:58 | 3.97 |
| 1900-01-01 06:05:03 | 3.97 |
| 1900-01-01 06:05:08 | 3.96 |
| 1900-01-01 06:05:13 | 3.96 |
| 1900-01-01 06:05:18 | 3.96 |
| 1900-01-01 06:05:23 | 3.97 |
| 1900-01-01 06:05:28 | 3.97 |
| 1900-01-01 06:05:33 | 3.96 |
| 1900-01-01 06:05:38 | 3.97 |
| 1900-01-01 06:05:43 | 3.97 |
| 1900-01-01 06:05:48 | 3.97 |
| 1900-01-01 06:05:53 | 3.96 |
| 1900-01-01 06:05:58 | 3.97 |
| 1900-01-01 06:06:03 | 3.97 |
| 1900-01-01 06:06:08 | 3.97 |
| 1900-01-01 06:06:13 | 3.97 |
| 1900-01-01 06:06:18 | 3.97 |
| 1900-01-01 06:06:23 | 3.96 |
| 1900-01-01 06:06:28 | 3.97 |
| 1900-01-01 06:06:33 | 3.97 |
| 1900-01-01 06:06:38 | 3.97 |
| 1900-01-01 06:06:43 | 3.96 |
| 1900-01-01 06:06:48 | 3.97 |
| 1900-01-01 06:06:53 | 3.96 |
| 1900-01-01 06:06:58 | 3.97 |
| 1900-01-01 06:07:03 | 3.97 |
| 1900-01-01 06:07:08 | 3.97 |
| 1900-01-01 06:07:13 | 3.96 |
| 1900-01-01 06:07:18 | 3.97 |
| 1900-01-01 06:07:23 | 3.97 |
| 1900-01-01 06:07:28 | 3.96 |
| 1900-01-01 06:07:33 | 3.96 |
| 1900-01-01 06:07:38 | 3.97 |
| 1900-01-01 06:07:43 | 3.97 |
| 1900-01-01 06:07:48 | 3.96 |
| 1900-01-01 06:07:53 | 3.97 |
| 1900-01-01 06:07:58 | 3.97 |
| 1900-01-01 06:08:03 | 3.96 |
| 1900-01-01 06:08:08 | 3.96 |
| 1900-01-01 06:08:13 | 3.97 |
| 1900-01-01 06:08:18 | 3.96 |
| 1900-01-01 06:08:23 | 3.96 |
| 1900-01-01 06:08:28 | 3.97 |
| 1900-01-01 06:08:33 | 3.96 |
| 1900-01-01 06:08:38 | 3.96 |
| 1900-01-01 06:08:43 | 3.96 |
| 1900-01-01 06:08:48 | 3.97 |
| 1900-01-01 06:08:53 | 3.97 |
| 1900-01-01 06:08:58 | 3.97 |
| 1900-01-01 06:09:03 | 3.97 |
| 1900-01-01 06:09:08 | 3.97 |
| 1900-01-01 06:09:13 | 3.96 |
| 1900-01-01 06:09:18 | 3.96 |
| 1900-01-01 06:09:23 | 3.95 |
| 1900-01-01 06:09:28 | 3.96 |
| 1900-01-01 06:09:33 | 3.96 |
| 1900-01-01 06:09:38 | 3.95 |
| 1900-01-01 06:09:43 | 3.96 |
| 1900-01-01 06:09:48 | 3.96 |
| 1900-01-01 06:09:53 | 3.96 |
| 1900-01-01 06:09:58 | 3.96 |
| 1900-01-01 06:10:03 | 3.96 |
| 1900-01-01 06:10:08 | 3.96 |
| 1900-01-01 06:10:13 | 3.97 |
| 1900-01-01 06:10:18 | 3.96 |
| 1900-01-01 06:10:23 | 3.97 |
| 1900-01-01 06:10:28 | 3.96 |
| 1900-01-01 06:10:33 | 3.97 |
| 1900-01-01 06:10:38 | 3.96 |
| 1900-01-01 06:10:43 | 3.97 |
| 1900-01-01 06:10:48 | 3.97 |
| 1900-01-01 06:10:53 | 3.97 |
| 1900-01-01 06:10:58 | 3.97 |
| 1900-01-01 06:11:03 | 3.97 |
| 1900-01-01 06:11:08 | 3.97 |
| 1900-01-01 06:11:13 | 3.97 |
| 1900-01-01 06:11:18 | 3.97 |
| 1900-01-01 06:11:23 | 3.96 |
| 1900-01-01 06:11:28 | 3.97 |
| 1900-01-01 06:11:33 | 3.96 |
| 1900-01-01 06:11:38 | 3.96 |
| 1900-01-01 06:11:43 | 3.96 |
| 1900-01-01 06:11:48 | 3.97 |
| 1900-01-01 06:11:53 | 3.97 |
| 1900-01-01 06:11:58 | 3.96 |
| 1900-01-01 06:12:03 | 3.96 |
| 1900-01-01 06:12:08 | 3.96 |
| 1900-01-01 06:12:13 | 3.96 |
| 1900-01-01 06:12:18 | 3.96 |
| 1900-01-01 06:12:23 | 3.96 |
| 1900-01-01 06:12:28 | 3.97 |
| 1900-01-01 06:12:33 | 3.97 |
| 1900-01-01 06:12:38 | 3.97 |
| 1900-01-01 06:12:43 | 3.96 |
| 1900-01-01 06:12:48 | 3.96 |
| 1900-01-01 06:12:53 | 3.97 |
| 1900-01-01 06:12:58 | 3.97 |
| 1900-01-01 06:13:03 | 3.96 |
| 1900-01-01 06:13:08 | 3.96 |
| 1900-01-01 06:13:13 | 3.97 |
| 1900-01-01 06:13:18 | 3.96 |
| 1900-01-01 06:13:23 | 3.97 |
| 1900-01-01 06:13:28 | 3.97 |
| 1900-01-01 06:13:33 | 3.97 |
| 1900-01-01 06:13:38 | 3.97 |
| 1900-01-01 06:13:43 | 3.97 |
| 1900-01-01 06:13:48 | 3.97 |
| 1900-01-01 06:13:53 | 3.97 |
| 1900-01-01 06:13:58 | 3.97 |
| 1900-01-01 06:14:03 | 3.96 |
| 1900-01-01 06:14:08 | 3.97 |
| 1900-01-01 06:14:13 | 3.97 |
| 1900-01-01 06:14:18 | 3.97 |
| 1900-01-01 06:14:23 | 3.96 |
| 1900-01-01 06:14:28 | 3.96 |
| 1900-01-01 06:14:33 | 3.97 |
| 1900-01-01 06:14:38 | 3.97 |
| 1900-01-01 06:14:43 | 3.97 |
| 1900-01-01 06:14:48 | 3.97 |
| 1900-01-01 06:14:53 | 3.96 |
| 1900-01-01 06:14:58 | 3.97 |
| 1900-01-01 06:15:03 | 3.97 |
| 1900-01-01 06:15:08 | 3.97 |
| 1900-01-01 06:15:13 | 3.97 |
| 1900-01-01 06:15:18 | 3.97 |
| 1900-01-01 06:15:23 | 3.97 |
| 1900-01-01 06:15:28 | 3.97 |
| 1900-01-01 06:15:33 | 3.97 |
| 1900-01-01 06:15:38 | 3.97 |
| 1900-01-01 06:15:43 | 3.97 |
| 1900-01-01 06:15:48 | 3.96 |
| 1900-01-01 06:15:53 | 3.97 |
| 1900-01-01 06:15:58 | 3.96 |
| 1900-01-01 06:16:03 | 3.96 |
| 1900-01-01 06:16:08 | 3.97 |
| 1900-01-01 06:16:13 | 3.95 |
| 1900-01-01 06:16:18 | 3.97 |
| 1900-01-01 06:16:23 | 3.97 |
| 1900-01-01 06:16:28 | 3.97 |
| 1900-01-01 06:16:33 | 3.96 |
| 1900-01-01 06:16:38 | 3.97 |
| 1900-01-01 06:16:43 | 3.96 |
| 1900-01-01 06:16:48 | 3.96 |
| 1900-01-01 06:16:53 | 3.96 |
| 1900-01-01 06:16:58 | 3.96 |
| 1900-01-01 06:17:03 | 3.96 |
| 1900-01-01 06:17:08 | 3.96 |
| 1900-01-01 06:17:13 | 3.97 |
| 1900-01-01 06:17:18 | 3.97 |
| 1900-01-01 06:17:23 | 3.97 |
| 1900-01-01 06:17:28 | 3.97 |
| 1900-01-01 06:17:33 | 3.97 |
| 1900-01-01 06:17:38 | 3.97 |
| 1900-01-01 06:17:43 | 3.97 |
| 1900-01-01 06:17:48 | 3.97 |
| 1900-01-01 06:17:53 | 3.97 |
| 1900-01-01 06:17:58 | 3.97 |
| 1900-01-01 06:18:03 | 3.97 |
| 1900-01-01 06:18:08 | 3.96 |
| 1900-01-01 06:18:13 | 3.96 |
| 1900-01-01 06:18:18 | 3.96 |
| 1900-01-01 06:18:23 | 3.97 |
| 1900-01-01 06:18:28 | 3.97 |
| 1900-01-01 06:18:33 | 3.97 |
| 1900-01-01 06:18:38 | 3.97 |
| 1900-01-01 06:18:43 | 3.97 |
| 1900-01-01 06:18:48 | 3.97 |
| 1900-01-01 06:18:53 | 3.96 |
| 1900-01-01 06:18:58 | 3.97 |
| 1900-01-01 06:19:03 | 3.97 |
| 1900-01-01 06:19:08 | 3.97 |
| 1900-01-01 06:19:13 | 3.97 |
| 1900-01-01 06:19:18 | 3.97 |
| 1900-01-01 06:19:23 | 3.97 |
| 1900-01-01 06:19:28 | 3.97 |
| 1900-01-01 06:19:33 | 3.97 |
| 1900-01-01 06:19:38 | 3.96 |
| 1900-01-01 06:19:43 | 3.97 |
| 1900-01-01 06:19:48 | 3.97 |
| 1900-01-01 06:19:53 | 3.95 |
| 1900-01-01 06:19:58 | 3.96 |
| 1900-01-01 06:20:03 | 3.97 |
| 1900-01-01 06:20:08 | 3.97 |
| 1900-01-01 06:20:13 | 3.97 |
| 1900-01-01 06:20:18 | 3.97 |
| 1900-01-01 06:20:23 | 3.97 |
| 1900-01-01 06:20:28 | 3.96 |
| 1900-01-01 06:20:33 | 3.96 |
| 1900-01-01 06:20:38 | 3.97 |
| 1900-01-01 06:20:43 | 3.97 |
| 1900-01-01 06:20:48 | 3.97 |
| 1900-01-01 06:20:53 | 3.97 |
| 1900-01-01 06:20:58 | 3.97 |
| 1900-01-01 06:21:03 | 3.96 |
| 1900-01-01 06:21:08 | 3.97 |
| 1900-01-01 06:21:13 | 3.97 |
| 1900-01-01 06:21:18 | 3.96 |
| 1900-01-01 06:21:23 | 3.97 |
| 1900-01-01 06:21:28 | 3.97 |
| 1900-01-01 06:21:33 | 3.97 |
| 1900-01-01 06:21:38 | 3.97 |
| 1900-01-01 06:21:43 | 3.97 |
| 1900-01-01 06:21:48 | 3.97 |
| 1900-01-01 06:21:53 | 3.97 |
| 1900-01-01 06:21:58 | 3.96 |
| 1900-01-01 06:22:03 | 3.96 |
| 1900-01-01 06:22:08 | 3.96 |
| 1900-01-01 06:22:13 | 3.96 |
| 1900-01-01 06:22:18 | 3.97 |
| 1900-01-01 06:22:23 | 3.97 |
| 1900-01-01 06:22:28 | 3.97 |
| 1900-01-01 06:22:33 | 3.97 |
| 1900-01-01 06:22:38 | 3.96 |
| 1900-01-01 06:22:43 | 3.96 |
| 1900-01-01 06:22:48 | 3.96 |
| 1900-01-01 06:22:53 | 3.96 |
| 1900-01-01 06:22:58 | 3.97 |
| 1900-01-01 06:23:03 | 3.97 |
| 1900-01-01 06:23:08 | 3.97 |
| 1900-01-01 06:23:13 | 3.96 |
| 1900-01-01 06:23:18 | 3.96 |
| 1900-01-01 06:23:23 | 3.96 |
| 1900-01-01 06:23:28 | 3.95 |
| 1900-01-01 06:23:33 | 3.96 |
| 1900-01-01 06:23:38 | 3.96 |
| 1900-01-01 06:23:43 | 3.96 |
| 1900-01-01 06:23:48 | 3.96 |
| 1900-01-01 06:23:53 | 3.96 |
| 1900-01-01 06:23:58 | 3.96 |
| 1900-01-01 06:24:03 | 3.96 |
| 1900-01-01 06:24:08 | 3.96 |
| 1900-01-01 06:24:13 | 3.96 |
| 1900-01-01 06:24:18 | 3.96 |
| 1900-01-01 06:24:23 | 3.96 |
| 1900-01-01 06:24:28 | 3.97 |
| 1900-01-01 06:24:33 | 3.97 |
| 1900-01-01 06:24:38 | 3.97 |
| 1900-01-01 06:24:43 | 3.97 |
| 1900-01-01 06:24:48 | 3.97 |
| 1900-01-01 06:24:53 | 3.97 |
| 1900-01-01 06:24:58 | 3.97 |
| 1900-01-01 06:25:03 | 3.97 |
| 1900-01-01 06:25:08 | 3.97 |
| 1900-01-01 06:25:13 | 3.96 |
| 1900-01-01 06:25:18 | 3.97 |
| 1900-01-01 06:25:23 | 3.97 |
| 1900-01-01 06:25:28 | 3.97 |
| 1900-01-01 06:25:33 | 3.97 |
| 1900-01-01 06:25:38 | 3.97 |
| 1900-01-01 06:25:43 | 3.97 |
| 1900-01-01 06:25:48 | 3.97 |
| 1900-01-01 06:25:53 | 3.97 |
| 1900-01-01 06:25:58 | 3.97 |
| 1900-01-01 06:26:03 | 3.97 |
| 1900-01-01 06:26:08 | 3.97 |
| 1900-01-01 06:26:13 | 3.97 |
| 1900-01-01 06:26:18 | 3.97 |
| 1900-01-01 06:26:23 | 3.97 |
| 1900-01-01 06:26:28 | 3.97 |
| 1900-01-01 06:26:33 | 3.97 |
| 1900-01-01 06:26:38 | 3.97 |
| 1900-01-01 06:26:43 | 3.97 |
| 1900-01-01 06:26:48 | 3.97 |
| 1900-01-01 06:26:53 | 3.97 |
| 1900-01-01 06:26:58 | 3.97 |
| 1900-01-01 06:27:03 | 3.97 |
| 1900-01-01 06:27:08 | 3.97 |
| 1900-01-01 06:27:13 | 3.97 |
| 1900-01-01 06:27:18 | 3.97 |
| 1900-01-01 06:27:23 | 3.96 |
| 1900-01-01 06:27:28 | 3.96 |
| 1900-01-01 06:27:33 | 3.97 |
| 1900-01-01 06:27:38 | 3.96 |
| 1900-01-01 06:27:43 | 3.97 |
| 1900-01-01 06:27:48 | 3.96 |
| 1900-01-01 06:27:53 | 3.97 |
| 1900-01-01 06:27:58 | 3.97 |
| 1900-01-01 06:28:03 | 3.97 |
| 1900-01-01 06:28:08 | 3.97 |
| 1900-01-01 06:28:13 | 3.97 |
| 1900-01-01 06:28:18 | 3.96 |
| 1900-01-01 06:28:23 | 3.97 |
| 1900-01-01 06:28:28 | 3.97 |
| 1900-01-01 06:28:33 | 3.97 |
| 1900-01-01 06:28:38 | 3.97 |
| 1900-01-01 06:28:43 | 3.97 |
| 1900-01-01 06:28:48 | 3.97 |
| 1900-01-01 06:28:53 | 3.97 |
| 1900-01-01 06:28:58 | 3.96 |
| 1900-01-01 06:29:03 | 3.96 |
| 1900-01-01 06:29:08 | 3.97 |
| 1900-01-01 06:29:13 | 3.96 |
| 1900-01-01 06:29:18 | 3.96 |
| 1900-01-01 06:29:23 | 3.96 |
| 1900-01-01 06:29:28 | 3.97 |
| 1900-01-01 06:29:33 | 3.97 |
| 1900-01-01 06:29:38 | 3.97 |
| 1900-01-01 06:29:43 | 3.97 |
| 1900-01-01 06:29:48 | 3.97 |
| 1900-01-01 06:29:53 | 3.96 |
| 1900-01-01 06:29:58 | 3.96 |
| 1900-01-01 06:30:03 | 3.96 |
| 1900-01-01 06:30:08 | 3.96 |
| 1900-01-01 06:30:13 | 3.96 |
| 1900-01-01 06:30:18 | 3.96 |
| 1900-01-01 06:30:23 | 3.96 |
| 1900-01-01 06:30:28 | 3.96 |
| 1900-01-01 06:30:33 | 3.96 |
| 1900-01-01 06:30:38 | 3.96 |
| 1900-01-01 06:30:43 | 3.97 |
| 1900-01-01 06:30:48 | 3.97 |
| 1900-01-01 06:30:53 | 3.97 |
| 1900-01-01 06:30:58 | 3.96 |
| 1900-01-01 06:31:03 | 3.96 |
| 1900-01-01 06:31:08 | 3.97 |
| 1900-01-01 06:31:13 | 3.97 |
| 1900-01-01 06:31:18 | 3.97 |
| 1900-01-01 06:31:23 | 3.96 |
| 1900-01-01 06:31:28 | 3.96 |
| 1900-01-01 06:31:33 | 3.97 |
| 1900-01-01 06:31:38 | 3.96 |
| 1900-01-01 06:31:43 | 3.96 |
| 1900-01-01 06:31:48 | 3.96 |
| 1900-01-01 06:31:53 | 4.54 |
| 1900-01-01 06:31:58 | 4.54 |
| 1900-01-01 06:32:03 | 4.54 |
| 1900-01-01 06:32:08 | 4.54 |
| 1900-01-01 06:32:13 | 4.54 |
| 1900-01-01 06:32:18 | 4.54 |
| 1900-01-01 06:32:23 | 4.54 |
| 1900-01-01 06:32:28 | 4.54 |
| 1900-01-01 06:32:33 | 4.54 |
| 1900-01-01 06:32:38 | 4.54 |
| 1900-01-01 06:32:43 | 3.96 |
| 1900-01-01 06:32:48 | 4.54 |
| 1900-01-01 06:32:53 | 4.54 |
| 1900-01-01 06:32:58 | 3.97 |
| 1900-01-01 06:33:03 | 4.54 |
| 1900-01-01 06:33:08 | 4.54 |
| 1900-01-01 06:33:13 | 4.54 |
| 1900-01-01 06:33:18 | 3.96 |
| 1900-01-01 06:33:23 | 4.54 |
| 1900-01-01 06:33:28 | 4.54 |
| 1900-01-01 06:33:33 | 4.54 |
| 1900-01-01 06:33:38 | 4.54 |
| 1900-01-01 06:33:43 | 4.54 |
| 1900-01-01 06:33:48 | 4.54 |
| 1900-01-01 06:33:53 | 4.54 |
| 1900-01-01 06:33:58 | 4.54 |
| 1900-01-01 06:34:03 | 3.96 |
| 1900-01-01 06:34:08 | 4.54 |
| 1900-01-01 06:34:13 | 4.54 |
| 1900-01-01 06:34:18 | 4.54 |
| 1900-01-01 06:34:23 | 4.54 |
| 1900-01-01 06:34:28 | 4.54 |
| 1900-01-01 06:34:33 | 4.54 |
| 1900-01-01 06:34:38 | 4.54 |
| 1900-01-01 06:34:43 | 4.54 |
| 1900-01-01 06:34:48 | 4.54 |
| 1900-01-01 06:34:53 | 3.97 |
| 1900-01-01 06:34:58 | 3.97 |
| 1900-01-01 06:35:03 | 4.54 |
| 1900-01-01 06:35:08 | 3.97 |
| 1900-01-01 06:35:13 | 3.97 |
| 1900-01-01 06:35:18 | 4.54 |
| 1900-01-01 06:35:23 | 3.97 |
| 1900-01-01 06:35:28 | 4.54 |
| 1900-01-01 06:35:33 | 3.97 |
| 1900-01-01 06:35:38 | 3.96 |
| 1900-01-01 06:35:43 | 4.54 |
| 1900-01-01 06:35:48 | 3.97 |
| 1900-01-01 06:35:53 | 4.54 |
| 1900-01-01 06:35:58 | 3.97 |
| 1900-01-01 06:36:03 | 3.97 |
| 1900-01-01 06:36:08 | 4.54 |
| 1900-01-01 06:36:13 | 4.54 |
| 1900-01-01 06:36:18 | 4.54 |
| 1900-01-01 06:36:23 | 4.54 |
| 1900-01-01 06:36:28 | 4.54 |
| 1900-01-01 06:36:33 | 4.54 |
| 1900-01-01 06:36:38 | 4.54 |
| 1900-01-01 06:36:43 | 4.54 |
| 1900-01-01 06:36:48 | 4.54 |
| 1900-01-01 06:36:53 | 4.54 |
| 1900-01-01 06:36:58 | 4.54 |
| 1900-01-01 06:37:03 | 4.54 |
| 1900-01-01 06:37:08 | 4.54 |
| 1900-01-01 06:37:13 | 3.97 |
| 1900-01-01 06:37:18 | 4.54 |
| 1900-01-01 06:37:23 | 4.54 |
| 1900-01-01 06:37:28 | 4.54 |
| 1900-01-01 06:37:33 | 4.24 |
| 1900-01-01 06:37:38 | 4.54 |
| 1900-01-01 06:37:43 | 4.54 |
| 1900-01-01 06:37:48 | 4.54 |
| 1900-01-01 06:37:53 | 4.54 |
| 1900-01-01 06:37:58 | 3.97 |
| 1900-01-01 06:38:03 | 3.97 |
| 1900-01-01 06:38:08 | 4.54 |
| 1900-01-01 06:38:13 | 4.54 |
| 1900-01-01 06:38:18 | 3.97 |
| 1900-01-01 06:38:23 | 3.97 |
| 1900-01-01 06:38:28 | 3.97 |
| 1900-01-01 06:38:33 | 3.97 |
| 1900-01-01 06:38:38 | 3.97 |
| 1900-01-01 06:38:43 | 3.97 |
| 1900-01-01 06:38:48 | 4.54 |
| 1900-01-01 06:38:53 | 3.97 |
| 1900-01-01 06:38:58 | 4.54 |
| 1900-01-01 06:39:03 | 4.54 |
| 1900-01-01 06:39:08 | 4.54 |
| 1900-01-01 06:39:13 | 4.54 |
| 1900-01-01 06:39:18 | 4.54 |
| 1900-01-01 06:39:23 | 4.54 |
| 1900-01-01 06:39:28 | 4.54 |
| 1900-01-01 06:39:33 | 4.54 |
| 1900-01-01 06:39:38 | 4.54 |
| 1900-01-01 06:39:43 | 4.54 |
| 1900-01-01 06:39:48 | 4.54 |
| 1900-01-01 06:39:53 | 4.54 |
| 1900-01-01 06:39:58 | 4.54 |
| 1900-01-01 06:40:03 | 4.54 |
| 1900-01-01 06:40:08 | 4.54 |
| 1900-01-01 06:40:13 | 4.54 |
| 1900-01-01 06:40:18 | 4.54 |
| 1900-01-01 06:40:23 | 4.54 |
| 1900-01-01 06:40:28 | 4.54 |
| 1900-01-01 06:40:33 | 4.54 |
| 1900-01-01 06:40:38 | 4.09 |
| 1900-01-01 06:40:43 | 4.31 |
| 1900-01-01 06:40:48 | 4.32 |
| 1900-01-01 06:40:53 | 4.54 |
| 1900-01-01 06:40:58 | 4.39 |
| 1900-01-01 06:41:03 | 4.54 |
| 1900-01-01 06:41:08 | 4.54 |
| 1900-01-01 06:41:13 | 4.54 |
| 1900-01-01 06:41:18 | 4.54 |
| 1900-01-01 06:41:23 | 4.45 |
| 1900-01-01 06:41:28 | 4.54 |
| 1900-01-01 06:41:33 | 4.54 |
| 1900-01-01 06:41:38 | 4.54 |
| 1900-01-01 06:41:43 | 4.54 |
| 1900-01-01 06:41:48 | 4.54 |
| 1900-01-01 06:41:53 | 4.54 |
| 1900-01-01 06:41:58 | 4.54 |
| 1900-01-01 06:42:03 | 4.54 |
| 1900-01-01 06:42:08 | 4.54 |
| 1900-01-01 06:42:13 | 4.53 |
| 1900-01-01 06:42:18 | 3.97 |
| 1900-01-01 06:42:23 | 3.97 |
| 1900-01-01 06:42:28 | 4.53 |
| 1900-01-01 06:42:33 | 4.54 |
| 1900-01-01 06:42:38 | 4.54 |
| 1900-01-01 06:42:43 | 4.54 |
| 1900-01-01 06:42:48 | 4.54 |
| 1900-01-01 06:42:53 | 4.54 |
| 1900-01-01 06:42:58 | 4.54 |
| 1900-01-01 06:43:03 | 4.54 |
| 1900-01-01 06:43:08 | 4.54 |
| 1900-01-01 06:43:13 | 4.54 |
| 1900-01-01 06:43:18 | 4.54 |
| 1900-01-01 06:43:23 | 4.54 |
| 1900-01-01 06:43:28 | 4.54 |
| 1900-01-01 06:43:33 | 4.54 |
| 1900-01-01 06:43:38 | 4.54 |
| 1900-01-01 06:43:43 | 4.54 |
| 1900-01-01 06:43:48 | 4.54 |
| 1900-01-01 06:43:53 | 4.54 |
| 1900-01-01 06:43:58 | 4.54 |
| 1900-01-01 06:44:03 | 4.54 |
| 1900-01-01 06:44:08 | 3.96 |
| 1900-01-01 06:44:13 | 3.97 |
| 1900-01-01 06:44:18 | 3.96 |
| 1900-01-01 06:44:23 | 3.97 |
| 1900-01-01 06:44:28 | 4.54 |
| 1900-01-01 06:44:33 | 4.54 |
| 1900-01-01 06:44:38 | 4.54 |
| 1900-01-01 06:44:43 | 4.54 |
| 1900-01-01 06:44:48 | 4.54 |
| 1900-01-01 06:44:53 | 4.54 |
| 1900-01-01 06:44:58 | 4.54 |
| 1900-01-01 06:45:03 | 4.54 |
| 1900-01-01 06:45:08 | 4.54 |
| 1900-01-01 06:45:13 | 4.54 |
| 1900-01-01 06:45:18 | 3.96 |
| 1900-01-01 06:45:23 | 3.96 |
| 1900-01-01 06:45:28 | 4.54 |
| 1900-01-01 06:45:33 | 4.54 |
| 1900-01-01 06:45:38 | 4.54 |
| 1900-01-01 06:45:43 | 4.54 |
| 1900-01-01 06:45:48 | 4.54 |
| 1900-01-01 06:45:53 | 4.54 |
| 1900-01-01 06:45:58 | 4.54 |
| 1900-01-01 06:46:03 | 4.54 |
| 1900-01-01 06:46:08 | 4.54 |
| 1900-01-01 06:46:13 | 4.54 |
| 1900-01-01 06:46:18 | 4.54 |
| 1900-01-01 06:46:23 | 4.54 |
| 1900-01-01 06:46:28 | 4.54 |
| 1900-01-01 06:46:33 | 4.54 |
| 1900-01-01 06:46:38 | 4.54 |
| 1900-01-01 06:46:43 | 4.54 |
| 1900-01-01 06:46:48 | 4.54 |
| 1900-01-01 06:46:53 | 4.54 |
| 1900-01-01 06:46:58 | 4.54 |
| 1900-01-01 06:47:03 | 4.54 |
| 1900-01-01 06:47:08 | 4.54 |
| 1900-01-01 06:47:13 | 4.54 |
| 1900-01-01 06:47:18 | 4.54 |
| 1900-01-01 06:47:23 | 4.54 |
| 1900-01-01 06:47:28 | 4.54 |
| 1900-01-01 06:47:33 | 4.54 |
| 1900-01-01 06:47:38 | 4.54 |
| 1900-01-01 06:47:43 | 4.54 |
| 1900-01-01 06:47:48 | 4.54 |
| 1900-01-01 06:47:53 | 4.54 |
| 1900-01-01 06:47:58 | 4.54 |
| 1900-01-01 06:48:03 | 4.54 |
| 1900-01-01 06:48:08 | 4.54 |
| 1900-01-01 06:48:13 | 4.54 |
| 1900-01-01 06:48:18 | 4.54 |
| 1900-01-01 06:48:23 | 4.54 |
| 1900-01-01 06:48:28 | 4.54 |
| 1900-01-01 06:48:33 | 4.54 |
| 1900-01-01 06:48:38 | 4.54 |
| 1900-01-01 06:48:43 | 4.54 |
| 1900-01-01 06:48:48 | 4.54 |
| 1900-01-01 06:48:53 | 4.54 |
| 1900-01-01 06:48:58 | 4.54 |
| 1900-01-01 06:49:03 | 4.54 |
| 1900-01-01 06:49:08 | 4.54 |
| 1900-01-01 06:49:13 | 4.54 |
| 1900-01-01 06:49:18 | 4.54 |
| 1900-01-01 06:49:23 | 4.54 |
| 1900-01-01 06:49:28 | 4.54 |
| 1900-01-01 06:49:33 | 4.54 |
| 1900-01-01 06:49:38 | 4.54 |
| 1900-01-01 06:49:43 | 4.54 |
| 1900-01-01 06:49:48 | 4.54 |
| 1900-01-01 06:49:53 | 4.54 |
| 1900-01-01 06:49:58 | 4.54 |
| 1900-01-01 06:50:03 | 4.54 |
| 1900-01-01 06:50:08 | 4.54 |
| 1900-01-01 06:50:13 | 4.54 |
| 1900-01-01 06:50:18 | 4.54 |
| 1900-01-01 06:50:23 | 4.54 |
| 1900-01-01 06:50:28 | 4.54 |
| 1900-01-01 06:50:33 | 4.54 |
| 1900-01-01 06:50:38 | 4.54 |
| 1900-01-01 06:50:43 | 4.54 |
| 1900-01-01 06:50:48 | 4.53 |
| 1900-01-01 06:50:53 | 4.54 |
| 1900-01-01 06:50:58 | 4.54 |
| 1900-01-01 06:51:03 | 4.54 |
| 1900-01-01 06:51:08 | 4.54 |
| 1900-01-01 06:51:13 | 4.54 |
| 1900-01-01 06:51:18 | 4.54 |
| 1900-01-01 06:51:23 | 4.54 |
| 1900-01-01 06:51:28 | 4.54 |
| 1900-01-01 06:51:33 | 4.54 |
| 1900-01-01 06:51:38 | 4.54 |
| 1900-01-01 06:51:43 | 4.54 |
| 1900-01-01 06:51:48 | 4.54 |
| 1900-01-01 06:51:53 | 4.54 |
| 1900-01-01 06:51:58 | 4.54 |
| 1900-01-01 06:52:03 | 4.54 |
| 1900-01-01 06:52:08 | 4.54 |
| 1900-01-01 06:52:13 | 4.54 |
| 1900-01-01 06:52:18 | 4.54 |
| 1900-01-01 06:52:23 | 4.54 |
| 1900-01-01 06:52:28 | 4.54 |
| 1900-01-01 06:52:33 | 4.54 |
| 1900-01-01 06:52:38 | 4.54 |
| 1900-01-01 06:52:43 | 4.54 |
| 1900-01-01 06:52:48 | 4.54 |
| 1900-01-01 06:52:53 | 4.54 |
| 1900-01-01 06:52:58 | 4.54 |
| 1900-01-01 06:53:03 | 4.54 |
| 1900-01-01 06:53:08 | 4.54 |
| 1900-01-01 06:53:13 | 4.54 |
| 1900-01-01 06:53:18 | 4.54 |
| 1900-01-01 06:53:23 | 4.53 |
| 1900-01-01 06:53:28 | 4.54 |
| 1900-01-01 06:53:33 | 4.54 |
| 1900-01-01 06:53:38 | 4.54 |
| 1900-01-01 06:53:43 | 4.54 |
| 1900-01-01 06:53:48 | 4.54 |
| 1900-01-01 06:53:53 | 4.54 |
| 1900-01-01 06:53:58 | 4.54 |
| 1900-01-01 06:54:03 | 4.54 |
| 1900-01-01 06:54:08 | 4.54 |
| 1900-01-01 06:54:13 | 4.54 |
| 1900-01-01 06:54:18 | 4.54 |
| 1900-01-01 06:54:23 | 4.54 |
| 1900-01-01 06:54:28 | 4.54 |
| 1900-01-01 06:54:33 | 4.54 |
| 1900-01-01 06:54:38 | 4.54 |
| 1900-01-01 06:54:43 | 4.54 |
| 1900-01-01 06:54:48 | 4.54 |
| 1900-01-01 06:54:53 | 4.54 |
| 1900-01-01 06:54:58 | 4.54 |
| 1900-01-01 06:55:03 | 4.54 |
| 1900-01-01 06:55:08 | 4.54 |
| 1900-01-01 06:55:13 | 4.54 |
| 1900-01-01 06:55:18 | 4.54 |
| 1900-01-01 06:55:23 | 4.54 |
| 1900-01-01 06:55:28 | 4.54 |
| 1900-01-01 06:55:33 | 4.54 |
| 1900-01-01 06:55:38 | 4.54 |
| 1900-01-01 06:55:43 | 4.54 |
| 1900-01-01 06:55:48 | 4.54 |
| 1900-01-01 06:55:53 | 4.54 |
| 1900-01-01 06:55:58 | 4.54 |
| 1900-01-01 06:56:03 | 4.54 |
| 1900-01-01 06:56:08 | 4.54 |
| 1900-01-01 06:56:13 | 4.54 |
| 1900-01-01 06:56:18 | 4.54 |
| 1900-01-01 06:56:23 | 4.54 |
| 1900-01-01 06:56:28 | 4.54 |
| 1900-01-01 06:56:33 | 4.54 |
| 1900-01-01 06:56:38 | 4.54 |
| 1900-01-01 06:56:43 | 4.54 |
| 1900-01-01 06:56:48 | 4.54 |
| 1900-01-01 06:56:53 | 4.54 |
| 1900-01-01 06:56:58 | 4.54 |
| 1900-01-01 06:57:03 | 4.54 |
| 1900-01-01 06:57:08 | 4.54 |
| 1900-01-01 06:57:13 | 4.54 |
| 1900-01-01 06:57:18 | 4.54 |
| 1900-01-01 06:57:23 | 4.54 |
| 1900-01-01 06:57:28 | 4.54 |
| 1900-01-01 06:57:33 | 4.54 |
| 1900-01-01 06:57:38 | 4.54 |
| 1900-01-01 06:57:43 | 4.54 |
| 1900-01-01 06:57:48 | 4.54 |
| 1900-01-01 06:57:53 | 4.54 |
| 1900-01-01 06:57:58 | 4.54 |
| 1900-01-01 06:58:03 | 4.54 |
| 1900-01-01 06:58:08 | 4.54 |
| 1900-01-01 06:58:13 | 4.54 |
| 1900-01-01 06:58:18 | 4.54 |
| 1900-01-01 06:58:23 | 4.54 |
| 1900-01-01 06:58:28 | 4.54 |
| 1900-01-01 06:58:33 | 4.54 |
| 1900-01-01 06:58:38 | 4.54 |
| 1900-01-01 06:58:43 | 4.54 |
| 1900-01-01 06:58:48 | 4.54 |
| 1900-01-01 06:58:53 | 4.54 |
| 1900-01-01 06:58:58 | 4.54 |
| 1900-01-01 06:59:03 | 4.54 |
| 1900-01-01 06:59:08 | 4.54 |
| 1900-01-01 06:59:13 | 4.54 |
| 1900-01-01 06:59:18 | 4.54 |
| 1900-01-01 06:59:23 | 4.54 |
| 1900-01-01 06:59:28 | 4.54 |
| 1900-01-01 06:59:33 | 4.54 |
| 1900-01-01 06:59:38 | 4.54 |
| 1900-01-01 06:59:43 | 4.54 |
| 1900-01-01 06:59:48 | 4.54 |
| 1900-01-01 06:59:53 | 4.54 |
| 1900-01-01 06:59:58 | 4.54 |
| 1900-01-01 07:00:03 | 4.54 |
| 1900-01-01 07:00:08 | 4.54 |
| 1900-01-01 07:00:13 | 4.54 |
| 1900-01-01 07:00:18 | 4.54 |
| 1900-01-01 07:00:23 | 4.54 |
| 1900-01-01 07:00:28 | 4.54 |
| 1900-01-01 07:00:33 | 4.54 |
| 1900-01-01 07:00:38 | 4.54 |
| 1900-01-01 07:00:43 | 4.54 |
| 1900-01-01 07:00:48 | 4.54 |
| 1900-01-01 07:00:53 | 4.54 |
| 1900-01-01 07:00:58 | 4.54 |
| 1900-01-01 07:01:03 | 4.54 |
| 1900-01-01 07:01:08 | 4.54 |
| 1900-01-01 07:01:13 | 4.54 |
| 1900-01-01 07:01:18 | 4.54 |
| 1900-01-01 07:01:23 | 4.54 |
| 1900-01-01 07:01:28 | 4.54 |
| 1900-01-01 07:01:33 | 4.54 |
| 1900-01-01 07:01:38 | 4.54 |
| 1900-01-01 07:01:43 | 4.54 |
| 1900-01-01 07:01:48 | 4.54 |
| 1900-01-01 07:01:53 | 4.54 |
| 1900-01-01 07:01:58 | 4.54 |
| 1900-01-01 07:02:03 | 4.54 |
| 1900-01-01 07:02:08 | 4.54 |
| 1900-01-01 07:02:13 | 4.54 |
| 1900-01-01 07:02:18 | 4.54 |
| 1900-01-01 07:02:23 | 4.54 |
| 1900-01-01 07:02:28 | 4.54 |
| 1900-01-01 07:02:33 | 4.54 |
| 1900-01-01 07:02:38 | 4.54 |
| 1900-01-01 07:02:43 | 4.54 |
| 1900-01-01 07:02:48 | 4.54 |
| 1900-01-01 07:02:53 | 4.54 |
| 1900-01-01 07:02:58 | 4.54 |
| 1900-01-01 07:03:03 | 4.54 |
| 1900-01-01 07:03:08 | 4.54 |
| 1900-01-01 07:03:13 | 4.54 |
| 1900-01-01 07:03:18 | 4.54 |
| 1900-01-01 07:03:23 | 4.54 |
| 1900-01-01 07:03:28 | 4.54 |
| 1900-01-01 07:03:33 | 4.54 |
| 1900-01-01 07:03:38 | 4.54 |
| 1900-01-01 07:03:43 | 4.54 |
| 1900-01-01 07:03:48 | 4.54 |
| 1900-01-01 07:03:53 | 4.54 |
| 1900-01-01 07:03:58 | 4.54 |
| 1900-01-01 07:04:03 | 4.54 |
| 1900-01-01 07:04:08 | 4.54 |
| 1900-01-01 07:04:13 | 4.54 |
| 1900-01-01 07:04:18 | 4.54 |
| 1900-01-01 07:04:23 | 4.54 |
| 1900-01-01 07:04:28 | 4.54 |
| 1900-01-01 07:04:33 | 4.54 |
| 1900-01-01 07:04:38 | 4.54 |
| 1900-01-01 07:04:43 | 4.54 |
| 1900-01-01 07:04:48 | 4.54 |
| 1900-01-01 07:04:53 | 4.54 |
| 1900-01-01 07:04:58 | 4.54 |
| 1900-01-01 07:05:03 | 4.54 |
| 1900-01-01 07:05:08 | 4.54 |
| 1900-01-01 07:05:13 | 4.53 |
| 1900-01-01 07:05:18 | 4.54 |
| 1900-01-01 07:05:23 | 4.54 |
| 1900-01-01 07:05:28 | 4.54 |
| 1900-01-01 07:05:33 | 4.54 |
| 1900-01-01 07:05:38 | 4.54 |
| 1900-01-01 07:05:43 | 4.54 |
| 1900-01-01 07:05:48 | 4.54 |
| 1900-01-01 07:05:53 | 4.54 |
| 1900-01-01 07:05:58 | 4.54 |
| 1900-01-01 07:06:03 | 4.54 |
| 1900-01-01 07:06:08 | 4.54 |
| 1900-01-01 07:06:13 | 4.54 |
| 1900-01-01 07:06:18 | 4.54 |
| 1900-01-01 07:06:23 | 4.54 |
| 1900-01-01 07:06:28 | 4.54 |
| 1900-01-01 07:06:33 | 4.54 |
| 1900-01-01 07:06:38 | 4.54 |
| 1900-01-01 07:06:43 | 4.54 |
| 1900-01-01 07:06:48 | 4.54 |
| 1900-01-01 07:06:53 | 4.54 |
| 1900-01-01 07:06:58 | 4.54 |
| 1900-01-01 07:07:03 | 4.54 |
| 1900-01-01 07:07:08 | 4.54 |
| 1900-01-01 07:07:13 | 4.54 |
| 1900-01-01 07:07:18 | 4.54 |
| 1900-01-01 07:07:23 | 4.54 |
| 1900-01-01 07:07:28 | 4.54 |
| 1900-01-01 07:07:33 | 4.54 |
| 1900-01-01 07:07:38 | 4.54 |
| 1900-01-01 07:07:43 | 4.54 |
| 1900-01-01 07:07:48 | 4.54 |
| 1900-01-01 07:07:53 | 4.54 |
| 1900-01-01 07:07:58 | 4.54 |
| 1900-01-01 07:08:03 | 4.54 |
| 1900-01-01 07:08:08 | 4.54 |
| 1900-01-01 07:08:13 | 4.54 |
| 1900-01-01 07:08:18 | 4.54 |
| 1900-01-01 07:08:23 | 4.54 |
| 1900-01-01 07:08:28 | 4.54 |
| 1900-01-01 07:08:33 | 4.54 |
| 1900-01-01 07:08:38 | 4.54 |
| 1900-01-01 07:08:43 | 4.54 |
| 1900-01-01 07:08:48 | 4.54 |
| 1900-01-01 07:08:53 | 4.54 |
| 1900-01-01 07:08:58 | 4.54 |
| 1900-01-01 07:09:03 | 4.54 |
| 1900-01-01 07:09:08 | 4.54 |
| 1900-01-01 07:09:13 | 4.54 |
| 1900-01-01 07:09:18 | 4.54 |
| 1900-01-01 07:09:23 | 4.54 |
| 1900-01-01 07:09:28 | 4.54 |
| 1900-01-01 07:09:33 | 4.54 |
| 1900-01-01 07:09:38 | 4.54 |
| 1900-01-01 07:09:43 | 4.54 |
| 1900-01-01 07:09:48 | 4.54 |
| 1900-01-01 07:09:53 | 4.54 |
| 1900-01-01 07:09:58 | 4.54 |
| 1900-01-01 07:10:03 | 4.54 |
| 1900-01-01 07:10:08 | 4.54 |
| 1900-01-01 07:10:13 | 4.54 |
| 1900-01-01 07:10:18 | 4.54 |
| 1900-01-01 07:10:23 | 4.54 |
| 1900-01-01 07:10:28 | 4.54 |
| 1900-01-01 07:10:33 | 4.54 |
| 1900-01-01 07:10:38 | 4.54 |
| 1900-01-01 07:10:43 | 4.54 |
| 1900-01-01 07:10:48 | 4.54 |
| 1900-01-01 07:10:53 | 4.54 |
| 1900-01-01 07:10:58 | 4.54 |
| 1900-01-01 07:11:03 | 4.54 |
| 1900-01-01 07:11:08 | 4.55 |
| 1900-01-01 07:11:13 | 4.54 |
| 1900-01-01 07:11:18 | 4.54 |
| 1900-01-01 07:11:23 | 4.54 |
| 1900-01-01 07:11:28 | 4.54 |
| 1900-01-01 07:11:33 | 4.54 |
| 1900-01-01 07:11:38 | 4.54 |
| 1900-01-01 07:11:43 | 4.54 |
| 1900-01-01 07:11:48 | 4.54 |
| 1900-01-01 07:11:53 | 4.54 |
| 1900-01-01 07:11:58 | 4.54 |
| 1900-01-01 07:12:03 | 4.54 |
| 1900-01-01 07:12:08 | 4.54 |
| 1900-01-01 07:12:13 | 4.54 |
| 1900-01-01 07:12:18 | 4.54 |
| 1900-01-01 07:12:23 | 4.54 |
| 1900-01-01 07:12:28 | 4.54 |
| 1900-01-01 07:12:33 | 4.54 |
| 1900-01-01 07:12:38 | 4.54 |
| 1900-01-01 07:12:43 | 4.54 |
| 1900-01-01 07:12:48 | 4.54 |
| 1900-01-01 07:12:53 | 4.54 |
| 1900-01-01 07:12:58 | 4.54 |
| 1900-01-01 07:13:03 | 4.54 |
| 1900-01-01 07:13:08 | 4.54 |
| 1900-01-01 07:13:13 | 4.54 |
| 1900-01-01 07:13:18 | 4.54 |
| 1900-01-01 07:13:23 | 4.54 |
| 1900-01-01 07:13:28 | 4.54 |
| 1900-01-01 07:13:33 | 4.54 |
| 1900-01-01 07:13:38 | 4.54 |
| 1900-01-01 07:13:43 | 4.54 |
| 1900-01-01 07:13:48 | 4.54 |
| 1900-01-01 07:13:53 | 4.54 |
| 1900-01-01 07:13:58 | 4.54 |
| 1900-01-01 07:14:03 | 4.54 |
| 1900-01-01 07:14:08 | 4.54 |
| 1900-01-01 07:14:13 | 4.54 |
| 1900-01-01 07:14:18 | 4.54 |
| 1900-01-01 07:14:23 | 4.54 |
| 1900-01-01 07:14:28 | 4.54 |
| 1900-01-01 07:14:33 | 4.54 |
| 1900-01-01 07:14:38 | 4.54 |
| 1900-01-01 07:14:43 | 4.54 |
| 1900-01-01 07:14:48 | 4.55 |
| 1900-01-01 07:14:53 | 4.54 |
| 1900-01-01 07:14:58 | 4.54 |
| 1900-01-01 07:15:03 | 4.54 |
| 1900-01-01 07:15:08 | 4.54 |
| 1900-01-01 07:15:13 | 4.54 |
| 1900-01-01 07:15:18 | 4.54 |
| 1900-01-01 07:15:23 | 4.54 |
| 1900-01-01 07:15:28 | 4.54 |
| 1900-01-01 07:15:33 | 4.54 |
| 1900-01-01 07:15:38 | 4.54 |
| 1900-01-01 07:15:43 | 4.54 |
| 1900-01-01 07:15:48 | 4.54 |
| 1900-01-01 07:15:53 | 4.54 |
| 1900-01-01 07:15:58 | 4.54 |
| 1900-01-01 07:16:03 | 4.54 |
| 1900-01-01 07:16:08 | 4.54 |
| 1900-01-01 07:16:13 | 4.54 |
| 1900-01-01 07:16:18 | 4.54 |
| 1900-01-01 07:16:23 | 4.54 |
| 1900-01-01 07:16:28 | 4.54 |
| 1900-01-01 07:16:33 | 4.54 |
| 1900-01-01 07:16:38 | 4.54 |
| 1900-01-01 07:16:43 | 4.54 |
| 1900-01-01 07:16:48 | 4.54 |
| 1900-01-01 07:16:53 | 4.54 |
| 1900-01-01 07:16:58 | 4.54 |
| 1900-01-01 07:17:03 | 4.54 |
| 1900-01-01 07:17:08 | 4.54 |
| 1900-01-01 07:17:13 | 4.54 |
| 1900-01-01 07:17:18 | 4.54 |
| 1900-01-01 07:17:23 | 4.54 |
| 1900-01-01 07:17:28 | 4.54 |
| 1900-01-01 07:17:33 | 4.54 |
| 1900-01-01 07:17:38 | 4.54 |
| 1900-01-01 07:17:43 | 4.54 |
| 1900-01-01 07:17:48 | 4.54 |
| 1900-01-01 07:17:53 | 4.54 |
| 1900-01-01 07:17:58 | 4.54 |
| 1900-01-01 07:18:03 | 4.54 |
| 1900-01-01 07:18:08 | 4.54 |
| 1900-01-01 07:18:13 | 4.54 |
| 1900-01-01 07:18:18 | 4.54 |
| 1900-01-01 07:18:23 | 4.55 |
| 1900-01-01 07:18:28 | 4.54 |
| 1900-01-01 07:18:33 | 4.54 |
| 1900-01-01 07:18:38 | 4.54 |
| 1900-01-01 07:18:43 | 4.54 |
| 1900-01-01 07:18:48 | 4.54 |
| 1900-01-01 07:18:53 | 4.54 |
| 1900-01-01 07:18:58 | 4.54 |
| 1900-01-01 07:19:03 | 4.54 |
| 1900-01-01 07:19:08 | 4.54 |
| 1900-01-01 07:19:13 | 4.54 |
| 1900-01-01 07:19:18 | 4.54 |
| 1900-01-01 07:19:23 | 4.54 |
| 1900-01-01 07:19:28 | 4.54 |
| 1900-01-01 07:19:33 | 4.54 |
| 1900-01-01 07:19:38 | 4.54 |
| 1900-01-01 07:19:43 | 4.54 |
| 1900-01-01 07:19:48 | 4.54 |
| 1900-01-01 07:19:53 | 4.54 |
| 1900-01-01 07:19:58 | 4.54 |
| 1900-01-01 07:20:03 | 4.54 |
| 1900-01-01 07:20:08 | 4.54 |
| 1900-01-01 07:20:13 | 4.54 |
| 1900-01-01 07:20:18 | 4.54 |
| 1900-01-01 07:20:23 | 4.54 |
| 1900-01-01 07:20:28 | 4.53 |
| 1900-01-01 07:20:33 | 4.54 |
| 1900-01-01 07:20:38 | 4.54 |
| 1900-01-01 07:20:43 | 4.54 |
| 1900-01-01 07:20:48 | 4.54 |
| 1900-01-01 07:20:53 | 4.54 |
| 1900-01-01 07:20:58 | 4.54 |
| 1900-01-01 07:21:03 | 4.54 |
| 1900-01-01 07:21:08 | 4.54 |
| 1900-01-01 07:21:13 | 4.54 |
| 1900-01-01 07:21:18 | 4.54 |
| 1900-01-01 07:21:23 | 4.54 |
| 1900-01-01 07:21:28 | 4.54 |
| 1900-01-01 07:21:33 | 4.54 |
| 1900-01-01 07:21:38 | 4.54 |
| 1900-01-01 07:21:43 | 4.54 |
| 1900-01-01 07:21:48 | 4.54 |
| 1900-01-01 07:21:53 | 4.54 |
| 1900-01-01 07:21:58 | 4.54 |
| 1900-01-01 07:22:03 | 4.54 |
| 1900-01-01 07:22:08 | 4.54 |
| 1900-01-01 07:22:13 | 4.54 |
| 1900-01-01 07:22:18 | 4.54 |
| 1900-01-01 07:22:23 | 4.54 |
| 1900-01-01 07:22:28 | 4.54 |
| 1900-01-01 07:22:33 | 4.54 |
| 1900-01-01 07:22:38 | 4.54 |
| 1900-01-01 07:22:43 | 4.54 |
| 1900-01-01 07:22:48 | 4.54 |
| 1900-01-01 07:22:53 | 4.54 |
| 1900-01-01 07:22:58 | 4.54 |
| 1900-01-01 07:23:03 | 4.54 |
| 1900-01-01 07:23:08 | 4.54 |
| 1900-01-01 07:23:13 | 4.54 |
| 1900-01-01 07:23:18 | 4.54 |
| 1900-01-01 07:23:23 | 4.54 |
| 1900-01-01 07:23:28 | 4.54 |
| 1900-01-01 07:23:33 | 4.54 |
| 1900-01-01 07:23:38 | 4.54 |
| 1900-01-01 07:23:43 | 4.54 |
| 1900-01-01 07:23:48 | 4.54 |
| 1900-01-01 07:23:53 | 4.54 |
| 1900-01-01 07:23:58 | 4.54 |
| 1900-01-01 07:24:03 | 4.54 |
| 1900-01-01 07:24:08 | 4.54 |
| 1900-01-01 07:24:13 | 4.54 |
| 1900-01-01 07:24:18 | 4.54 |
| 1900-01-01 07:24:23 | 4.54 |
| 1900-01-01 07:24:28 | 4.54 |
| 1900-01-01 07:24:33 | 4.54 |
| 1900-01-01 07:24:38 | 4.54 |
| 1900-01-01 07:24:43 | 4.54 |
| 1900-01-01 07:24:48 | 4.54 |
| 1900-01-01 07:24:53 | 4.54 |
| 1900-01-01 07:24:58 | 4.54 |
| 1900-01-01 07:25:03 | 4.54 |
| 1900-01-01 07:25:08 | 4.54 |
| 1900-01-01 07:25:13 | 4.54 |
| 1900-01-01 07:25:18 | 4.54 |
| 1900-01-01 07:25:23 | 4.54 |
| 1900-01-01 07:25:28 | 4.54 |
| 1900-01-01 07:25:33 | 4.54 |
| 1900-01-01 07:25:38 | 4.54 |
| 1900-01-01 07:25:43 | 4.54 |
| 1900-01-01 07:25:48 | 4.55 |
| 1900-01-01 07:25:53 | 4.54 |
| 1900-01-01 07:25:58 | 4.54 |
| 1900-01-01 07:26:03 | 4.53 |
| 1900-01-01 07:26:08 | 4.54 |
| 1900-01-01 07:26:13 | 4.54 |
| 1900-01-01 07:26:18 | 4.54 |
| 1900-01-01 07:26:23 | 4.54 |
| 1900-01-01 07:26:28 | 4.54 |
| 1900-01-01 07:26:33 | 4.54 |
| 1900-01-01 07:26:38 | 4.54 |
| 1900-01-01 07:26:43 | 4.54 |
| 1900-01-01 07:26:48 | 4.54 |
| 1900-01-01 07:26:53 | 4.54 |
| 1900-01-01 07:26:58 | 4.54 |
| 1900-01-01 07:27:03 | 4.54 |
| 1900-01-01 07:27:08 | 4.54 |
| 1900-01-01 07:27:13 | 4.54 |
| 1900-01-01 07:27:18 | 4.54 |
| 1900-01-01 07:27:23 | 4.54 |
| 1900-01-01 07:27:28 | 4.55 |
| 1900-01-01 07:27:33 | 4.54 |
| 1900-01-01 07:27:38 | 4.54 |
| 1900-01-01 07:27:43 | 4.54 |
| 1900-01-01 07:27:48 | 4.54 |
| 1900-01-01 07:27:53 | 4.54 |
| 1900-01-01 07:27:58 | 4.54 |
| 1900-01-01 07:28:03 | 4.54 |
| 1900-01-01 07:28:08 | 4.54 |
| 1900-01-01 07:28:13 | 4.54 |
| 1900-01-01 07:28:18 | 4.54 |
| 1900-01-01 07:28:23 | 4.54 |
| 1900-01-01 07:28:28 | 4.54 |
| 1900-01-01 07:28:33 | 4.54 |
| 1900-01-01 07:28:38 | 4.54 |
| 1900-01-01 07:28:43 | 4.54 |
| 1900-01-01 07:28:48 | 4.55 |
| 1900-01-01 07:28:53 | 4.54 |
| 1900-01-01 07:28:58 | 4.54 |
| 1900-01-01 07:29:03 | 4.54 |
| 1900-01-01 07:29:08 | 4.54 |
| 1900-01-01 07:29:13 | 4.54 |
| 1900-01-01 07:29:18 | 4.54 |
| 1900-01-01 07:29:23 | 4.54 |
| 1900-01-01 07:29:28 | 4.54 |
| 1900-01-01 07:29:33 | 4.55 |
| 1900-01-01 07:29:38 | 4.54 |
| 1900-01-01 07:29:43 | 4.54 |
| 1900-01-01 07:29:48 | 4.54 |
| 1900-01-01 07:29:53 | 4.55 |
| 1900-01-01 07:29:58 | 4.54 |
| 1900-01-01 07:30:03 | 4.54 |
| 1900-01-01 07:30:08 | 4.54 |
| 1900-01-01 07:30:13 | 4.54 |
| 1900-01-01 07:30:18 | 4.54 |
| 1900-01-01 07:30:23 | 4.54 |
| 1900-01-01 07:30:28 | 4.54 |
| 1900-01-01 07:30:33 | 4.54 |
| 1900-01-01 07:30:38 | 4.54 |
| 1900-01-01 07:30:43 | 4.54 |
| 1900-01-01 07:30:48 | 4.54 |
| 1900-01-01 07:30:53 | 4.54 |
| 1900-01-01 07:30:58 | 4.54 |
| 1900-01-01 07:31:03 | 4.54 |
| 1900-01-01 07:31:08 | 4.54 |
| 1900-01-01 07:31:13 | 4.54 |
| 1900-01-01 07:31:18 | 4.54 |
| 1900-01-01 07:31:23 | 4.54 |
| 1900-01-01 07:31:28 | 4.54 |
| 1900-01-01 07:31:33 | 4.54 |
| 1900-01-01 07:31:38 | 4.54 |
| 1900-01-01 07:31:43 | 4.54 |
| 1900-01-01 07:31:48 | 4.54 |
| 1900-01-01 07:31:53 | 4.54 |
| 1900-01-01 07:31:58 | 4.54 |
| 1900-01-01 07:32:03 | 4.54 |
| 1900-01-01 07:32:08 | 4.54 |
| 1900-01-01 07:32:13 | 4.54 |
| 1900-01-01 07:32:18 | 4.54 |
| 1900-01-01 07:32:23 | 4.54 |
| 1900-01-01 07:32:28 | 4.54 |
| 1900-01-01 07:32:33 | 4.54 |
| 1900-01-01 07:32:38 | 4.54 |
| 1900-01-01 07:32:43 | 4.54 |
| 1900-01-01 07:32:48 | 4.54 |
| 1900-01-01 07:32:53 | 4.54 |
| 1900-01-01 07:32:58 | 4.54 |
| 1900-01-01 07:33:03 | 4.54 |
| 1900-01-01 07:33:08 | 4.54 |
| 1900-01-01 07:33:13 | 4.54 |
| 1900-01-01 07:33:18 | 4.54 |
| 1900-01-01 07:33:23 | 4.55 |
| 1900-01-01 07:33:28 | 4.54 |
| 1900-01-01 07:33:33 | 4.54 |
| 1900-01-01 07:33:38 | 4.54 |
| 1900-01-01 07:33:43 | 4.54 |
| 1900-01-01 07:33:48 | 4.54 |
| 1900-01-01 07:33:53 | 4.54 |
| 1900-01-01 07:33:58 | 4.53 |
| 1900-01-01 07:34:03 | 4.54 |
| 1900-01-01 07:34:08 | 4.54 |
| 1900-01-01 07:34:13 | 4.54 |
| 1900-01-01 07:34:18 | 4.54 |
| 1900-01-01 07:34:23 | 4.54 |
| 1900-01-01 07:34:28 | 4.55 |
| 1900-01-01 07:34:33 | 4.54 |
| 1900-01-01 07:34:38 | 4.54 |
| 1900-01-01 07:34:43 | 4.54 |
| 1900-01-01 07:34:48 | 4.54 |
| 1900-01-01 07:34:53 | 4.54 |
| 1900-01-01 07:34:58 | 4.54 |
| 1900-01-01 07:35:03 | 4.54 |
| 1900-01-01 07:35:08 | 4.53 |
| 1900-01-01 07:35:13 | 4.54 |
| 1900-01-01 07:35:18 | 4.54 |
| 1900-01-01 07:35:23 | 4.54 |
| 1900-01-01 07:35:28 | 4.54 |
| 1900-01-01 07:35:33 | 4.54 |
| 1900-01-01 07:35:38 | 4.54 |
| 1900-01-01 07:35:43 | 4.54 |
| 1900-01-01 07:35:48 | 4.54 |
| 1900-01-01 07:35:53 | 4.54 |
| 1900-01-01 07:35:58 | 4.54 |
| 1900-01-01 07:36:03 | 4.54 |
| 1900-01-01 07:36:08 | 4.54 |
| 1900-01-01 07:36:13 | 4.54 |
| 1900-01-01 07:36:18 | 4.54 |
| 1900-01-01 07:36:23 | 4.54 |
| 1900-01-01 07:36:28 | 4.54 |
| 1900-01-01 07:36:33 | 4.54 |
| 1900-01-01 07:36:38 | 4.54 |
| 1900-01-01 07:36:43 | 4.54 |
| 1900-01-01 07:36:48 | 4.54 |
| 1900-01-01 07:36:53 | 4.54 |
| 1900-01-01 07:36:58 | 4.54 |
| 1900-01-01 07:37:03 | 4.54 |
| 1900-01-01 07:37:08 | 4.54 |
| 1900-01-01 07:37:13 | 4.54 |
| 1900-01-01 07:37:18 | 4.53 |
| 1900-01-01 07:37:23 | 4.54 |
| 1900-01-01 07:37:28 | 4.54 |
| 1900-01-01 07:37:33 | 4.54 |
| 1900-01-01 07:37:38 | 4.54 |
| 1900-01-01 07:37:43 | 4.54 |
| 1900-01-01 07:37:48 | 4.54 |
| 1900-01-01 07:37:53 | 4.54 |
| 1900-01-01 07:37:58 | 4.54 |
| 1900-01-01 07:38:03 | 4.54 |
| 1900-01-01 07:38:08 | 4.54 |
| 1900-01-01 07:38:13 | 4.54 |
| 1900-01-01 07:38:18 | 4.54 |
| 1900-01-01 07:38:23 | 4.54 |
| 1900-01-01 07:38:28 | 4.54 |
| 1900-01-01 07:38:33 | 4.54 |
| 1900-01-01 07:38:38 | 4.54 |
| 1900-01-01 07:38:43 | 4.54 |
| 1900-01-01 07:38:48 | 4.54 |
| 1900-01-01 07:38:53 | 4.54 |
| 1900-01-01 07:38:58 | 4.54 |
| 1900-01-01 07:39:03 | 4.54 |
| 1900-01-01 07:39:08 | 4.54 |
| 1900-01-01 07:39:13 | 4.54 |
| 1900-01-01 07:39:18 | 4.54 |
| 1900-01-01 07:39:23 | 4.54 |
| 1900-01-01 07:39:28 | 4.54 |
| 1900-01-01 07:39:33 | 4.54 |
| 1900-01-01 07:39:38 | 4.54 |
| 1900-01-01 07:39:43 | 4.53 |
| 1900-01-01 07:39:48 | 4.54 |
| 1900-01-01 07:39:53 | 4.54 |
| 1900-01-01 07:39:58 | 4.54 |
| 1900-01-01 07:40:03 | 4.54 |
| 1900-01-01 07:40:08 | 4.54 |
| 1900-01-01 07:40:13 | 4.54 |
| 1900-01-01 07:40:18 | 4.54 |
| 1900-01-01 07:40:23 | 4.54 |
| 1900-01-01 07:40:28 | 4.54 |
| 1900-01-01 07:40:33 | 4.54 |
| 1900-01-01 07:40:38 | 4.54 |
| 1900-01-01 07:40:43 | 4.54 |
| 1900-01-01 07:40:48 | 4.54 |
| 1900-01-01 07:40:53 | 4.53 |
| 1900-01-01 07:40:58 | 4.54 |
| 1900-01-01 07:41:03 | 4.54 |
| 1900-01-01 07:41:08 | 4.54 |
| 1900-01-01 07:41:13 | 4.54 |
| 1900-01-01 07:41:18 | 4.54 |
| 1900-01-01 07:41:23 | 4.54 |
| 1900-01-01 07:41:28 | 4.54 |
| 1900-01-01 07:41:33 | 4.54 |
| 1900-01-01 07:41:38 | 4.54 |
| 1900-01-01 07:41:43 | 4.54 |
| 1900-01-01 07:41:48 | 4.54 |
| 1900-01-01 07:41:53 | 4.54 |
| 1900-01-01 07:41:58 | 4.54 |
| 1900-01-01 07:42:03 | 4.54 |
| 1900-01-01 07:42:08 | 4.54 |
| 1900-01-01 07:42:13 | 4.54 |
| 1900-01-01 07:42:18 | 4.54 |
| 1900-01-01 07:42:23 | 4.54 |
| 1900-01-01 07:42:28 | 4.54 |
| 1900-01-01 07:42:33 | 4.54 |
| 1900-01-01 07:42:38 | 4.54 |
| 1900-01-01 07:42:43 | 4.53 |
| 1900-01-01 07:42:48 | 4.54 |
| 1900-01-01 07:42:53 | 4.54 |
| 1900-01-01 07:42:58 | 4.54 |
| 1900-01-01 07:43:03 | 4.54 |
| 1900-01-01 07:43:08 | 4.53 |
| 1900-01-01 07:43:13 | 4.54 |
| 1900-01-01 07:43:18 | 4.54 |
| 1900-01-01 07:43:23 | 4.54 |
| 1900-01-01 07:43:28 | 4.53 |
| 1900-01-01 07:43:33 | 4.54 |
| 1900-01-01 07:43:38 | 4.54 |
| 1900-01-01 07:43:43 | 4.54 |
| 1900-01-01 07:43:48 | 4.54 |
| 1900-01-01 07:43:53 | 4.54 |
| 1900-01-01 07:43:58 | 4.54 |
| 1900-01-01 07:44:03 | 4.54 |
| 1900-01-01 07:44:08 | 4.54 |
| 1900-01-01 07:44:13 | 4.54 |
| 1900-01-01 07:44:18 | 4.54 |
| 1900-01-01 07:44:23 | 4.54 |
| 1900-01-01 07:44:28 | 4.53 |
| 1900-01-01 07:44:33 | 4.54 |
| 1900-01-01 07:44:38 | 4.54 |
| 1900-01-01 07:44:43 | 4.54 |
| 1900-01-01 07:44:48 | 4.54 |
| 1900-01-01 07:44:53 | 4.54 |
| 1900-01-01 07:44:58 | 4.54 |
| 1900-01-01 07:45:03 | 4.54 |
| 1900-01-01 07:45:08 | 4.54 |
| 1900-01-01 07:45:13 | 4.53 |
| 1900-01-01 07:45:18 | 4.54 |
| 1900-01-01 07:45:23 | 4.54 |
| 1900-01-01 07:45:28 | 4.54 |
| 1900-01-01 07:45:33 | 4.54 |
| 1900-01-01 07:45:38 | 4.54 |
| 1900-01-01 07:45:43 | 4.54 |
| 1900-01-01 07:45:48 | 4.53 |
| 1900-01-01 07:45:53 | 4.54 |
| 1900-01-01 07:45:58 | 4.53 |
| 1900-01-01 07:46:03 | 4.53 |
| 1900-01-01 07:46:08 | 4.54 |
| 1900-01-01 07:46:13 | 4.54 |
| 1900-01-01 07:46:18 | 4.54 |
| 1900-01-01 07:46:23 | 4.54 |
| 1900-01-01 07:46:28 | 4.54 |
| 1900-01-01 07:46:33 | 4.54 |
| 1900-01-01 07:46:38 | 4.54 |
| 1900-01-01 07:46:43 | 4.54 |
| 1900-01-01 07:46:48 | 4.54 |
| 1900-01-01 07:46:53 | 4.54 |
| 1900-01-01 07:46:58 | 4.53 |
| 1900-01-01 07:47:03 | 4.54 |
| 1900-01-01 07:47:08 | 4.54 |
| 1900-01-01 07:47:13 | 4.54 |
| 1900-01-01 07:47:18 | 4.54 |
| 1900-01-01 07:47:23 | 4.54 |
| 1900-01-01 07:47:28 | 4.54 |
| 1900-01-01 07:47:33 | 4.54 |
| 1900-01-01 07:47:38 | 4.53 |
| 1900-01-01 07:47:43 | 4.54 |
| 1900-01-01 07:47:48 | 4.54 |
| 1900-01-01 07:47:53 | 4.54 |
| 1900-01-01 07:47:58 | 4.54 |
| 1900-01-01 07:48:03 | 4.54 |
| 1900-01-01 07:48:08 | 4.54 |
| 1900-01-01 07:48:13 | 4.54 |
| 1900-01-01 07:48:18 | 4.54 |
| 1900-01-01 07:48:23 | 4.54 |
| 1900-01-01 07:48:28 | 4.54 |
| 1900-01-01 07:48:33 | 4.54 |
| 1900-01-01 07:48:38 | 4.53 |
| 1900-01-01 07:48:43 | 4.54 |
| 1900-01-01 07:48:48 | 4.54 |
| 1900-01-01 07:48:53 | 4.54 |
| 1900-01-01 07:48:58 | 4.54 |
| 1900-01-01 07:49:03 | 4.54 |
| 1900-01-01 07:49:08 | 4.54 |
| 1900-01-01 07:49:13 | 4.54 |
| 1900-01-01 07:49:18 | 4.54 |
| 1900-01-01 07:49:23 | 4.54 |
| 1900-01-01 07:49:28 | 4.54 |
| 1900-01-01 07:49:33 | 4.54 |
| 1900-01-01 07:49:38 | 4.54 |
| 1900-01-01 07:49:43 | 4.54 |
| 1900-01-01 07:49:48 | 4.54 |
| 1900-01-01 07:49:53 | 4.54 |
| 1900-01-01 07:49:58 | 4.53 |
| 1900-01-01 07:50:03 | 4.54 |
| 1900-01-01 07:50:08 | 4.54 |
| 1900-01-01 07:50:13 | 4.53 |
| 1900-01-01 07:50:18 | 4.54 |
| 1900-01-01 07:50:23 | 4.54 |
| 1900-01-01 07:50:28 | 4.54 |
| 1900-01-01 07:50:33 | 4.54 |
| 1900-01-01 07:50:38 | 4.54 |
| 1900-01-01 07:50:43 | 4.54 |
| 1900-01-01 07:50:48 | 4.54 |
| 1900-01-01 07:50:53 | 4.54 |
| 1900-01-01 07:50:58 | 4.54 |
| 1900-01-01 07:51:03 | 4.54 |
| 1900-01-01 07:51:08 | 4.54 |
| 1900-01-01 07:51:13 | 4.54 |
| 1900-01-01 07:51:18 | 4.54 |
| 1900-01-01 07:51:23 | 4.54 |
| 1900-01-01 07:51:28 | 4.53 |
| 1900-01-01 07:51:33 | 4.54 |
| 1900-01-01 07:51:38 | 4.54 |
| 1900-01-01 07:51:43 | 4.54 |
| 1900-01-01 07:51:48 | 4.53 |
| 1900-01-01 07:51:53 | 4.53 |
| 1900-01-01 07:51:58 | 4.53 |
| 1900-01-01 07:52:03 | 4.54 |
| 1900-01-01 07:52:08 | 4.54 |
| 1900-01-01 07:52:13 | 4.54 |
| 1900-01-01 07:52:18 | 4.54 |
| 1900-01-01 07:52:23 | 4.53 |
| 1900-01-01 07:52:28 | 4.54 |
| 1900-01-01 07:52:33 | 4.53 |
| 1900-01-01 07:52:38 | 4.53 |
| 1900-01-01 07:52:43 | 4.54 |
| 1900-01-01 07:52:48 | 4.54 |
| 1900-01-01 07:52:53 | 4.54 |
| 1900-01-01 07:52:58 | 4.54 |
| 1900-01-01 07:53:03 | 4.54 |
| 1900-01-01 07:53:08 | 4.54 |
| 1900-01-01 07:53:13 | 4.54 |
| 1900-01-01 07:53:18 | 4.54 |
| 1900-01-01 07:53:23 | 4.54 |
| 1900-01-01 07:53:28 | 4.53 |
| 1900-01-01 07:53:33 | 4.53 |
| 1900-01-01 07:53:38 | 4.54 |
| 1900-01-01 07:53:43 | 4.54 |
| 1900-01-01 07:53:48 | 4.54 |
| 1900-01-01 07:53:53 | 4.54 |
| 1900-01-01 07:53:58 | 4.53 |
| 1900-01-01 07:54:03 | 4.54 |
| 1900-01-01 07:54:08 | 4.53 |
| 1900-01-01 07:54:13 | 4.54 |
| 1900-01-01 07:54:18 | 4.54 |
| 1900-01-01 07:54:23 | 4.54 |
| 1900-01-01 07:54:28 | 4.53 |
| 1900-01-01 07:54:33 | 4.53 |
| 1900-01-01 07:54:38 | 4.54 |
| 1900-01-01 07:54:43 | 4.53 |
| 1900-01-01 07:54:48 | 4.54 |
| 1900-01-01 07:54:53 | 4.53 |
| 1900-01-01 07:54:58 | 4.54 |
| 1900-01-01 07:55:03 | 4.54 |
| 1900-01-01 07:55:08 | 4.53 |
| 1900-01-01 07:55:13 | 4.54 |
| 1900-01-01 07:55:18 | 4.54 |
| 1900-01-01 07:55:23 | 4.54 |
| 1900-01-01 07:55:28 | 4.54 |
| 1900-01-01 07:55:33 | 4.54 |
| 1900-01-01 07:55:38 | 4.54 |
| 1900-01-01 07:55:43 | 4.54 |
| 1900-01-01 07:55:48 | 4.54 |
| 1900-01-01 07:55:53 | 4.54 |
| 1900-01-01 07:55:58 | 4.54 |
| 1900-01-01 07:56:03 | 4.54 |
| 1900-01-01 07:56:08 | 4.54 |
| 1900-01-01 07:56:13 | 4.54 |
| 1900-01-01 07:56:18 | 4.54 |
| 1900-01-01 07:56:23 | 4.54 |
| 1900-01-01 07:56:28 | 4.54 |
| 1900-01-01 07:56:33 | 4.54 |
| 1900-01-01 07:56:38 | 4.53 |
| 1900-01-01 07:56:43 | 4.54 |
| 1900-01-01 07:56:48 | 4.54 |
| 1900-01-01 07:56:53 | 4.54 |
| 1900-01-01 07:56:58 | 4.54 |
| 1900-01-01 07:57:03 | 4.53 |
| 1900-01-01 07:57:08 | 4.54 |
| 1900-01-01 07:57:13 | 4.54 |
| 1900-01-01 07:57:18 | 4.54 |
| 1900-01-01 07:57:23 | 4.54 |
| 1900-01-01 07:57:28 | 4.54 |
| 1900-01-01 07:57:33 | 4.54 |
| 1900-01-01 07:57:38 | 4.54 |
| 1900-01-01 07:57:43 | 4.54 |
| 1900-01-01 07:57:48 | 4.54 |
| 1900-01-01 07:57:53 | 4.54 |
| 1900-01-01 07:57:58 | 4.54 |
| 1900-01-01 07:58:03 | 4.54 |
| 1900-01-01 07:58:08 | 4.54 |
| 1900-01-01 07:58:13 | 4.54 |
| 1900-01-01 07:58:18 | 4.54 |
| 1900-01-01 07:58:23 | 4.54 |
| 1900-01-01 07:58:28 | 4.54 |
| 1900-01-01 07:58:33 | 4.54 |
| 1900-01-01 07:58:38 | 4.54 |
| 1900-01-01 07:58:43 | 4.54 |
| 1900-01-01 07:58:48 | 4.53 |
| 1900-01-01 07:58:53 | 4.54 |
| 1900-01-01 07:58:58 | 4.54 |
| 1900-01-01 07:59:03 | 4.54 |
| 1900-01-01 07:59:08 | 4.53 |
| 1900-01-01 07:59:13 | 4.54 |
| 1900-01-01 07:59:18 | 4.54 |
| 1900-01-01 07:59:23 | 4.54 |
| 1900-01-01 07:59:28 | 4.54 |
| 1900-01-01 07:59:33 | 4.54 |
| 1900-01-01 07:59:38 | 4.54 |
| 1900-01-01 07:59:43 | 4.54 |
| 1900-01-01 07:59:48 | 4.54 |
| 1900-01-01 07:59:53 | 4.54 |
| 1900-01-01 07:59:58 | 4.54 |
| 1900-01-01 08:00:03 | 4.54 |
| 1900-01-01 08:00:08 | 4.54 |
| 1900-01-01 08:00:13 | 4.53 |
| 1900-01-01 08:00:18 | 4.54 |
| 1900-01-01 08:00:23 | 4.53 |
| 1900-01-01 08:00:28 | 4.54 |
| 1900-01-01 08:00:33 | 4.54 |
| 1900-01-01 08:00:38 | 4.54 |
| 1900-01-01 08:00:43 | 4.54 |
| 1900-01-01 08:00:48 | 4.54 |
| 1900-01-01 08:00:53 | 4.54 |
| 1900-01-01 08:00:58 | 4.54 |
| 1900-01-01 08:01:03 | 4.54 |
| 1900-01-01 08:01:08 | 4.54 |
| 1900-01-01 08:01:13 | 4.54 |
| 1900-01-01 08:01:18 | 4.54 |
| 1900-01-01 08:01:23 | 4.54 |
| 1900-01-01 08:01:28 | 4.54 |
| 1900-01-01 08:01:33 | 4.54 |
| 1900-01-01 08:01:38 | 4.53 |
| 1900-01-01 08:01:43 | 4.54 |
| 1900-01-01 08:01:48 | 4.53 |
| 1900-01-01 08:01:53 | 4.54 |
| 1900-01-01 08:01:58 | 4.54 |
| 1900-01-01 08:02:03 | 4.54 |
| 1900-01-01 08:02:08 | 4.53 |
| 1900-01-01 08:02:13 | 4.54 |
| 1900-01-01 08:02:18 | 4.54 |
| 1900-01-01 08:02:23 | 4.54 |
| 1900-01-01 08:02:28 | 4.53 |
| 1900-01-01 08:02:33 | 4.54 |
| 1900-01-01 08:02:38 | 4.54 |
| 1900-01-01 08:02:43 | 4.54 |
| 1900-01-01 08:02:48 | 4.54 |
| 1900-01-01 08:02:53 | 4.54 |
| 1900-01-01 08:02:58 | 4.54 |
| 1900-01-01 08:03:03 | 4.53 |
| 1900-01-01 08:03:08 | 4.53 |
| 1900-01-01 08:03:13 | 4.54 |
| 1900-01-01 08:03:18 | 4.54 |
| 1900-01-01 08:03:23 | 4.54 |
| 1900-01-01 08:03:28 | 4.53 |
| 1900-01-01 08:03:33 | 4.54 |
| 1900-01-01 08:03:38 | 4.53 |
| 1900-01-01 08:03:43 | 4.54 |
| 1900-01-01 08:03:48 | 4.53 |
| 1900-01-01 08:03:53 | 4.54 |
| 1900-01-01 08:03:58 | 4.53 |
| 1900-01-01 08:04:03 | 4.53 |
| 1900-01-01 08:04:08 | 4.54 |
| 1900-01-01 08:04:13 | 4.54 |
| 1900-01-01 08:04:18 | 4.54 |
| 1900-01-01 08:04:23 | 4.54 |
| 1900-01-01 08:04:28 | 4.54 |
| 1900-01-01 08:04:33 | 4.54 |
| 1900-01-01 08:04:38 | 4.54 |
| 1900-01-01 08:04:43 | 4.54 |
| 1900-01-01 08:04:48 | 4.54 |
| 1900-01-01 08:04:53 | 4.54 |
| 1900-01-01 08:04:58 | 4.53 |
| 1900-01-01 08:05:03 | 4.54 |
| 1900-01-01 08:05:08 | 4.54 |
| 1900-01-01 08:05:13 | 4.54 |
| 1900-01-01 08:05:18 | 4.54 |
| 1900-01-01 08:05:23 | 4.54 |
| 1900-01-01 08:05:28 | 4.54 |
| 1900-01-01 08:05:33 | 4.53 |
| 1900-01-01 08:05:38 | 4.54 |
| 1900-01-01 08:05:43 | 4.54 |
| 1900-01-01 08:05:48 | 4.54 |
| 1900-01-01 08:05:53 | 4.54 |
| 1900-01-01 08:05:58 | 4.54 |
| 1900-01-01 08:06:03 | 4.54 |
| 1900-01-01 08:06:08 | 4.53 |
| 1900-01-01 08:06:13 | 4.53 |
| 1900-01-01 08:06:18 | 4.54 |
| 1900-01-01 08:06:23 | 4.54 |
| 1900-01-01 08:06:28 | 4.54 |
| 1900-01-01 08:06:33 | 4.54 |
| 1900-01-01 08:06:38 | 4.54 |
| 1900-01-01 08:06:43 | 4.54 |
| 1900-01-01 08:06:48 | 4.54 |
| 1900-01-01 08:06:53 | 4.54 |
| 1900-01-01 08:06:58 | 4.54 |
| 1900-01-01 08:07:03 | 4.53 |
| 1900-01-01 08:07:08 | 4.54 |
| 1900-01-01 08:07:13 | 4.54 |
| 1900-01-01 08:07:18 | 4.53 |
| 1900-01-01 08:07:23 | 4.54 |
| 1900-01-01 08:07:28 | 4.54 |
| 1900-01-01 08:07:33 | 4.54 |
| 1900-01-01 08:07:38 | 4.54 |
| 1900-01-01 08:07:43 | 4.54 |
| 1900-01-01 08:07:48 | 4.54 |
| 1900-01-01 08:07:53 | 4.53 |
| 1900-01-01 08:07:58 | 4.53 |
| 1900-01-01 08:08:03 | 4.54 |
| 1900-01-01 08:08:08 | 4.53 |
| 1900-01-01 08:08:13 | 4.54 |
| 1900-01-01 08:08:18 | 4.54 |
| 1900-01-01 08:08:23 | 4.54 |
| 1900-01-01 08:08:28 | 4.54 |
| 1900-01-01 08:08:33 | 4.54 |
| 1900-01-01 08:08:38 | 4.54 |
| 1900-01-01 08:08:43 | 4.54 |
| 1900-01-01 08:08:48 | 4.53 |
| 1900-01-01 08:08:53 | 4.54 |
| 1900-01-01 08:08:58 | 4.54 |
| 1900-01-01 08:09:03 | 4.54 |
| 1900-01-01 08:09:08 | 4.54 |
| 1900-01-01 08:09:13 | 4.54 |
| 1900-01-01 08:09:18 | 4.54 |
| 1900-01-01 08:09:23 | 4.53 |
| 1900-01-01 08:09:28 | 4.54 |
| 1900-01-01 08:09:33 | 4.54 |
| 1900-01-01 08:09:38 | 4.54 |
| 1900-01-01 08:09:43 | 4.54 |
| 1900-01-01 08:09:48 | 4.54 |
| 1900-01-01 08:09:53 | 4.54 |
| 1900-01-01 08:09:58 | 4.53 |
| 1900-01-01 08:10:03 | 4.53 |
| 1900-01-01 08:10:08 | 4.54 |
| 1900-01-01 08:10:13 | 4.54 |
| 1900-01-01 08:10:18 | 4.54 |
| 1900-01-01 08:10:23 | 4.54 |
| 1900-01-01 08:10:28 | 4.53 |
| 1900-01-01 08:10:33 | 4.54 |
| 1900-01-01 08:10:38 | 4.54 |
| 1900-01-01 08:10:43 | 4.54 |
| 1900-01-01 08:10:48 | 4.54 |
| 1900-01-01 08:10:53 | 4.53 |
| 1900-01-01 08:10:58 | 4.54 |
| 1900-01-01 08:11:03 | 4.54 |
| 1900-01-01 08:11:08 | 4.53 |
| 1900-01-01 08:11:13 | 4.54 |
| 1900-01-01 08:11:18 | 4.53 |
| 1900-01-01 08:11:23 | 4.54 |
| 1900-01-01 08:11:28 | 4.54 |
| 1900-01-01 08:11:33 | 4.53 |
| 1900-01-01 08:11:38 | 4.54 |
| 1900-01-01 08:11:43 | 4.54 |
| 1900-01-01 08:11:48 | 4.54 |
| 1900-01-01 08:11:53 | 4.54 |
| 1900-01-01 08:11:58 | 4.54 |
| 1900-01-01 08:12:03 | 4.53 |
| 1900-01-01 08:12:08 | 4.54 |
| 1900-01-01 08:12:13 | 4.53 |
| 1900-01-01 08:12:18 | 4.54 |
| 1900-01-01 08:12:23 | 4.54 |
| 1900-01-01 08:12:28 | 4.54 |
| 1900-01-01 08:12:33 | 4.54 |
| 1900-01-01 08:12:38 | 4.53 |
| 1900-01-01 08:12:43 | 4.54 |
| 1900-01-01 08:12:48 | 4.54 |
| 1900-01-01 08:12:53 | 4.54 |
| 1900-01-01 08:12:58 | 4.54 |
| 1900-01-01 08:13:03 | 4.54 |
| 1900-01-01 08:13:08 | 4.54 |
| 1900-01-01 08:13:13 | 4.54 |
| 1900-01-01 08:13:18 | 4.54 |
| 1900-01-01 08:13:23 | 4.54 |
| 1900-01-01 08:13:28 | 4.54 |
| 1900-01-01 08:13:33 | 4.54 |
| 1900-01-01 08:13:38 | 4.54 |
| 1900-01-01 08:13:43 | 4.54 |
| 1900-01-01 08:13:48 | 4.53 |
| 1900-01-01 08:13:53 | 4.54 |
| 1900-01-01 08:13:58 | 4.54 |
| 1900-01-01 08:14:03 | 4.54 |
| 1900-01-01 08:14:08 | 4.54 |
| 1900-01-01 08:14:13 | 4.54 |
| 1900-01-01 08:14:18 | 4.53 |
| 1900-01-01 08:14:23 | 4.54 |
| 1900-01-01 08:14:28 | 4.53 |
| 1900-01-01 08:14:33 | 4.54 |
| 1900-01-01 08:14:38 | 4.54 |
| 1900-01-01 08:14:43 | 4.54 |
| 1900-01-01 08:14:48 | 4.53 |
| 1900-01-01 08:14:53 | 4.54 |
| 1900-01-01 08:14:58 | 4.54 |
| 1900-01-01 08:15:03 | 4.53 |
| 1900-01-01 08:15:08 | 4.54 |
| 1900-01-01 08:15:13 | 4.54 |
| 1900-01-01 08:15:18 | 4.54 |
| 1900-01-01 08:15:23 | 4.53 |
| 1900-01-01 08:15:28 | 4.54 |
| 1900-01-01 08:15:33 | 4.54 |
| 1900-01-01 08:15:38 | 4.53 |
| 1900-01-01 08:15:43 | 4.54 |
| 1900-01-01 08:15:48 | 4.54 |
| 1900-01-01 08:15:53 | 4.53 |
| 1900-01-01 08:15:58 | 4.54 |
| 1900-01-01 08:16:03 | 4.54 |
| 1900-01-01 08:16:08 | 4.54 |
| 1900-01-01 08:16:13 | 4.54 |
| 1900-01-01 08:16:18 | 4.54 |
| 1900-01-01 08:16:23 | 4.54 |
| 1900-01-01 08:16:28 | 4.54 |
| 1900-01-01 08:16:33 | 4.54 |
| 1900-01-01 08:16:38 | 4.54 |
| 1900-01-01 08:16:43 | 4.54 |
| 1900-01-01 08:16:48 | 4.54 |
| 1900-01-01 08:16:53 | 4.54 |
| 1900-01-01 08:16:58 | 4.53 |
| 1900-01-01 08:17:03 | 4.54 |
| 1900-01-01 08:17:08 | 4.54 |
| 1900-01-01 08:17:13 | 4.54 |
| 1900-01-01 08:17:18 | 4.54 |
| 1900-01-01 08:17:23 | 4.54 |
| 1900-01-01 08:17:28 | 4.54 |
| 1900-01-01 08:17:33 | 4.54 |
| 1900-01-01 08:17:38 | 4.54 |
| 1900-01-01 08:17:43 | 4.54 |
| 1900-01-01 08:17:48 | 4.54 |
| 1900-01-01 08:17:53 | 4.54 |
| 1900-01-01 08:17:58 | 4.54 |
| 1900-01-01 08:18:03 | 4.53 |
| 1900-01-01 08:18:08 | 4.53 |
| 1900-01-01 08:18:13 | 4.54 |
| 1900-01-01 08:18:18 | 4.54 |
| 1900-01-01 08:18:23 | 4.54 |
| 1900-01-01 08:18:28 | 4.54 |
| 1900-01-01 08:18:33 | 4.54 |
| 1900-01-01 08:18:38 | 4.54 |
| 1900-01-01 08:18:43 | 4.53 |
| 1900-01-01 08:18:48 | 4.54 |
| 1900-01-01 08:18:53 | 4.54 |
| 1900-01-01 08:18:58 | 4.53 |
| 1900-01-01 08:19:03 | 4.54 |
| 1900-01-01 08:19:08 | 4.54 |
| 1900-01-01 08:19:13 | 4.54 |
| 1900-01-01 08:19:18 | 4.53 |
| 1900-01-01 08:19:23 | 4.54 |
| 1900-01-01 08:19:28 | 4.53 |
| 1900-01-01 08:19:33 | 4.55 |
| 1900-01-01 08:19:38 | 4.54 |
| 1900-01-01 08:19:43 | 4.54 |
| 1900-01-01 08:19:48 | 4.54 |
| 1900-01-01 08:19:53 | 4.53 |
| 1900-01-01 08:19:58 | 4.53 |
| 1900-01-01 08:20:03 | 4.54 |
| 1900-01-01 08:20:08 | 4.53 |
| 1900-01-01 08:20:13 | 4.54 |
| 1900-01-01 08:20:18 | 4.54 |
| 1900-01-01 08:20:23 | 4.53 |
| 1900-01-01 08:20:28 | 4.54 |
| 1900-01-01 08:20:33 | 4.53 |
| 1900-01-01 08:20:38 | 4.54 |
| 1900-01-01 08:20:43 | 4.54 |
| 1900-01-01 08:20:48 | 4.54 |
| 1900-01-01 08:20:53 | 4.54 |
| 1900-01-01 08:20:58 | 4.54 |
| 1900-01-01 08:21:03 | 4.53 |
| 1900-01-01 08:21:08 | 4.54 |
| 1900-01-01 08:21:13 | 4.54 |
| 1900-01-01 08:21:18 | 4.53 |
| 1900-01-01 08:21:23 | 4.53 |
| 1900-01-01 08:21:28 | 4.54 |
| 1900-01-01 08:21:33 | 4.54 |
| 1900-01-01 08:21:38 | 4.53 |
| 1900-01-01 08:21:43 | 4.54 |
| 1900-01-01 08:21:48 | 4.53 |
| 1900-01-01 08:21:53 | 4.54 |
| 1900-01-01 08:21:58 | 4.53 |
| 1900-01-01 08:22:03 | 4.53 |
| 1900-01-01 08:22:08 | 4.54 |
| 1900-01-01 08:22:13 | 4.54 |
| 1900-01-01 08:22:18 | 4.54 |
| 1900-01-01 08:22:23 | 4.54 |
| 1900-01-01 08:22:28 | 4.54 |
| 1900-01-01 08:22:33 | 4.54 |
| 1900-01-01 08:22:38 | 4.53 |
| 1900-01-01 08:22:43 | 4.54 |
| 1900-01-01 08:22:48 | 4.54 |
| 1900-01-01 08:22:53 | 4.53 |
| 1900-01-01 08:22:58 | 4.54 |
| 1900-01-01 08:23:03 | 4.54 |
| 1900-01-01 08:23:08 | 4.54 |
| 1900-01-01 08:23:13 | 4.54 |
| 1900-01-01 08:23:18 | 4.54 |
| 1900-01-01 08:23:23 | 4.53 |
| 1900-01-01 08:23:28 | 4.54 |
| 1900-01-01 08:23:33 | 4.54 |
| 1900-01-01 08:23:38 | 4.54 |
| 1900-01-01 08:23:43 | 4.54 |
| 1900-01-01 08:23:48 | 4.53 |
| 1900-01-01 08:23:53 | 4.54 |
| 1900-01-01 08:23:58 | 4.54 |
| 1900-01-01 08:24:03 | 4.54 |
| 1900-01-01 08:24:08 | 4.54 |
| 1900-01-01 08:24:13 | 4.53 |
| 1900-01-01 08:24:18 | 4.54 |
| 1900-01-01 08:24:23 | 4.54 |
| 1900-01-01 08:24:28 | 4.54 |
| 1900-01-01 08:24:33 | 4.53 |
| 1900-01-01 08:24:38 | 4.54 |
| 1900-01-01 08:24:43 | 4.53 |
| 1900-01-01 08:24:48 | 4.54 |
| 1900-01-01 08:24:53 | 4.54 |
| 1900-01-01 08:24:58 | 4.54 |
| 1900-01-01 08:25:03 | 4.54 |
| 1900-01-01 08:25:08 | 4.53 |
| 1900-01-01 08:25:13 | 4.53 |
| 1900-01-01 08:25:18 | 4.54 |
| 1900-01-01 08:25:23 | 4.53 |
| 1900-01-01 08:25:28 | 4.54 |
| 1900-01-01 08:25:33 | 4.54 |
| 1900-01-01 08:25:38 | 4.54 |
| 1900-01-01 08:25:43 | 4.54 |
| 1900-01-01 08:25:48 | 4.54 |
| 1900-01-01 08:25:53 | 4.54 |
| 1900-01-01 08:25:58 | 4.54 |
| 1900-01-01 08:26:03 | 4.54 |
| 1900-01-01 08:26:08 | 4.54 |
| 1900-01-01 08:26:13 | 4.53 |
| 1900-01-01 08:26:18 | 4.54 |
| 1900-01-01 08:26:23 | 4.53 |
| 1900-01-01 08:26:28 | 4.53 |
| 1900-01-01 08:26:33 | 4.54 |
| 1900-01-01 08:26:38 | 4.54 |
| 1900-01-01 08:26:43 | 4.53 |
| 1900-01-01 08:26:48 | 4.54 |
| 1900-01-01 08:26:53 | 4.54 |
| 1900-01-01 08:26:58 | 4.54 |
| 1900-01-01 08:27:03 | 4.53 |
| 1900-01-01 08:27:08 | 4.53 |
| 1900-01-01 08:27:13 | 4.54 |
| 1900-01-01 08:27:18 | 4.54 |
| 1900-01-01 08:27:23 | 4.54 |
| 1900-01-01 08:27:28 | 4.54 |
| 1900-01-01 08:27:33 | 4.54 |
| 1900-01-01 08:27:38 | 4.54 |
| 1900-01-01 08:27:43 | 4.53 |
| 1900-01-01 08:27:48 | 4.54 |
| 1900-01-01 08:27:53 | 4.54 |
| 1900-01-01 08:27:58 | 4.54 |
| 1900-01-01 08:28:03 | 4.53 |
| 1900-01-01 08:28:08 | 4.53 |
| 1900-01-01 08:28:13 | 4.54 |
| 1900-01-01 08:28:18 | 4.54 |
| 1900-01-01 08:28:23 | 4.54 |
| 1900-01-01 08:28:28 | 4.54 |
| 1900-01-01 08:28:33 | 4.53 |
| 1900-01-01 08:28:38 | 4.53 |
| 1900-01-01 08:28:43 | 4.54 |
| 1900-01-01 08:28:48 | 4.54 |
| 1900-01-01 08:28:53 | 4.53 |
| 1900-01-01 08:28:58 | 4.54 |
| 1900-01-01 08:29:03 | 4.53 |
| 1900-01-01 08:29:08 | 4.54 |
| 1900-01-01 08:29:13 | 4.54 |
| 1900-01-01 08:29:18 | 4.53 |
| 1900-01-01 08:29:23 | 4.54 |
| 1900-01-01 08:29:28 | 4.54 |
| 1900-01-01 08:29:33 | 4.54 |
| 1900-01-01 08:29:38 | 4.54 |
| 1900-01-01 08:29:43 | 4.54 |
| 1900-01-01 08:29:48 | 4.54 |
| 1900-01-01 08:29:53 | 4.53 |
| 1900-01-01 08:29:58 | 4.54 |
| 1900-01-01 08:30:03 | 4.53 |
| 1900-01-01 08:30:08 | 4.54 |
| 1900-01-01 08:30:13 | 4.54 |
| 1900-01-01 08:30:18 | 4.53 |
| 1900-01-01 08:30:23 | 4.53 |
| 1900-01-01 08:30:28 | 4.54 |
| 1900-01-01 08:30:33 | 4.54 |
| 1900-01-01 08:30:38 | 4.53 |
| 1900-01-01 08:30:43 | 4.54 |
| 1900-01-01 08:30:48 | 4.54 |
| 1900-01-01 08:30:53 | 4.53 |
| 1900-01-01 08:30:58 | 4.54 |
| 1900-01-01 08:31:03 | 4.53 |
| 1900-01-01 08:31:08 | 4.54 |
| 1900-01-01 08:31:13 | 4.54 |
| 1900-01-01 08:31:18 | 4.53 |
| 1900-01-01 08:31:23 | 4.54 |
| 1900-01-01 08:31:28 | 4.54 |
| 1900-01-01 08:31:33 | 4.54 |
| 1900-01-01 08:31:38 | 4.54 |
| 1900-01-01 08:31:43 | 4.54 |
| 1900-01-01 08:31:48 | 4.54 |
| 1900-01-01 08:31:53 | 4.54 |
| 1900-01-01 08:31:58 | 4.54 |
| 1900-01-01 08:32:03 | 4.54 |
| 1900-01-01 08:32:08 | 4.54 |
| 1900-01-01 08:32:13 | 4.54 |
| 1900-01-01 08:32:18 | 4.53 |
| 1900-01-01 08:32:23 | 4.54 |
| 1900-01-01 08:32:28 | 4.53 |
| 1900-01-01 08:32:33 | 4.54 |
| 1900-01-01 08:32:38 | 4.54 |
| 1900-01-01 08:32:43 | 4.54 |
| 1900-01-01 08:32:48 | 4.54 |
| 1900-01-01 08:32:53 | 4.54 |
| 1900-01-01 08:32:58 | 4.54 |
| 1900-01-01 08:33:03 | 4.54 |
| 1900-01-01 08:33:08 | 4.54 |
| 1900-01-01 08:33:13 | 4.53 |
| 1900-01-01 08:33:18 | 4.53 |
| 1900-01-01 08:33:23 | 4.54 |
| 1900-01-01 08:33:28 | 4.54 |
| 1900-01-01 08:33:33 | 4.54 |
| 1900-01-01 08:33:38 | 4.53 |
| 1900-01-01 08:33:43 | 4.54 |
| 1900-01-01 08:33:48 | 4.54 |
| 1900-01-01 08:33:53 | 4.54 |
| 1900-01-01 08:33:58 | 4.54 |
| 1900-01-01 08:34:03 | 4.54 |
| 1900-01-01 08:34:08 | 4.53 |
| 1900-01-01 08:34:13 | 4.53 |
| 1900-01-01 08:34:18 | 4.53 |
| 1900-01-01 08:34:23 | 4.54 |
| 1900-01-01 08:34:28 | 4.53 |
| 1900-01-01 08:34:33 | 4.54 |
| 1900-01-01 08:34:38 | 4.54 |
| 1900-01-01 08:34:43 | 4.54 |
| 1900-01-01 08:34:48 | 4.54 |
| 1900-01-01 08:34:53 | 4.54 |
| 1900-01-01 08:34:58 | 4.53 |
| 1900-01-01 08:35:03 | 4.54 |
| 1900-01-01 08:35:08 | 4.53 |
| 1900-01-01 08:35:13 | 4.54 |
| 1900-01-01 08:35:18 | 4.54 |
| 1900-01-01 08:35:23 | 4.54 |
| 1900-01-01 08:35:28 | 4.54 |
| 1900-01-01 08:35:33 | 4.54 |
| 1900-01-01 08:35:38 | 4.53 |
| 1900-01-01 08:35:43 | 4.54 |
| 1900-01-01 08:35:48 | 4.54 |
| 1900-01-01 08:35:53 | 4.54 |
| 1900-01-01 08:35:58 | 4.54 |
| 1900-01-01 08:36:03 | 4.54 |
| 1900-01-01 08:36:08 | 4.54 |
| 1900-01-01 08:36:13 | 4.54 |
| 1900-01-01 08:36:18 | 4.54 |
| 1900-01-01 08:36:23 | 4.54 |
| 1900-01-01 08:36:28 | 4.53 |
| 1900-01-01 08:36:33 | 4.54 |
| 1900-01-01 08:36:38 | 4.54 |
| 1900-01-01 08:36:43 | 4.54 |
| 1900-01-01 08:36:48 | 4.54 |
| 1900-01-01 08:36:53 | 4.53 |
| 1900-01-01 08:36:58 | 4.54 |
| 1900-01-01 08:37:03 | 4.53 |
| 1900-01-01 08:37:08 | 4.54 |
| 1900-01-01 08:37:13 | 4.54 |
| 1900-01-01 08:37:18 | 4.54 |
| 1900-01-01 08:37:23 | 4.54 |
| 1900-01-01 08:37:28 | 4.54 |
| 1900-01-01 08:37:33 | 4.54 |
| 1900-01-01 08:37:38 | 4.54 |
| 1900-01-01 08:37:43 | 4.54 |
| 1900-01-01 08:37:48 | 4.53 |
| 1900-01-01 08:37:53 | 4.54 |
| 1900-01-01 08:37:58 | 4.54 |
| 1900-01-01 08:38:03 | 4.54 |
| 1900-01-01 08:38:08 | 4.54 |
| 1900-01-01 08:38:13 | 4.54 |
| 1900-01-01 08:38:18 | 4.54 |
| 1900-01-01 08:38:23 | 4.54 |
| 1900-01-01 08:38:28 | 4.54 |
| 1900-01-01 08:38:33 | 4.53 |
| 1900-01-01 08:38:38 | 4.54 |
| 1900-01-01 08:38:43 | 4.54 |
| 1900-01-01 08:38:48 | 4.54 |
| 1900-01-01 08:38:53 | 4.53 |
| 1900-01-01 08:38:58 | 4.54 |
| 1900-01-01 08:39:03 | 4.54 |
| 1900-01-01 08:39:08 | 4.54 |
| 1900-01-01 08:39:13 | 4.54 |
| 1900-01-01 08:39:18 | 4.54 |
| 1900-01-01 08:39:23 | 4.54 |
| 1900-01-01 08:39:28 | 4.54 |
| 1900-01-01 08:39:33 | 4.54 |
| 1900-01-01 08:39:38 | 4.53 |
| 1900-01-01 08:39:43 | 4.54 |
| 1900-01-01 08:39:48 | 4.53 |
| 1900-01-01 08:39:53 | 4.53 |
| 1900-01-01 08:39:58 | 4.54 |
| 1900-01-01 08:40:03 | 4.54 |
| 1900-01-01 08:40:08 | 4.54 |
| 1900-01-01 08:40:13 | 4.54 |
| 1900-01-01 08:40:18 | 4.54 |
| 1900-01-01 08:40:23 | 4.54 |
| 1900-01-01 08:40:28 | 4.54 |
| 1900-01-01 08:40:33 | 4.54 |
| 1900-01-01 08:40:38 | 4.54 |
| 1900-01-01 08:40:43 | 4.54 |
| 1900-01-01 08:40:48 | 4.54 |
| 1900-01-01 08:40:53 | 4.53 |
| 1900-01-01 08:40:58 | 4.54 |
| 1900-01-01 08:41:03 | 4.54 |
| 1900-01-01 08:41:08 | 4.54 |
| 1900-01-01 08:41:13 | 4.54 |
| 1900-01-01 08:41:18 | 4.53 |
| 1900-01-01 08:41:23 | 4.54 |
| 1900-01-01 08:41:28 | 4.54 |
| 1900-01-01 08:41:33 | 4.54 |
| 1900-01-01 08:41:38 | 4.54 |
| 1900-01-01 08:41:43 | 4.54 |
| 1900-01-01 08:41:48 | 4.53 |
| 1900-01-01 08:41:53 | 4.54 |
| 1900-01-01 08:41:58 | 4.53 |
| 1900-01-01 08:42:03 | 4.54 |
| 1900-01-01 08:42:08 | 4.54 |
| 1900-01-01 08:42:13 | 4.54 |
| 1900-01-01 08:42:18 | 4.53 |
| 1900-01-01 08:42:23 | 4.54 |
| 1900-01-01 08:42:28 | 4.54 |
| 1900-01-01 08:42:33 | 4.53 |
| 1900-01-01 08:42:38 | 4.54 |
| 1900-01-01 08:42:43 | 4.54 |
| 1900-01-01 08:42:48 | 4.54 |
| 1900-01-01 08:42:53 | 4.54 |
| 1900-01-01 08:42:58 | 4.54 |
| 1900-01-01 08:43:03 | 4.54 |
| 1900-01-01 08:43:08 | 4.54 |
| 1900-01-01 08:43:13 | 4.54 |
| 1900-01-01 08:43:18 | 4.54 |
| 1900-01-01 08:43:23 | 4.54 |
| 1900-01-01 08:43:28 | 4.54 |
| 1900-01-01 08:43:33 | 4.54 |
| 1900-01-01 08:43:38 | 4.54 |
| 1900-01-01 08:43:43 | 4.54 |
| 1900-01-01 08:43:48 | 4.53 |
| 1900-01-01 08:43:53 | 4.54 |
| 1900-01-01 08:43:58 | 4.54 |
| 1900-01-01 08:44:03 | 4.54 |
| 1900-01-01 08:44:08 | 4.53 |
| 1900-01-01 08:44:13 | 4.54 |
| 1900-01-01 08:44:18 | 4.54 |
| 1900-01-01 08:44:23 | 4.53 |
| 1900-01-01 08:44:28 | 4.54 |
| 1900-01-01 08:44:33 | 4.54 |
| 1900-01-01 08:44:38 | 4.54 |
| 1900-01-01 08:44:43 | 4.53 |
| 1900-01-01 08:44:48 | 4.54 |
| 1900-01-01 08:44:53 | 4.54 |
| 1900-01-01 08:44:58 | 4.53 |
| 1900-01-01 08:45:03 | 4.53 |
| 1900-01-01 08:45:08 | 4.54 |
| 1900-01-01 08:45:13 | 4.54 |
| 1900-01-01 08:45:18 | 4.54 |
| 1900-01-01 08:45:23 | 4.54 |
| 1900-01-01 08:45:28 | 4.54 |
| 1900-01-01 08:45:33 | 4.53 |
| 1900-01-01 08:45:38 | 4.54 |
| 1900-01-01 08:45:43 | 4.54 |
| 1900-01-01 08:45:48 | 4.53 |
| 1900-01-01 08:45:53 | 4.53 |
| 1900-01-01 08:45:58 | 4.54 |
| 1900-01-01 08:46:03 | 4.53 |
| 1900-01-01 08:46:08 | 4.53 |
| 1900-01-01 08:46:13 | 4.54 |
| 1900-01-01 08:46:18 | 4.53 |
| 1900-01-01 08:46:23 | 4.53 |
| 1900-01-01 08:46:28 | 4.54 |
| 1900-01-01 08:46:33 | 4.53 |
| 1900-01-01 08:46:38 | 4.54 |
| 1900-01-01 08:46:43 | 4.54 |
| 1900-01-01 08:46:48 | 4.53 |
| 1900-01-01 08:46:53 | 4.54 |
| 1900-01-01 08:46:58 | 4.53 |
| 1900-01-01 08:47:03 | 4.54 |
| 1900-01-01 08:47:08 | 4.54 |
| 1900-01-01 08:47:13 | 4.54 |
| 1900-01-01 08:47:18 | 4.54 |
| 1900-01-01 08:47:23 | 4.54 |
| 1900-01-01 08:47:28 | 4.54 |
| 1900-01-01 08:47:33 | 4.54 |
| 1900-01-01 08:47:38 | 4.54 |
| 1900-01-01 08:47:43 | 4.54 |
| 1900-01-01 08:47:48 | 4.53 |
| 1900-01-01 08:47:53 | 4.54 |
| 1900-01-01 08:47:58 | 4.54 |
| 1900-01-01 08:48:03 | 4.53 |
| 1900-01-01 08:48:08 | 4.54 |
| 1900-01-01 08:48:13 | 4.53 |
| 1900-01-01 08:48:18 | 4.54 |
| 1900-01-01 08:48:23 | 4.54 |
| 1900-01-01 08:48:28 | 4.53 |
| 1900-01-01 08:48:33 | 4.53 |
| 1900-01-01 08:48:38 | 4.54 |
| 1900-01-01 08:48:43 | 4.54 |
| 1900-01-01 08:48:48 | 4.53 |
| 1900-01-01 08:48:53 | 4.53 |
| 1900-01-01 08:48:58 | 4.53 |
| 1900-01-01 08:49:03 | 4.54 |
| 1900-01-01 08:49:08 | 4.54 |
| 1900-01-01 08:49:13 | 4.53 |
| 1900-01-01 08:49:18 | 4.53 |
| 1900-01-01 08:49:23 | 4.53 |
| 1900-01-01 08:49:28 | 4.54 |
| 1900-01-01 08:49:33 | 4.54 |
| 1900-01-01 08:49:38 | 4.54 |
| 1900-01-01 08:49:43 | 4.54 |
| 1900-01-01 08:49:48 | 4.53 |
| 1900-01-01 08:49:53 | 4.53 |
| 1900-01-01 08:49:58 | 4.54 |
| 1900-01-01 08:50:03 | 4.54 |
| 1900-01-01 08:50:08 | 4.54 |
| 1900-01-01 08:50:13 | 4.54 |
| 1900-01-01 08:50:18 | 4.54 |
| 1900-01-01 08:50:23 | 4.54 |
| 1900-01-01 08:50:28 | 4.54 |
| 1900-01-01 08:50:33 | 4.53 |
| 1900-01-01 08:50:38 | 4.54 |
| 1900-01-01 08:50:43 | 4.54 |
| 1900-01-01 08:50:48 | 4.53 |
| 1900-01-01 08:50:53 | 4.53 |
| 1900-01-01 08:50:58 | 4.53 |
| 1900-01-01 08:51:03 | 4.54 |
| 1900-01-01 08:51:08 | 4.53 |
| 1900-01-01 08:51:13 | 4.54 |
| 1900-01-01 08:51:18 | 4.54 |
| 1900-01-01 08:51:23 | 4.54 |
| 1900-01-01 08:51:28 | 4.53 |
| 1900-01-01 08:51:33 | 4.53 |
| 1900-01-01 08:51:38 | 4.54 |
| 1900-01-01 08:51:43 | 4.54 |
| 1900-01-01 08:51:48 | 4.54 |
| 1900-01-01 08:51:53 | 4.53 |
| 1900-01-01 08:51:58 | 4.53 |
| 1900-01-01 08:52:03 | 4.54 |
| 1900-01-01 08:52:08 | 4.54 |
| 1900-01-01 08:52:13 | 4.53 |
| 1900-01-01 08:52:18 | 4.54 |
| 1900-01-01 08:52:23 | 4.54 |
| 1900-01-01 08:52:28 | 4.53 |
| 1900-01-01 08:52:33 | 4.54 |
| 1900-01-01 08:52:38 | 4.53 |
| 1900-01-01 08:52:43 | 4.54 |
| 1900-01-01 08:52:48 | 4.54 |
| 1900-01-01 08:52:53 | 4.54 |
| 1900-01-01 08:52:58 | 4.53 |
| 1900-01-01 08:53:03 | 4.54 |
| 1900-01-01 08:53:08 | 4.54 |
| 1900-01-01 08:53:13 | 4.54 |
| 1900-01-01 08:53:18 | 4.54 |
| 1900-01-01 08:53:23 | 4.54 |
| 1900-01-01 08:53:28 | 4.54 |
| 1900-01-01 08:53:33 | 4.54 |
| 1900-01-01 08:53:38 | 4.53 |
| 1900-01-01 08:53:43 | 4.54 |
| 1900-01-01 08:53:48 | 4.54 |
| 1900-01-01 08:53:53 | 4.54 |
| 1900-01-01 08:53:58 | 4.53 |
| 1900-01-01 08:54:03 | 4.54 |
| 1900-01-01 08:54:08 | 4.54 |
| 1900-01-01 08:54:13 | 4.54 |
| 1900-01-01 08:54:18 | 4.54 |
| 1900-01-01 08:54:23 | 4.53 |
| 1900-01-01 08:54:28 | 4.54 |
| 1900-01-01 08:54:33 | 4.53 |
| 1900-01-01 08:54:38 | 4.53 |
| 1900-01-01 08:54:43 | 4.53 |
| 1900-01-01 08:54:48 | 4.54 |
| 1900-01-01 08:54:53 | 4.53 |
| 1900-01-01 08:54:58 | 4.54 |
| 1900-01-01 08:55:03 | 4.53 |
| 1900-01-01 08:55:08 | 4.54 |
| 1900-01-01 08:55:13 | 4.54 |
| 1900-01-01 08:55:18 | 4.53 |
| 1900-01-01 08:55:23 | 4.54 |
| 1900-01-01 08:55:28 | 4.54 |
| 1900-01-01 08:55:33 | 4.53 |
| 1900-01-01 08:55:38 | 4.53 |
| 1900-01-01 08:55:43 | 4.53 |
| 1900-01-01 08:55:48 | 4.53 |
| 1900-01-01 08:55:53 | 4.54 |
| 1900-01-01 08:55:58 | 4.54 |
| 1900-01-01 08:56:03 | 4.53 |
| 1900-01-01 08:56:08 | 4.53 |
| 1900-01-01 08:56:13 | 4.54 |
| 1900-01-01 08:56:18 | 4.54 |
| 1900-01-01 08:56:23 | 4.54 |
| 1900-01-01 08:56:28 | 4.53 |
| 1900-01-01 08:56:33 | 4.54 |
| 1900-01-01 08:56:38 | 4.53 |
| 1900-01-01 08:56:43 | 4.54 |
| 1900-01-01 08:56:48 | 4.54 |
| 1900-01-01 08:56:53 | 4.54 |
| 1900-01-01 08:56:58 | 4.54 |
| 1900-01-01 08:57:03 | 4.54 |
| 1900-01-01 08:57:08 | 4.53 |
| 1900-01-01 08:57:13 | 4.54 |
| 1900-01-01 08:57:18 | 4.53 |
| 1900-01-01 08:57:23 | 4.54 |
| 1900-01-01 08:57:28 | 4.54 |
| 1900-01-01 08:57:33 | 4.54 |
| 1900-01-01 08:57:38 | 4.54 |
| 1900-01-01 08:57:43 | 4.54 |
| 1900-01-01 08:57:48 | 4.54 |
| 1900-01-01 08:57:53 | 4.54 |
| 1900-01-01 08:57:58 | 4.54 |
| 1900-01-01 08:58:03 | 4.54 |
| 1900-01-01 08:58:08 | 4.53 |
| 1900-01-01 08:58:13 | 4.53 |
| 1900-01-01 08:58:18 | 4.54 |
| 1900-01-01 08:58:23 | 4.54 |
| 1900-01-01 08:58:28 | 4.53 |
| 1900-01-01 08:58:33 | 4.54 |
| 1900-01-01 08:58:38 | 4.54 |
| 1900-01-01 08:58:43 | 4.54 |
| 1900-01-01 08:58:48 | 4.54 |
| 1900-01-01 08:58:53 | 4.54 |
| 1900-01-01 08:58:58 | 4.53 |
| 1900-01-01 08:59:03 | 4.54 |
| 1900-01-01 08:59:08 | 4.54 |
| 1900-01-01 08:59:13 | 4.54 |
| 1900-01-01 08:59:18 | 4.54 |
| 1900-01-01 08:59:23 | 4.54 |
| 1900-01-01 08:59:28 | 4.54 |
| 1900-01-01 08:59:33 | 4.53 |
| 1900-01-01 08:59:38 | 4.54 |
| 1900-01-01 08:59:43 | 4.54 |
| 1900-01-01 08:59:48 | 4.54 |
| 1900-01-01 08:59:53 | 4.54 |
| 1900-01-01 08:59:58 | 4.54 |
| 1900-01-01 09:00:03 | 4.53 |
| 1900-01-01 09:00:08 | 4.54 |
| 1900-01-01 09:00:13 | 4.54 |
| 1900-01-01 09:00:18 | 4.54 |
| 1900-01-01 09:00:23 | 4.53 |
| 1900-01-01 09:00:28 | 4.53 |
| 1900-01-01 09:00:33 | 4.54 |
| 1900-01-01 09:00:38 | 4.53 |
| 1900-01-01 09:00:43 | 4.54 |
| 1900-01-01 09:00:48 | 4.53 |
| 1900-01-01 09:00:53 | 4.54 |
| 1900-01-01 09:00:58 | 4.54 |
| 1900-01-01 09:01:03 | 4.54 |
| 1900-01-01 09:01:08 | 4.53 |
| 1900-01-01 09:01:13 | 4.54 |
| 1900-01-01 09:01:18 | 4.53 |
| 1900-01-01 09:01:23 | 4.54 |
| 1900-01-01 09:01:28 | 4.54 |
| 1900-01-01 09:01:33 | 4.53 |
| 1900-01-01 09:01:38 | 4.54 |
| 1900-01-01 09:01:43 | 4.53 |
| 1900-01-01 09:01:48 | 4.53 |
| 1900-01-01 09:01:53 | 4.54 |
| 1900-01-01 09:01:58 | 4.53 |
| 1900-01-01 09:02:03 | 4.54 |
| 1900-01-01 09:02:08 | 4.53 |
| 1900-01-01 09:02:13 | 4.54 |
| 1900-01-01 09:02:18 | 4.53 |
| 1900-01-01 09:02:23 | 4.54 |
| 1900-01-01 09:02:28 | 4.54 |
| 1900-01-01 09:02:33 | 4.54 |
| 1900-01-01 09:02:38 | 4.54 |
| 1900-01-01 09:02:43 | 4.54 |
| 1900-01-01 09:02:48 | 4.54 |
| 1900-01-01 09:02:53 | 4.54 |
| 1900-01-01 09:02:58 | 4.54 |
| 1900-01-01 09:03:03 | 4.54 |
| 1900-01-01 09:03:08 | 4.54 |
| 1900-01-01 09:03:13 | 4.54 |
| 1900-01-01 09:03:18 | 4.54 |
| 1900-01-01 09:03:23 | 4.54 |
| 1900-01-01 09:03:28 | 4.53 |
| 1900-01-01 09:03:33 | 4.53 |
| 1900-01-01 09:03:38 | 4.54 |
| 1900-01-01 09:03:43 | 4.54 |
| 1900-01-01 09:03:48 | 4.54 |
| 1900-01-01 09:03:53 | 4.54 |
| 1900-01-01 09:03:58 | 4.54 |
| 1900-01-01 09:04:03 | 4.54 |
| 1900-01-01 09:04:08 | 4.54 |
| 1900-01-01 09:04:13 | 4.54 |
| 1900-01-01 09:04:18 | 4.54 |
| 1900-01-01 09:04:23 | 4.53 |
| 1900-01-01 09:04:28 | 4.53 |
| 1900-01-01 09:04:33 | 4.54 |
| 1900-01-01 09:04:38 | 4.53 |
| 1900-01-01 09:04:43 | 4.53 |
| 1900-01-01 09:04:48 | 4.53 |
| 1900-01-01 09:04:53 | 4.54 |
| 1900-01-01 09:04:58 | 4.53 |
| 1900-01-01 09:05:03 | 4.54 |
| 1900-01-01 09:05:08 | 4.53 |
| 1900-01-01 09:05:13 | 4.53 |
| 1900-01-01 09:05:18 | 4.54 |
| 1900-01-01 09:05:23 | 4.54 |
| 1900-01-01 09:05:28 | 4.54 |
| 1900-01-01 09:05:33 | 4.54 |
| 1900-01-01 09:05:38 | 4.54 |
| 1900-01-01 09:05:43 | 4.78 |
| 1900-01-01 09:05:48 | 5.11 |
| 1900-01-01 09:05:53 | 5 |
| 1900-01-01 09:05:58 | 5.2 |
| 1900-01-01 09:06:03 | 4.67 |
| 1900-01-01 09:06:08 | 4.81 |
| 1900-01-01 09:06:13 | 4.76 |
| 1900-01-01 09:06:18 | 4.93 |
| 1900-01-01 09:06:23 | 5.03 |
| 1900-01-01 09:06:28 | 5.42 |
| 1900-01-01 09:06:33 | 5.46 |
| 1900-01-01 09:06:38 | 5.5 |
| 1900-01-01 09:06:43 | 5.52 |
| 1900-01-01 09:06:48 | 5.52 |
| 1900-01-01 09:06:53 | 5.56 |
| 1900-01-01 09:06:58 | 5.44 |
| 1900-01-01 09:07:03 | 5.44 |
| 1900-01-01 09:07:08 | 5.59 |
| 1900-01-01 09:07:13 | 5.58 |
| 1900-01-01 09:07:18 | 5.57 |
| 1900-01-01 09:07:23 | 5.57 |
| 1900-01-01 09:07:28 | 5.55 |
| 1900-01-01 09:07:33 | 5.64 |
| 1900-01-01 09:07:38 | 5.65 |
| 1900-01-01 09:07:43 | 5.56 |
| 1900-01-01 09:07:48 | 5.57 |
| 1900-01-01 09:07:53 | 5.67 |
| 1900-01-01 09:07:58 | 5.57 |
| 1900-01-01 09:08:03 | 5.68 |
| 1900-01-01 09:08:08 | 5.61 |
| 1900-01-01 09:08:13 | 5.61 |
| 1900-01-01 09:08:18 | 5.62 |
| 1900-01-01 09:08:23 | 5.72 |
| 1900-01-01 09:08:28 | 5.64 |
| 1900-01-01 09:08:33 | 5.64 |
| 1900-01-01 09:08:38 | 5.65 |
| 1900-01-01 09:08:43 | 5.74 |
| 1900-01-01 09:08:48 | 5.67 |
| 1900-01-01 09:08:53 | 5.76 |
| 1900-01-01 09:08:58 | 5.75 |
| 1900-01-01 09:09:03 | 5.76 |
| 1900-01-01 09:09:08 | 5.68 |
| 1900-01-01 09:09:13 | 5.7 |
| 1900-01-01 09:09:18 | 5.77 |
| 1900-01-01 09:09:23 | 5.7 |
| 1900-01-01 09:09:28 | 5.71 |
| 1900-01-01 09:09:33 | 5.71 |
| 1900-01-01 09:09:38 | 5.72 |
| 1900-01-01 09:09:43 | 5.8 |
| 1900-01-01 09:09:48 | 5.73 |
| 1900-01-01 09:09:53 | 5.74 |
| 1900-01-01 09:09:58 | 5.81 |
| 1900-01-01 09:10:03 | 5.81 |
| 1900-01-01 09:10:08 | 5.81 |
| 1900-01-01 09:10:13 | 5.75 |
| 1900-01-01 09:10:18 | 5.82 |
| 1900-01-01 09:10:23 | 5.83 |
| 1900-01-01 09:10:28 | 5.77 |
| 1900-01-01 09:10:33 | 5.84 |
| 1900-01-01 09:10:38 | 5.78 |
| 1900-01-01 09:10:43 | 5.84 |
| 1900-01-01 09:10:48 | 5.78 |
| 1900-01-01 09:10:53 | 5.84 |
| 1900-01-01 09:10:58 | 5.85 |
| 1900-01-01 09:11:03 | 5.86 |
| 1900-01-01 09:11:08 | 5.87 |
| 1900-01-01 09:11:13 | 5.81 |
| 1900-01-01 09:11:18 | 5.87 |
| 1900-01-01 09:11:23 | 5.82 |
| 1900-01-01 09:11:28 | 5.88 |
| 1900-01-01 09:11:33 | 5.9 |
| 1900-01-01 09:11:38 | 5.9 |
| 1900-01-01 09:11:43 | 5.92 |
| 1900-01-01 09:11:48 | 5.86 |
| 1900-01-01 09:11:53 | 5.93 |
| 1900-01-01 09:11:58 | 5.88 |
| 1900-01-01 09:12:03 | 5.94 |
| 1900-01-01 09:12:08 | 5.88 |
| 1900-01-01 09:12:13 | 5.93 |
| 1900-01-01 09:12:18 | 5.94 |
| 1900-01-01 09:12:23 | 5.89 |
| 1900-01-01 09:12:28 | 5.94 |
| 1900-01-01 09:12:33 | 5.94 |
| 1900-01-01 09:12:38 | 5.95 |
| 1900-01-01 09:12:43 | 5.9 |
| 1900-01-01 09:12:48 | 5.96 |
| 1900-01-01 09:12:53 | 5.96 |
| 1900-01-01 09:12:58 | 5.96 |
| 1900-01-01 09:13:03 | 5.97 |
| 1900-01-01 09:13:08 | 5.97 |
| 1900-01-01 09:13:13 | 5.93 |
| 1900-01-01 09:13:18 | 5.98 |
| 1900-01-01 09:13:23 | 5.94 |
| 1900-01-01 09:13:28 | 5.99 |
| 1900-01-01 09:13:33 | 5.99 |
| 1900-01-01 09:13:38 | 5.99 |
| 1900-01-01 09:13:43 | 5.99 |
| 1900-01-01 09:13:48 | 5.99 |
| 1900-01-01 09:13:53 | 5.99 |
| 1900-01-01 09:13:58 | 5.99 |
| 1900-01-01 09:14:03 | 5.99 |
| 1900-01-01 09:14:08 | 5.99 |
| 1900-01-01 09:14:13 | 6 |
| 1900-01-01 09:14:18 | 5.94 |
| 1900-01-01 09:14:23 | 5.94 |
| 1900-01-01 09:14:28 | 5.95 |
| 1900-01-01 09:14:33 | 6 |
| 1900-01-01 09:14:38 | 6 |
| 1900-01-01 09:14:43 | 6 |
| 1900-01-01 09:14:48 | 6 |
| 1900-01-01 09:14:53 | 6 |
| 1900-01-01 09:14:58 | 6 |
| 1900-01-01 09:15:03 | 5.96 |
| 1900-01-01 09:15:08 | 6.01 |
| 1900-01-01 09:15:13 | 6.02 |
| 1900-01-01 09:15:18 | 6.02 |
| 1900-01-01 09:15:23 | 6.03 |
| 1900-01-01 09:15:28 | 5.99 |
| 1900-01-01 09:15:33 | 6.04 |
| 1900-01-01 09:15:38 | 6 |
| 1900-01-01 09:15:43 | 6.05 |
| 1900-01-01 09:15:48 | 6.05 |
| 1900-01-01 09:15:53 | 6.03 |
| 1900-01-01 09:15:58 | 6.06 |
| 1900-01-01 09:16:03 | 6.06 |
| 1900-01-01 09:16:08 | 6.07 |
| 1900-01-01 09:16:13 | 6.08 |
| 1900-01-01 09:16:18 | 6.04 |
| 1900-01-01 09:16:23 | 6.06 |
| 1900-01-01 09:16:28 | 6.08 |
| 1900-01-01 09:16:33 | 6.07 |
| 1900-01-01 09:16:38 | 6.03 |
| 1900-01-01 09:16:43 | 6.04 |
| 1900-01-01 09:16:48 | 6.04 |
| 1900-01-01 09:16:53 | 6.04 |
| 1900-01-01 09:16:58 | 6.08 |
| 1900-01-01 09:17:03 | 6.09 |
| 1900-01-01 09:17:08 | 6.08 |
| 1900-01-01 09:17:13 | 6.04 |
| 1900-01-01 09:17:18 | 6.07 |
| 1900-01-01 09:17:23 | 6.08 |
| 1900-01-01 09:17:28 | 6.09 |
| 1900-01-01 09:17:33 | 6.09 |
| 1900-01-01 09:17:38 | 6.05 |
| 1900-01-01 09:17:43 | 6.09 |
| 1900-01-01 09:17:48 | 6.06 |
| 1900-01-01 09:17:53 | 6.06 |
| 1900-01-01 09:17:58 | 6.1 |
| 1900-01-01 09:18:03 | 6.06 |
| 1900-01-01 09:18:08 | 6.07 |
| 1900-01-01 09:18:13 | 6.07 |
| 1900-01-01 09:18:18 | 6.1 |
| 1900-01-01 09:18:23 | 6.07 |
| 1900-01-01 09:18:28 | 6.07 |
| 1900-01-01 09:18:33 | 6.07 |
| 1900-01-01 09:18:38 | 6.12 |
| 1900-01-01 09:18:43 | 6.11 |
| 1900-01-01 09:18:48 | 6.08 |
| 1900-01-01 09:18:53 | 6.08 |
| 1900-01-01 09:18:58 | 6.07 |
| 1900-01-01 09:19:03 | 6.1 |
| 1900-01-01 09:19:08 | 6.11 |
| 1900-01-01 09:19:13 | 6.08 |
| 1900-01-01 09:19:18 | 6.02 |
| 1900-01-01 09:19:23 | 6.02 |
| 1900-01-01 09:19:28 | 6.13 |
| 1900-01-01 09:19:33 | 6.06 |
| 1900-01-01 09:19:38 | 6.12 |
| 1900-01-01 09:19:43 | 6.09 |
| 1900-01-01 09:19:48 | 6.16 |
| 1900-01-01 09:19:53 | 6.16 |
| 1900-01-01 09:19:58 | 6.11 |
| 1900-01-01 09:20:03 | 6.12 |
| 1900-01-01 09:20:08 | 6.15 |
| 1900-01-01 09:20:13 | 6.08 |
| 1900-01-01 09:20:18 | 5.95 |
| 1900-01-01 09:20:23 | 6.02 |
| 1900-01-01 09:20:28 | 6.09 |
| 1900-01-01 09:20:33 | 6.15 |
| 1900-01-01 09:20:38 | 6.17 |
| 1900-01-01 09:20:43 | 6.16 |
| 1900-01-01 09:20:48 | 6.11 |
| 1900-01-01 09:20:53 | 6.1 |
| 1900-01-01 09:20:58 | 6.11 |
| 1900-01-01 09:21:03 | 6.11 |
| 1900-01-01 09:21:08 | 6.12 |
| 1900-01-01 09:21:13 | 6.16 |
| 1900-01-01 09:21:18 | 6.13 |
| 1900-01-01 09:21:23 | 6.16 |
| 1900-01-01 09:21:28 | 6.14 |
| 1900-01-01 09:21:33 | 6.14 |
| 1900-01-01 09:21:38 | 6.13 |
| 1900-01-01 09:21:43 | 6.14 |
| 1900-01-01 09:21:48 | 6.18 |
| 1900-01-01 09:21:53 | 6.18 |
| 1900-01-01 09:21:58 | 6.12 |
| 1900-01-01 09:22:03 | 6.15 |
| 1900-01-01 09:22:08 | 6.18 |
| 1900-01-01 09:22:13 | 6.18 |
| 1900-01-01 09:22:18 | 6.2 |
| 1900-01-01 09:22:23 | 6.16 |
| 1900-01-01 09:22:28 | 6.14 |
| 1900-01-01 09:22:33 | 6.16 |
| 1900-01-01 09:22:38 | 6.18 |
| 1900-01-01 09:22:43 | 6.2 |
| 1900-01-01 09:22:48 | 6.17 |
| 1900-01-01 09:22:53 | 6.11 |
| 1900-01-01 09:22:58 | 6.08 |
| 1900-01-01 09:23:03 | 6.15 |
| 1900-01-01 09:23:08 | 6.19 |
| 1900-01-01 09:23:13 | 6.18 |
| 1900-01-01 09:23:18 | 6.22 |
| 1900-01-01 09:23:23 | 6.19 |
| 1900-01-01 09:23:28 | 6.22 |
| 1900-01-01 09:23:33 | 6.21 |
| 1900-01-01 09:23:38 | 6.21 |
| 1900-01-01 09:23:43 | 6.14 |
| 1900-01-01 09:23:48 | 6.2 |
| 1900-01-01 09:23:53 | 6.22 |
| 1900-01-01 09:23:58 | 6.2 |
| 1900-01-01 09:24:03 | 6.2 |
| 1900-01-01 09:24:08 | 6.23 |
| 1900-01-01 09:24:13 | 6.19 |
| 1900-01-01 09:24:18 | 6.18 |
| 1900-01-01 09:24:23 | 6.21 |
| 1900-01-01 09:24:28 | 6.21 |
| 1900-01-01 09:24:33 | 6.21 |
| 1900-01-01 09:24:38 | 6.21 |
| 1900-01-01 09:24:43 | 6.21 |
| 1900-01-01 09:24:48 | 6.21 |
| 1900-01-01 09:24:53 | 6.21 |
| 1900-01-01 09:24:58 | 6.22 |
| 1900-01-01 09:25:03 | 6.18 |
| 1900-01-01 09:25:08 | 6.21 |
| 1900-01-01 09:25:13 | 6.18 |
| 1900-01-01 09:25:18 | 6.21 |
| 1900-01-01 09:25:23 | 6.21 |
| 1900-01-01 09:25:28 | 6.18 |
| 1900-01-01 09:25:33 | 6.22 |
| 1900-01-01 09:25:38 | 6.22 |
| 1900-01-01 09:25:43 | 6.18 |
| 1900-01-01 09:25:48 | 6.18 |
| 1900-01-01 09:25:53 | 6.18 |
| 1900-01-01 09:25:58 | 6.21 |
| 1900-01-01 09:26:03 | 6.18 |
| 1900-01-01 09:26:08 | 6.22 |
| 1900-01-01 09:26:13 | 6.2 |
| 1900-01-01 09:26:18 | 6.2 |
| 1900-01-01 09:26:23 | 6.23 |
| 1900-01-01 09:26:28 | 6.2 |
| 1900-01-01 09:26:33 | 6.2 |
| 1900-01-01 09:26:38 | 6.24 |
| 1900-01-01 09:26:43 | 6.2 |
| 1900-01-01 09:26:48 | 6.2 |
| 1900-01-01 09:26:53 | 6.21 |
| 1900-01-01 09:26:58 | 6.21 |
| 1900-01-01 09:27:03 | 6.21 |
| 1900-01-01 09:27:08 | 6.24 |
| 1900-01-01 09:27:13 | 6.2 |
| 1900-01-01 09:27:18 | 6.23 |
| 1900-01-01 09:27:23 | 6.23 |
| 1900-01-01 09:27:28 | 6.2 |
| 1900-01-01 09:27:33 | 6.23 |
| 1900-01-01 09:27:38 | 6.23 |
| 1900-01-01 09:27:43 | 6.2 |
| 1900-01-01 09:27:48 | 6.22 |
| 1900-01-01 09:27:53 | 6.23 |
| 1900-01-01 09:27:58 | 6.22 |
| 1900-01-01 09:28:03 | 6.19 |
| 1900-01-01 09:28:08 | 6.22 |
| 1900-01-01 09:28:13 | 6.22 |
| 1900-01-01 09:28:18 | 6.22 |
| 1900-01-01 09:28:23 | 6.22 |
| 1900-01-01 09:28:28 | 6.19 |
| 1900-01-01 09:28:33 | 6.23 |
| 1900-01-01 09:28:38 | 6.2 |
| 1900-01-01 09:28:43 | 6.22 |
| 1900-01-01 09:28:48 | 6.23 |
| 1900-01-01 09:28:53 | 6.2 |
| 1900-01-01 09:28:58 | 6.23 |
| 1900-01-01 09:29:03 | 6.2 |
| 1900-01-01 09:29:08 | 6.2 |
| 1900-01-01 09:29:13 | 6.2 |
| 1900-01-01 09:29:18 | 6.19 |
| 1900-01-01 09:29:23 | 6.22 |
| 1900-01-01 09:29:28 | 6.19 |
| 1900-01-01 09:29:33 | 6.22 |
| 1900-01-01 09:29:38 | 6.23 |
| 1900-01-01 09:29:43 | 6.24 |
| 1900-01-01 09:29:48 | 6.21 |
| 1900-01-01 09:29:53 | 6.24 |
| 1900-01-01 09:29:58 | 6.21 |
| 1900-01-01 09:30:03 | 6.24 |
| 1900-01-01 09:30:08 | 6.2 |
| 1900-01-01 09:30:13 | 6.23 |
| 1900-01-01 09:30:18 | 6.2 |
| 1900-01-01 09:30:23 | 6.2 |
| 1900-01-01 09:30:28 | 6.24 |
| 1900-01-01 09:30:33 | 6.21 |
| 1900-01-01 09:30:38 | 6.21 |
| 1900-01-01 09:30:43 | 6.24 |
| 1900-01-01 09:30:48 | 6.24 |
| 1900-01-01 09:30:53 | 6.24 |
| 1900-01-01 09:30:58 | 6.24 |
| 1900-01-01 09:31:03 | 6.25 |
| 1900-01-01 09:31:08 | 6.22 |
| 1900-01-01 09:31:13 | 6.26 |
| 1900-01-01 09:31:18 | 6.24 |
| 1900-01-01 09:31:23 | 6.24 |
| 1900-01-01 09:31:28 | 6.27 |
| 1900-01-01 09:31:33 | 6.28 |
| 1900-01-01 09:31:38 | 6.26 |
| 1900-01-01 09:31:43 | 6.28 |
| 1900-01-01 09:31:48 | 6.28 |
| 1900-01-01 09:31:53 | 6.28 |
| 1900-01-01 09:31:58 | 6.28 |
| 1900-01-01 09:32:03 | 6.26 |
| 1900-01-01 09:32:08 | 6.29 |
| 1900-01-01 09:32:13 | 6.26 |
| 1900-01-01 09:32:18 | 6.26 |
| 1900-01-01 09:32:23 | 6.29 |
| 1900-01-01 09:32:28 | 6.26 |
| 1900-01-01 09:32:33 | 6.29 |
| 1900-01-01 09:32:38 | 6.29 |
| 1900-01-01 09:32:43 | 6.3 |
| 1900-01-01 09:32:48 | 6.3 |
| 1900-01-01 09:32:53 | 6.27 |
| 1900-01-01 09:32:58 | 6.3 |
| 1900-01-01 09:33:03 | 6.3 |
| 1900-01-01 09:33:08 | 6.27 |
| 1900-01-01 09:33:13 | 6.31 |
| 1900-01-01 09:33:18 | 6.28 |
| 1900-01-01 09:33:23 | 6.3 |
| 1900-01-01 09:33:28 | 6.27 |
| 1900-01-01 09:33:33 | 6.27 |
| 1900-01-01 09:33:38 | 6.3 |
| 1900-01-01 09:33:43 | 6.27 |
| 1900-01-01 09:33:48 | 6.3 |
| 1900-01-01 09:33:53 | 6.3 |
| 1900-01-01 09:33:58 | 6.3 |
| 1900-01-01 09:34:03 | 6.27 |
| 1900-01-01 09:34:08 | 6.3 |
| 1900-01-01 09:34:13 | 6.28 |
| 1900-01-01 09:34:18 | 6.28 |
| 1900-01-01 09:34:23 | 6.28 |
| 1900-01-01 09:34:28 | 6.31 |
| 1900-01-01 09:34:33 | 6.28 |
| 1900-01-01 09:34:38 | 6.27 |
| 1900-01-01 09:34:43 | 6.3 |
| 1900-01-01 09:34:48 | 6.28 |
| 1900-01-01 09:34:53 | 6.31 |
| 1900-01-01 09:34:58 | 6.31 |
| 1900-01-01 09:35:03 | 6.32 |
| 1900-01-01 09:35:08 | 6.32 |
| 1900-01-01 09:35:13 | 6.29 |
| 1900-01-01 09:35:18 | 6.31 |
| 1900-01-01 09:35:23 | 6.32 |
| 1900-01-01 09:35:28 | 6.32 |
| 1900-01-01 09:35:33 | 6.29 |
| 1900-01-01 09:35:38 | 6.32 |
| 1900-01-01 09:35:43 | 6.32 |
| 1900-01-01 09:35:48 | 6.32 |
| 1900-01-01 09:35:53 | 6.3 |
| 1900-01-01 09:35:58 | 6.33 |
| 1900-01-01 09:36:03 | 6.31 |
| 1900-01-01 09:36:08 | 6.34 |
| 1900-01-01 09:36:13 | 6.31 |
| 1900-01-01 09:36:18 | 6.34 |
| 1900-01-01 09:36:23 | 6.3 |
| 1900-01-01 09:36:28 | 6.31 |
| 1900-01-01 09:36:33 | 6.31 |
| 1900-01-01 09:36:38 | 6.34 |
| 1900-01-01 09:36:43 | 6.31 |
| 1900-01-01 09:36:48 | 6.32 |
| 1900-01-01 09:36:53 | 6.35 |
| 1900-01-01 09:36:58 | 6.35 |
| 1900-01-01 09:37:03 | 6.32 |
| 1900-01-01 09:37:08 | 6.34 |
| 1900-01-01 09:37:13 | 6.31 |
| 1900-01-01 09:37:18 | 6.31 |
| 1900-01-01 09:37:23 | 6.34 |
| 1900-01-01 09:37:28 | 6.31 |
| 1900-01-01 09:37:33 | 6.3 |
| 1900-01-01 09:37:38 | 6.34 |
| 1900-01-01 09:37:43 | 6.34 |
| 1900-01-01 09:37:48 | 6.31 |
| 1900-01-01 09:37:53 | 6.34 |
| 1900-01-01 09:37:58 | 6.31 |
| 1900-01-01 09:38:03 | 6.32 |
| 1900-01-01 09:38:08 | 6.34 |
| 1900-01-01 09:38:13 | 6.34 |
| 1900-01-01 09:38:18 | 6.34 |
| 1900-01-01 09:38:23 | 6.31 |
| 1900-01-01 09:38:28 | 6.32 |
| 1900-01-01 09:38:33 | 6.32 |
| 1900-01-01 09:38:38 | 6.3 |
| 1900-01-01 09:38:43 | 6.3 |
| 1900-01-01 09:38:48 | 6.32 |
| 1900-01-01 09:38:53 | 6.28 |
| 1900-01-01 09:38:58 | 6.31 |
| 1900-01-01 09:39:03 | 6.32 |
| 1900-01-01 09:39:08 | 6.3 |
| 1900-01-01 09:39:13 | 6.32 |
| 1900-01-01 09:39:18 | 6.3 |
| 1900-01-01 09:39:23 | 6.29 |
| 1900-01-01 09:39:28 | 6.31 |
| 1900-01-01 09:39:33 | 6.31 |
| 1900-01-01 09:39:38 | 6.32 |
| 1900-01-01 09:39:43 | 6.36 |
| 1900-01-01 09:39:48 | 6.33 |
| 1900-01-01 09:39:53 | 6.34 |
| 1900-01-01 09:39:58 | 6.33 |
| 1900-01-01 09:40:03 | 6.37 |
| 1900-01-01 09:40:08 | 6.37 |
| 1900-01-01 09:40:13 | 6.37 |
| 1900-01-01 09:40:18 | 6.36 |
| 1900-01-01 09:40:23 | 6.36 |
| 1900-01-01 09:40:28 | 6.36 |
| 1900-01-01 09:40:33 | 6.34 |
| 1900-01-01 09:40:38 | 6.35 |
| 1900-01-01 09:40:43 | 6.34 |
| 1900-01-01 09:40:48 | 6.36 |
| 1900-01-01 09:40:53 | 6.37 |
| 1900-01-01 09:40:58 | 6.34 |
| 1900-01-01 09:41:03 | 6.37 |
| 1900-01-01 09:41:08 | 6.34 |
| 1900-01-01 09:41:13 | 6.37 |
| 1900-01-01 09:41:18 | 6.37 |
| 1900-01-01 09:41:23 | 6.37 |
| 1900-01-01 09:41:28 | 6.37 |
| 1900-01-01 09:41:33 | 6.37 |
| 1900-01-01 09:41:38 | 6.34 |
| 1900-01-01 09:41:43 | 6.33 |
| 1900-01-01 09:41:48 | 6.33 |
| 1900-01-01 09:41:53 | 6.36 |
| 1900-01-01 09:41:58 | 6.34 |
| 1900-01-01 09:42:03 | 6.34 |
| 1900-01-01 09:42:08 | 6.36 |
| 1900-01-01 09:42:13 | 6.33 |
| 1900-01-01 09:42:18 | 6.36 |
| 1900-01-01 09:42:23 | 6.36 |
| 1900-01-01 09:42:28 | 6.35 |
| 1900-01-01 09:42:33 | 6.36 |
| 1900-01-01 09:42:38 | 6.35 |
| 1900-01-01 09:42:43 | 6.35 |
| 1900-01-01 09:42:48 | 6.32 |
| 1900-01-01 09:42:53 | 6.34 |
| 1900-01-01 09:42:58 | 6.34 |
| 1900-01-01 09:43:03 | 6.31 |
| 1900-01-01 09:43:08 | 6.34 |
| 1900-01-01 09:43:13 | 6.34 |
| 1900-01-01 09:43:18 | 6.34 |
| 1900-01-01 09:43:23 | 6.34 |
| 1900-01-01 09:43:28 | 6.34 |
| 1900-01-01 09:43:33 | 6.31 |
| 1900-01-01 09:43:38 | 6.34 |
| 1900-01-01 09:43:43 | 6.31 |
| 1900-01-01 09:43:48 | 6.31 |
| 1900-01-01 09:43:53 | 6.34 |
| 1900-01-01 09:43:58 | 6.31 |
| 1900-01-01 09:44:03 | 6.32 |
| 1900-01-01 09:44:08 | 6.32 |
| 1900-01-01 09:44:13 | 6.35 |
| 1900-01-01 09:44:18 | 6.32 |
| 1900-01-01 09:44:23 | 6.32 |
| 1900-01-01 09:44:28 | 6.33 |
| 1900-01-01 09:44:33 | 6.35 |
| 1900-01-01 09:44:38 | 6.32 |
| 1900-01-01 09:44:43 | 6.35 |
| 1900-01-01 09:44:48 | 6.34 |
| 1900-01-01 09:44:53 | 6.34 |
| 1900-01-01 09:44:58 | 6.35 |
| 1900-01-01 09:45:03 | 6.35 |
| 1900-01-01 09:45:08 | 6.35 |
| 1900-01-01 09:45:13 | 6.35 |
| 1900-01-01 09:45:18 | 6.33 |
| 1900-01-01 09:45:23 | 6.36 |
| 1900-01-01 09:45:28 | 6.36 |
| 1900-01-01 09:45:33 | 6.35 |
| 1900-01-01 09:45:38 | 6.35 |
| 1900-01-01 09:45:43 | 6.34 |
| 1900-01-01 09:45:48 | 6.34 |
| 1900-01-01 09:45:53 | 6.35 |
| 1900-01-01 09:45:58 | 6.35 |
| 1900-01-01 09:46:03 | 6.33 |
| 1900-01-01 09:46:08 | 6.33 |
| 1900-01-01 09:46:13 | 6.34 |
| 1900-01-01 09:46:18 | 6.35 |
| 1900-01-01 09:46:23 | 6.26 |
| 1900-01-01 09:46:28 | 6.32 |
| 1900-01-01 09:46:33 | 6.33 |
| 1900-01-01 09:46:38 | 6.34 |
| 1900-01-01 09:46:43 | 6.34 |
| 1900-01-01 09:46:48 | 6.34 |
| 1900-01-01 09:46:53 | 6.32 |
| 1900-01-01 09:46:58 | 6.31 |
| 1900-01-01 09:47:03 | 6.34 |
| 1900-01-01 09:47:08 | 6.32 |
| 1900-01-01 09:47:13 | 6.33 |
| 1900-01-01 09:47:18 | 6.32 |
| 1900-01-01 09:47:23 | 6.35 |
| 1900-01-01 09:47:28 | 6.35 |
| 1900-01-01 09:47:33 | 6.34 |
| 1900-01-01 09:47:38 | 6.33 |
| 1900-01-01 09:47:43 | 6.33 |
| 1900-01-01 09:47:48 | 6.37 |
| 1900-01-01 09:47:53 | 6.34 |
| 1900-01-01 09:47:58 | 6.34 |
| 1900-01-01 09:48:03 | 6.35 |
| 1900-01-01 09:48:08 | 6.35 |
| 1900-01-01 09:48:13 | 6.35 |
| 1900-01-01 09:48:18 | 6.36 |
| 1900-01-01 09:48:23 | 6.36 |
| 1900-01-01 09:48:28 | 6.33 |
| 1900-01-01 09:48:33 | 6.36 |
| 1900-01-01 09:48:38 | 6.36 |
| 1900-01-01 09:48:43 | 6.33 |
| 1900-01-01 09:48:48 | 6.33 |
| 1900-01-01 09:48:53 | 6.36 |
| 1900-01-01 09:48:58 | 6.34 |
| 1900-01-01 09:49:03 | 6.35 |
| 1900-01-01 09:49:08 | 6.32 |
| 1900-01-01 09:49:13 | 6.33 |
| 1900-01-01 09:49:18 | 6.35 |
| 1900-01-01 09:49:23 | 6.32 |
| 1900-01-01 09:49:28 | 6.34 |
| 1900-01-01 09:49:33 | 6.32 |
| 1900-01-01 09:49:38 | 6.29 |
| 1900-01-01 09:49:43 | 6.2 |
| 1900-01-01 09:49:48 | 6.17 |
| 1900-01-01 09:49:53 | 6.28 |
| 1900-01-01 09:49:58 | 6.3 |
| 1900-01-01 09:50:03 | 6.2 |
| 1900-01-01 09:50:08 | 6.16 |
| 1900-01-01 09:50:13 | 6.2 |
| 1900-01-01 09:50:18 | 6.28 |
| 1900-01-01 09:50:23 | 6.29 |
| 1900-01-01 09:50:28 | 6.2 |
| 1900-01-01 09:50:33 | 6.17 |
| 1900-01-01 09:50:38 | 6.3 |
| 1900-01-01 09:50:43 | 6.32 |
| 1900-01-01 09:50:48 | 6.21 |
| 1900-01-01 09:50:53 | 6.23 |
| 1900-01-01 09:50:58 | 6.17 |
| 1900-01-01 09:51:03 | 6.34 |
| 1900-01-01 09:51:08 | 6.37 |
| 1900-01-01 09:51:13 | 6.38 |
| 1900-01-01 09:51:18 | 6.39 |
| 1900-01-01 09:51:23 | 6.2 |
| 1900-01-01 09:51:28 | 6.3 |
| 1900-01-01 09:51:33 | 6.35 |
| 1900-01-01 09:51:38 | 6.35 |
| 1900-01-01 09:51:43 | 6.38 |
| 1900-01-01 09:51:48 | 6.39 |
| 1900-01-01 09:51:53 | 6.31 |
| 1900-01-01 09:51:58 | 6.35 |
| 1900-01-01 09:52:03 | 6.38 |
| 1900-01-01 09:52:08 | 6.36 |
| 1900-01-01 09:52:13 | 6.41 |
| 1900-01-01 09:52:18 | 6.34 |
| 1900-01-01 09:52:23 | 6.38 |
| 1900-01-01 09:52:28 | 6.39 |
| 1900-01-01 09:52:33 | 6.17 |
| 1900-01-01 09:52:38 | 6.1 |
| 1900-01-01 09:52:43 | 5.96 |
| 1900-01-01 09:52:48 | 5.96 |
| 1900-01-01 09:52:53 | 6.32 |
| 1900-01-01 09:52:58 | 6.11 |
| 1900-01-01 09:53:03 | 6.28 |
| 1900-01-01 09:53:08 | 6.4 |
| 1900-01-01 09:53:13 | 6.32 |
| 1900-01-01 09:53:18 | 6.37 |
| 1900-01-01 09:53:23 | 6.28 |
| 1900-01-01 09:53:28 | 6.33 |
| 1900-01-01 09:53:33 | 6.44 |
| 1900-01-01 09:53:38 | 6.36 |
| 1900-01-01 09:53:43 | 6.28 |
| 1900-01-01 09:53:48 | 6.39 |
| 1900-01-01 09:53:53 | 6.47 |
| 1900-01-01 09:53:58 | 6.25 |
| 1900-01-01 09:54:03 | 6.38 |
| 1900-01-01 09:54:08 | 6.42 |
| 1900-01-01 09:54:13 | 6.37 |
| 1900-01-01 09:54:18 | 6.43 |
| 1900-01-01 09:54:23 | 6.33 |
| 1900-01-01 09:54:28 | 6.04 |
| 1900-01-01 09:54:33 | 6.1 |
| 1900-01-01 09:54:38 | 5.98 |
| 1900-01-01 09:54:43 | 6.15 |
| 1900-01-01 09:54:48 | 6.23 |
| 1900-01-01 09:54:53 | 6.12 |
| 1900-01-01 09:54:58 | 6.11 |
| 1900-01-01 09:55:03 | 6.25 |
| 1900-01-01 09:55:08 | 6.41 |
| 1900-01-01 09:55:13 | 6.26 |
| 1900-01-01 09:55:18 | 6.17 |
| 1900-01-01 09:55:23 | 6.02 |
| 1900-01-01 09:55:28 | 6.26 |
| 1900-01-01 09:55:33 | 6.3 |
| 1900-01-01 09:55:38 | 6.34 |
| 1900-01-01 09:55:43 | 6.43 |
| 1900-01-01 09:55:48 | 6.38 |
| 1900-01-01 09:55:53 | 6.42 |
| 1900-01-01 09:55:58 | 6.45 |
| 1900-01-01 09:56:03 | 6.26 |
| 1900-01-01 09:56:08 | 6.2 |
| 1900-01-01 09:56:13 | 6.28 |
| 1900-01-01 09:56:18 | 6.32 |
| 1900-01-01 09:56:23 | 6.46 |
| 1900-01-01 09:56:28 | 6.48 |
| 1900-01-01 09:56:33 | 6.48 |
| 1900-01-01 09:56:38 | 6.36 |
| 1900-01-01 09:56:43 | 6.14 |
| 1900-01-01 09:56:48 | 6.44 |
| 1900-01-01 09:56:53 | 6.3 |
| 1900-01-01 09:56:58 | 6.34 |
| 1900-01-01 09:57:03 | 6.32 |
| 1900-01-01 09:57:08 | 6.32 |
| 1900-01-01 09:57:13 | 6.13 |
| 1900-01-01 09:57:18 | 6.22 |
| 1900-01-01 09:57:23 | 6.26 |
| 1900-01-01 09:57:28 | 6.18 |
| 1900-01-01 09:57:33 | 6.12 |
| 1900-01-01 09:57:38 | 5.96 |
| 1900-01-01 09:57:43 | 6.09 |
| 1900-01-01 09:57:48 | 6.14 |
| 1900-01-01 09:57:53 | 6.1 |
| 1900-01-01 09:57:58 | 6.04 |
| 1900-01-01 09:58:03 | 6.1 |
| 1900-01-01 09:58:08 | 5.82 |
| 1900-01-01 09:58:13 | 6.1 |
| 1900-01-01 09:58:18 | 5.41 |
| 1900-01-01 09:58:23 | 6.24 |
| 1900-01-01 09:58:28 | 6.4 |
| 1900-01-01 09:58:33 | 6.47 |
| 1900-01-01 09:58:38 | 6.45 |
| 1900-01-01 09:58:43 | 6.39 |
| 1900-01-01 09:58:48 | 6.27 |
| 1900-01-01 09:58:53 | 6.16 |
| 1900-01-01 09:58:58 | 6.21 |
| 1900-01-01 09:59:03 | 6.32 |
| 1900-01-01 09:59:08 | 6.36 |
| 1900-01-01 09:59:13 | 6.27 |
| 1900-01-01 09:59:18 | 6.32 |
| 1900-01-01 09:59:23 | 6.4 |
| 1900-01-01 09:59:28 | 6.46 |
| 1900-01-01 09:59:33 | 6.47 |
| 1900-01-01 09:59:38 | 6.44 |
| 1900-01-01 09:59:43 | 6.48 |
| 1900-01-01 09:59:48 | 6.44 |
| 1900-01-01 09:59:53 | 6.44 |
| 1900-01-01 09:59:58 | 6.46 |
| 1900-01-01 10:00:03 | 6.43 |
| 1900-01-01 10:00:08 | 6.43 |
| 1900-01-01 10:00:13 | 6.42 |
| 1900-01-01 10:00:18 | 6.42 |
| 1900-01-01 10:00:23 | 6.44 |
| 1900-01-01 10:00:28 | 6.42 |
| 1900-01-01 10:00:33 | 6.42 |
| 1900-01-01 10:00:38 | 6.44 |
| 1900-01-01 10:00:43 | 6.44 |
| 1900-01-01 10:00:48 | 6.42 |
| 1900-01-01 10:00:53 | 6.42 |
| 1900-01-01 10:00:58 | 6.44 |
| 1900-01-01 10:01:03 | 6.44 |
| 1900-01-01 10:01:08 | 6.44 |
| 1900-01-01 10:01:13 | 6.41 |
| 1900-01-01 10:01:18 | 6.41 |
| 1900-01-01 10:01:23 | 6.44 |
| 1900-01-01 10:01:28 | 6.44 |
| 1900-01-01 10:01:33 | 6.41 |
| 1900-01-01 10:01:38 | 6.4 |
| 1900-01-01 10:01:43 | 6.4 |
| 1900-01-01 10:01:48 | 6.42 |
| 1900-01-01 10:01:53 | 6.42 |
| 1900-01-01 10:01:58 | 6.4 |
| 1900-01-01 10:02:03 | 6.4 |
| 1900-01-01 10:02:08 | 6.4 |
| 1900-01-01 10:02:13 | 6.42 |
| 1900-01-01 10:02:18 | 6.42 |
| 1900-01-01 10:02:23 | 6.4 |
| 1900-01-01 10:02:28 | 6.4 |
| 1900-01-01 10:02:33 | 6.42 |
| 1900-01-01 10:02:38 | 6.43 |
| 1900-01-01 10:02:43 | 6.41 |
| 1900-01-01 10:02:48 | 6.44 |
| 1900-01-01 10:02:53 | 6.44 |
| 1900-01-01 10:02:58 | 6.44 |
| 1900-01-01 10:03:03 | 6.44 |
| 1900-01-01 10:03:08 | 6.44 |
| 1900-01-01 10:03:13 | 6.45 |
| 1900-01-01 10:03:18 | 6.45 |
| 1900-01-01 10:03:23 | 6.43 |
| 1900-01-01 10:03:28 | 6.42 |
| 1900-01-01 10:03:33 | 6.35 |
| 1900-01-01 10:03:38 | 6.37 |
| 1900-01-01 10:03:43 | 6.35 |
| 1900-01-01 10:03:48 | 6.35 |
| 1900-01-01 10:03:53 | 6.37 |
| 1900-01-01 10:03:58 | 6.34 |
| 1900-01-01 10:04:03 | 6.3 |
| 1900-01-01 10:04:08 | 6.32 |
| 1900-01-01 10:04:13 | 6.36 |
| 1900-01-01 10:04:18 | 6.32 |
| 1900-01-01 10:04:23 | 6.36 |
| 1900-01-01 10:04:28 | 6.32 |
| 1900-01-01 10:04:33 | 6.36 |
| 1900-01-01 10:04:38 | 6.37 |
| 1900-01-01 10:04:43 | 6.34 |
| 1900-01-01 10:04:48 | 6.42 |
| 1900-01-01 10:04:53 | 6.35 |
| 1900-01-01 10:04:58 | 6.28 |
| 1900-01-01 10:05:03 | 6.25 |
| 1900-01-01 10:05:08 | 6.34 |
| 1900-01-01 10:05:13 | 6.32 |
| 1900-01-01 10:05:18 | 6.22 |
| 1900-01-01 10:05:23 | 6.3 |
| 1900-01-01 10:05:28 | 6.35 |
| 1900-01-01 10:05:33 | 6.2 |
| 1900-01-01 10:05:38 | 6.29 |
| 1900-01-01 10:05:43 | 6.3 |
| 1900-01-01 10:05:48 | 6.26 |
| 1900-01-01 10:05:53 | 6.22 |
| 1900-01-01 10:05:58 | 6.27 |
| 1900-01-01 10:06:03 | 6.23 |
| 1900-01-01 10:06:08 | 6.15 |
| 1900-01-01 10:06:13 | 6.31 |
| 1900-01-01 10:06:18 | 6.44 |
| 1900-01-01 10:06:23 | 6.44 |
| 1900-01-01 10:06:28 | 6.5 |
| 1900-01-01 10:06:33 | 6.44 |
| 1900-01-01 10:06:38 | 6.38 |
| 1900-01-01 10:06:43 | 6.32 |
| 1900-01-01 10:06:48 | 6.27 |
| 1900-01-01 10:06:53 | 6.38 |
| 1900-01-01 10:06:58 | 6.34 |
| 1900-01-01 10:07:03 | 6.34 |
| 1900-01-01 10:07:08 | 6.31 |
| 1900-01-01 10:07:13 | 6.27 |
| 1900-01-01 10:07:18 | 6.38 |
| 1900-01-01 10:07:23 | 6.25 |
| 1900-01-01 10:07:28 | 6.44 |
| 1900-01-01 10:07:33 | 6.3 |
| 1900-01-01 10:07:38 | 6.21 |
| 1900-01-01 10:07:43 | 6.21 |
| 1900-01-01 10:07:48 | 6.32 |
| 1900-01-01 10:07:53 | 6.1 |
| 1900-01-01 10:07:58 | 6.23 |
| 1900-01-01 10:08:03 | 6.38 |
| 1900-01-01 10:08:08 | 6.21 |
| 1900-01-01 10:08:13 | 6.25 |
| 1900-01-01 10:08:18 | 6.44 |
| 1900-01-01 10:08:23 | 6.37 |
| 1900-01-01 10:08:28 | 6.2 |
| 1900-01-01 10:08:33 | 6.38 |
| 1900-01-01 10:08:38 | 6.36 |
| 1900-01-01 10:08:43 | 6.37 |
| 1900-01-01 10:08:48 | 6.42 |
| 1900-01-01 10:08:53 | 6.38 |
| 1900-01-01 10:08:58 | 6.36 |
| 1900-01-01 10:09:03 | 6.15 |
| 1900-01-01 10:09:08 | 6 |
| 1900-01-01 10:09:13 | 6.23 |
| 1900-01-01 10:09:18 | 6.4 |
| 1900-01-01 10:09:23 | 6.34 |
| 1900-01-01 10:09:28 | 6.42 |
| 1900-01-01 10:09:33 | 6.1 |
| 1900-01-01 10:09:38 | 6.08 |
| 1900-01-01 10:09:43 | 6.2 |
| 1900-01-01 10:09:48 | 6.03 |
| 1900-01-01 10:09:53 | 6.04 |
| 1900-01-01 10:09:58 | 6 |
| 1900-01-01 10:10:03 | 6.18 |
| 1900-01-01 10:10:08 | 6.33 |
| 1900-01-01 10:10:13 | 6.44 |
| 1900-01-01 10:10:18 | 6.44 |
| 1900-01-01 10:10:23 | 6.44 |
| 1900-01-01 10:10:28 | 6.41 |
| 1900-01-01 10:10:33 | 6.34 |
| 1900-01-01 10:10:38 | 6.33 |
| 1900-01-01 10:10:43 | 6.08 |
| 1900-01-01 10:10:48 | 6.28 |
| 1900-01-01 10:10:53 | 6.41 |
| 1900-01-01 10:10:58 | 6.37 |
| 1900-01-01 10:11:03 | 6.43 |
| 1900-01-01 10:11:08 | 6.44 |
| 1900-01-01 10:11:13 | 6.33 |
| 1900-01-01 10:11:18 | 6.34 |
| 1900-01-01 10:11:23 | 6.39 |
| 1900-01-01 10:11:28 | 6.26 |
| 1900-01-01 10:11:33 | 6.09 |
| 1900-01-01 10:11:38 | 6.29 |
| 1900-01-01 10:11:43 | 6.34 |
| 1900-01-01 10:11:48 | 6.24 |
| 1900-01-01 10:11:53 | 6.02 |
| 1900-01-01 10:11:58 | 6.35 |
| 1900-01-01 10:12:03 | 6.27 |
| 1900-01-01 10:12:08 | 6.32 |
| 1900-01-01 10:12:13 | 6.42 |
| 1900-01-01 10:12:18 | 6.3 |
| 1900-01-01 10:12:23 | 6.3 |
| 1900-01-01 10:12:28 | 6.39 |
| 1900-01-01 10:12:33 | 6.26 |
| 1900-01-01 10:12:38 | 6.36 |
| 1900-01-01 10:12:43 | 6.34 |
| 1900-01-01 10:12:48 | 6.36 |
| 1900-01-01 10:12:53 | 6.39 |
| 1900-01-01 10:12:58 | 6.41 |
| 1900-01-01 10:13:03 | 6.42 |
| 1900-01-01 10:13:08 | 6.41 |
| 1900-01-01 10:13:13 | 6.4 |
| 1900-01-01 10:13:18 | 6.36 |
| 1900-01-01 10:13:23 | 6.4 |
| 1900-01-01 10:13:28 | 6.4 |
| 1900-01-01 10:13:33 | 6.39 |
| 1900-01-01 10:13:38 | 6.39 |
| 1900-01-01 10:13:43 | 6.4 |
| 1900-01-01 10:13:48 | 6.36 |
| 1900-01-01 10:13:53 | 6.39 |
| 1900-01-01 10:13:58 | 6.41 |
| 1900-01-01 10:14:03 | 6.39 |
| 1900-01-01 10:14:08 | 6.37 |
| 1900-01-01 10:14:13 | 6.38 |
| 1900-01-01 10:14:18 | 6.38 |
| 1900-01-01 10:14:23 | 6.3 |
| 1900-01-01 10:14:28 | 6.35 |
| 1900-01-01 10:14:33 | 6.39 |
| 1900-01-01 10:14:38 | 6.36 |
| 1900-01-01 10:14:43 | 6.39 |
| 1900-01-01 10:14:48 | 6.28 |
| 1900-01-01 10:14:53 | 6.36 |
| 1900-01-01 10:14:58 | 6.39 |
| 1900-01-01 10:15:03 | 6.4 |
| 1900-01-01 10:15:08 | 6.36 |
| 1900-01-01 10:15:13 | 6.38 |
| 1900-01-01 10:15:18 | 6.36 |
| 1900-01-01 10:15:23 | 6.39 |
| 1900-01-01 10:15:28 | 6.4 |
| 1900-01-01 10:15:33 | 6.4 |
| 1900-01-01 10:15:38 | 6.4 |
| 1900-01-01 10:15:43 | 6.4 |
| 1900-01-01 10:15:48 | 6.4 |
| 1900-01-01 10:15:53 | 6.42 |
| 1900-01-01 10:15:58 | 6.4 |
| 1900-01-01 10:16:03 | 6.38 |
| 1900-01-01 10:16:08 | 6.39 |
| 1900-01-01 10:16:13 | 6.39 |
| 1900-01-01 10:16:18 | 6.15 |
| 1900-01-01 10:16:23 | 6.36 |
| 1900-01-01 10:16:28 | 6.38 |
| 1900-01-01 10:16:33 | 6.41 |
| 1900-01-01 10:16:38 | 6.44 |
| 1900-01-01 10:16:43 | 6.42 |
| 1900-01-01 10:16:48 | 6.42 |
| 1900-01-01 10:16:53 | 6.4 |
| 1900-01-01 10:16:58 | 6.43 |
| 1900-01-01 10:17:03 | 6.42 |
| 1900-01-01 10:17:08 | 6.4 |
| 1900-01-01 10:17:13 | 6.34 |
| 1900-01-01 10:17:18 | 6.44 |
| 1900-01-01 10:17:23 | 6.44 |
| 1900-01-01 10:17:28 | 6.46 |
| 1900-01-01 10:17:33 | 6.44 |
| 1900-01-01 10:17:38 | 6.42 |
| 1900-01-01 10:17:43 | 6.42 |
| 1900-01-01 10:17:48 | 6.47 |
| 1900-01-01 10:17:53 | 6.48 |
| 1900-01-01 10:17:58 | 6.48 |
| 1900-01-01 10:18:03 | 6.48 |
| 1900-01-01 10:18:08 | 6.48 |
| 1900-01-01 10:18:13 | 6.44 |
| 1900-01-01 10:18:18 | 6.45 |
| 1900-01-01 10:18:23 | 6.46 |
| 1900-01-01 10:18:28 | 6.45 |
| 1900-01-01 10:18:33 | 6.45 |
| 1900-01-01 10:18:38 | 6.46 |
| 1900-01-01 10:18:43 | 6.46 |
| 1900-01-01 10:18:48 | 6.45 |
| 1900-01-01 10:18:53 | 6.44 |
| 1900-01-01 10:18:58 | 6.43 |
| 1900-01-01 10:19:03 | 6.43 |
| 1900-01-01 10:19:08 | 6.46 |
| 1900-01-01 10:19:13 | 6.46 |
| 1900-01-01 10:19:18 | 6.43 |
| 1900-01-01 10:19:23 | 6.44 |
| 1900-01-01 10:19:28 | 6.47 |
| 1900-01-01 10:19:33 | 6.46 |
| 1900-01-01 10:19:38 | 6.45 |
| 1900-01-01 10:19:43 | 6.4 |
| 1900-01-01 10:19:48 | 6.41 |
| 1900-01-01 10:19:53 | 6.4 |
| 1900-01-01 10:19:58 | 6.29 |
| 1900-01-01 10:20:03 | 6.39 |
| 1900-01-01 10:20:08 | 6.42 |
| 1900-01-01 10:20:13 | 6.39 |
| 1900-01-01 10:20:18 | 6.38 |
| 1900-01-01 10:20:23 | 6.43 |
| 1900-01-01 10:20:28 | 6.42 |
| 1900-01-01 10:20:33 | 6.35 |
| 1900-01-01 10:20:38 | 6.41 |
| 1900-01-01 10:20:43 | 6.44 |
| 1900-01-01 10:20:48 | 6.42 |
| 1900-01-01 10:20:53 | 6.46 |
| 1900-01-01 10:20:58 | 6.39 |
| 1900-01-01 10:21:03 | 6.44 |
| 1900-01-01 10:21:08 | 6.37 |
| 1900-01-01 10:21:13 | 6.41 |
| 1900-01-01 10:21:18 | 6.45 |
| 1900-01-01 10:21:23 | 6.4 |
| 1900-01-01 10:21:28 | 6.38 |
| 1900-01-01 10:21:33 | 6.44 |
| 1900-01-01 10:21:38 | 6.33 |
| 1900-01-01 10:21:43 | 6.4 |
| 1900-01-01 10:21:48 | 6.44 |
| 1900-01-01 10:21:53 | 6.42 |
| 1900-01-01 10:21:58 | 6.44 |
| 1900-01-01 10:22:03 | 6.44 |
| 1900-01-01 10:22:08 | 6.4 |
| 1900-01-01 10:22:13 | 6.39 |
| 1900-01-01 10:22:18 | 6.43 |
| 1900-01-01 10:22:23 | 6.38 |
| 1900-01-01 10:22:28 | 6.33 |
| 1900-01-01 10:22:33 | 6.39 |
| 1900-01-01 10:22:38 | 6.3 |
| 1900-01-01 10:22:43 | 6.41 |
| 1900-01-01 10:22:48 | 6.27 |
| 1900-01-01 10:22:53 | 6.25 |
| 1900-01-01 10:22:58 | 6.24 |
| 1900-01-01 10:23:03 | 6.17 |
| 1900-01-01 10:23:08 | 6.31 |
| 1900-01-01 10:23:13 | 6.41 |
| 1900-01-01 10:23:18 | 6.4 |
| 1900-01-01 10:23:23 | 6.4 |
| 1900-01-01 10:23:28 | 6.42 |
| 1900-01-01 10:23:33 | 6.42 |
| 1900-01-01 10:23:38 | 6.42 |
| 1900-01-01 10:23:43 | 6.41 |
| 1900-01-01 10:23:48 | 6.41 |
| 1900-01-01 10:23:53 | 6.41 |
| 1900-01-01 10:23:58 | 6.38 |
| 1900-01-01 10:24:03 | 6.38 |
| 1900-01-01 10:24:08 | 6.38 |
| 1900-01-01 10:24:13 | 6.34 |
| 1900-01-01 10:24:18 | 6.32 |
| 1900-01-01 10:24:23 | 6.39 |
| 1900-01-01 10:24:28 | 6.38 |
| 1900-01-01 10:24:33 | 6.31 |
| 1900-01-01 10:24:38 | 6.28 |
| 1900-01-01 10:24:43 | 6.38 |
| 1900-01-01 10:24:48 | 6.43 |
| 1900-01-01 10:24:53 | 6.44 |
| 1900-01-01 10:24:58 | 6.41 |
| 1900-01-01 10:25:03 | 6.43 |
| 1900-01-01 10:25:08 | 6.43 |
| 1900-01-01 10:25:13 | 6.43 |
| 1900-01-01 10:25:18 | 6.4 |
| 1900-01-01 10:25:23 | 6.4 |
| 1900-01-01 10:25:28 | 6.43 |
| 1900-01-01 10:25:33 | 6.44 |
| 1900-01-01 10:25:38 | 6.41 |
| 1900-01-01 10:25:43 | 6.43 |
| 1900-01-01 10:25:48 | 6.4 |
| 1900-01-01 10:25:53 | 6.43 |
| 1900-01-01 10:25:58 | 6.4 |
| 1900-01-01 10:26:03 | 6.43 |
| 1900-01-01 10:26:08 | 6.42 |
| 1900-01-01 10:26:13 | 6.4 |
| 1900-01-01 10:26:18 | 6.42 |
| 1900-01-01 10:26:23 | 6.42 |
| 1900-01-01 10:26:28 | 6.42 |
| 1900-01-01 10:26:33 | 6.4 |
| 1900-01-01 10:26:38 | 6.34 |
| 1900-01-01 10:26:43 | 6.34 |
| 1900-01-01 10:26:48 | 6.29 |
| 1900-01-01 10:26:53 | 6.36 |
| 1900-01-01 10:26:58 | 6.34 |
| 1900-01-01 10:27:03 | 6.39 |
| 1900-01-01 10:27:08 | 6.34 |
| 1900-01-01 10:27:13 | 6.37 |
| 1900-01-01 10:27:18 | 6.38 |
| 1900-01-01 10:27:23 | 6.33 |
| 1900-01-01 10:27:28 | 6.39 |
| 1900-01-01 10:27:33 | 6.42 |
| 1900-01-01 10:27:38 | 6.44 |
| 1900-01-01 10:27:43 | 6.45 |
| 1900-01-01 10:27:48 | 6.44 |
| 1900-01-01 10:27:53 | 6.43 |
| 1900-01-01 10:27:58 | 6.42 |
| 1900-01-01 10:28:03 | 6.41 |
| 1900-01-01 10:28:08 | 6.4 |
| 1900-01-01 10:28:13 | 6.39 |
| 1900-01-01 10:28:18 | 6.41 |
| 1900-01-01 10:28:23 | 6.44 |
| 1900-01-01 10:28:28 | 6.43 |
| 1900-01-01 10:28:33 | 6.44 |
| 1900-01-01 10:28:38 | 6.41 |
| 1900-01-01 10:28:43 | 6.41 |
| 1900-01-01 10:28:48 | 6.41 |
| 1900-01-01 10:28:53 | 6.43 |
| 1900-01-01 10:28:58 | 6.35 |
| 1900-01-01 10:29:03 | 6.37 |
| 1900-01-01 10:29:08 | 6.29 |
| 1900-01-01 10:29:13 | 6.36 |
| 1900-01-01 10:29:18 | 6.39 |
| 1900-01-01 10:29:23 | 6.36 |
| 1900-01-01 10:29:28 | 6.37 |
| 1900-01-01 10:29:33 | 6.38 |
| 1900-01-01 10:29:38 | 6.4 |
| 1900-01-01 10:29:43 | 6.37 |
| 1900-01-01 10:29:48 | 6.4 |
| 1900-01-01 10:29:53 | 6.36 |
| 1900-01-01 10:29:58 | 6.34 |
| 1900-01-01 10:30:03 | 6.37 |
| 1900-01-01 10:30:08 | 6.34 |
| 1900-01-01 10:30:13 | 6.3 |
| 1900-01-01 10:30:18 | 6.3 |
| 1900-01-01 10:30:23 | 6.32 |
| 1900-01-01 10:30:28 | 6.36 |
| 1900-01-01 10:30:33 | 6.35 |
| 1900-01-01 10:30:38 | 6.37 |
| 1900-01-01 10:30:43 | 6.36 |
| 1900-01-01 10:30:48 | 6.32 |
| 1900-01-01 10:30:53 | 6.36 |
| 1900-01-01 10:30:58 | 6.37 |
| 1900-01-01 10:31:03 | 6.36 |
| 1900-01-01 10:31:08 | 6.38 |
| 1900-01-01 10:31:13 | 6.35 |
| 1900-01-01 10:31:18 | 6.36 |
| 1900-01-01 10:31:23 | 6.33 |
| 1900-01-01 10:31:28 | 6.36 |
| 1900-01-01 10:31:33 | 6.37 |
| 1900-01-01 10:31:38 | 6.38 |
| 1900-01-01 10:31:43 | 6.38 |
| 1900-01-01 10:31:48 | 6.36 |
| 1900-01-01 10:31:53 | 6.38 |
| 1900-01-01 10:31:58 | 6.35 |
| 1900-01-01 10:32:03 | 6.38 |
| 1900-01-01 10:32:08 | 6.37 |
| 1900-01-01 10:32:13 | 6.36 |
| 1900-01-01 10:32:18 | 6.36 |
| 1900-01-01 10:32:23 | 6.38 |
| 1900-01-01 10:32:28 | 6.38 |
| 1900-01-01 10:32:33 | 6.4 |
| 1900-01-01 10:32:38 | 6.4 |
| 1900-01-01 10:32:43 | 6.38 |
| 1900-01-01 10:32:48 | 6.4 |
| 1900-01-01 10:32:53 | 6.39 |
| 1900-01-01 10:32:58 | 6.39 |
| 1900-01-01 10:33:03 | 6.4 |
| 1900-01-01 10:33:08 | 6.36 |
| 1900-01-01 10:33:13 | 6.4 |
| 1900-01-01 10:33:18 | 6.4 |
| 1900-01-01 10:33:23 | 6.36 |
| 1900-01-01 10:33:28 | 6.4 |
| 1900-01-01 10:33:33 | 6.4 |
| 1900-01-01 10:33:38 | 6.38 |
| 1900-01-01 10:33:43 | 6.38 |
| 1900-01-01 10:33:48 | 6.39 |
| 1900-01-01 10:33:53 | 6.39 |
| 1900-01-01 10:33:58 | 6.37 |
| 1900-01-01 10:34:03 | 6.36 |
| 1900-01-01 10:34:08 | 6.4 |
| 1900-01-01 10:34:13 | 6.4 |
| 1900-01-01 10:34:18 | 6.39 |
| 1900-01-01 10:34:23 | 6.38 |
| 1900-01-01 10:34:28 | 6.38 |
| 1900-01-01 10:34:33 | 6.37 |
| 1900-01-01 10:34:38 | 6.38 |
| 1900-01-01 10:34:43 | 6.37 |
| 1900-01-01 10:34:48 | 6.38 |
| 1900-01-01 10:34:53 | 6.37 |
| 1900-01-01 10:34:58 | 6.37 |
| 1900-01-01 10:35:03 | 6.34 |
| 1900-01-01 10:35:08 | 6.36 |
| 1900-01-01 10:35:13 | 6.34 |
| 1900-01-01 10:35:18 | 6.35 |
| 1900-01-01 10:35:23 | 6.38 |
| 1900-01-01 10:35:28 | 6.36 |
| 1900-01-01 10:35:33 | 6.38 |
| 1900-01-01 10:35:38 | 6.38 |
| 1900-01-01 10:35:43 | 6.4 |
| 1900-01-01 10:35:48 | 6.4 |
| 1900-01-01 10:35:53 | 6.39 |
| 1900-01-01 10:35:58 | 6.39 |
| 1900-01-01 10:36:03 | 6.39 |
| 1900-01-01 10:36:08 | 6.38 |
| 1900-01-01 10:36:13 | 6.37 |
| 1900-01-01 10:36:18 | 6.36 |
| 1900-01-01 10:36:23 | 6.33 |
| 1900-01-01 10:36:28 | 6.33 |
| 1900-01-01 10:36:33 | 6.3 |
| 1900-01-01 10:36:38 | 6.31 |
| 1900-01-01 10:36:43 | 6.28 |
| 1900-01-01 10:36:48 | 6.3 |
| 1900-01-01 10:36:53 | 6.28 |
| 1900-01-01 10:36:58 | 6.22 |
| 1900-01-01 10:37:03 | 6.15 |
| 1900-01-01 10:37:08 | 6.31 |
| 1900-01-01 10:37:13 | 6.31 |
| 1900-01-01 10:37:18 | 6.29 |
| 1900-01-01 10:37:23 | 6.32 |
| 1900-01-01 10:37:28 | 6.33 |
| 1900-01-01 10:37:33 | 6.3 |
| 1900-01-01 10:37:38 | 6.29 |
| 1900-01-01 10:37:43 | 6.25 |
| 1900-01-01 10:37:48 | 6.14 |
| 1900-01-01 10:37:53 | 6.33 |
| 1900-01-01 10:37:58 | 6.3 |
| 1900-01-01 10:38:03 | 6.33 |
| 1900-01-01 10:38:08 | 6.29 |
| 1900-01-01 10:38:13 | 6.32 |
| 1900-01-01 10:38:18 | 6.3 |
| 1900-01-01 10:38:23 | 6.27 |
| 1900-01-01 10:38:28 | 6.28 |
| 1900-01-01 10:38:33 | 6.34 |
| 1900-01-01 10:38:38 | 6.32 |
| 1900-01-01 10:38:43 | 6.34 |
| 1900-01-01 10:38:48 | 6.38 |
| 1900-01-01 10:38:53 | 6.36 |
| 1900-01-01 10:38:58 | 6.36 |
| 1900-01-01 10:39:03 | 6.38 |
| 1900-01-01 10:39:08 | 6.39 |
| 1900-01-01 10:39:13 | 6.36 |
| 1900-01-01 10:39:18 | 6.42 |
| 1900-01-01 10:39:23 | 6.41 |
| 1900-01-01 10:39:28 | 6.38 |
| 1900-01-01 10:39:33 | 6.39 |
| 1900-01-01 10:39:38 | 6.42 |
| 1900-01-01 10:39:43 | 6.42 |
| 1900-01-01 10:39:48 | 6.4 |
| 1900-01-01 10:39:53 | 6.42 |
| 1900-01-01 10:39:58 | 6.44 |
| 1900-01-01 10:40:03 | 6.43 |
| 1900-01-01 10:40:08 | 6.39 |
| 1900-01-01 10:40:13 | 6.39 |
| 1900-01-01 10:40:18 | 6.44 |
| 1900-01-01 10:40:23 | 6.43 |
| 1900-01-01 10:40:28 | 6.43 |
| 1900-01-01 10:40:33 | 6.43 |
| 1900-01-01 10:40:38 | 6.4 |
| 1900-01-01 10:40:43 | 6.4 |
| 1900-01-01 10:40:48 | 6.4 |
| 1900-01-01 10:40:53 | 6.4 |
| 1900-01-01 10:40:58 | 6.4 |
| 1900-01-01 10:41:03 | 6.41 |
| 1900-01-01 10:41:08 | 6.41 |
| 1900-01-01 10:41:13 | 6.4 |
| 1900-01-01 10:41:18 | 6.42 |
| 1900-01-01 10:41:23 | 6.42 |
| 1900-01-01 10:41:28 | 6.41 |
| 1900-01-01 10:41:33 | 6.4 |
| 1900-01-01 10:41:38 | 6.39 |
| 1900-01-01 10:41:43 | 6.39 |
| 1900-01-01 10:41:48 | 6.35 |
| 1900-01-01 10:41:53 | 6.36 |
| 1900-01-01 10:41:58 | 6.36 |
| 1900-01-01 10:42:03 | 6.35 |
| 1900-01-01 10:42:08 | 6.37 |
| 1900-01-01 10:42:13 | 6.38 |
| 1900-01-01 10:42:18 | 6.39 |
| 1900-01-01 10:42:23 | 6.39 |
| 1900-01-01 10:42:28 | 6.37 |
| 1900-01-01 10:42:33 | 6.38 |
| 1900-01-01 10:42:38 | 6.4 |
| 1900-01-01 10:42:43 | 6.38 |
| 1900-01-01 10:42:48 | 6.4 |
| 1900-01-01 10:42:53 | 6.39 |
| 1900-01-01 10:42:58 | 6.36 |
| 1900-01-01 10:43:03 | 6.34 |
| 1900-01-01 10:43:08 | 6.34 |
| 1900-01-01 10:43:13 | 6.36 |
| 1900-01-01 10:43:18 | 6.34 |
| 1900-01-01 10:43:23 | 6.37 |
| 1900-01-01 10:43:28 | 6.28 |
| 1900-01-01 10:43:33 | 6.2 |
| 1900-01-01 10:43:38 | 6.25 |
| 1900-01-01 10:43:43 | 6.34 |
| 1900-01-01 10:43:48 | 6.26 |
| 1900-01-01 10:43:53 | 6.34 |
| 1900-01-01 10:43:58 | 6.35 |
| 1900-01-01 10:44:03 | 6.33 |
| 1900-01-01 10:44:08 | 6.32 |
| 1900-01-01 10:44:13 | 6.35 |
| 1900-01-01 10:44:18 | 6.38 |
| 1900-01-01 10:44:23 | 6.34 |
| 1900-01-01 10:44:28 | 6.4 |
| 1900-01-01 10:44:33 | 6.38 |
| 1900-01-01 10:44:38 | 6.4 |
| 1900-01-01 10:44:43 | 6.38 |
| 1900-01-01 10:44:48 | 6.39 |
| 1900-01-01 10:44:53 | 6.38 |
| 1900-01-01 10:44:58 | 6.34 |
| 1900-01-01 10:45:03 | 6.42 |
| 1900-01-01 10:45:08 | 6.42 |
| 1900-01-01 10:45:13 | 6.35 |
| 1900-01-01 10:45:18 | 6.38 |
| 1900-01-01 10:45:23 | 6.38 |
| 1900-01-01 10:45:28 | 6.48 |
| 1900-01-01 10:45:33 | 6.46 |
| 1900-01-01 10:45:38 | 6.47 |
| 1900-01-01 10:45:43 | 6.44 |
| 1900-01-01 10:45:48 | 6.46 |
| 1900-01-01 10:45:53 | 6.46 |
| 1900-01-01 10:45:58 | 6.45 |
| 1900-01-01 10:46:03 | 6.43 |
| 1900-01-01 10:46:08 | 6.42 |
| 1900-01-01 10:46:13 | 6.43 |
| 1900-01-01 10:46:18 | 6.28 |
| 1900-01-01 10:46:23 | 6.35 |
| 1900-01-01 10:46:28 | 6.49 |
| 1900-01-01 10:46:33 | 6.48 |
| 1900-01-01 10:46:38 | 6.47 |
| 1900-01-01 10:46:43 | 6.46 |
| 1900-01-01 10:46:48 | 6.48 |
| 1900-01-01 10:46:53 | 6.46 |
| 1900-01-01 10:46:58 | 6.48 |
| 1900-01-01 10:47:03 | 6.48 |
| 1900-01-01 10:47:08 | 6.48 |
| 1900-01-01 10:47:13 | 6.32 |
| 1900-01-01 10:47:18 | 6.41 |
| 1900-01-01 10:47:23 | 6.19 |
| 1900-01-01 10:47:28 | 6.3 |
| 1900-01-01 10:47:33 | 6.49 |
| 1900-01-01 10:47:38 | 6.48 |
| 1900-01-01 10:47:43 | 6.49 |
| 1900-01-01 10:47:48 | 6.46 |
| 1900-01-01 10:47:53 | 6.33 |
| 1900-01-01 10:47:58 | 6.11 |
| 1900-01-01 10:48:03 | 6.41 |
| 1900-01-01 10:48:08 | 6.5 |
| 1900-01-01 10:48:13 | 6.46 |
| 1900-01-01 10:48:18 | 6.42 |
| 1900-01-01 10:48:23 | 6.48 |
| 1900-01-01 10:48:28 | 6.46 |
| 1900-01-01 10:48:33 | 6.39 |
| 1900-01-01 10:48:38 | 6.4 |
| 1900-01-01 10:48:43 | 6.38 |
| 1900-01-01 10:48:48 | 6.42 |
| 1900-01-01 10:48:53 | 6.35 |
| 1900-01-01 10:48:58 | 6.41 |
| 1900-01-01 10:49:03 | 6.45 |
| 1900-01-01 10:49:08 | 6.5 |
| 1900-01-01 10:49:13 | 6.48 |
| 1900-01-01 10:49:18 | 6.47 |
| 1900-01-01 10:49:23 | 6.5 |
| 1900-01-01 10:49:28 | 6.48 |
| 1900-01-01 10:49:33 | 6.5 |
| 1900-01-01 10:49:38 | 6.49 |
| 1900-01-01 10:49:43 | 6.46 |
| 1900-01-01 10:49:48 | 6.48 |
| 1900-01-01 10:49:53 | 6.47 |
| 1900-01-01 10:49:58 | 6.47 |
| 1900-01-01 10:50:03 | 6.47 |
| 1900-01-01 10:50:08 | 6.46 |
| 1900-01-01 10:50:13 | 6.44 |
| 1900-01-01 10:50:18 | 6.47 |
| 1900-01-01 10:50:23 | 6.22 |
| 1900-01-01 10:50:28 | 6.28 |
| 1900-01-01 10:50:33 | 6.3 |
| 1900-01-01 10:50:38 | 6.34 |
| 1900-01-01 10:50:43 | 6.39 |
| 1900-01-01 10:50:48 | 6.46 |
| 1900-01-01 10:50:53 | 6.41 |
| 1900-01-01 10:50:58 | 6.46 |
| 1900-01-01 10:51:03 | 6.42 |
| 1900-01-01 10:51:08 | 6.34 |
| 1900-01-01 10:51:13 | 6.46 |
| 1900-01-01 10:51:18 | 6.47 |
| 1900-01-01 10:51:23 | 6.46 |
| 1900-01-01 10:51:28 | 6.46 |
| 1900-01-01 10:51:33 | 6.44 |
| 1900-01-01 10:51:38 | 6.45 |
| 1900-01-01 10:51:43 | 6.43 |
| 1900-01-01 10:51:48 | 6.44 |
| 1900-01-01 10:51:53 | 6.43 |
| 1900-01-01 10:51:58 | 6.41 |
| 1900-01-01 10:52:03 | 6.44 |
| 1900-01-01 10:52:08 | 6.46 |
| 1900-01-01 10:52:13 | 6.44 |
| 1900-01-01 10:52:18 | 6.47 |
| 1900-01-01 10:52:23 | 6.46 |
| 1900-01-01 10:52:28 | 6.43 |
| 1900-01-01 10:52:33 | 6.42 |
| 1900-01-01 10:52:38 | 6.42 |
| 1900-01-01 10:52:43 | 6.4 |
| 1900-01-01 10:52:48 | 6.41 |
| 1900-01-01 10:52:53 | 6.42 |
| 1900-01-01 10:52:58 | 6.46 |
| 1900-01-01 10:53:03 | 6.44 |
| 1900-01-01 10:53:08 | 6.36 |
| 1900-01-01 10:53:13 | 6.42 |
| 1900-01-01 10:53:18 | 6.44 |
| 1900-01-01 10:53:23 | 6.36 |
| 1900-01-01 10:53:28 | 6.33 |
| 1900-01-01 10:53:33 | 6.36 |
| 1900-01-01 10:53:38 | 6.36 |
| 1900-01-01 10:53:43 | 6.44 |
| 1900-01-01 10:53:48 | 6.44 |
| 1900-01-01 10:53:53 | 6.43 |
| 1900-01-01 10:53:58 | 6.43 |
| 1900-01-01 10:54:03 | 6.36 |
| 1900-01-01 10:54:08 | 6.37 |
| 1900-01-01 10:54:13 | 6.41 |
| 1900-01-01 10:54:18 | 6.42 |
| 1900-01-01 10:54:23 | 6.45 |
| 1900-01-01 10:54:28 | 6.4 |
| 1900-01-01 10:54:33 | 6.41 |
| 1900-01-01 10:54:38 | 6.45 |
| 1900-01-01 10:54:43 | 6.45 |
| 1900-01-01 10:54:48 | 6.42 |
| 1900-01-01 10:54:53 | 6.46 |
| 1900-01-01 10:54:58 | 6.45 |
| 1900-01-01 10:55:03 | 6.46 |
| 1900-01-01 10:55:08 | 6.43 |
| 1900-01-01 10:55:13 | 6.44 |
| 1900-01-01 10:55:18 | 6.44 |
| 1900-01-01 10:55:23 | 6.46 |
| 1900-01-01 10:55:28 | 6.39 |
| 1900-01-01 10:55:33 | 6.42 |
| 1900-01-01 10:55:38 | 6.42 |
| 1900-01-01 10:55:43 | 6.46 |
| 1900-01-01 10:55:48 | 6.42 |
| 1900-01-01 10:55:53 | 6.4 |
| 1900-01-01 10:55:58 | 6.4 |
| 1900-01-01 10:56:03 | 6.44 |
| 1900-01-01 10:56:08 | 6.36 |
| 1900-01-01 10:56:13 | 6.34 |
| 1900-01-01 10:56:18 | 6.35 |
| 1900-01-01 10:56:23 | 6.33 |
| 1900-01-01 10:56:28 | 6.42 |
| 1900-01-01 10:56:33 | 6.4 |
| 1900-01-01 10:56:38 | 6.39 |
| 1900-01-01 10:56:43 | 6.4 |
| 1900-01-01 10:56:48 | 6.43 |
| 1900-01-01 10:56:53 | 6.45 |
| 1900-01-01 10:56:58 | 6.42 |
| 1900-01-01 10:57:03 | 6.42 |
| 1900-01-01 10:57:08 | 6.44 |
| 1900-01-01 10:57:13 | 6.42 |
| 1900-01-01 10:57:18 | 6.4 |
| 1900-01-01 10:57:23 | 6.42 |
| 1900-01-01 10:57:28 | 6.43 |
| 1900-01-01 10:57:33 | 6.43 |
| 1900-01-01 10:57:38 | 6.37 |
| 1900-01-01 10:57:43 | 6.42 |
| 1900-01-01 10:57:48 | 6.44 |
| 1900-01-01 10:57:53 | 6.39 |
| 1900-01-01 10:57:58 | 6.4 |
| 1900-01-01 10:58:03 | 6.44 |
| 1900-01-01 10:58:08 | 6.44 |
| 1900-01-01 10:58:13 | 6.42 |
| 1900-01-01 10:58:18 | 6.41 |
| 1900-01-01 10:58:23 | 6.43 |
| 1900-01-01 10:58:28 | 6.4 |
| 1900-01-01 10:58:33 | 6.43 |
| 1900-01-01 10:58:38 | 6.42 |
| 1900-01-01 10:58:43 | 6.41 |
| 1900-01-01 10:58:48 | 6.41 |
| 1900-01-01 10:58:53 | 6.44 |
| 1900-01-01 10:58:58 | 6.44 |
| 1900-01-01 10:59:03 | 6.44 |
| 1900-01-01 10:59:08 | 6.42 |
| 1900-01-01 10:59:13 | 6.42 |
| 1900-01-01 10:59:18 | 6.45 |
| 1900-01-01 10:59:23 | 6.45 |
| 1900-01-01 10:59:28 | 6.45 |
| 1900-01-01 10:59:33 | 6.42 |
| 1900-01-01 10:59:38 | 6.45 |
| 1900-01-01 10:59:43 | 6.43 |
| 1900-01-01 10:59:48 | 6.45 |
| 1900-01-01 10:59:53 | 6.43 |
| 1900-01-01 10:59:58 | 6.46 |
| 1900-01-01 11:00:03 | 6.43 |
| 1900-01-01 11:00:08 | 6.45 |
| 1900-01-01 11:00:13 | 6.45 |
| 1900-01-01 11:00:18 | 6.46 |
| 1900-01-01 11:00:23 | 6.44 |
| 1900-01-01 11:00:28 | 6.45 |
| 1900-01-01 11:00:33 | 6.24 |
| 1900-01-01 11:00:38 | 6.38 |
| 1900-01-01 11:00:43 | 6.42 |
| 1900-01-01 11:00:48 | 6.42 |
| 1900-01-01 11:00:53 | 6.42 |
| 1900-01-01 11:00:58 | 6.42 |
| 1900-01-01 11:01:03 | 6.42 |
| 1900-01-01 11:01:08 | 6.4 |
| 1900-01-01 11:01:13 | 6.41 |
| 1900-01-01 11:01:18 | 6.44 |
| 1900-01-01 11:01:23 | 6.42 |
| 1900-01-01 11:01:28 | 6.36 |
| 1900-01-01 11:01:33 | 6.44 |
| 1900-01-01 11:01:38 | 6.45 |
| 1900-01-01 11:01:43 | 6.42 |
| 1900-01-01 11:01:48 | 6.42 |
| 1900-01-01 11:01:53 | 6.44 |
| 1900-01-01 11:01:58 | 6.44 |
| 1900-01-01 11:02:03 | 6.44 |
| 1900-01-01 11:02:08 | 6.44 |
| 1900-01-01 11:02:13 | 6.44 |
| 1900-01-01 11:02:18 | 6.45 |
| 1900-01-01 11:02:23 | 6.43 |
| 1900-01-01 11:02:28 | 6.46 |
| 1900-01-01 11:02:33 | 6.43 |
| 1900-01-01 11:02:38 | 6.46 |
| 1900-01-01 11:02:43 | 6.46 |
| 1900-01-01 11:02:48 | 6.43 |
| 1900-01-01 11:02:53 | 6.45 |
| 1900-01-01 11:02:58 | 6.45 |
| 1900-01-01 11:03:03 | 6.45 |
| 1900-01-01 11:03:08 | 6.45 |
| 1900-01-01 11:03:13 | 6.45 |
| 1900-01-01 11:03:18 | 6.45 |
| 1900-01-01 11:03:23 | 6.45 |
| 1900-01-01 11:03:28 | 6.45 |
| 1900-01-01 11:03:33 | 6.45 |
| 1900-01-01 11:03:38 | 6.45 |
| 1900-01-01 11:03:43 | 6.42 |
| 1900-01-01 11:03:48 | 6.41 |
| 1900-01-01 11:03:53 | 6.43 |
| 1900-01-01 11:03:58 | 6.45 |
| 1900-01-01 11:04:03 | 6.44 |
| 1900-01-01 11:04:08 | 6.44 |
| 1900-01-01 11:04:13 | 6.42 |
| 1900-01-01 11:04:18 | 6.44 |
| 1900-01-01 11:04:23 | 6.44 |
| 1900-01-01 11:04:28 | 6.41 |
| 1900-01-01 11:04:33 | 6.41 |
| 1900-01-01 11:04:38 | 6.4 |
| 1900-01-01 11:04:43 | 6.42 |
| 1900-01-01 11:04:48 | 6.4 |
| 1900-01-01 11:04:53 | 6.4 |
| 1900-01-01 11:04:58 | 6.42 |
| 1900-01-01 11:05:03 | 6.43 |
| 1900-01-01 11:05:08 | 6.44 |
| 1900-01-01 11:05:13 | 6.42 |
| 1900-01-01 11:05:18 | 6.44 |
| 1900-01-01 11:05:23 | 6.41 |
| 1900-01-01 11:05:28 | 6.42 |
| 1900-01-01 11:05:33 | 6.41 |
| 1900-01-01 11:05:38 | 6.44 |
| 1900-01-01 11:05:43 | 6.43 |
| 1900-01-01 11:05:48 | 6.43 |
| 1900-01-01 11:05:53 | 6.42 |
| 1900-01-01 11:05:58 | 6.42 |
| 1900-01-01 11:06:03 | 6.39 |
| 1900-01-01 11:06:08 | 6.39 |
| 1900-01-01 11:06:13 | 6.41 |
| 1900-01-01 11:06:18 | 6.38 |
| 1900-01-01 11:06:23 | 6.41 |
| 1900-01-01 11:06:28 | 6.41 |
| 1900-01-01 11:06:33 | 6.41 |
| 1900-01-01 11:06:38 | 6.41 |
| 1900-01-01 11:06:43 | 6.39 |
| 1900-01-01 11:06:48 | 6.39 |
| 1900-01-01 11:06:53 | 6.41 |
| 1900-01-01 11:06:58 | 6.39 |
| 1900-01-01 11:07:03 | 6.39 |
| 1900-01-01 11:07:08 | 6.41 |
| 1900-01-01 11:07:13 | 6.39 |
| 1900-01-01 11:07:18 | 6.42 |
| 1900-01-01 11:07:23 | 6.42 |
| 1900-01-01 11:07:28 | 6.4 |
| 1900-01-01 11:07:33 | 6.41 |
| 1900-01-01 11:07:38 | 6.42 |
| 1900-01-01 11:07:43 | 6.42 |
| 1900-01-01 11:07:48 | 6.39 |
| 1900-01-01 11:07:53 | 6.39 |
| 1900-01-01 11:07:58 | 6.42 |
| 1900-01-01 11:08:03 | 6.4 |
| 1900-01-01 11:08:08 | 6.42 |
| 1900-01-01 11:08:13 | 6.42 |
| 1900-01-01 11:08:18 | 6.43 |
| 1900-01-01 11:08:23 | 6.43 |
| 1900-01-01 11:08:28 | 6.43 |
| 1900-01-01 11:08:33 | 6.41 |
| 1900-01-01 11:08:38 | 6.43 |
| 1900-01-01 11:08:43 | 6.43 |
| 1900-01-01 11:08:48 | 6.43 |
| 1900-01-01 11:08:53 | 6.42 |
| 1900-01-01 11:08:58 | 6.4 |
| 1900-01-01 11:09:03 | 6.4 |
| 1900-01-01 11:09:08 | 6.42 |
| 1900-01-01 11:09:13 | 6.42 |
| 1900-01-01 11:09:18 | 6.42 |
| 1900-01-01 11:09:23 | 6.4 |
| 1900-01-01 11:09:28 | 6.4 |
| 1900-01-01 11:09:33 | 6.4 |
| 1900-01-01 11:09:38 | 6.39 |
| 1900-01-01 11:09:43 | 6.41 |
| 1900-01-01 11:09:48 | 6.4 |
| 1900-01-01 11:09:53 | 6.38 |
| 1900-01-01 11:09:58 | 6.38 |
| 1900-01-01 11:10:03 | 6.4 |
| 1900-01-01 11:10:08 | 6.37 |
| 1900-01-01 11:10:13 | 6.4 |
| 1900-01-01 11:10:18 | 6.39 |
| 1900-01-01 11:10:23 | 6.38 |
| 1900-01-01 11:10:28 | 6.36 |
| 1900-01-01 11:10:33 | 6.37 |
| 1900-01-01 11:10:38 | 6.37 |
| 1900-01-01 11:10:43 | 6.36 |
| 1900-01-01 11:10:48 | 6.32 |
| 1900-01-01 11:10:53 | 6.36 |
| 1900-01-01 11:10:58 | 6.36 |
| 1900-01-01 11:11:03 | 6.37 |
| 1900-01-01 11:11:08 | 6.34 |
| 1900-01-01 11:11:13 | 6.34 |
| 1900-01-01 11:11:18 | 6.37 |
| 1900-01-01 11:11:23 | 6.37 |
| 1900-01-01 11:11:28 | 6.35 |
| 1900-01-01 11:11:33 | 6.34 |
| 1900-01-01 11:11:38 | 6.35 |
| 1900-01-01 11:11:43 | 6.38 |
| 1900-01-01 11:11:48 | 6.37 |
| 1900-01-01 11:11:53 | 6.37 |
| 1900-01-01 11:11:58 | 6.38 |
| 1900-01-01 11:12:03 | 6.35 |
| 1900-01-01 11:12:08 | 6.38 |
| 1900-01-01 11:12:13 | 6.35 |
| 1900-01-01 11:12:18 | 6.37 |
| 1900-01-01 11:12:23 | 6.36 |
| 1900-01-01 11:12:28 | 6.36 |
| 1900-01-01 11:12:33 | 6.36 |
| 1900-01-01 11:12:38 | 6.36 |
| 1900-01-01 11:12:43 | 6.36 |
| 1900-01-01 11:12:48 | 6.36 |
| 1900-01-01 11:12:53 | 6.36 |
| 1900-01-01 11:12:58 | 6.36 |
| 1900-01-01 11:13:03 | 6.34 |
| 1900-01-01 11:13:08 | 6.36 |
| 1900-01-01 11:13:13 | 6.37 |
| 1900-01-01 11:13:18 | 6.35 |
| 1900-01-01 11:13:23 | 6.38 |
| 1900-01-01 11:13:28 | 6.36 |
| 1900-01-01 11:13:33 | 6.38 |
| 1900-01-01 11:13:38 | 6.38 |
| 1900-01-01 11:13:43 | 6.38 |
| 1900-01-01 11:13:48 | 6.38 |
| 1900-01-01 11:13:53 | 6.35 |
| 1900-01-01 11:13:58 | 6.37 |
| 1900-01-01 11:14:03 | 6.34 |
| 1900-01-01 11:14:08 | 6.37 |
| 1900-01-01 11:14:13 | 6.36 |
| 1900-01-01 11:14:18 | 6.36 |
| 1900-01-01 11:14:23 | 6.33 |
| 1900-01-01 11:14:28 | 6.36 |
| 1900-01-01 11:14:33 | 6.36 |
| 1900-01-01 11:14:38 | 6.36 |
| 1900-01-01 11:14:43 | 6.36 |
| 1900-01-01 11:14:48 | 6.33 |
| 1900-01-01 11:14:53 | 6.35 |
| 1900-01-01 11:14:58 | 6.32 |
| 1900-01-01 11:15:03 | 6.35 |
| 1900-01-01 11:15:08 | 6.35 |
| 1900-01-01 11:15:13 | 6.34 |
| 1900-01-01 11:15:18 | 6.32 |
| 1900-01-01 11:15:23 | 6.34 |
| 1900-01-01 11:15:28 | 6.32 |
| 1900-01-01 11:15:33 | 6.34 |
| 1900-01-01 11:15:38 | 6.34 |
| 1900-01-01 11:15:43 | 6.34 |
| 1900-01-01 11:15:48 | 6.34 |
| 1900-01-01 11:15:53 | 6.34 |
| 1900-01-01 11:15:58 | 6.32 |
| 1900-01-01 11:16:03 | 6.33 |
| 1900-01-01 11:16:08 | 6.36 |
| 1900-01-01 11:16:13 | 6.36 |
| 1900-01-01 11:16:18 | 6.35 |
| 1900-01-01 11:16:23 | 6.35 |
| 1900-01-01 11:16:28 | 6.36 |
| 1900-01-01 11:16:33 | 6.36 |
| 1900-01-01 11:16:38 | 6.36 |
| 1900-01-01 11:16:43 | 6.33 |
| 1900-01-01 11:16:48 | 6.36 |
| 1900-01-01 11:16:53 | 6.36 |
| 1900-01-01 11:16:58 | 6.33 |
| 1900-01-01 11:17:03 | 6.33 |
| 1900-01-01 11:17:08 | 6.34 |
| 1900-01-01 11:17:13 | 6.36 |
| 1900-01-01 11:17:18 | 6.34 |
| 1900-01-01 11:17:23 | 6.35 |
| 1900-01-01 11:17:28 | 6.38 |
| 1900-01-01 11:17:33 | 6.38 |
| 1900-01-01 11:17:38 | 6.35 |
| 1900-01-01 11:17:43 | 6.37 |
| 1900-01-01 11:17:48 | 6.37 |
| 1900-01-01 11:17:53 | 6.38 |
| 1900-01-01 11:17:58 | 6.38 |
| 1900-01-01 11:18:03 | 6.35 |
| 1900-01-01 11:18:08 | 6.35 |
| 1900-01-01 11:18:13 | 6.37 |
| 1900-01-01 11:18:18 | 6.37 |
| 1900-01-01 11:18:23 | 6.34 |
| 1900-01-01 11:18:28 | 6.36 |
| 1900-01-01 11:18:33 | 6.34 |
| 1900-01-01 11:18:38 | 6.34 |
| 1900-01-01 11:18:43 | 6.34 |
| 1900-01-01 11:18:48 | 6.34 |
| 1900-01-01 11:18:53 | 6.36 |
| 1900-01-01 11:18:58 | 6.34 |
| 1900-01-01 11:19:03 | 6.37 |
| 1900-01-01 11:19:08 | 6.35 |
| 1900-01-01 11:19:13 | 6.37 |
| 1900-01-01 11:19:18 | 6.37 |
| 1900-01-01 11:19:23 | 6.37 |
| 1900-01-01 11:19:28 | 6.35 |
| 1900-01-01 11:19:33 | 6.37 |
| 1900-01-01 11:19:38 | 6.34 |
| 1900-01-01 11:19:43 | 6.37 |
| 1900-01-01 11:19:48 | 6.34 |
| 1900-01-01 11:19:53 | 6.34 |
| 1900-01-01 11:19:58 | 6.37 |
| 1900-01-01 11:20:03 | 6.34 |
| 1900-01-01 11:20:08 | 6.33 |
| 1900-01-01 11:20:13 | 6.36 |
| 1900-01-01 11:20:18 | 6.36 |
| 1900-01-01 11:20:23 | 6.33 |
| 1900-01-01 11:20:28 | 6.33 |
| 1900-01-01 11:20:33 | 6.36 |
| 1900-01-01 11:20:38 | 6.36 |
| 1900-01-01 11:20:43 | 6.33 |
| 1900-01-01 11:20:48 | 6.36 |
| 1900-01-01 11:20:53 | 6.36 |
| 1900-01-01 11:20:58 | 6.35 |
| 1900-01-01 11:21:03 | 6.35 |
| 1900-01-01 11:21:08 | 6.35 |
| 1900-01-01 11:21:13 | 6.36 |
| 1900-01-01 11:21:18 | 6.36 |
| 1900-01-01 11:21:23 | 6.36 |
| 1900-01-01 11:21:28 | 6.34 |
| 1900-01-01 11:21:33 | 6.34 |
| 1900-01-01 11:21:38 | 6.36 |
| 1900-01-01 11:21:43 | 6.34 |
| 1900-01-01 11:21:48 | 6.36 |
| 1900-01-01 11:21:53 | 6.36 |
| 1900-01-01 11:21:58 | 6.34 |
| 1900-01-01 11:22:03 | 6.36 |
| 1900-01-01 11:22:08 | 6.36 |
| 1900-01-01 11:22:13 | 6.34 |
| 1900-01-01 11:22:18 | 6.37 |
| 1900-01-01 11:22:23 | 6.37 |
| 1900-01-01 11:22:28 | 6.37 |
| 1900-01-01 11:22:33 | 6.36 |
| 1900-01-01 11:22:38 | 6.34 |
| 1900-01-01 11:22:43 | 6.34 |
| 1900-01-01 11:22:48 | 6.34 |
| 1900-01-01 11:22:53 | 6.34 |
| 1900-01-01 11:22:58 | 6.35 |
| 1900-01-01 11:23:03 | 6.38 |
| 1900-01-01 11:23:08 | 6.35 |
| 1900-01-01 11:23:13 | 6.36 |
| 1900-01-01 11:23:18 | 6.36 |
| 1900-01-01 11:23:23 | 6.35 |
| 1900-01-01 11:23:28 | 6.38 |
| 1900-01-01 11:23:33 | 6.36 |
| 1900-01-01 11:23:38 | 6.38 |
| 1900-01-01 11:23:43 | 6.38 |
| 1900-01-01 11:23:48 | 6.38 |
| 1900-01-01 11:23:53 | 6.35 |
| 1900-01-01 11:23:58 | 6.35 |
| 1900-01-01 11:24:03 | 6.38 |
| 1900-01-01 11:24:08 | 6.37 |
| 1900-01-01 11:24:13 | 6.37 |
| 1900-01-01 11:24:18 | 6.34 |
| 1900-01-01 11:24:23 | 6.38 |
| 1900-01-01 11:24:28 | 6.36 |
| 1900-01-01 11:24:33 | 6.36 |
| 1900-01-01 11:24:38 | 6.36 |
| 1900-01-01 11:24:43 | 6.37 |
| 1900-01-01 11:24:48 | 6.36 |
| 1900-01-01 11:24:53 | 6.38 |
| 1900-01-01 11:24:58 | 6.36 |
| 1900-01-01 11:25:03 | 6.38 |
| 1900-01-01 11:25:08 | 6.38 |
| 1900-01-01 11:25:13 | 6.38 |
| 1900-01-01 11:25:18 | 6.35 |
| 1900-01-01 11:25:23 | 6.38 |
| 1900-01-01 11:25:28 | 6.38 |
| 1900-01-01 11:25:33 | 6.35 |
| 1900-01-01 11:25:38 | 6.35 |
| 1900-01-01 11:25:43 | 6.35 |
| 1900-01-01 11:25:48 | 6.37 |
| 1900-01-01 11:25:53 | 6.35 |
| 1900-01-01 11:25:58 | 6.37 |
| 1900-01-01 11:26:03 | 6.37 |
| 1900-01-01 11:26:08 | 6.37 |
| 1900-01-01 11:26:13 | 6.35 |
| 1900-01-01 11:26:18 | 6.37 |
| 1900-01-01 11:26:23 | 6.37 |
| 1900-01-01 11:26:28 | 6.36 |
| 1900-01-01 11:26:33 | 6.36 |
| 1900-01-01 11:26:38 | 6.34 |
| 1900-01-01 11:26:43 | 6.34 |
| 1900-01-01 11:26:48 | 6.36 |
| 1900-01-01 11:26:53 | 6.36 |
| 1900-01-01 11:26:58 | 6.33 |
| 1900-01-01 11:27:03 | 6.33 |
| 1900-01-01 11:27:08 | 6.36 |
| 1900-01-01 11:27:13 | 6.35 |
| 1900-01-01 11:27:18 | 6.33 |
| 1900-01-01 11:27:23 | 6.35 |
| 1900-01-01 11:27:28 | 6.32 |
| 1900-01-01 11:27:33 | 6.34 |
| 1900-01-01 11:27:38 | 6.35 |
| 1900-01-01 11:27:43 | 6.32 |
| 1900-01-01 11:27:48 | 6.32 |
| 1900-01-01 11:27:53 | 6.32 |
| 1900-01-01 11:27:58 | 6.34 |
| 1900-01-01 11:28:03 | 6.34 |
| 1900-01-01 11:28:08 | 6.32 |
| 1900-01-01 11:28:13 | 6.32 |
| 1900-01-01 11:28:18 | 6.32 |
| 1900-01-01 11:28:23 | 6.34 |
| 1900-01-01 11:28:28 | 6.34 |
| 1900-01-01 11:28:33 | 6.34 |
| 1900-01-01 11:28:38 | 6.34 |
| 1900-01-01 11:28:43 | 6.34 |
| 1900-01-01 11:28:48 | 6.31 |
| 1900-01-01 11:28:53 | 6.31 |
| 1900-01-01 11:28:58 | 6.31 |
| 1900-01-01 11:29:03 | 6.34 |
| 1900-01-01 11:29:08 | 6.32 |
| 1900-01-01 11:29:13 | 6.32 |
| 1900-01-01 11:29:18 | 6.35 |
| 1900-01-01 11:29:23 | 6.32 |
| 1900-01-01 11:29:28 | 6.35 |
| 1900-01-01 11:29:33 | 6.34 |
| 1900-01-01 11:29:38 | 6.34 |
| 1900-01-01 11:29:43 | 6.34 |
| 1900-01-01 11:29:48 | 6.34 |
| 1900-01-01 11:29:53 | 6.35 |
| 1900-01-01 11:29:58 | 6.33 |
| 1900-01-01 11:30:03 | 6.36 |
| 1900-01-01 11:30:08 | 6.36 |
| 1900-01-01 11:30:13 | 6.34 |
| 1900-01-01 11:30:18 | 6.34 |
| 1900-01-01 11:30:23 | 6.36 |
| 1900-01-01 11:30:28 | 6.34 |
| 1900-01-01 11:30:33 | 6.36 |
| 1900-01-01 11:30:38 | 6.36 |
| 1900-01-01 11:30:43 | 6.37 |
| 1900-01-01 11:30:48 | 6.35 |
| 1900-01-01 11:30:53 | 6.35 |
| 1900-01-01 11:30:58 | 6.35 |
| 1900-01-01 11:31:03 | 6.37 |
| 1900-01-01 11:31:08 | 6.34 |
| 1900-01-01 11:31:13 | 6.37 |
| 1900-01-01 11:31:18 | 6.34 |
| 1900-01-01 11:31:23 | 6.36 |
| 1900-01-01 11:31:28 | 6.34 |
| 1900-01-01 11:31:33 | 6.34 |
| 1900-01-01 11:31:38 | 6.37 |
| 1900-01-01 11:31:43 | 6.37 |
| 1900-01-01 11:31:48 | 6.34 |
| 1900-01-01 11:31:53 | 6.35 |
| 1900-01-01 11:31:58 | 6.35 |
| 1900-01-01 11:32:03 | 6.35 |
| 1900-01-01 11:32:08 | 6.37 |
| 1900-01-01 11:32:13 | 6.37 |
| 1900-01-01 11:32:18 | 6.35 |
| 1900-01-01 11:32:23 | 6.35 |
| 1900-01-01 11:32:28 | 6.37 |
| 1900-01-01 11:32:33 | 6.37 |
| 1900-01-01 11:32:38 | 6.37 |
| 1900-01-01 11:32:43 | 6.37 |
| 1900-01-01 11:32:48 | 6.37 |
| 1900-01-01 11:32:53 | 6.34 |
| 1900-01-01 11:32:58 | 6.34 |
| 1900-01-01 11:33:03 | 6.36 |
| 1900-01-01 11:33:08 | 6.36 |
| 1900-01-01 11:33:13 | 6.36 |
| 1900-01-01 11:33:18 | 6.36 |
| 1900-01-01 11:33:23 | 6.35 |
| 1900-01-01 11:33:28 | 6.33 |
| 1900-01-01 11:33:33 | 6.35 |
| 1900-01-01 11:33:38 | 6.35 |
| 1900-01-01 11:33:43 | 6.35 |
| 1900-01-01 11:33:48 | 6.35 |
| 1900-01-01 11:33:53 | 6.34 |
| 1900-01-01 11:33:58 | 6.34 |
| 1900-01-01 11:34:03 | 6.34 |
| 1900-01-01 11:34:08 | 6.32 |
| 1900-01-01 11:34:13 | 6.35 |
| 1900-01-01 11:34:18 | 6.32 |
| 1900-01-01 11:34:23 | 6.35 |
| 1900-01-01 11:34:28 | 6.33 |
| 1900-01-01 11:34:33 | 6.36 |
| 1900-01-01 11:34:38 | 6.34 |
| 1900-01-01 11:34:43 | 6.36 |
| 1900-01-01 11:34:48 | 6.34 |
| 1900-01-01 11:34:53 | 6.35 |
| 1900-01-01 11:34:58 | 6.37 |
| 1900-01-01 11:35:03 | 6.35 |
| 1900-01-01 11:35:08 | 6.37 |
| 1900-01-01 11:35:13 | 6.38 |
| 1900-01-01 11:35:18 | 6.37 |
| 1900-01-01 11:35:23 | 6.37 |
| 1900-01-01 11:35:28 | 6.34 |
| 1900-01-01 11:35:33 | 6.37 |
| 1900-01-01 11:35:38 | 6.35 |
| 1900-01-01 11:35:43 | 6.35 |
| 1900-01-01 11:35:48 | 6.38 |
| 1900-01-01 11:35:53 | 6.38 |
| 1900-01-01 11:35:58 | 6.38 |
| 1900-01-01 11:36:03 | 6.36 |
| 1900-01-01 11:36:08 | 6.38 |
| 1900-01-01 11:36:13 | 6.38 |
| 1900-01-01 11:36:18 | 6.36 |
| 1900-01-01 11:36:23 | 6.38 |
| 1900-01-01 11:36:28 | 6.35 |
| 1900-01-01 11:36:33 | 6.35 |
| 1900-01-01 11:36:38 | 6.34 |
| 1900-01-01 11:36:43 | 6.34 |
| 1900-01-01 11:36:48 | 6.34 |
| 1900-01-01 11:36:53 | 6.36 |
| 1900-01-01 11:36:58 | 6.36 |
| 1900-01-01 11:37:03 | 6.34 |
| 1900-01-01 11:37:08 | 6.36 |
| 1900-01-01 11:37:13 | 6.34 |
| 1900-01-01 11:37:18 | 6.36 |
| 1900-01-01 11:37:23 | 6.36 |
| 1900-01-01 11:37:28 | 6.36 |
| 1900-01-01 11:37:33 | 6.35 |
| 1900-01-01 11:37:38 | 6.35 |
| 1900-01-01 11:37:43 | 6.35 |
| 1900-01-01 11:37:48 | 6.34 |
| 1900-01-01 11:37:53 | 6.34 |
| 1900-01-01 11:37:58 | 6.32 |
| 1900-01-01 11:38:03 | 6.35 |
| 1900-01-01 11:38:08 | 6.33 |
| 1900-01-01 11:38:13 | 6.33 |
| 1900-01-01 11:38:18 | 6.33 |
| 1900-01-01 11:38:23 | 6.36 |
| 1900-01-01 11:38:28 | 6.35 |
| 1900-01-01 11:38:33 | 6.35 |
| 1900-01-01 11:38:38 | 6.35 |
| 1900-01-01 11:38:43 | 6.32 |
| 1900-01-01 11:38:48 | 6.34 |
| 1900-01-01 11:38:53 | 6.35 |
| 1900-01-01 11:38:58 | 6.34 |
| 1900-01-01 11:39:03 | 6.34 |
| 1900-01-01 11:39:08 | 6.32 |
| 1900-01-01 11:39:13 | 6.32 |
| 1900-01-01 11:39:18 | 6.34 |
| 1900-01-01 11:39:23 | 6.34 |
| 1900-01-01 11:39:28 | 6.31 |
| 1900-01-01 11:39:33 | 6.34 |
| 1900-01-01 11:39:38 | 6.34 |
| 1900-01-01 11:39:43 | 6.31 |
| 1900-01-01 11:39:48 | 6.34 |
| 1900-01-01 11:39:53 | 6.34 |
| 1900-01-01 11:39:58 | 6.34 |
| 1900-01-01 11:40:03 | 6.34 |
| 1900-01-01 11:40:08 | 6.31 |
| 1900-01-01 11:40:13 | 6.34 |
| 1900-01-01 11:40:18 | 6.31 |
| 1900-01-01 11:40:23 | 6.34 |
| 1900-01-01 11:40:28 | 6.31 |
| 1900-01-01 11:40:33 | 6.31 |
| 1900-01-01 11:40:38 | 6.34 |
| 1900-01-01 11:40:43 | 6.31 |
| 1900-01-01 11:40:48 | 6.34 |
| 1900-01-01 11:40:53 | 6.34 |
| 1900-01-01 11:40:58 | 6.34 |
| 1900-01-01 11:41:03 | 6.34 |
| 1900-01-01 11:41:08 | 6.32 |
| 1900-01-01 11:41:13 | 6.32 |
| 1900-01-01 11:41:18 | 6.32 |
| 1900-01-01 11:41:23 | 6.32 |
| 1900-01-01 11:41:28 | 6.32 |
| 1900-01-01 11:41:33 | 6.33 |
| 1900-01-01 11:41:38 | 6.32 |
| 1900-01-01 11:41:43 | 6.35 |
| 1900-01-01 11:41:48 | 6.32 |
| 1900-01-01 11:41:53 | 6.34 |
| 1900-01-01 11:41:58 | 6.35 |
| 1900-01-01 11:42:03 | 6.35 |
| 1900-01-01 11:42:08 | 6.32 |
| 1900-01-01 11:42:13 | 6.33 |
| 1900-01-01 11:42:18 | 6.36 |
| 1900-01-01 11:42:23 | 6.33 |
| 1900-01-01 11:42:28 | 6.35 |
| 1900-01-01 11:42:33 | 6.35 |
| 1900-01-01 11:42:38 | 6.36 |
| 1900-01-01 11:42:43 | 6.35 |
| 1900-01-01 11:42:48 | 6.35 |
| 1900-01-01 11:42:53 | 6.33 |
| 1900-01-01 11:42:58 | 6.33 |
| 1900-01-01 11:43:03 | 6.33 |
| 1900-01-01 11:43:08 | 6.32 |
| 1900-01-01 11:43:13 | 6.35 |
| 1900-01-01 11:43:18 | 6.35 |
| 1900-01-01 11:43:23 | 6.33 |
| 1900-01-01 11:43:28 | 6.36 |
| 1900-01-01 11:43:33 | 6.33 |
| 1900-01-01 11:43:38 | 6.36 |
| 1900-01-01 11:43:43 | 6.33 |
| 1900-01-01 11:43:48 | 6.36 |
| 1900-01-01 11:43:53 | 6.33 |
| 1900-01-01 11:43:58 | 6.33 |
| 1900-01-01 11:44:03 | 6.33 |
| 1900-01-01 11:44:08 | 6.33 |
| 1900-01-01 11:44:13 | 6.36 |
| 1900-01-01 11:44:18 | 6.34 |
| 1900-01-01 11:44:23 | 6.36 |
| 1900-01-01 11:44:28 | 6.35 |
| 1900-01-01 11:44:33 | 6.35 |
| 1900-01-01 11:44:38 | 6.35 |
| 1900-01-01 11:44:43 | 6.36 |
| 1900-01-01 11:44:48 | 6.36 |
| 1900-01-01 11:44:53 | 6.36 |
| 1900-01-01 11:44:58 | 6.33 |
| 1900-01-01 11:45:03 | 6.35 |
| 1900-01-01 11:45:08 | 6.35 |
| 1900-01-01 11:45:13 | 6.32 |
| 1900-01-01 11:45:18 | 6.34 |
| 1900-01-01 11:45:23 | 6.35 |
| 1900-01-01 11:45:28 | 6.32 |
| 1900-01-01 11:45:33 | 6.34 |
| 1900-01-01 11:45:38 | 6.32 |
| 1900-01-01 11:45:43 | 6.32 |
| 1900-01-01 11:45:48 | 6.32 |
| 1900-01-01 11:45:53 | 6.32 |
| 1900-01-01 11:45:58 | 6.34 |
| 1900-01-01 11:46:03 | 6.34 |
| 1900-01-01 11:46:08 | 6.31 |
| 1900-01-01 11:46:13 | 6.34 |
| 1900-01-01 11:46:18 | 6.31 |
| 1900-01-01 11:46:23 | 6.32 |
| 1900-01-01 11:46:28 | 6.34 |
| 1900-01-01 11:46:33 | 6.32 |
| 1900-01-01 11:46:38 | 6.33 |
| 1900-01-01 11:46:43 | 6.32 |
| 1900-01-01 11:46:48 | 6.32 |
| 1900-01-01 11:46:53 | 6.32 |
| 1900-01-01 11:46:58 | 6.34 |
| 1900-01-01 11:47:03 | 6.34 |
| 1900-01-01 11:47:08 | 6.34 |
| 1900-01-01 11:47:13 | 6.34 |
| 1900-01-01 11:47:18 | 6.31 |
| 1900-01-01 11:47:23 | 6.34 |
| 1900-01-01 11:47:28 | 6.33 |
| 1900-01-01 11:47:33 | 6.33 |
| 1900-01-01 11:47:38 | 6.33 |
| 1900-01-01 11:47:43 | 6.33 |
| 1900-01-01 11:47:48 | 6.3 |
| 1900-01-01 11:47:53 | 6.3 |
| 1900-01-01 11:47:58 | 6.3 |
| 1900-01-01 11:48:03 | 6.32 |
| 1900-01-01 11:48:08 | 6.3 |
| 1900-01-01 11:48:13 | 6.32 |
| 1900-01-01 11:48:18 | 6.32 |
| 1900-01-01 11:48:23 | 6.29 |
| 1900-01-01 11:48:28 | 6.29 |
| 1900-01-01 11:48:33 | 6.3 |
| 1900-01-01 11:48:38 | 6.3 |
| 1900-01-01 11:48:43 | 6.3 |
| 1900-01-01 11:48:48 | 6.3 |
| 1900-01-01 11:48:53 | 6.33 |
| 1900-01-01 11:48:58 | 6.31 |
| 1900-01-01 11:49:03 | 6.31 |
| 1900-01-01 11:49:08 | 6.33 |
| 1900-01-01 11:49:13 | 6.33 |
| 1900-01-01 11:49:18 | 6.31 |
| 1900-01-01 11:49:23 | 6.34 |
| 1900-01-01 11:49:28 | 6.34 |
| 1900-01-01 11:49:33 | 6.31 |
| 1900-01-01 11:49:38 | 6.31 |
| 1900-01-01 11:49:43 | 6.33 |
| 1900-01-01 11:49:48 | 6.3 |
| 1900-01-01 11:49:53 | 6.33 |
| 1900-01-01 11:49:58 | 6.32 |
| 1900-01-01 11:50:03 | 6.32 |
| 1900-01-01 11:50:08 | 6.32 |
| 1900-01-01 11:50:13 | 6.3 |
| 1900-01-01 11:50:18 | 6.29 |
| 1900-01-01 11:50:23 | 6.3 |
| 1900-01-01 11:50:28 | 6.32 |
| 1900-01-01 11:50:33 | 6.33 |
| 1900-01-01 11:50:38 | 6.33 |
| 1900-01-01 11:50:43 | 6.33 |
| 1900-01-01 11:50:48 | 6.34 |
| 1900-01-01 11:50:53 | 6.34 |
| 1900-01-01 11:50:58 | 6.31 |
| 1900-01-01 11:51:03 | 6.34 |
| 1900-01-01 11:51:08 | 6.33 |
| 1900-01-01 11:51:13 | 6.33 |
| 1900-01-01 11:51:18 | 6.33 |
| 1900-01-01 11:51:23 | 6.32 |
| 1900-01-01 11:51:28 | 6.32 |
| 1900-01-01 11:51:33 | 6.32 |
| 1900-01-01 11:51:38 | 6.32 |
| 1900-01-01 11:51:43 | 6.32 |
| 1900-01-01 11:51:48 | 6.29 |
| 1900-01-01 11:51:53 | 6.32 |
| 1900-01-01 11:51:58 | 6.3 |
| 1900-01-01 11:52:03 | 6.33 |
| 1900-01-01 11:52:08 | 6.31 |
| 1900-01-01 11:52:13 | 6.31 |
| 1900-01-01 11:52:18 | 6.31 |
| 1900-01-01 11:52:23 | 6.33 |
| 1900-01-01 11:52:28 | 6.33 |
| 1900-01-01 11:52:33 | 6.33 |
| 1900-01-01 11:52:38 | 6.3 |
| 1900-01-01 11:52:43 | 6.33 |
| 1900-01-01 11:52:48 | 6.33 |
| 1900-01-01 11:52:53 | 6.33 |
| 1900-01-01 11:52:58 | 6.33 |
| 1900-01-01 11:53:03 | 6.31 |
| 1900-01-01 11:53:08 | 6.31 |
| 1900-01-01 11:53:13 | 6.33 |
| 1900-01-01 11:53:18 | 6.33 |
| 1900-01-01 11:53:23 | 6.33 |
| 1900-01-01 11:53:28 | 6.33 |
| 1900-01-01 11:53:33 | 6.3 |
| 1900-01-01 11:53:38 | 6.3 |
| 1900-01-01 11:53:43 | 6.3 |
| 1900-01-01 11:53:48 | 6.3 |
| 1900-01-01 11:53:53 | 6.29 |
| 1900-01-01 11:53:58 | 6.29 |
| 1900-01-01 11:54:03 | 6.29 |
| 1900-01-01 11:54:08 | 6.29 |
| 1900-01-01 11:54:13 | 6.28 |
| 1900-01-01 11:54:18 | 6.31 |
| 1900-01-01 11:54:23 | 6.31 |
| 1900-01-01 11:54:28 | 6.31 |
| 1900-01-01 11:54:33 | 6.28 |
| 1900-01-01 11:54:38 | 6.28 |
| 1900-01-01 11:54:43 | 6.28 |
| 1900-01-01 11:54:48 | 6.31 |
| 1900-01-01 11:54:53 | 6.28 |
| 1900-01-01 11:54:58 | 6.28 |
| 1900-01-01 11:55:03 | 6.32 |
| 1900-01-01 11:55:08 | 6.29 |
| 1900-01-01 11:55:13 | 6.32 |
| 1900-01-01 11:55:18 | 6.32 |
| 1900-01-01 11:55:23 | 6.32 |
| 1900-01-01 11:55:28 | 6.32 |
| 1900-01-01 11:55:33 | 6.32 |
| 1900-01-01 11:55:38 | 6.3 |
| 1900-01-01 11:55:43 | 6.32 |
| 1900-01-01 11:55:48 | 6.32 |
| 1900-01-01 11:55:53 | 6.32 |
| 1900-01-01 11:55:58 | 6.32 |
| 1900-01-01 11:56:03 | 6.32 |
| 1900-01-01 11:56:08 | 6.32 |
| 1900-01-01 11:56:13 | 6.32 |
| 1900-01-01 11:56:18 | 6.32 |
| 1900-01-01 11:56:23 | 6.32 |
| 1900-01-01 11:56:28 | 6.32 |
| 1900-01-01 11:56:33 | 6.32 |
| 1900-01-01 11:56:38 | 6.32 |
| 1900-01-01 11:56:43 | 6.31 |
| 1900-01-01 11:56:48 | 6.31 |
| 1900-01-01 11:56:53 | 6.31 |
| 1900-01-01 11:56:58 | 6.31 |
| 1900-01-01 11:57:03 | 6.3 |
| 1900-01-01 11:57:08 | 6.3 |
| 1900-01-01 11:57:13 | 6.3 |
| 1900-01-01 11:57:18 | 6.3 |
| 1900-01-01 11:57:23 | 6.3 |
| 1900-01-01 11:57:28 | 6.3 |
| 1900-01-01 11:57:33 | 6.28 |
| 1900-01-01 11:57:38 | 6.3 |
| 1900-01-01 11:57:43 | 6.3 |
| 1900-01-01 11:57:48 | 6.27 |
| 1900-01-01 11:57:53 | 6.27 |
| 1900-01-01 11:57:58 | 6.26 |
| 1900-01-01 11:58:03 | 6.29 |
| 1900-01-01 11:58:08 | 6.29 |
| 1900-01-01 11:58:13 | 6.29 |
| 1900-01-01 11:58:18 | 6.29 |
| 1900-01-01 11:58:23 | 6.29 |
| 1900-01-01 11:58:28 | 6.29 |
| 1900-01-01 11:58:33 | 6.29 |
| 1900-01-01 11:58:38 | 6.29 |
| 1900-01-01 11:58:43 | 6.29 |
| 1900-01-01 11:58:48 | 6.29 |
| 1900-01-01 11:58:53 | 6.26 |
| 1900-01-01 11:58:58 | 6.26 |
| 1900-01-01 11:59:03 | 6.26 |
| 1900-01-01 11:59:08 | 6.28 |
| 1900-01-01 11:59:13 | 6.28 |
| 1900-01-01 11:59:18 | 6.26 |
| 1900-01-01 11:59:23 | 6.26 |
| 1900-01-01 11:59:28 | 6.28 |
| 1900-01-01 11:59:33 | 6.28 |
| 1900-01-01 11:59:38 | 6.28 |
| 1900-01-01 11:59:43 | 6.25 |
| 1900-01-01 11:59:48 | 6.25 |
| 1900-01-01 11:59:53 | 6.28 |
| 1900-01-01 11:59:58 | 6.28 |
| 1900-01-01 12:00:03 | 6.26 |
| 1900-01-01 12:00:08 | 6.26 |
| 1900-01-01 12:00:13 | 6.26 |
| 1900-01-01 12:00:18 | 6.26 |
| 1900-01-01 12:00:23 | 6.29 |
| 1900-01-01 12:00:28 | 6.26 |
| 1900-01-01 12:00:33 | 6.29 |
| 1900-01-01 12:00:38 | 6.28 |
| 1900-01-01 12:00:43 | 6.28 |
| 1900-01-01 12:00:48 | 6.28 |
| 1900-01-01 12:00:53 | 6.28 |
| 1900-01-01 12:00:58 | 6.28 |
| 1900-01-01 12:01:03 | 6.28 |
| 1900-01-01 12:01:08 | 6.25 |
| 1900-01-01 12:01:13 | 6.28 |
| 1900-01-01 12:01:18 | 6.27 |
| 1900-01-01 12:01:23 | 6.25 |
| 1900-01-01 12:01:28 | 6.28 |
| 1900-01-01 12:01:33 | 6.27 |
| 1900-01-01 12:01:38 | 6.28 |
| 1900-01-01 12:01:43 | 6.28 |
| 1900-01-01 12:01:48 | 6.28 |
| 1900-01-01 12:01:53 | 6.27 |
| 1900-01-01 12:01:58 | 6.27 |
| 1900-01-01 12:02:03 | 6.25 |
| 1900-01-01 12:02:08 | 6.25 |
| 1900-01-01 12:02:13 | 6.27 |
| 1900-01-01 12:02:18 | 6.25 |
| 1900-01-01 12:02:23 | 6.28 |
| 1900-01-01 12:02:28 | 6.28 |
| 1900-01-01 12:02:33 | 6.28 |
| 1900-01-01 12:02:38 | 6.28 |
| 1900-01-01 12:02:43 | 6.25 |
| 1900-01-01 12:02:48 | 6.28 |
| 1900-01-01 12:02:53 | 6.28 |
| 1900-01-01 12:02:58 | 6.28 |
| 1900-01-01 12:03:03 | 6.28 |
| 1900-01-01 12:03:08 | 6.28 |
| 1900-01-01 12:03:13 | 6.28 |
| 1900-01-01 12:03:18 | 6.28 |
| 1900-01-01 12:03:23 | 6.28 |
| 1900-01-01 12:03:28 | 6.28 |
| 1900-01-01 12:03:33 | 6.26 |
| 1900-01-01 12:03:38 | 6.26 |
| 1900-01-01 12:03:43 | 6.28 |
| 1900-01-01 12:03:48 | 6.28 |
| 1900-01-01 12:03:53 | 6.25 |
| 1900-01-01 12:03:58 | 6.25 |
| 1900-01-01 12:04:03 | 6.25 |
| 1900-01-01 12:04:08 | 6.25 |
| 1900-01-01 12:04:13 | 6.28 |
| 1900-01-01 12:04:18 | 6.25 |
| 1900-01-01 12:04:23 | 6.28 |
| 1900-01-01 12:04:28 | 6.25 |
| 1900-01-01 12:04:33 | 6.25 |
| 1900-01-01 12:04:38 | 6.25 |
| 1900-01-01 12:04:43 | 6.27 |
| 1900-01-01 12:04:48 | 6.27 |
| 1900-01-01 12:04:53 | 6.28 |
| 1900-01-01 12:04:58 | 6.27 |
| 1900-01-01 12:05:03 | 6.25 |
| 1900-01-01 12:05:08 | 6.28 |
| 1900-01-01 12:05:13 | 6.28 |
| 1900-01-01 12:05:18 | 6.26 |
| 1900-01-01 12:05:23 | 6.26 |
| 1900-01-01 12:05:28 | 6.26 |
| 1900-01-01 12:05:33 | 6.28 |
| 1900-01-01 12:05:38 | 6.28 |
| 1900-01-01 12:05:43 | 6.25 |
| 1900-01-01 12:05:48 | 6.25 |
| 1900-01-01 12:05:53 | 6.28 |
| 1900-01-01 12:05:58 | 6.25 |
| 1900-01-01 12:06:03 | 6.25 |
| 1900-01-01 12:06:08 | 6.25 |
| 1900-01-01 12:06:13 | 6.28 |
| 1900-01-01 12:06:18 | 6.25 |
| 1900-01-01 12:06:23 | 6.28 |
| 1900-01-01 12:06:28 | 6.26 |
| 1900-01-01 12:06:33 | 6.26 |
| 1900-01-01 12:06:38 | 6.29 |
| 1900-01-01 12:06:43 | 6.3 |
| 1900-01-01 12:06:48 | 6.3 |
| 1900-01-01 12:06:53 | 6.3 |
| 1900-01-01 12:06:58 | 6.3 |
| 1900-01-01 12:07:03 | 6.28 |
| 1900-01-01 12:07:08 | 6.3 |
| 1900-01-01 12:07:13 | 6.28 |
| 1900-01-01 12:07:18 | 6.31 |
| 1900-01-01 12:07:23 | 6.28 |
| 1900-01-01 12:07:28 | 6.28 |
| 1900-01-01 12:07:33 | 6.31 |
| 1900-01-01 12:07:38 | 6.31 |
| 1900-01-01 12:07:43 | 6.31 |
| 1900-01-01 12:07:48 | 6.29 |
| 1900-01-01 12:07:53 | 6.32 |
| 1900-01-01 12:07:58 | 6.31 |
| 1900-01-01 12:08:03 | 6.31 |
| 1900-01-01 12:08:08 | 6.28 |
| 1900-01-01 12:08:13 | 6.31 |
| 1900-01-01 12:08:18 | 6.31 |
| 1900-01-01 12:08:23 | 6.3 |
| 1900-01-01 12:08:28 | 6.3 |
| 1900-01-01 12:08:33 | 6.3 |
| 1900-01-01 12:08:38 | 6.28 |
| 1900-01-01 12:08:43 | 6.3 |
| 1900-01-01 12:08:48 | 6.3 |
| 1900-01-01 12:08:53 | 6.3 |
| 1900-01-01 12:08:58 | 6.3 |
| 1900-01-01 12:09:03 | 6.3 |
| 1900-01-01 12:09:08 | 6.28 |
| 1900-01-01 12:09:13 | 6.28 |
| 1900-01-01 12:09:18 | 6.28 |
| 1900-01-01 12:09:23 | 6.3 |
| 1900-01-01 12:09:28 | 6.28 |
| 1900-01-01 12:09:33 | 6.3 |
| 1900-01-01 12:09:38 | 6.3 |
| 1900-01-01 12:09:43 | 6.27 |
| 1900-01-01 12:09:48 | 6.3 |
| 1900-01-01 12:09:53 | 6.29 |
| 1900-01-01 12:09:58 | 6.27 |
| 1900-01-01 12:10:03 | 6.3 |
| 1900-01-01 12:10:08 | 6.27 |
| 1900-01-01 12:10:13 | 6.27 |
| 1900-01-01 12:10:18 | 6.27 |
| 1900-01-01 12:10:23 | 6.29 |
| 1900-01-01 12:10:28 | 6.26 |
| 1900-01-01 12:10:33 | 6.29 |
| 1900-01-01 12:10:38 | 6.29 |
| 1900-01-01 12:10:43 | 6.29 |
| 1900-01-01 12:10:48 | 6.26 |
| 1900-01-01 12:10:53 | 6.26 |
| 1900-01-01 12:10:58 | 6.29 |
| 1900-01-01 12:11:03 | 6.27 |
| 1900-01-01 12:11:08 | 6.26 |
| 1900-01-01 12:11:13 | 6.29 |
| 1900-01-01 12:11:18 | 6.3 |
| 1900-01-01 12:11:23 | 6.3 |
| 1900-01-01 12:11:28 | 6.3 |
| 1900-01-01 12:11:33 | 6.3 |
| 1900-01-01 12:11:38 | 6.28 |
| 1900-01-01 12:11:43 | 6.28 |
| 1900-01-01 12:11:48 | 6.3 |
| 1900-01-01 12:11:53 | 6.3 |
| 1900-01-01 12:11:58 | 6.31 |
| 1900-01-01 12:12:03 | 6.31 |
| 1900-01-01 12:12:08 | 6.31 |
| 1900-01-01 12:12:13 | 6.31 |
| 1900-01-01 12:12:18 | 6.31 |
| 1900-01-01 12:12:23 | 6.29 |
| 1900-01-01 12:12:28 | 6.32 |
| 1900-01-01 12:12:33 | 6.3 |
| 1900-01-01 12:12:38 | 6.3 |
| 1900-01-01 12:12:43 | 6.32 |
| 1900-01-01 12:12:48 | 6.33 |
| 1900-01-01 12:12:53 | 6.33 |
| 1900-01-01 12:12:58 | 6.31 |
| 1900-01-01 12:13:03 | 6.33 |
| 1900-01-01 12:13:08 | 6.33 |
| 1900-01-01 12:13:13 | 6.32 |
| 1900-01-01 12:13:18 | 6.3 |
| 1900-01-01 12:13:23 | 6.3 |
| 1900-01-01 12:13:28 | 6.33 |
| 1900-01-01 12:13:33 | 6.3 |
| 1900-01-01 12:13:38 | 6.3 |
| 1900-01-01 12:13:43 | 6.33 |
| 1900-01-01 12:13:48 | 6.3 |
| 1900-01-01 12:13:53 | 6.3 |
| 1900-01-01 12:13:58 | 6.3 |
| 1900-01-01 12:14:03 | 6.3 |
| 1900-01-01 12:14:08 | 6.32 |
| 1900-01-01 12:14:13 | 6.32 |
| 1900-01-01 12:14:18 | 6.33 |
| 1900-01-01 12:14:23 | 6.3 |
| 1900-01-01 12:14:28 | 6.33 |
| 1900-01-01 12:14:33 | 6.33 |
| 1900-01-01 12:14:38 | 6.31 |
| 1900-01-01 12:14:43 | 6.33 |
| 1900-01-01 12:14:48 | 6.34 |
| 1900-01-01 12:14:53 | 6.33 |
| 1900-01-01 12:14:58 | 6.33 |
| 1900-01-01 12:15:03 | 6.3 |
| 1900-01-01 12:15:08 | 6.3 |
| 1900-01-01 12:15:13 | 6.33 |
| 1900-01-01 12:15:18 | 6.33 |
| 1900-01-01 12:15:23 | 6.3 |
| 1900-01-01 12:15:28 | 6.32 |
| 1900-01-01 12:15:33 | 6.3 |
| 1900-01-01 12:15:38 | 6.3 |
| 1900-01-01 12:15:43 | 6.32 |
| 1900-01-01 12:15:48 | 6.32 |
| 1900-01-01 12:15:53 | 6.29 |
| 1900-01-01 12:15:58 | 6.29 |
| 1900-01-01 12:16:03 | 6.32 |
| 1900-01-01 12:16:08 | 6.29 |
| 1900-01-01 12:16:13 | 6.32 |
| 1900-01-01 12:16:18 | 6.32 |
| 1900-01-01 12:16:23 | 6.29 |
| 1900-01-01 12:16:28 | 6.31 |
| 1900-01-01 12:16:33 | 6.31 |
| 1900-01-01 12:16:38 | 6.29 |
| 1900-01-01 12:16:43 | 6.28 |
| 1900-01-01 12:16:48 | 6.28 |
| 1900-01-01 12:16:53 | 6.31 |
| 1900-01-01 12:16:58 | 6.3 |
| 1900-01-01 12:17:03 | 6.3 |
| 1900-01-01 12:17:08 | 6.28 |
| 1900-01-01 12:17:13 | 6.3 |
| 1900-01-01 12:17:18 | 6.31 |
| 1900-01-01 12:17:23 | 6.3 |
| 1900-01-01 12:17:28 | 6.3 |
| 1900-01-01 12:17:33 | 6.3 |
| 1900-01-01 12:17:38 | 6.28 |
| 1900-01-01 12:17:43 | 6.3 |
| 1900-01-01 12:17:48 | 6.28 |
| 1900-01-01 12:17:53 | 6.28 |
| 1900-01-01 12:17:58 | 6.3 |
| 1900-01-01 12:18:03 | 6.3 |
| 1900-01-01 12:18:08 | 6.3 |
| 1900-01-01 12:18:13 | 6.27 |
| 1900-01-01 12:18:18 | 6.3 |
| 1900-01-01 12:18:23 | 6.27 |
| 1900-01-01 12:18:28 | 6.27 |
| 1900-01-01 12:18:33 | 6.28 |
| 1900-01-01 12:18:38 | 6.3 |
| 1900-01-01 12:18:43 | 6.3 |
| 1900-01-01 12:18:48 | 6.28 |
| 1900-01-01 12:18:53 | 6.28 |
| 1900-01-01 12:18:58 | 6.28 |
| 1900-01-01 12:19:03 | 6.3 |
| 1900-01-01 12:19:08 | 6.28 |
| 1900-01-01 12:19:13 | 6.3 |
| 1900-01-01 12:19:18 | 6.3 |
| 1900-01-01 12:19:23 | 6.3 |
| 1900-01-01 12:19:28 | 6.3 |
| 1900-01-01 12:19:33 | 6.3 |
| 1900-01-01 12:19:38 | 6.29 |
| 1900-01-01 12:19:43 | 6.27 |
| 1900-01-01 12:19:48 | 6.29 |
| 1900-01-01 12:19:53 | 6.29 |
| 1900-01-01 12:19:58 | 6.29 |
| 1900-01-01 12:20:03 | 6.29 |
| 1900-01-01 12:20:08 | 6.27 |
| 1900-01-01 12:20:13 | 6.3 |
| 1900-01-01 12:20:18 | 6.3 |
| 1900-01-01 12:20:23 | 6.28 |
| 1900-01-01 12:20:28 | 6.3 |
| 1900-01-01 12:20:33 | 6.28 |
| 1900-01-01 12:20:38 | 6.31 |
| 1900-01-01 12:20:43 | 6.29 |
| 1900-01-01 12:20:48 | 6.32 |
| 1900-01-01 12:20:53 | 6.29 |
| 1900-01-01 12:20:58 | 6.31 |
| 1900-01-01 12:21:03 | 6.29 |
| 1900-01-01 12:21:08 | 6.32 |
| 1900-01-01 12:21:13 | 6.33 |
| 1900-01-01 12:21:18 | 6.3 |
| 1900-01-01 12:21:23 | 6.31 |
| 1900-01-01 12:21:28 | 6.33 |
| 1900-01-01 12:21:33 | 6.33 |
| 1900-01-01 12:21:38 | 6.32 |
| 1900-01-01 12:21:43 | 6.32 |
| 1900-01-01 12:21:48 | 6.32 |
| 1900-01-01 12:21:53 | 6.32 |
| 1900-01-01 12:21:58 | 6.32 |
| 1900-01-01 12:22:03 | 6.29 |
| 1900-01-01 12:22:08 | 6.31 |
| 1900-01-01 12:22:13 | 6.28 |
| 1900-01-01 12:22:18 | 6.29 |
| 1900-01-01 12:22:23 | 6.32 |
| 1900-01-01 12:22:28 | 6.32 |
| 1900-01-01 12:22:33 | 6.31 |
| 1900-01-01 12:22:38 | 6.31 |
| 1900-01-01 12:22:43 | 6.31 |
| 1900-01-01 12:22:48 | 6.29 |
| 1900-01-01 12:22:53 | 6.28 |
| 1900-01-01 12:22:58 | 6.31 |
| 1900-01-01 12:23:03 | 6.31 |
| 1900-01-01 12:23:08 | 6.3 |
| 1900-01-01 12:23:13 | 6.3 |
| 1900-01-01 12:23:18 | 6.3 |
| 1900-01-01 12:23:23 | 6.3 |
| 1900-01-01 12:23:28 | 6.28 |
| 1900-01-01 12:23:33 | 6.3 |
| 1900-01-01 12:23:38 | 6.27 |
| 1900-01-01 12:23:43 | 6.3 |
| 1900-01-01 12:23:48 | 6.3 |
| 1900-01-01 12:23:53 | 6.3 |
| 1900-01-01 12:23:58 | 6.29 |
| 1900-01-01 12:24:03 | 6.29 |
| 1900-01-01 12:24:08 | 6.29 |
| 1900-01-01 12:24:13 | 6.28 |
| 1900-01-01 12:24:18 | 6.29 |
| 1900-01-01 12:24:23 | 6.29 |
| 1900-01-01 12:24:28 | 6.26 |
| 1900-01-01 12:24:33 | 6.26 |
| 1900-01-01 12:24:38 | 6.29 |
| 1900-01-01 12:24:43 | 6.26 |
| 1900-01-01 12:24:48 | 6.29 |
| 1900-01-01 12:24:53 | 6.29 |
| 1900-01-01 12:24:58 | 6.29 |
| 1900-01-01 12:25:03 | 6.26 |
| 1900-01-01 12:25:08 | 6.26 |
| 1900-01-01 12:25:13 | 6.28 |
| 1900-01-01 12:25:18 | 6.28 |
| 1900-01-01 12:25:23 | 6.28 |
| 1900-01-01 12:25:28 | 6.26 |
| 1900-01-01 12:25:33 | 6.26 |
| 1900-01-01 12:25:38 | 6.26 |
| 1900-01-01 12:25:43 | 6.26 |
| 1900-01-01 12:25:48 | 6.28 |
| 1900-01-01 12:25:53 | 6.28 |
| 1900-01-01 12:25:58 | 6.26 |
| 1900-01-01 12:26:03 | 6.28 |
| 1900-01-01 12:26:08 | 6.26 |
| 1900-01-01 12:26:13 | 6.28 |
| 1900-01-01 12:26:18 | 6.28 |
| 1900-01-01 12:26:23 | 6.25 |
| 1900-01-01 12:26:28 | 6.28 |
| 1900-01-01 12:26:33 | 6.25 |
| 1900-01-01 12:26:38 | 6.25 |
| 1900-01-01 12:26:43 | 6.25 |
| 1900-01-01 12:26:48 | 6.25 |
| 1900-01-01 12:26:53 | 6.25 |
| 1900-01-01 12:26:58 | 6.25 |
| 1900-01-01 12:27:03 | 6.28 |
| 1900-01-01 12:27:08 | 6.28 |
| 1900-01-01 12:27:13 | 6.25 |
| 1900-01-01 12:27:18 | 6.25 |
| 1900-01-01 12:27:23 | 6.25 |
| 1900-01-01 12:27:28 | 6.25 |
| 1900-01-01 12:27:33 | 6.25 |
| 1900-01-01 12:27:38 | 6.25 |
| 1900-01-01 12:27:43 | 6.25 |
| 1900-01-01 12:27:48 | 6.25 |
| 1900-01-01 12:27:53 | 6.28 |
| 1900-01-01 12:27:58 | 6.27 |
| 1900-01-01 12:28:03 | 6.25 |
| 1900-01-01 12:28:08 | 6.27 |
| 1900-01-01 12:28:13 | 6.28 |
| 1900-01-01 12:28:18 | 6.25 |
| 1900-01-01 12:28:23 | 6.25 |
| 1900-01-01 12:28:28 | 6.28 |
| 1900-01-01 12:28:33 | 6.28 |
| 1900-01-01 12:28:38 | 6.27 |
| 1900-01-01 12:28:43 | 6.25 |
| 1900-01-01 12:28:48 | 6.27 |
| 1900-01-01 12:28:53 | 6.27 |
| 1900-01-01 12:28:58 | 6.27 |
| 1900-01-01 12:29:03 | 6.24 |
| 1900-01-01 12:29:08 | 6.24 |
| 1900-01-01 12:29:13 | 6.27 |
| 1900-01-01 12:29:18 | 6.27 |
| 1900-01-01 12:29:23 | 6.27 |
| 1900-01-01 12:29:28 | 6.27 |
| 1900-01-01 12:29:33 | 6.26 |
| 1900-01-01 12:29:38 | 6.26 |
| 1900-01-01 12:29:43 | 6.26 |
| 1900-01-01 12:29:48 | 6.26 |
| 1900-01-01 12:29:53 | 6.26 |
| 1900-01-01 12:29:58 | 6.26 |
| 1900-01-01 12:30:03 | 6.26 |
| 1900-01-01 12:30:08 | 6.26 |
| 1900-01-01 12:30:13 | 6.23 |
| 1900-01-01 12:30:18 | 6.26 |
| 1900-01-01 12:30:23 | 6.24 |
| 1900-01-01 12:30:28 | 6.24 |
| 1900-01-01 12:30:33 | 6.24 |
| 1900-01-01 12:30:38 | 6.28 |
| 1900-01-01 12:30:43 | 6.26 |
| 1900-01-01 12:30:48 | 6.26 |
| 1900-01-01 12:30:53 | 6.26 |
| 1900-01-01 12:30:58 | 6.26 |
| 1900-01-01 12:31:03 | 6.27 |
| 1900-01-01 12:31:08 | 6.3 |
| 1900-01-01 12:31:13 | 6.27 |
| 1900-01-01 12:31:18 | 6.3 |
| 1900-01-01 12:31:23 | 6.27 |
| 1900-01-01 12:31:28 | 6.29 |
| 1900-01-01 12:31:33 | 6.28 |
| 1900-01-01 12:31:38 | 6.28 |
| 1900-01-01 12:31:43 | 6.31 |
| 1900-01-01 12:31:48 | 6.31 |
| 1900-01-01 12:31:53 | 6.31 |
| 1900-01-01 12:31:58 | 6.31 |
| 1900-01-01 12:32:03 | 6.31 |
| 1900-01-01 12:32:08 | 6.29 |
| 1900-01-01 12:32:13 | 6.29 |
| 1900-01-01 12:32:18 | 6.32 |
| 1900-01-01 12:32:23 | 6.29 |
| 1900-01-01 12:32:28 | 6.28 |
| 1900-01-01 12:32:33 | 6.28 |
| 1900-01-01 12:32:38 | 6.3 |
| 1900-01-01 12:32:43 | 6.3 |
| 1900-01-01 12:32:48 | 6.3 |
| 1900-01-01 12:32:53 | 6.3 |
| 1900-01-01 12:32:58 | 6.27 |
| 1900-01-01 12:33:03 | 6.27 |
| 1900-01-01 12:33:08 | 6.27 |
| 1900-01-01 12:33:13 | 6.28 |
| 1900-01-01 12:33:18 | 6.3 |
| 1900-01-01 12:33:23 | 6.29 |
| 1900-01-01 12:33:28 | 6.28 |
| 1900-01-01 12:33:33 | 6.29 |
| 1900-01-01 12:33:38 | 6.29 |
| 1900-01-01 12:33:43 | 6.29 |
| 1900-01-01 12:33:48 | 6.31 |
| 1900-01-01 12:33:53 | 6.31 |
| 1900-01-01 12:33:58 | 6.31 |
| 1900-01-01 12:34:03 | 6.28 |
| 1900-01-01 12:34:08 | 6.28 |
| 1900-01-01 12:34:13 | 6.3 |
| 1900-01-01 12:34:18 | 6.28 |
| 1900-01-01 12:34:23 | 6.31 |
| 1900-01-01 12:34:28 | 6.31 |
| 1900-01-01 12:34:33 | 6.28 |
| 1900-01-01 12:34:38 | 6.31 |
| 1900-01-01 12:34:43 | 6.31 |
| 1900-01-01 12:34:48 | 6.29 |
| 1900-01-01 12:34:53 | 6.28 |
| 1900-01-01 12:34:58 | 6.28 |
| 1900-01-01 12:35:03 | 6.31 |
| 1900-01-01 12:35:08 | 6.31 |
| 1900-01-01 12:35:13 | 6.31 |
| 1900-01-01 12:35:18 | 6.29 |
| 1900-01-01 12:35:23 | 6.29 |
| 1900-01-01 12:35:28 | 6.29 |
| 1900-01-01 12:35:33 | 6.32 |
| 1900-01-01 12:35:38 | 6.29 |
| 1900-01-01 12:35:43 | 6.32 |
| 1900-01-01 12:35:48 | 6.29 |
| 1900-01-01 12:35:53 | 6.32 |
| 1900-01-01 12:35:58 | 6.31 |
| 1900-01-01 12:36:03 | 4.16 |
| 1900-01-01 12:36:08 | 4.17 |
| 1900-01-01 12:36:13 | 4.16 |
| 1900-01-01 12:36:18 | 4.16 |
| 1900-01-01 12:36:23 | 4.16 |
| 1900-01-01 12:36:28 | 4.16 |
| 1900-01-01 12:36:33 | 4.17 |
| 1900-01-01 12:36:38 | 4.16 |
| 1900-01-01 12:36:43 | 4.16 |
| 1900-01-01 12:36:48 | 4.16 |
| 1900-01-01 12:36:53 | 4.16 |
| 1900-01-01 12:36:58 | 4.16 |
| 1900-01-01 12:37:03 | 4.16 |
| 1900-01-01 12:37:08 | 4.16 |
| 1900-01-01 12:37:13 | 4.16 |
| 1900-01-01 12:37:18 | 4.16 |
| 1900-01-01 12:37:23 | 4.16 |
| 1900-01-01 12:37:28 | 4.16 |
| 1900-01-01 12:37:33 | 4.16 |
| 1900-01-01 12:37:38 | 4.17 |
| 1900-01-01 12:37:43 | 4.16 |
| 1900-01-01 12:37:48 | 4.16 |
| 1900-01-01 12:37:53 | 4.16 |
| 1900-01-01 12:37:58 | 4.16 |
| 1900-01-01 12:38:03 | 4.15 |
| 1900-01-01 12:38:08 | 4.15 |
| 1900-01-01 12:38:13 | 4.16 |
| 1900-01-01 12:38:18 | 4.16 |
| 1900-01-01 12:38:23 | 4.16 |
| 1900-01-01 12:38:28 | 4.16 |
| 1900-01-01 12:38:33 | 4.16 |
| 1900-01-01 12:38:38 | 4.15 |
| 1900-01-01 12:38:43 | 4.16 |
| 1900-01-01 12:38:48 | 4.16 |
| 1900-01-01 12:38:53 | 4.16 |
| 1900-01-01 12:38:58 | 4.16 |
| 1900-01-01 12:39:03 | 4.16 |
| 1900-01-01 12:39:08 | 4.17 |
| 1900-01-01 12:39:13 | 4.16 |
| 1900-01-01 12:39:18 | 4.16 |
| 1900-01-01 12:39:23 | 4.16 |
| 1900-01-01 12:39:28 | 4.16 |
| 1900-01-01 12:39:33 | 4.16 |
| 1900-01-01 12:39:38 | 4.16 |
| 1900-01-01 12:39:43 | 4.16 |
| 1900-01-01 12:39:48 | 4.17 |
| 1900-01-01 12:39:53 | 4.17 |
| 1900-01-01 12:39:58 | 4.16 |
| 1900-01-01 12:40:03 | 4.16 |
| 1900-01-01 12:40:08 | 4.17 |
| 1900-01-01 12:40:13 | 4.16 |
| 1900-01-01 12:40:18 | 4.16 |
| 1900-01-01 12:40:23 | 4.16 |
| 1900-01-01 12:40:28 | 4.16 |
| 1900-01-01 12:40:33 | 4.16 |
| 1900-01-01 12:40:38 | 4.16 |
| 1900-01-01 12:40:43 | 4.16 |
| 1900-01-01 12:40:48 | 4.17 |
| 1900-01-01 12:40:53 | 4.16 |
| 1900-01-01 12:40:58 | 4.16 |
| 1900-01-01 12:41:03 | 4.16 |
| 1900-01-01 12:41:08 | 4.16 |
| 1900-01-01 12:41:13 | 4.15 |
| 1900-01-01 12:41:18 | 4.16 |
| 1900-01-01 12:41:23 | 4.16 |
| 1900-01-01 12:41:28 | 4.16 |
| 1900-01-01 12:41:33 | 4.16 |
| 1900-01-01 12:41:38 | 4.16 |
| 1900-01-01 12:41:43 | 4.16 |
| 1900-01-01 12:41:48 | 4.15 |
| 1900-01-01 12:41:53 | 4.17 |
| 1900-01-01 12:41:58 | 4.16 |
| 1900-01-01 12:42:03 | 4.16 |
| 1900-01-01 12:42:08 | 4.16 |
| 1900-01-01 12:42:13 | 4.16 |
| 1900-01-01 12:42:18 | 4.16 |
| 1900-01-01 12:42:23 | 4.16 |
| 1900-01-01 12:42:28 | 4.16 |
| 1900-01-01 12:42:33 | 4.16 |
| 1900-01-01 12:42:38 | 4.16 |
| 1900-01-01 12:42:43 | 4.16 |
| 1900-01-01 12:42:48 | 4.16 |
| 1900-01-01 12:42:53 | 4.15 |
| 1900-01-01 12:42:58 | 4.16 |
| 1900-01-01 12:43:03 | 4.16 |
| 1900-01-01 12:43:08 | 4.16 |
| 1900-01-01 12:43:13 | 4.16 |
| 1900-01-01 12:43:18 | 4.16 |
| 1900-01-01 12:43:23 | 4.16 |
| 1900-01-01 12:43:28 | 4.16 |
| 1900-01-01 12:43:33 | 4.16 |
| 1900-01-01 12:43:38 | 4.16 |
| 1900-01-01 12:43:43 | 4.16 |
| 1900-01-01 12:43:48 | 4.16 |
| 1900-01-01 12:43:53 | 4.16 |
| 1900-01-01 12:43:58 | 4.15 |
| 1900-01-01 12:44:03 | 4.16 |
| 1900-01-01 12:44:08 | 4.16 |
| 1900-01-01 12:44:13 | 4.16 |
| 1900-01-01 12:44:18 | 4.16 |
| 1900-01-01 12:44:23 | 4.16 |
| 1900-01-01 12:44:28 | 4.16 |
| 1900-01-01 12:44:33 | 4.16 |
| 1900-01-01 12:44:38 | 4.16 |
| 1900-01-01 12:44:43 | 4.16 |
| 1900-01-01 12:44:48 | 4.16 |
| 1900-01-01 12:44:53 | 4.16 |
| 1900-01-01 12:44:58 | 4.16 |
| 1900-01-01 12:45:03 | 4.16 |
| 1900-01-01 12:45:08 | 4.16 |
| 1900-01-01 12:45:13 | 4.16 |
| 1900-01-01 12:45:18 | 4.16 |
| 1900-01-01 12:45:23 | 4.16 |
| 1900-01-01 12:45:28 | 4.16 |
| 1900-01-01 12:45:33 | 4.16 |
| 1900-01-01 12:45:38 | 4.16 |
| 1900-01-01 12:45:43 | 4.16 |
| 1900-01-01 12:45:48 | 4.16 |
| 1900-01-01 12:45:53 | 4.16 |
| 1900-01-01 12:45:58 | 4.16 |
| 1900-01-01 12:46:03 | 4.16 |
| 1900-01-01 12:46:08 | 4.16 |
| 1900-01-01 12:46:13 | 4.16 |
| 1900-01-01 12:46:18 | 4.16 |
| 1900-01-01 12:46:23 | 4.16 |
| 1900-01-01 12:46:28 | 4.16 |
| 1900-01-01 12:46:33 | 4.16 |
| 1900-01-01 12:46:38 | 4.16 |
| 1900-01-01 12:46:43 | 4.16 |
| 1900-01-01 12:46:48 | 4.16 |
| 1900-01-01 12:46:53 | 4.16 |
| 1900-01-01 12:46:58 | 4.16 |
| 1900-01-01 12:47:03 | 4.16 |
| 1900-01-01 12:47:08 | 4.16 |
| 1900-01-01 12:47:13 | 4.15 |
| 1900-01-01 12:47:18 | 4.16 |
| 1900-01-01 12:47:23 | 4.16 |
| 1900-01-01 12:47:28 | 4.16 |
| 1900-01-01 12:47:33 | 4.16 |
| 1900-01-01 12:47:38 | 4.16 |
| 1900-01-01 12:47:43 | 4.16 |
| 1900-01-01 12:47:48 | 4.16 |
| 1900-01-01 12:47:53 | 4.16 |
| 1900-01-01 12:47:58 | 4.15 |
| 1900-01-01 12:48:03 | 4.16 |
| 1900-01-01 12:48:08 | 4.16 |
| 1900-01-01 12:48:13 | 4.17 |
| 1900-01-01 12:48:18 | 4.16 |
| 1900-01-01 12:48:23 | 4.16 |
| 1900-01-01 12:48:28 | 4.16 |
| 1900-01-01 12:48:33 | 4.16 |
| 1900-01-01 12:48:38 | 4.16 |
| 1900-01-01 12:48:43 | 4.16 |
| 1900-01-01 12:48:48 | 4.16 |
| 1900-01-01 12:48:53 | 4.16 |
| 1900-01-01 12:48:58 | 4.16 |
| 1900-01-01 12:49:03 | 4.16 |
| 1900-01-01 12:49:08 | 4.16 |
| 1900-01-01 12:49:13 | 4.16 |
| 1900-01-01 12:49:18 | 4.16 |
| 1900-01-01 12:49:23 | 4.16 |
| 1900-01-01 12:49:28 | 4.16 |
| 1900-01-01 12:49:33 | 4.16 |
| 1900-01-01 12:49:38 | 4.16 |
| 1900-01-01 12:49:43 | 4.16 |
| 1900-01-01 12:49:48 | 4.16 |
| 1900-01-01 12:49:53 | 4.16 |
| 1900-01-01 12:49:58 | 4.16 |
| 1900-01-01 12:50:03 | 4.16 |
| 1900-01-01 12:50:08 | 4.16 |
| 1900-01-01 12:50:13 | 4.16 |
| 1900-01-01 12:50:18 | 4.16 |
| 1900-01-01 12:50:23 | 4.16 |
| 1900-01-01 12:50:28 | 4.16 |
| 1900-01-01 12:50:33 | 4.16 |
| 1900-01-01 12:50:38 | 4.15 |
| 1900-01-01 12:50:43 | 4.16 |
| 1900-01-01 12:50:48 | 4.16 |
| 1900-01-01 12:50:53 | 4.16 |
| 1900-01-01 12:50:58 | 4.16 |
| 1900-01-01 12:51:03 | 4.16 |
| 1900-01-01 12:51:08 | 4.16 |
| 1900-01-01 12:51:13 | 4.16 |
| 1900-01-01 12:51:18 | 4.16 |
| 1900-01-01 12:51:23 | 4.15 |
| 1900-01-01 12:51:28 | 4.16 |
| 1900-01-01 12:51:33 | 4.16 |
| 1900-01-01 12:51:38 | 4.16 |
| 1900-01-01 12:51:43 | 4.16 |
| 1900-01-01 12:51:48 | 4.15 |
| 1900-01-01 12:51:53 | 4.16 |
| 1900-01-01 12:51:58 | 4.16 |
| 1900-01-01 12:52:03 | 4.16 |
| 1900-01-01 12:52:08 | 4.16 |
| 1900-01-01 12:52:13 | 4.16 |
| 1900-01-01 12:52:18 | 4.16 |
| 1900-01-01 12:52:23 | 4.16 |
| 1900-01-01 12:52:28 | 4.16 |
| 1900-01-01 12:52:33 | 4.15 |
| 1900-01-01 12:52:38 | 4.16 |
| 1900-01-01 12:52:43 | 4.16 |
| 1900-01-01 12:52:48 | 4.16 |
| 1900-01-01 12:52:53 | 4.16 |
| 1900-01-01 12:52:58 | 4.16 |
| 1900-01-01 12:53:03 | 4.16 |
| 1900-01-01 12:53:08 | 4.16 |
| 1900-01-01 12:53:13 | 4.16 |
| 1900-01-01 12:53:18 | 4.16 |
| 1900-01-01 12:53:23 | 4.16 |
| 1900-01-01 12:53:28 | 4.15 |
| 1900-01-01 12:53:33 | 4.16 |
| 1900-01-01 12:53:38 | 4.16 |
| 1900-01-01 12:53:43 | 4.16 |
| 1900-01-01 12:53:48 | 4.15 |
| 1900-01-01 12:53:53 | 4.16 |
| 1900-01-01 12:53:58 | 4.16 |
| 1900-01-01 12:54:03 | 4.16 |
| 1900-01-01 12:54:08 | 4.16 |
| 1900-01-01 12:54:13 | 4.16 |
| 1900-01-01 12:54:18 | 4.16 |
| 1900-01-01 12:54:23 | 4.16 |
| 1900-01-01 12:54:28 | 4.16 |
| 1900-01-01 12:54:33 | 4.16 |
| 1900-01-01 12:54:38 | 4.16 |
| 1900-01-01 12:54:43 | 4.16 |
| 1900-01-01 12:54:48 | 4.16 |
| 1900-01-01 12:54:53 | 4.16 |
| 1900-01-01 12:54:58 | 4.16 |
| 1900-01-01 12:55:03 | 4.16 |
| 1900-01-01 12:55:08 | 4.16 |
| 1900-01-01 12:55:13 | 4.16 |
| 1900-01-01 12:55:18 | 4.16 |
| 1900-01-01 12:55:23 | 4.15 |
| 1900-01-01 12:55:28 | 4.16 |
| 1900-01-01 12:55:33 | 4.16 |
| 1900-01-01 12:55:38 | 4.16 |
| 1900-01-01 12:55:43 | 4.16 |
| 1900-01-01 12:55:48 | 4.16 |
| 1900-01-01 12:55:53 | 4.16 |
| 1900-01-01 12:55:58 | 4.16 |
| 1900-01-01 12:56:03 | 4.15 |
| 1900-01-01 12:56:08 | 4.16 |
| 1900-01-01 12:56:13 | 4.16 |
| 1900-01-01 12:56:18 | 4.16 |
| 1900-01-01 12:56:23 | 4.16 |
| 1900-01-01 12:56:28 | 4.16 |
| 1900-01-01 12:56:33 | 4.16 |
| 1900-01-01 12:56:38 | 4.16 |
| 1900-01-01 12:56:43 | 4.16 |
| 1900-01-01 12:56:48 | 4.16 |
| 1900-01-01 12:56:53 | 4.16 |